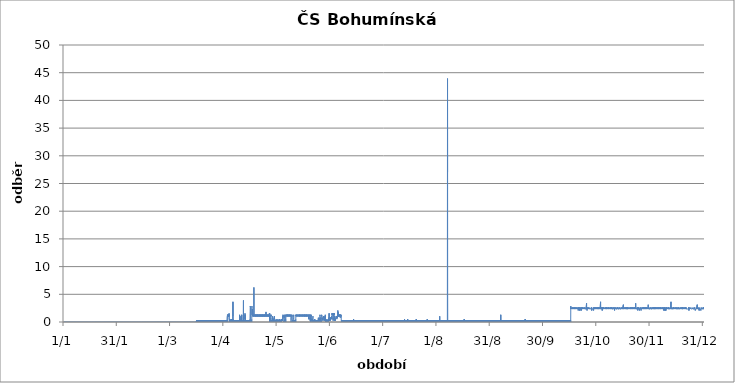
| Category | Series 0 |
|---|---|
| 2012-01-01 01:00:00 | 0 |
| 2012-01-01 02:00:00 | 0 |
| 2012-01-01 03:00:00 | 0 |
| 2012-01-01 04:00:00 | 0 |
| 2012-01-01 05:00:00 | 0 |
| 2012-01-01 06:00:00 | 0 |
| 2012-01-01 07:00:00 | 0 |
| 2012-01-01 08:00:00 | 0 |
| 2012-01-01 09:00:00 | 0 |
| 2012-01-01 10:00:00 | 0 |
| 2012-01-01 11:00:00 | 0 |
| 2012-01-01 12:00:00 | 0 |
| 2012-01-01 13:00:00 | 0 |
| 2012-01-01 14:00:00 | 0 |
| 2012-01-01 15:00:00 | 0 |
| 2012-01-01 16:00:00 | 0 |
| 2012-01-01 17:00:00 | 0 |
| 2012-01-01 18:00:00 | 0 |
| 2012-01-01 19:00:00 | 0 |
| 2012-01-01 20:00:00 | 0 |
| 2012-01-01 21:00:00 | 0 |
| 2012-01-01 22:00:00 | 0 |
| 2012-01-01 23:00:00 | 0 |
| 2012-01-02 | 0 |
| 2012-01-02 01:00:00 | 0 |
| 2012-01-02 02:00:00 | 0 |
| 2012-01-02 03:00:00 | 0 |
| 2012-01-02 04:00:00 | 0 |
| 2012-01-02 05:00:00 | 0 |
| 2012-01-02 06:00:00 | 0 |
| 2012-01-02 07:00:00 | 0 |
| 2012-01-02 08:00:00 | 0 |
| 2012-01-02 09:00:00 | 0 |
| 2012-01-02 10:00:00 | 0 |
| 2012-01-02 11:00:00 | 0 |
| 2012-01-02 12:00:00 | 0 |
| 2012-01-02 13:00:00 | 0 |
| 2012-01-02 14:00:00 | 0 |
| 2012-01-02 15:00:00 | 0 |
| 2012-01-02 16:00:00 | 0 |
| 2012-01-02 17:00:00 | 0 |
| 2012-01-02 18:00:00 | 0 |
| 2012-01-02 19:00:00 | 0 |
| 2012-01-02 20:00:00 | 0 |
| 2012-01-02 21:00:00 | 0 |
| 2012-01-02 22:00:00 | 0 |
| 2012-01-02 23:00:00 | 0 |
| 2012-01-03 | 0 |
| 2012-01-03 01:00:00 | 0 |
| 2012-01-03 02:00:00 | 0 |
| 2012-01-03 03:00:00 | 0 |
| 2012-01-03 04:00:00 | 0 |
| 2012-01-03 05:00:00 | 0 |
| 2012-01-03 06:00:00 | 0 |
| 2012-01-03 07:00:00 | 0 |
| 2012-01-03 08:00:00 | 0 |
| 2012-01-03 09:00:00 | 0 |
| 2012-01-03 10:00:00 | 0 |
| 2012-01-03 11:00:00 | 0 |
| 2012-01-03 12:00:00 | 0 |
| 2012-01-03 13:00:00 | 0 |
| 2012-01-03 14:00:00 | 0 |
| 2012-01-03 15:00:00 | 0 |
| 2012-01-03 16:00:00 | 0 |
| 2012-01-03 17:00:00 | 0 |
| 2012-01-03 18:00:00 | 0 |
| 2012-01-03 19:00:00 | 0 |
| 2012-01-03 20:00:00 | 0 |
| 2012-01-03 21:00:00 | 0 |
| 2012-01-03 22:00:00 | 0 |
| 2012-01-03 23:00:00 | 0 |
| 2012-01-04 | 0 |
| 2012-01-04 01:00:00 | 0 |
| 2012-01-04 02:00:00 | 0 |
| 2012-01-04 03:00:00 | 0 |
| 2012-01-04 04:00:00 | 0 |
| 2012-01-04 05:00:00 | 0 |
| 2012-01-04 06:00:00 | 0 |
| 2012-01-04 07:00:00 | 0 |
| 2012-01-04 08:00:00 | 0 |
| 2012-01-04 09:00:00 | 0 |
| 2012-01-04 10:00:00 | 0 |
| 2012-01-04 11:00:00 | 0 |
| 2012-01-04 12:00:00 | 0 |
| 2012-01-04 13:00:00 | 0 |
| 2012-01-04 14:00:00 | 0 |
| 2012-01-04 15:00:00 | 0 |
| 2012-01-04 16:00:00 | 0 |
| 2012-01-04 17:00:00 | 0 |
| 2012-01-04 18:00:00 | 0 |
| 2012-01-04 19:00:00 | 0 |
| 2012-01-04 20:00:00 | 0 |
| 2012-01-04 21:00:00 | 0 |
| 2012-01-04 22:00:00 | 0 |
| 2012-01-04 23:00:00 | 0 |
| 2012-01-05 | 0 |
| 2012-01-05 01:00:00 | 0 |
| 2012-01-05 02:00:00 | 0 |
| 2012-01-05 03:00:00 | 0 |
| 2012-01-05 04:00:00 | 0 |
| 2012-01-05 05:00:00 | 0 |
| 2012-01-05 06:00:00 | 0 |
| 2012-01-05 07:00:00 | 0 |
| 2012-01-05 08:00:00 | 0 |
| 2012-01-05 09:00:00 | 0 |
| 2012-01-05 10:00:00 | 0 |
| 2012-01-05 11:00:00 | 0 |
| 2012-01-05 12:00:00 | 0 |
| 2012-01-05 13:00:00 | 0 |
| 2012-01-05 14:00:00 | 0 |
| 2012-01-05 15:00:00 | 0 |
| 2012-01-05 16:00:00 | 0 |
| 2012-01-05 17:00:00 | 0 |
| 2012-01-05 18:00:00 | 0 |
| 2012-01-05 19:00:00 | 0 |
| 2012-01-05 20:00:00 | 0 |
| 2012-01-05 21:00:00 | 0 |
| 2012-01-05 22:00:00 | 0 |
| 2012-01-05 23:00:00 | 0 |
| 2012-01-06 | 0 |
| 2012-01-06 01:00:00 | 0 |
| 2012-01-06 02:00:00 | 0 |
| 2012-01-06 03:00:00 | 0 |
| 2012-01-06 04:00:00 | 0 |
| 2012-01-06 05:00:00 | 0 |
| 2012-01-06 06:00:00 | 0 |
| 2012-01-06 07:00:00 | 0 |
| 2012-01-06 08:00:00 | 0 |
| 2012-01-06 09:00:00 | 0 |
| 2012-01-06 10:00:00 | 0 |
| 2012-01-06 11:00:00 | 0 |
| 2012-01-06 12:00:00 | 0 |
| 2012-01-06 13:00:00 | 0 |
| 2012-01-06 14:00:00 | 0 |
| 2012-01-06 15:00:00 | 0 |
| 2012-01-06 16:00:00 | 0 |
| 2012-01-06 17:00:00 | 0 |
| 2012-01-06 18:00:00 | 0 |
| 2012-01-06 19:00:00 | 0 |
| 2012-01-06 20:00:00 | 0 |
| 2012-01-06 21:00:00 | 0 |
| 2012-01-06 22:00:00 | 0 |
| 2012-01-06 23:00:00 | 0 |
| 2012-01-07 | 0 |
| 2012-01-07 01:00:00 | 0 |
| 2012-01-07 02:00:00 | 0 |
| 2012-01-07 03:00:00 | 0 |
| 2012-01-07 04:00:00 | 0 |
| 2012-01-07 05:00:00 | 0 |
| 2012-01-07 06:00:00 | 0 |
| 2012-01-07 07:00:00 | 0 |
| 2012-01-07 08:00:00 | 0 |
| 2012-01-07 09:00:00 | 0 |
| 2012-01-07 10:00:00 | 0 |
| 2012-01-07 11:00:00 | 0 |
| 2012-01-07 12:00:00 | 0 |
| 2012-01-07 13:00:00 | 0 |
| 2012-01-07 14:00:00 | 0 |
| 2012-01-07 15:00:00 | 0 |
| 2012-01-07 16:00:00 | 0 |
| 2012-01-07 17:00:00 | 0 |
| 2012-01-07 18:00:00 | 0 |
| 2012-01-07 19:00:00 | 0 |
| 2012-01-07 20:00:00 | 0 |
| 2012-01-07 21:00:00 | 0 |
| 2012-01-07 22:00:00 | 0 |
| 2012-01-07 23:00:00 | 0 |
| 2012-01-08 | 0 |
| 2012-01-08 01:00:00 | 0 |
| 2012-01-08 02:00:00 | 0 |
| 2012-01-08 03:00:00 | 0 |
| 2012-01-08 04:00:00 | 0 |
| 2012-01-08 05:00:00 | 0 |
| 2012-01-08 06:00:00 | 0 |
| 2012-01-08 07:00:00 | 0 |
| 2012-01-08 08:00:00 | 0 |
| 2012-01-08 09:00:00 | 0 |
| 2012-01-08 10:00:00 | 0 |
| 2012-01-08 11:00:00 | 0 |
| 2012-01-08 12:00:00 | 0 |
| 2012-01-08 13:00:00 | 0 |
| 2012-01-08 14:00:00 | 0 |
| 2012-01-08 15:00:00 | 0 |
| 2012-01-08 16:00:00 | 0 |
| 2012-01-08 17:00:00 | 0 |
| 2012-01-08 18:00:00 | 0 |
| 2012-01-08 19:00:00 | 0 |
| 2012-01-08 20:00:00 | 0 |
| 2012-01-08 21:00:00 | 0 |
| 2012-01-08 22:00:00 | 0 |
| 2012-01-08 23:00:00 | 0 |
| 2012-01-09 | 0 |
| 2012-01-09 01:00:00 | 0 |
| 2012-01-09 02:00:00 | 0 |
| 2012-01-09 03:00:00 | 0 |
| 2012-01-09 04:00:00 | 0 |
| 2012-01-09 05:00:00 | 0 |
| 2012-01-09 06:00:00 | 0 |
| 2012-01-09 07:00:00 | 0 |
| 2012-01-09 08:00:00 | 0 |
| 2012-01-09 09:00:00 | 0 |
| 2012-01-09 10:00:00 | 0 |
| 2012-01-09 11:00:00 | 0 |
| 2012-01-09 12:00:00 | 0 |
| 2012-01-09 13:00:00 | 0 |
| 2012-01-09 14:00:00 | 0 |
| 2012-01-09 15:00:00 | 0 |
| 2012-01-09 16:00:00 | 0 |
| 2012-01-09 17:00:00 | 0 |
| 2012-01-09 18:00:00 | 0 |
| 2012-01-09 19:00:00 | 0 |
| 2012-01-09 20:00:00 | 0 |
| 2012-01-09 21:00:00 | 0 |
| 2012-01-09 22:00:00 | 0 |
| 2012-01-09 23:00:00 | 0 |
| 2012-01-10 | 0 |
| 2012-01-10 01:00:00 | 0 |
| 2012-01-10 02:00:00 | 0 |
| 2012-01-10 03:00:00 | 0 |
| 2012-01-10 04:00:00 | 0 |
| 2012-01-10 05:00:00 | 0 |
| 2012-01-10 06:00:00 | 0 |
| 2012-01-10 07:00:00 | 0 |
| 2012-01-10 08:00:00 | 0 |
| 2012-01-10 09:00:00 | 0 |
| 2012-01-10 10:00:00 | 0 |
| 2012-01-10 11:00:00 | 0 |
| 2012-01-10 12:00:00 | 0 |
| 2012-01-10 13:00:00 | 0 |
| 2012-01-10 14:00:00 | 0 |
| 2012-01-10 15:00:00 | 0 |
| 2012-01-10 16:00:00 | 0 |
| 2012-01-10 17:00:00 | 0 |
| 2012-01-10 18:00:00 | 0 |
| 2012-01-10 19:00:00 | 0 |
| 2012-01-10 20:00:00 | 0 |
| 2012-01-10 21:00:00 | 0 |
| 2012-01-10 22:00:00 | 0 |
| 2012-01-10 23:00:00 | 0 |
| 2012-01-11 | 0 |
| 2012-01-11 01:00:00 | 0 |
| 2012-01-11 02:00:00 | 0 |
| 2012-01-11 03:00:00 | 0 |
| 2012-01-11 04:00:00 | 0 |
| 2012-01-11 05:00:00 | 0 |
| 2012-01-11 06:00:00 | 0 |
| 2012-01-11 07:00:00 | 0 |
| 2012-01-11 08:00:00 | 0 |
| 2012-01-11 09:00:00 | 0 |
| 2012-01-11 10:00:00 | 0 |
| 2012-01-11 11:00:00 | 0 |
| 2012-01-11 12:00:00 | 0 |
| 2012-01-11 13:00:00 | 0 |
| 2012-01-11 14:00:00 | 0 |
| 2012-01-11 15:00:00 | 0 |
| 2012-01-11 16:00:00 | 0 |
| 2012-01-11 17:00:00 | 0 |
| 2012-01-11 18:00:00 | 0 |
| 2012-01-11 19:00:00 | 0 |
| 2012-01-11 20:00:00 | 0 |
| 2012-01-11 21:00:00 | 0 |
| 2012-01-11 22:00:00 | 0 |
| 2012-01-11 23:00:00 | 0 |
| 2012-01-12 | 0 |
| 2012-01-12 01:00:00 | 0 |
| 2012-01-12 02:00:00 | 0 |
| 2012-01-12 03:00:00 | 0 |
| 2012-01-12 04:00:00 | 0 |
| 2012-01-12 05:00:00 | 0 |
| 2012-01-12 06:00:00 | 0 |
| 2012-01-12 07:00:00 | 0 |
| 2012-01-12 08:00:00 | 0 |
| 2012-01-12 09:00:00 | 0 |
| 2012-01-12 10:00:00 | 0 |
| 2012-01-12 11:00:00 | 0 |
| 2012-01-12 12:00:00 | 0 |
| 2012-01-12 13:00:00 | 0 |
| 2012-01-12 14:00:00 | 0 |
| 2012-01-12 15:00:00 | 0 |
| 2012-01-12 16:00:00 | 0 |
| 2012-01-12 17:00:00 | 0 |
| 2012-01-12 18:00:00 | 0 |
| 2012-01-12 19:00:00 | 0 |
| 2012-01-12 20:00:00 | 0 |
| 2012-01-12 21:00:00 | 0 |
| 2012-01-12 22:00:00 | 0 |
| 2012-01-12 23:00:00 | 0 |
| 2012-01-13 | 0 |
| 2012-01-13 01:00:00 | 0 |
| 2012-01-13 02:00:00 | 0 |
| 2012-01-13 03:00:00 | 0 |
| 2012-01-13 04:00:00 | 0 |
| 2012-01-13 05:00:00 | 0 |
| 2012-01-13 06:00:00 | 0 |
| 2012-01-13 07:00:00 | 0 |
| 2012-01-13 08:00:00 | 0 |
| 2012-01-13 09:00:00 | 0 |
| 2012-01-13 10:00:00 | 0 |
| 2012-01-13 11:00:00 | 0 |
| 2012-01-13 12:00:00 | 0 |
| 2012-01-13 13:00:00 | 0 |
| 2012-01-13 14:00:00 | 0 |
| 2012-01-13 15:00:00 | 0 |
| 2012-01-13 16:00:00 | 0 |
| 2012-01-13 17:00:00 | 0 |
| 2012-01-13 18:00:00 | 0 |
| 2012-01-13 19:00:00 | 0 |
| 2012-01-13 20:00:00 | 0 |
| 2012-01-13 21:00:00 | 0 |
| 2012-01-13 22:00:00 | 0 |
| 2012-01-13 23:00:00 | 0 |
| 2012-01-14 | 0 |
| 2012-01-14 01:00:00 | 0 |
| 2012-01-14 02:00:00 | 0 |
| 2012-01-14 03:00:00 | 0 |
| 2012-01-14 04:00:00 | 0 |
| 2012-01-14 05:00:00 | 0 |
| 2012-01-14 06:00:00 | 0 |
| 2012-01-14 07:00:00 | 0 |
| 2012-01-14 08:00:00 | 0 |
| 2012-01-14 09:00:00 | 0 |
| 2012-01-14 10:00:00 | 0 |
| 2012-01-14 11:00:00 | 0 |
| 2012-01-14 12:00:00 | 0 |
| 2012-01-14 13:00:00 | 0 |
| 2012-01-14 14:00:00 | 0 |
| 2012-01-14 15:00:00 | 0 |
| 2012-01-14 16:00:00 | 0 |
| 2012-01-14 17:00:00 | 0 |
| 2012-01-14 18:00:00 | 0 |
| 2012-01-14 19:00:00 | 0 |
| 2012-01-14 20:00:00 | 0 |
| 2012-01-14 21:00:00 | 0 |
| 2012-01-14 22:00:00 | 0 |
| 2012-01-14 23:00:00 | 0 |
| 2012-01-15 | 0 |
| 2012-01-15 01:00:00 | 0 |
| 2012-01-15 02:00:00 | 0 |
| 2012-01-15 03:00:00 | 0 |
| 2012-01-15 04:00:00 | 0 |
| 2012-01-15 05:00:00 | 0 |
| 2012-01-15 06:00:00 | 0 |
| 2012-01-15 07:00:00 | 0 |
| 2012-01-15 08:00:00 | 0 |
| 2012-01-15 09:00:00 | 0 |
| 2012-01-15 10:00:00 | 0 |
| 2012-01-15 11:00:00 | 0 |
| 2012-01-15 12:00:00 | 0 |
| 2012-01-15 13:00:00 | 0 |
| 2012-01-15 14:00:00 | 0 |
| 2012-01-15 15:00:00 | 0 |
| 2012-01-15 16:00:00 | 0 |
| 2012-01-15 17:00:00 | 0 |
| 2012-01-15 18:00:00 | 0 |
| 2012-01-15 19:00:00 | 0 |
| 2012-01-15 20:00:00 | 0 |
| 2012-01-15 21:00:00 | 0 |
| 2012-01-15 22:00:00 | 0 |
| 2012-01-15 23:00:00 | 0 |
| 2012-01-16 | 0 |
| 2012-01-16 01:00:00 | 0 |
| 2012-01-16 02:00:00 | 0 |
| 2012-01-16 03:00:00 | 0 |
| 2012-01-16 04:00:00 | 0 |
| 2012-01-16 05:00:00 | 0 |
| 2012-01-16 06:00:00 | 0 |
| 2012-01-16 07:00:00 | 0 |
| 2012-01-16 08:00:00 | 0 |
| 2012-01-16 09:00:00 | 0 |
| 2012-01-16 10:00:00 | 0 |
| 2012-01-16 11:00:00 | 0 |
| 2012-01-16 12:00:00 | 0 |
| 2012-01-16 13:00:00 | 0 |
| 2012-01-16 14:00:00 | 0 |
| 2012-01-16 15:00:00 | 0 |
| 2012-01-16 16:00:00 | 0 |
| 2012-01-16 17:00:00 | 0 |
| 2012-01-16 18:00:00 | 0 |
| 2012-01-16 19:00:00 | 0 |
| 2012-01-16 20:00:00 | 0 |
| 2012-01-16 21:00:00 | 0 |
| 2012-01-16 22:00:00 | 0 |
| 2012-01-16 23:00:00 | 0 |
| 2012-01-17 | 0 |
| 2012-01-17 01:00:00 | 0 |
| 2012-01-17 02:00:00 | 0 |
| 2012-01-17 03:00:00 | 0 |
| 2012-01-17 04:00:00 | 0 |
| 2012-01-17 05:00:00 | 0 |
| 2012-01-17 06:00:00 | 0 |
| 2012-01-17 07:00:00 | 0 |
| 2012-01-17 08:00:00 | 0 |
| 2012-01-17 09:00:00 | 0 |
| 2012-01-17 10:00:00 | 0 |
| 2012-01-17 11:00:00 | 0 |
| 2012-01-17 12:00:00 | 0 |
| 2012-01-17 13:00:00 | 0 |
| 2012-01-17 14:00:00 | 0 |
| 2012-01-17 15:00:00 | 0 |
| 2012-01-17 16:00:00 | 0 |
| 2012-01-17 17:00:00 | 0 |
| 2012-01-17 18:00:00 | 0 |
| 2012-01-17 19:00:00 | 0 |
| 2012-01-17 20:00:00 | 0 |
| 2012-01-17 21:00:00 | 0 |
| 2012-01-17 22:00:00 | 0 |
| 2012-01-17 23:00:00 | 0 |
| 2012-01-18 | 0 |
| 2012-01-18 01:00:00 | 0 |
| 2012-01-18 02:00:00 | 0 |
| 2012-01-18 03:00:00 | 0 |
| 2012-01-18 04:00:00 | 0 |
| 2012-01-18 05:00:00 | 0 |
| 2012-01-18 06:00:00 | 0 |
| 2012-01-18 07:00:00 | 0 |
| 2012-01-18 08:00:00 | 0 |
| 2012-01-18 09:00:00 | 0 |
| 2012-01-18 10:00:00 | 0 |
| 2012-01-18 11:00:00 | 0 |
| 2012-01-18 12:00:00 | 0 |
| 2012-01-18 13:00:00 | 0 |
| 2012-01-18 14:00:00 | 0 |
| 2012-01-18 15:00:00 | 0 |
| 2012-01-18 16:00:00 | 0 |
| 2012-01-18 17:00:00 | 0 |
| 2012-01-18 18:00:00 | 0 |
| 2012-01-18 19:00:00 | 0 |
| 2012-01-18 20:00:00 | 0 |
| 2012-01-18 21:00:00 | 0 |
| 2012-01-18 22:00:00 | 0 |
| 2012-01-18 23:00:00 | 0 |
| 2012-01-19 | 0 |
| 2012-01-19 01:00:00 | 0 |
| 2012-01-19 02:00:00 | 0 |
| 2012-01-19 03:00:00 | 0 |
| 2012-01-19 04:00:00 | 0 |
| 2012-01-19 05:00:00 | 0 |
| 2012-01-19 06:00:00 | 0 |
| 2012-01-19 07:00:00 | 0 |
| 2012-01-19 08:00:00 | 0 |
| 2012-01-19 09:00:00 | 0 |
| 2012-01-19 10:00:00 | 0 |
| 2012-01-19 11:00:00 | 0 |
| 2012-01-19 12:00:00 | 0 |
| 2012-01-19 13:00:00 | 0 |
| 2012-01-19 14:00:00 | 0 |
| 2012-01-19 15:00:00 | 0 |
| 2012-01-19 16:00:00 | 0 |
| 2012-01-19 17:00:00 | 0 |
| 2012-01-19 18:00:00 | 0 |
| 2012-01-19 19:00:00 | 0 |
| 2012-01-19 20:00:00 | 0 |
| 2012-01-19 21:00:00 | 0 |
| 2012-01-19 22:00:00 | 0 |
| 2012-01-19 23:00:00 | 0 |
| 2012-01-20 | 0 |
| 2012-01-20 01:00:00 | 0 |
| 2012-01-20 02:00:00 | 0 |
| 2012-01-20 03:00:00 | 0 |
| 2012-01-20 04:00:00 | 0 |
| 2012-01-20 05:00:00 | 0 |
| 2012-01-20 06:00:00 | 0 |
| 2012-01-20 07:00:00 | 0 |
| 2012-01-20 08:00:00 | 0 |
| 2012-01-20 09:00:00 | 0 |
| 2012-01-20 10:00:00 | 0 |
| 2012-01-20 11:00:00 | 0 |
| 2012-01-20 12:00:00 | 0 |
| 2012-01-20 13:00:00 | 0 |
| 2012-01-20 14:00:00 | 0 |
| 2012-01-20 15:00:00 | 0 |
| 2012-01-20 16:00:00 | 0 |
| 2012-01-20 17:00:00 | 0 |
| 2012-01-20 18:00:00 | 0 |
| 2012-01-20 19:00:00 | 0 |
| 2012-01-20 20:00:00 | 0 |
| 2012-01-20 21:00:00 | 0 |
| 2012-01-20 22:00:00 | 0 |
| 2012-01-20 23:00:00 | 0 |
| 2012-01-21 | 0 |
| 2012-01-21 01:00:00 | 0 |
| 2012-01-21 02:00:00 | 0 |
| 2012-01-21 03:00:00 | 0 |
| 2012-01-21 04:00:00 | 0 |
| 2012-01-21 05:00:00 | 0 |
| 2012-01-21 06:00:00 | 0 |
| 2012-01-21 07:00:00 | 0 |
| 2012-01-21 08:00:00 | 0 |
| 2012-01-21 09:00:00 | 0 |
| 2012-01-21 10:00:00 | 0 |
| 2012-01-21 11:00:00 | 0 |
| 2012-01-21 12:00:00 | 0 |
| 2012-01-21 13:00:00 | 0 |
| 2012-01-21 14:00:00 | 0 |
| 2012-01-21 15:00:00 | 0 |
| 2012-01-21 16:00:00 | 0 |
| 2012-01-21 17:00:00 | 0 |
| 2012-01-21 18:00:00 | 0 |
| 2012-01-21 19:00:00 | 0 |
| 2012-01-21 20:00:00 | 0 |
| 2012-01-21 21:00:00 | 0 |
| 2012-01-21 22:00:00 | 0 |
| 2012-01-21 23:00:00 | 0 |
| 2012-01-22 | 0 |
| 2012-01-22 01:00:00 | 0 |
| 2012-01-22 02:00:00 | 0 |
| 2012-01-22 03:00:00 | 0 |
| 2012-01-22 04:00:00 | 0 |
| 2012-01-22 05:00:00 | 0 |
| 2012-01-22 06:00:00 | 0 |
| 2012-01-22 07:00:00 | 0 |
| 2012-01-22 08:00:00 | 0 |
| 2012-01-22 09:00:00 | 0 |
| 2012-01-22 10:00:00 | 0 |
| 2012-01-22 11:00:00 | 0 |
| 2012-01-22 12:00:00 | 0 |
| 2012-01-22 13:00:00 | 0 |
| 2012-01-22 14:00:00 | 0 |
| 2012-01-22 15:00:00 | 0 |
| 2012-01-22 16:00:00 | 0 |
| 2012-01-22 17:00:00 | 0 |
| 2012-01-22 18:00:00 | 0 |
| 2012-01-22 19:00:00 | 0 |
| 2012-01-22 20:00:00 | 0 |
| 2012-01-22 21:00:00 | 0 |
| 2012-01-22 22:00:00 | 0 |
| 2012-01-22 23:00:00 | 0 |
| 2012-01-23 | 0 |
| 2012-01-23 01:00:00 | 0 |
| 2012-01-23 02:00:00 | 0 |
| 2012-01-23 03:00:00 | 0 |
| 2012-01-23 04:00:00 | 0 |
| 2012-01-23 05:00:00 | 0 |
| 2012-01-23 06:00:00 | 0 |
| 2012-01-23 07:00:00 | 0 |
| 2012-01-23 08:00:00 | 0 |
| 2012-01-23 09:00:00 | 0 |
| 2012-01-23 10:00:00 | 0 |
| 2012-01-23 11:00:00 | 0 |
| 2012-01-23 12:00:00 | 0 |
| 2012-01-23 13:00:00 | 0 |
| 2012-01-23 14:00:00 | 0 |
| 2012-01-23 15:00:00 | 0 |
| 2012-01-23 16:00:00 | 0 |
| 2012-01-23 17:00:00 | 0 |
| 2012-01-23 18:00:00 | 0 |
| 2012-01-23 19:00:00 | 0 |
| 2012-01-23 20:00:00 | 0 |
| 2012-01-23 21:00:00 | 0 |
| 2012-01-23 22:00:00 | 0 |
| 2012-01-23 23:00:00 | 0 |
| 2012-01-24 | 0 |
| 2012-01-24 01:00:00 | 0 |
| 2012-01-24 02:00:00 | 0 |
| 2012-01-24 03:00:00 | 0 |
| 2012-01-24 04:00:00 | 0 |
| 2012-01-24 05:00:00 | 0 |
| 2012-01-24 06:00:00 | 0 |
| 2012-01-24 07:00:00 | 0 |
| 2012-01-24 08:00:00 | 0 |
| 2012-01-24 09:00:00 | 0 |
| 2012-01-24 10:00:00 | 0 |
| 2012-01-24 11:00:00 | 0 |
| 2012-01-24 12:00:00 | 0 |
| 2012-01-24 13:00:00 | 0 |
| 2012-01-24 14:00:00 | 0 |
| 2012-01-24 15:00:00 | 0 |
| 2012-01-24 16:00:00 | 0 |
| 2012-01-24 17:00:00 | 0 |
| 2012-01-24 18:00:00 | 0 |
| 2012-01-24 19:00:00 | 0 |
| 2012-01-24 20:00:00 | 0 |
| 2012-01-24 21:00:00 | 0 |
| 2012-01-24 22:00:00 | 0 |
| 2012-01-24 23:00:00 | 0 |
| 2012-01-25 | 0 |
| 2012-01-25 01:00:00 | 0 |
| 2012-01-25 02:00:00 | 0 |
| 2012-01-25 03:00:00 | 0 |
| 2012-01-25 04:00:00 | 0 |
| 2012-01-25 05:00:00 | 0 |
| 2012-01-25 06:00:00 | 0 |
| 2012-01-25 07:00:00 | 0 |
| 2012-01-25 08:00:00 | 0 |
| 2012-01-25 09:00:00 | 0 |
| 2012-01-25 10:00:00 | 0 |
| 2012-01-25 11:00:00 | 0 |
| 2012-01-25 12:00:00 | 0 |
| 2012-01-25 13:00:00 | 0 |
| 2012-01-25 14:00:00 | 0 |
| 2012-01-25 15:00:00 | 0 |
| 2012-01-25 16:00:00 | 0 |
| 2012-01-25 17:00:00 | 0 |
| 2012-01-25 18:00:00 | 0 |
| 2012-01-25 19:00:00 | 0 |
| 2012-01-25 20:00:00 | 0 |
| 2012-01-25 21:00:00 | 0 |
| 2012-01-25 22:00:00 | 0 |
| 2012-01-25 23:00:00 | 0 |
| 2012-01-26 | 0 |
| 2012-01-26 01:00:00 | 0 |
| 2012-01-26 02:00:00 | 0 |
| 2012-01-26 03:00:00 | 0 |
| 2012-01-26 04:00:00 | 0 |
| 2012-01-26 05:00:00 | 0 |
| 2012-01-26 06:00:00 | 0 |
| 2012-01-26 07:00:00 | 0 |
| 2012-01-26 08:00:00 | 0 |
| 2012-01-26 09:00:00 | 0 |
| 2012-01-26 10:00:00 | 0 |
| 2012-01-26 11:00:00 | 0 |
| 2012-01-26 12:00:00 | 0 |
| 2012-01-26 13:00:00 | 0 |
| 2012-01-26 14:00:00 | 0 |
| 2012-01-26 15:00:00 | 0 |
| 2012-01-26 16:00:00 | 0 |
| 2012-01-26 17:00:00 | 0 |
| 2012-01-26 18:00:00 | 0 |
| 2012-01-26 19:00:00 | 0 |
| 2012-01-26 20:00:00 | 0 |
| 2012-01-26 21:00:00 | 0 |
| 2012-01-26 22:00:00 | 0 |
| 2012-01-26 23:00:00 | 0 |
| 2012-01-27 | 0 |
| 2012-01-27 01:00:00 | 0 |
| 2012-01-27 02:00:00 | 0 |
| 2012-01-27 03:00:00 | 0 |
| 2012-01-27 04:00:00 | 0 |
| 2012-01-27 05:00:00 | 0 |
| 2012-01-27 06:00:00 | 0 |
| 2012-01-27 07:00:00 | 0 |
| 2012-01-27 08:00:00 | 0 |
| 2012-01-27 09:00:00 | 0 |
| 2012-01-27 10:00:00 | 0 |
| 2012-01-27 11:00:00 | 0 |
| 2012-01-27 12:00:00 | 0 |
| 2012-01-27 13:00:00 | 0 |
| 2012-01-27 14:00:00 | 0 |
| 2012-01-27 15:00:00 | 0 |
| 2012-01-27 16:00:00 | 0 |
| 2012-01-27 17:00:00 | 0 |
| 2012-01-27 18:00:00 | 0 |
| 2012-01-27 19:00:00 | 0 |
| 2012-01-27 20:00:00 | 0 |
| 2012-01-27 21:00:00 | 0 |
| 2012-01-27 22:00:00 | 0 |
| 2012-01-27 23:00:00 | 0 |
| 2012-01-28 | 0 |
| 2012-01-28 01:00:00 | 0 |
| 2012-01-28 02:00:00 | 0 |
| 2012-01-28 03:00:00 | 0 |
| 2012-01-28 04:00:00 | 0 |
| 2012-01-28 05:00:00 | 0 |
| 2012-01-28 06:00:00 | 0 |
| 2012-01-28 07:00:00 | 0 |
| 2012-01-28 08:00:00 | 0 |
| 2012-01-28 09:00:00 | 0 |
| 2012-01-28 10:00:00 | 0 |
| 2012-01-28 11:00:00 | 0 |
| 2012-01-28 12:00:00 | 0 |
| 2012-01-28 13:00:00 | 0 |
| 2012-01-28 14:00:00 | 0 |
| 2012-01-28 15:00:00 | 0 |
| 2012-01-28 16:00:00 | 0 |
| 2012-01-28 17:00:00 | 0 |
| 2012-01-28 18:00:00 | 0 |
| 2012-01-28 19:00:00 | 0 |
| 2012-01-28 20:00:00 | 0 |
| 2012-01-28 21:00:00 | 0 |
| 2012-01-28 22:00:00 | 0 |
| 2012-01-28 23:00:00 | 0 |
| 2012-01-29 | 0 |
| 2012-01-29 01:00:00 | 0 |
| 2012-01-29 02:00:00 | 0 |
| 2012-01-29 03:00:00 | 0 |
| 2012-01-29 04:00:00 | 0 |
| 2012-01-29 05:00:00 | 0 |
| 2012-01-29 06:00:00 | 0 |
| 2012-01-29 07:00:00 | 0 |
| 2012-01-29 08:00:00 | 0 |
| 2012-01-29 09:00:00 | 0 |
| 2012-01-29 10:00:00 | 0 |
| 2012-01-29 11:00:00 | 0 |
| 2012-01-29 12:00:00 | 0 |
| 2012-01-29 13:00:00 | 0 |
| 2012-01-29 14:00:00 | 0 |
| 2012-01-29 15:00:00 | 0 |
| 2012-01-29 16:00:00 | 0 |
| 2012-01-29 17:00:00 | 0 |
| 2012-01-29 18:00:00 | 0 |
| 2012-01-29 19:00:00 | 0 |
| 2012-01-29 20:00:00 | 0 |
| 2012-01-29 21:00:00 | 0 |
| 2012-01-29 22:00:00 | 0 |
| 2012-01-29 23:00:00 | 0 |
| 2012-01-30 | 0 |
| 2012-01-30 01:00:00 | 0 |
| 2012-01-30 02:00:00 | 0 |
| 2012-01-30 03:00:00 | 0 |
| 2012-01-30 04:00:00 | 0 |
| 2012-01-30 05:00:00 | 0 |
| 2012-01-30 06:00:00 | 0 |
| 2012-01-30 07:00:00 | 0 |
| 2012-01-30 08:00:00 | 0 |
| 2012-01-30 09:00:00 | 0 |
| 2012-01-30 10:00:00 | 0 |
| 2012-01-30 11:00:00 | 0 |
| 2012-01-30 12:00:00 | 0 |
| 2012-01-30 13:00:00 | 0 |
| 2012-01-30 14:00:00 | 0 |
| 2012-01-30 15:00:00 | 0 |
| 2012-01-30 16:00:00 | 0 |
| 2012-01-30 17:00:00 | 0 |
| 2012-01-30 18:00:00 | 0 |
| 2012-01-30 19:00:00 | 0 |
| 2012-01-30 20:00:00 | 0 |
| 2012-01-30 21:00:00 | 0 |
| 2012-01-30 22:00:00 | 0 |
| 2012-01-30 23:00:00 | 0 |
| 2012-01-31 | 0 |
| 2012-01-31 01:00:00 | 0 |
| 2012-01-31 02:00:00 | 0 |
| 2012-01-31 03:00:00 | 0 |
| 2012-01-31 04:00:00 | 0 |
| 2012-01-31 05:00:00 | 0 |
| 2012-01-31 06:00:00 | 0 |
| 2012-01-31 07:00:00 | 0 |
| 2012-01-31 08:00:00 | 0 |
| 2012-01-31 09:00:00 | 0 |
| 2012-01-31 10:00:00 | 0 |
| 2012-01-31 11:00:00 | 0 |
| 2012-01-31 12:00:00 | 0 |
| 2012-01-31 13:00:00 | 0 |
| 2012-01-31 14:00:00 | 0 |
| 2012-01-31 15:00:00 | 0 |
| 2012-01-31 16:00:00 | 0 |
| 2012-01-31 17:00:00 | 0 |
| 2012-01-31 18:00:00 | 0 |
| 2012-01-31 19:00:00 | 0 |
| 2012-01-31 20:00:00 | 0 |
| 2012-01-31 21:00:00 | 0 |
| 2012-01-31 22:00:00 | 0 |
| 2012-01-31 23:00:00 | 0 |
| 2012-02-01 | 0 |
| 2012-02-01 01:00:00 | 0 |
| 2012-02-01 02:00:00 | 0 |
| 2012-02-01 03:00:00 | 0 |
| 2012-02-01 04:00:00 | 0 |
| 2012-02-01 05:00:00 | 0 |
| 2012-02-01 06:00:00 | 0 |
| 2012-02-01 07:00:00 | 0 |
| 2012-02-01 08:00:00 | 0 |
| 2012-02-01 09:00:00 | 0 |
| 2012-02-01 10:00:00 | 0 |
| 2012-02-01 11:00:00 | 0 |
| 2012-02-01 12:00:00 | 0 |
| 2012-02-01 13:00:00 | 0 |
| 2012-02-01 14:00:00 | 0 |
| 2012-02-01 15:00:00 | 0 |
| 2012-02-01 16:00:00 | 0 |
| 2012-02-01 17:00:00 | 0 |
| 2012-02-01 18:00:00 | 0 |
| 2012-02-01 19:00:00 | 0 |
| 2012-02-01 20:00:00 | 0 |
| 2012-02-01 21:00:00 | 0 |
| 2012-02-01 22:00:00 | 0 |
| 2012-02-01 23:00:00 | 0 |
| 2012-02-02 | 0 |
| 2012-02-02 01:00:00 | 0 |
| 2012-02-02 02:00:00 | 0 |
| 2012-02-02 03:00:00 | 0 |
| 2012-02-02 04:00:00 | 0 |
| 2012-02-02 05:00:00 | 0 |
| 2012-02-02 06:00:00 | 0 |
| 2012-02-02 07:00:00 | 0 |
| 2012-02-02 08:00:00 | 0 |
| 2012-02-02 09:00:00 | 0 |
| 2012-02-02 10:00:00 | 0 |
| 2012-02-02 11:00:00 | 0 |
| 2012-02-02 12:00:00 | 0 |
| 2012-02-02 13:00:00 | 0 |
| 2012-02-02 14:00:00 | 0 |
| 2012-02-02 15:00:00 | 0 |
| 2012-02-02 16:00:00 | 0 |
| 2012-02-02 17:00:00 | 0 |
| 2012-02-02 18:00:00 | 0 |
| 2012-02-02 19:00:00 | 0 |
| 2012-02-02 20:00:00 | 0 |
| 2012-02-02 21:00:00 | 0 |
| 2012-02-02 22:00:00 | 0 |
| 2012-02-02 23:00:00 | 0 |
| 2012-02-03 | 0 |
| 2012-02-03 01:00:00 | 0 |
| 2012-02-03 02:00:00 | 0 |
| 2012-02-03 03:00:00 | 0 |
| 2012-02-03 04:00:00 | 0 |
| 2012-02-03 05:00:00 | 0 |
| 2012-02-03 06:00:00 | 0 |
| 2012-02-03 07:00:00 | 0 |
| 2012-02-03 08:00:00 | 0 |
| 2012-02-03 09:00:00 | 0 |
| 2012-02-03 10:00:00 | 0 |
| 2012-02-03 11:00:00 | 0 |
| 2012-02-03 12:00:00 | 0 |
| 2012-02-03 13:00:00 | 0 |
| 2012-02-03 14:00:00 | 0 |
| 2012-02-03 15:00:00 | 0 |
| 2012-02-03 16:00:00 | 0 |
| 2012-02-03 17:00:00 | 0 |
| 2012-02-03 18:00:00 | 0 |
| 2012-02-03 19:00:00 | 0 |
| 2012-02-03 20:00:00 | 0 |
| 2012-02-03 21:00:00 | 0 |
| 2012-02-03 22:00:00 | 0 |
| 2012-02-03 23:00:00 | 0 |
| 2012-02-04 | 0 |
| 2012-02-04 01:00:00 | 0 |
| 2012-02-04 02:00:00 | 0 |
| 2012-02-04 03:00:00 | 0 |
| 2012-02-04 04:00:00 | 0 |
| 2012-02-04 05:00:00 | 0 |
| 2012-02-04 06:00:00 | 0 |
| 2012-02-04 07:00:00 | 0 |
| 2012-02-04 08:00:00 | 0 |
| 2012-02-04 09:00:00 | 0 |
| 2012-02-04 10:00:00 | 0 |
| 2012-02-04 11:00:00 | 0 |
| 2012-02-04 12:00:00 | 0 |
| 2012-02-04 13:00:00 | 0 |
| 2012-02-04 14:00:00 | 0 |
| 2012-02-04 15:00:00 | 0 |
| 2012-02-04 16:00:00 | 0 |
| 2012-02-04 17:00:00 | 0 |
| 2012-02-04 18:00:00 | 0 |
| 2012-02-04 19:00:00 | 0 |
| 2012-02-04 20:00:00 | 0 |
| 2012-02-04 21:00:00 | 0 |
| 2012-02-04 22:00:00 | 0 |
| 2012-02-04 23:00:00 | 0 |
| 2012-02-05 | 0 |
| 2012-02-05 01:00:00 | 0 |
| 2012-02-05 02:00:00 | 0 |
| 2012-02-05 03:00:00 | 0 |
| 2012-02-05 04:00:00 | 0 |
| 2012-02-05 05:00:00 | 0 |
| 2012-02-05 06:00:00 | 0 |
| 2012-02-05 07:00:00 | 0 |
| 2012-02-05 08:00:00 | 0 |
| 2012-02-05 09:00:00 | 0 |
| 2012-02-05 10:00:00 | 0 |
| 2012-02-05 11:00:00 | 0 |
| 2012-02-05 12:00:00 | 0 |
| 2012-02-05 13:00:00 | 0 |
| 2012-02-05 14:00:00 | 0 |
| 2012-02-05 15:00:00 | 0 |
| 2012-02-05 16:00:00 | 0 |
| 2012-02-05 17:00:00 | 0 |
| 2012-02-05 18:00:00 | 0 |
| 2012-02-05 19:00:00 | 0 |
| 2012-02-05 20:00:00 | 0 |
| 2012-02-05 21:00:00 | 0 |
| 2012-02-05 22:00:00 | 0 |
| 2012-02-05 23:00:00 | 0 |
| 2012-02-06 | 0 |
| 2012-02-06 01:00:00 | 0 |
| 2012-02-06 02:00:00 | 0 |
| 2012-02-06 03:00:00 | 0 |
| 2012-02-06 04:00:00 | 0 |
| 2012-02-06 05:00:00 | 0 |
| 2012-02-06 06:00:00 | 0 |
| 2012-02-06 07:00:00 | 0 |
| 2012-02-06 08:00:00 | 0 |
| 2012-02-06 09:00:00 | 0 |
| 2012-02-06 10:00:00 | 0 |
| 2012-02-06 11:00:00 | 0 |
| 2012-02-06 12:00:00 | 0 |
| 2012-02-06 13:00:00 | 0 |
| 2012-02-06 14:00:00 | 0 |
| 2012-02-06 15:00:00 | 0 |
| 2012-02-06 16:00:00 | 0 |
| 2012-02-06 17:00:00 | 0 |
| 2012-02-06 18:00:00 | 0 |
| 2012-02-06 19:00:00 | 0 |
| 2012-02-06 20:00:00 | 0 |
| 2012-02-06 21:00:00 | 0 |
| 2012-02-06 22:00:00 | 0 |
| 2012-02-06 23:00:00 | 0 |
| 2012-02-07 | 0 |
| 2012-02-07 01:00:00 | 0 |
| 2012-02-07 02:00:00 | 0 |
| 2012-02-07 03:00:00 | 0 |
| 2012-02-07 04:00:00 | 0 |
| 2012-02-07 05:00:00 | 0 |
| 2012-02-07 06:00:00 | 0 |
| 2012-02-07 07:00:00 | 0 |
| 2012-02-07 08:00:00 | 0 |
| 2012-02-07 09:00:00 | 0 |
| 2012-02-07 10:00:00 | 0 |
| 2012-02-07 11:00:00 | 0 |
| 2012-02-07 12:00:00 | 0 |
| 2012-02-07 13:00:00 | 0 |
| 2012-02-07 14:00:00 | 0 |
| 2012-02-07 15:00:00 | 0 |
| 2012-02-07 16:00:00 | 0 |
| 2012-02-07 17:00:00 | 0 |
| 2012-02-07 18:00:00 | 0 |
| 2012-02-07 19:00:00 | 0 |
| 2012-02-07 20:00:00 | 0 |
| 2012-02-07 21:00:00 | 0 |
| 2012-02-07 22:00:00 | 0 |
| 2012-02-07 23:00:00 | 0 |
| 2012-02-08 | 0 |
| 2012-02-08 01:00:00 | 0 |
| 2012-02-08 02:00:00 | 0 |
| 2012-02-08 03:00:00 | 0 |
| 2012-02-08 04:00:00 | 0 |
| 2012-02-08 05:00:00 | 0 |
| 2012-02-08 06:00:00 | 0 |
| 2012-02-08 07:00:00 | 0 |
| 2012-02-08 08:00:00 | 0 |
| 2012-02-08 09:00:00 | 0 |
| 2012-02-08 10:00:00 | 0 |
| 2012-02-08 11:00:00 | 0 |
| 2012-02-08 12:00:00 | 0 |
| 2012-02-08 13:00:00 | 0 |
| 2012-02-08 14:00:00 | 0 |
| 2012-02-08 15:00:00 | 0 |
| 2012-02-08 16:00:00 | 0 |
| 2012-02-08 17:00:00 | 0 |
| 2012-02-08 18:00:00 | 0 |
| 2012-02-08 19:00:00 | 0 |
| 2012-02-08 20:00:00 | 0 |
| 2012-02-08 21:00:00 | 0 |
| 2012-02-08 22:00:00 | 0 |
| 2012-02-08 23:00:00 | 0 |
| 2012-02-09 | 0 |
| 2012-02-09 01:00:00 | 0 |
| 2012-02-09 02:00:00 | 0 |
| 2012-02-09 03:00:00 | 0 |
| 2012-02-09 04:00:00 | 0 |
| 2012-02-09 05:00:00 | 0 |
| 2012-02-09 06:00:00 | 0 |
| 2012-02-09 07:00:00 | 0 |
| 2012-02-09 08:00:00 | 0 |
| 2012-02-09 09:00:00 | 0 |
| 2012-02-09 10:00:00 | 0 |
| 2012-02-09 11:00:00 | 0 |
| 2012-02-09 12:00:00 | 0 |
| 2012-02-09 13:00:00 | 0 |
| 2012-02-09 14:00:00 | 0 |
| 2012-02-09 15:00:00 | 0 |
| 2012-02-09 16:00:00 | 0 |
| 2012-02-09 17:00:00 | 0 |
| 2012-02-09 18:00:00 | 0 |
| 2012-02-09 19:00:00 | 0 |
| 2012-02-09 20:00:00 | 0 |
| 2012-02-09 21:00:00 | 0 |
| 2012-02-09 22:00:00 | 0 |
| 2012-02-09 23:00:00 | 0 |
| 2012-02-10 | 0 |
| 2012-02-10 01:00:00 | 0 |
| 2012-02-10 02:00:00 | 0 |
| 2012-02-10 03:00:00 | 0 |
| 2012-02-10 04:00:00 | 0 |
| 2012-02-10 05:00:00 | 0 |
| 2012-02-10 06:00:00 | 0 |
| 2012-02-10 07:00:00 | 0 |
| 2012-02-10 08:00:00 | 0 |
| 2012-02-10 09:00:00 | 0 |
| 2012-02-10 10:00:00 | 0 |
| 2012-02-10 11:00:00 | 0 |
| 2012-02-10 12:00:00 | 0 |
| 2012-02-10 13:00:00 | 0 |
| 2012-02-10 14:00:00 | 0 |
| 2012-02-10 15:00:00 | 0 |
| 2012-02-10 16:00:00 | 0 |
| 2012-02-10 17:00:00 | 0 |
| 2012-02-10 18:00:00 | 0 |
| 2012-02-10 19:00:00 | 0 |
| 2012-02-10 20:00:00 | 0 |
| 2012-02-10 21:00:00 | 0 |
| 2012-02-10 22:00:00 | 0 |
| 2012-02-10 23:00:00 | 0 |
| 2012-02-11 | 0 |
| 2012-02-11 01:00:00 | 0 |
| 2012-02-11 02:00:00 | 0 |
| 2012-02-11 03:00:00 | 0 |
| 2012-02-11 04:00:00 | 0 |
| 2012-02-11 05:00:00 | 0 |
| 2012-02-11 06:00:00 | 0 |
| 2012-02-11 07:00:00 | 0 |
| 2012-02-11 08:00:00 | 0 |
| 2012-02-11 09:00:00 | 0 |
| 2012-02-11 10:00:00 | 0 |
| 2012-02-11 11:00:00 | 0 |
| 2012-02-11 12:00:00 | 0 |
| 2012-02-11 13:00:00 | 0 |
| 2012-02-11 14:00:00 | 0 |
| 2012-02-11 15:00:00 | 0 |
| 2012-02-11 16:00:00 | 0 |
| 2012-02-11 17:00:00 | 0 |
| 2012-02-11 18:00:00 | 0 |
| 2012-02-11 19:00:00 | 0 |
| 2012-02-11 20:00:00 | 0 |
| 2012-02-11 21:00:00 | 0 |
| 2012-02-11 22:00:00 | 0 |
| 2012-02-11 23:00:00 | 0 |
| 2012-02-12 | 0 |
| 2012-02-12 01:00:00 | 0 |
| 2012-02-12 02:00:00 | 0 |
| 2012-02-12 03:00:00 | 0 |
| 2012-02-12 04:00:00 | 0 |
| 2012-02-12 05:00:00 | 0 |
| 2012-02-12 06:00:00 | 0 |
| 2012-02-12 07:00:00 | 0 |
| 2012-02-12 08:00:00 | 0 |
| 2012-02-12 09:00:00 | 0 |
| 2012-02-12 10:00:00 | 0 |
| 2012-02-12 11:00:00 | 0 |
| 2012-02-12 12:00:00 | 0 |
| 2012-02-12 13:00:00 | 0 |
| 2012-02-12 14:00:00 | 0 |
| 2012-02-12 15:00:00 | 0 |
| 2012-02-12 16:00:00 | 0 |
| 2012-02-12 17:00:00 | 0 |
| 2012-02-12 18:00:00 | 0 |
| 2012-02-12 19:00:00 | 0 |
| 2012-02-12 20:00:00 | 0 |
| 2012-02-12 21:00:00 | 0 |
| 2012-02-12 22:00:00 | 0 |
| 2012-02-12 23:00:00 | 0 |
| 2012-02-13 | 0 |
| 2012-02-13 01:00:00 | 0 |
| 2012-02-13 02:00:00 | 0 |
| 2012-02-13 03:00:00 | 0 |
| 2012-02-13 04:00:00 | 0 |
| 2012-02-13 05:00:00 | 0 |
| 2012-02-13 06:00:00 | 0 |
| 2012-02-13 07:00:00 | 0 |
| 2012-02-13 08:00:00 | 0 |
| 2012-02-13 09:00:00 | 0 |
| 2012-02-13 10:00:00 | 0 |
| 2012-02-13 11:00:00 | 0 |
| 2012-02-13 12:00:00 | 0 |
| 2012-02-13 13:00:00 | 0 |
| 2012-02-13 14:00:00 | 0 |
| 2012-02-13 15:00:00 | 0 |
| 2012-02-13 16:00:00 | 0 |
| 2012-02-13 17:00:00 | 0 |
| 2012-02-13 18:00:00 | 0 |
| 2012-02-13 19:00:00 | 0 |
| 2012-02-13 20:00:00 | 0 |
| 2012-02-13 21:00:00 | 0 |
| 2012-02-13 22:00:00 | 0 |
| 2012-02-13 23:00:00 | 0 |
| 2012-02-14 | 0 |
| 2012-02-14 01:00:00 | 0 |
| 2012-02-14 02:00:00 | 0 |
| 2012-02-14 03:00:00 | 0 |
| 2012-02-14 04:00:00 | 0 |
| 2012-02-14 05:00:00 | 0 |
| 2012-02-14 06:00:00 | 0 |
| 2012-02-14 07:00:00 | 0 |
| 2012-02-14 08:00:00 | 0 |
| 2012-02-14 09:00:00 | 0 |
| 2012-02-14 10:00:00 | 0 |
| 2012-02-14 11:00:00 | 0 |
| 2012-02-14 12:00:00 | 0 |
| 2012-02-14 13:00:00 | 0 |
| 2012-02-14 14:00:00 | 0 |
| 2012-02-14 15:00:00 | 0 |
| 2012-02-14 16:00:00 | 0 |
| 2012-02-14 17:00:00 | 0 |
| 2012-02-14 18:00:00 | 0 |
| 2012-02-14 19:00:00 | 0 |
| 2012-02-14 20:00:00 | 0 |
| 2012-02-14 21:00:00 | 0 |
| 2012-02-14 22:00:00 | 0 |
| 2012-02-14 23:00:00 | 0 |
| 2012-02-15 | 0 |
| 2012-02-15 01:00:00 | 0 |
| 2012-02-15 02:00:00 | 0 |
| 2012-02-15 03:00:00 | 0 |
| 2012-02-15 04:00:00 | 0 |
| 2012-02-15 05:00:00 | 0 |
| 2012-02-15 06:00:00 | 0 |
| 2012-02-15 07:00:00 | 0 |
| 2012-02-15 08:00:00 | 0 |
| 2012-02-15 09:00:00 | 0 |
| 2012-02-15 10:00:00 | 0 |
| 2012-02-15 11:00:00 | 0 |
| 2012-02-15 12:00:00 | 0 |
| 2012-02-15 13:00:00 | 0 |
| 2012-02-15 14:00:00 | 0 |
| 2012-02-15 15:00:00 | 0 |
| 2012-02-15 16:00:00 | 0 |
| 2012-02-15 17:00:00 | 0 |
| 2012-02-15 18:00:00 | 0 |
| 2012-02-15 19:00:00 | 0 |
| 2012-02-15 20:00:00 | 0 |
| 2012-02-15 21:00:00 | 0 |
| 2012-02-15 22:00:00 | 0 |
| 2012-02-15 23:00:00 | 0 |
| 2012-02-16 | 0 |
| 2012-02-16 01:00:00 | 0 |
| 2012-02-16 02:00:00 | 0 |
| 2012-02-16 03:00:00 | 0 |
| 2012-02-16 04:00:00 | 0 |
| 2012-02-16 05:00:00 | 0 |
| 2012-02-16 06:00:00 | 0 |
| 2012-02-16 07:00:00 | 0 |
| 2012-02-16 08:00:00 | 0 |
| 2012-02-16 09:00:00 | 0 |
| 2012-02-16 10:00:00 | 0 |
| 2012-02-16 11:00:00 | 0 |
| 2012-02-16 12:00:00 | 0 |
| 2012-02-16 13:00:00 | 0 |
| 2012-02-16 14:00:00 | 0 |
| 2012-02-16 15:00:00 | 0 |
| 2012-02-16 16:00:00 | 0 |
| 2012-02-16 17:00:00 | 0 |
| 2012-02-16 18:00:00 | 0 |
| 2012-02-16 19:00:00 | 0 |
| 2012-02-16 20:00:00 | 0 |
| 2012-02-16 21:00:00 | 0 |
| 2012-02-16 22:00:00 | 0 |
| 2012-02-16 23:00:00 | 0 |
| 2012-02-17 | 0 |
| 2012-02-17 01:00:00 | 0 |
| 2012-02-17 02:00:00 | 0 |
| 2012-02-17 03:00:00 | 0 |
| 2012-02-17 04:00:00 | 0 |
| 2012-02-17 05:00:00 | 0 |
| 2012-02-17 06:00:00 | 0 |
| 2012-02-17 07:00:00 | 0 |
| 2012-02-17 08:00:00 | 0 |
| 2012-02-17 09:00:00 | 0 |
| 2012-02-17 10:00:00 | 0 |
| 2012-02-17 11:00:00 | 0 |
| 2012-02-17 12:00:00 | 0 |
| 2012-02-17 13:00:00 | 0 |
| 2012-02-17 14:00:00 | 0 |
| 2012-02-17 15:00:00 | 0 |
| 2012-02-17 16:00:00 | 0 |
| 2012-02-17 17:00:00 | 0 |
| 2012-02-17 18:00:00 | 0 |
| 2012-02-17 19:00:00 | 0 |
| 2012-02-17 20:00:00 | 0 |
| 2012-02-17 21:00:00 | 0 |
| 2012-02-17 22:00:00 | 0 |
| 2012-02-17 23:00:00 | 0 |
| 2012-02-18 | 0 |
| 2012-02-18 01:00:00 | 0 |
| 2012-02-18 02:00:00 | 0 |
| 2012-02-18 03:00:00 | 0 |
| 2012-02-18 04:00:00 | 0 |
| 2012-02-18 05:00:00 | 0 |
| 2012-02-18 06:00:00 | 0 |
| 2012-02-18 07:00:00 | 0 |
| 2012-02-18 08:00:00 | 0 |
| 2012-02-18 09:00:00 | 0 |
| 2012-02-18 10:00:00 | 0 |
| 2012-02-18 11:00:00 | 0 |
| 2012-02-18 12:00:00 | 0 |
| 2012-02-18 13:00:00 | 0 |
| 2012-02-18 14:00:00 | 0 |
| 2012-02-18 15:00:00 | 0 |
| 2012-02-18 16:00:00 | 0 |
| 2012-02-18 17:00:00 | 0 |
| 2012-02-18 18:00:00 | 0 |
| 2012-02-18 19:00:00 | 0 |
| 2012-02-18 20:00:00 | 0 |
| 2012-02-18 21:00:00 | 0 |
| 2012-02-18 22:00:00 | 0 |
| 2012-02-18 23:00:00 | 0 |
| 2012-02-19 | 0 |
| 2012-02-19 01:00:00 | 0 |
| 2012-02-19 02:00:00 | 0 |
| 2012-02-19 03:00:00 | 0 |
| 2012-02-19 04:00:00 | 0 |
| 2012-02-19 05:00:00 | 0 |
| 2012-02-19 06:00:00 | 0 |
| 2012-02-19 07:00:00 | 0 |
| 2012-02-19 08:00:00 | 0 |
| 2012-02-19 09:00:00 | 0 |
| 2012-02-19 10:00:00 | 0 |
| 2012-02-19 11:00:00 | 0 |
| 2012-02-19 12:00:00 | 0 |
| 2012-02-19 13:00:00 | 0 |
| 2012-02-19 14:00:00 | 0 |
| 2012-02-19 15:00:00 | 0 |
| 2012-02-19 16:00:00 | 0 |
| 2012-02-19 17:00:00 | 0 |
| 2012-02-19 18:00:00 | 0 |
| 2012-02-19 19:00:00 | 0 |
| 2012-02-19 20:00:00 | 0 |
| 2012-02-19 21:00:00 | 0 |
| 2012-02-19 22:00:00 | 0 |
| 2012-02-19 23:00:00 | 0 |
| 2012-02-20 | 0 |
| 2012-02-20 01:00:00 | 0 |
| 2012-02-20 02:00:00 | 0 |
| 2012-02-20 03:00:00 | 0 |
| 2012-02-20 04:00:00 | 0 |
| 2012-02-20 05:00:00 | 0 |
| 2012-02-20 06:00:00 | 0 |
| 2012-02-20 07:00:00 | 0 |
| 2012-02-20 08:00:00 | 0 |
| 2012-02-20 09:00:00 | 0 |
| 2012-02-20 10:00:00 | 0 |
| 2012-02-20 11:00:00 | 0 |
| 2012-02-20 12:00:00 | 0 |
| 2012-02-20 13:00:00 | 0 |
| 2012-02-20 14:00:00 | 0 |
| 2012-02-20 15:00:00 | 0 |
| 2012-02-20 16:00:00 | 0 |
| 2012-02-20 17:00:00 | 0 |
| 2012-02-20 18:00:00 | 0 |
| 2012-02-20 19:00:00 | 0 |
| 2012-02-20 20:00:00 | 0 |
| 2012-02-20 21:00:00 | 0 |
| 2012-02-20 22:00:00 | 0 |
| 2012-02-20 23:00:00 | 0 |
| 2012-02-21 | 0 |
| 2012-02-21 01:00:00 | 0 |
| 2012-02-21 02:00:00 | 0 |
| 2012-02-21 03:00:00 | 0 |
| 2012-02-21 04:00:00 | 0 |
| 2012-02-21 05:00:00 | 0 |
| 2012-02-21 06:00:00 | 0 |
| 2012-02-21 07:00:00 | 0 |
| 2012-02-21 08:00:00 | 0 |
| 2012-02-21 09:00:00 | 0 |
| 2012-02-21 10:00:00 | 0 |
| 2012-02-21 11:00:00 | 0 |
| 2012-02-21 12:00:00 | 0 |
| 2012-02-21 13:00:00 | 0 |
| 2012-02-21 14:00:00 | 0 |
| 2012-02-21 15:00:00 | 0 |
| 2012-02-21 16:00:00 | 0 |
| 2012-02-21 17:00:00 | 0 |
| 2012-02-21 18:00:00 | 0 |
| 2012-02-21 19:00:00 | 0 |
| 2012-02-21 20:00:00 | 0 |
| 2012-02-21 21:00:00 | 0 |
| 2012-02-21 22:00:00 | 0 |
| 2012-02-21 23:00:00 | 0 |
| 2012-02-22 | 0 |
| 2012-02-22 01:00:00 | 0 |
| 2012-02-22 02:00:00 | 0 |
| 2012-02-22 03:00:00 | 0 |
| 2012-02-22 04:00:00 | 0 |
| 2012-02-22 05:00:00 | 0 |
| 2012-02-22 06:00:00 | 0 |
| 2012-02-22 07:00:00 | 0 |
| 2012-02-22 08:00:00 | 0 |
| 2012-02-22 09:00:00 | 0 |
| 2012-02-22 10:00:00 | 0 |
| 2012-02-22 11:00:00 | 0 |
| 2012-02-22 12:00:00 | 0 |
| 2012-02-22 13:00:00 | 0 |
| 2012-02-22 14:00:00 | 0 |
| 2012-02-22 15:00:00 | 0 |
| 2012-02-22 16:00:00 | 0 |
| 2012-02-22 17:00:00 | 0 |
| 2012-02-22 18:00:00 | 0 |
| 2012-02-22 19:00:00 | 0 |
| 2012-02-22 20:00:00 | 0 |
| 2012-02-22 21:00:00 | 0 |
| 2012-02-22 22:00:00 | 0 |
| 2012-02-22 23:00:00 | 0 |
| 2012-02-23 | 0 |
| 2012-02-23 01:00:00 | 0 |
| 2012-02-23 02:00:00 | 0 |
| 2012-02-23 03:00:00 | 0 |
| 2012-02-23 04:00:00 | 0 |
| 2012-02-23 05:00:00 | 0 |
| 2012-02-23 06:00:00 | 0 |
| 2012-02-23 07:00:00 | 0 |
| 2012-02-23 08:00:00 | 0 |
| 2012-02-23 09:00:00 | 0 |
| 2012-02-23 10:00:00 | 0 |
| 2012-02-23 11:00:00 | 0 |
| 2012-02-23 12:00:00 | 0 |
| 2012-02-23 13:00:00 | 0 |
| 2012-02-23 14:00:00 | 0 |
| 2012-02-23 15:00:00 | 0 |
| 2012-02-23 16:00:00 | 0 |
| 2012-02-23 17:00:00 | 0 |
| 2012-02-23 18:00:00 | 0 |
| 2012-02-23 19:00:00 | 0 |
| 2012-02-23 20:00:00 | 0 |
| 2012-02-23 21:00:00 | 0 |
| 2012-02-23 22:00:00 | 0 |
| 2012-02-23 23:00:00 | 0 |
| 2012-02-24 | 0 |
| 2012-02-24 01:00:00 | 0 |
| 2012-02-24 02:00:00 | 0 |
| 2012-02-24 03:00:00 | 0 |
| 2012-02-24 04:00:00 | 0 |
| 2012-02-24 05:00:00 | 0 |
| 2012-02-24 06:00:00 | 0 |
| 2012-02-24 07:00:00 | 0 |
| 2012-02-24 08:00:00 | 0 |
| 2012-02-24 09:00:00 | 0 |
| 2012-02-24 10:00:00 | 0 |
| 2012-02-24 11:00:00 | 0 |
| 2012-02-24 12:00:00 | 0 |
| 2012-02-24 13:00:00 | 0 |
| 2012-02-24 14:00:00 | 0 |
| 2012-02-24 15:00:00 | 0 |
| 2012-02-24 16:00:00 | 0 |
| 2012-02-24 17:00:00 | 0 |
| 2012-02-24 18:00:00 | 0 |
| 2012-02-24 19:00:00 | 0 |
| 2012-02-24 20:00:00 | 0 |
| 2012-02-24 21:00:00 | 0 |
| 2012-02-24 22:00:00 | 0 |
| 2012-02-24 23:00:00 | 0 |
| 2012-02-25 | 0 |
| 2012-02-25 01:00:00 | 0 |
| 2012-02-25 02:00:00 | 0 |
| 2012-02-25 03:00:00 | 0 |
| 2012-02-25 04:00:00 | 0 |
| 2012-02-25 05:00:00 | 0 |
| 2012-02-25 06:00:00 | 0 |
| 2012-02-25 07:00:00 | 0 |
| 2012-02-25 08:00:00 | 0 |
| 2012-02-25 09:00:00 | 0 |
| 2012-02-25 10:00:00 | 0 |
| 2012-02-25 11:00:00 | 0 |
| 2012-02-25 12:00:00 | 0 |
| 2012-02-25 13:00:00 | 0 |
| 2012-02-25 14:00:00 | 0 |
| 2012-02-25 15:00:00 | 0 |
| 2012-02-25 16:00:00 | 0 |
| 2012-02-25 17:00:00 | 0 |
| 2012-02-25 18:00:00 | 0 |
| 2012-02-25 19:00:00 | 0 |
| 2012-02-25 20:00:00 | 0 |
| 2012-02-25 21:00:00 | 0 |
| 2012-02-25 22:00:00 | 0 |
| 2012-02-25 23:00:00 | 0 |
| 2012-02-26 | 0 |
| 2012-02-26 01:00:00 | 0 |
| 2012-02-26 02:00:00 | 0 |
| 2012-02-26 03:00:00 | 0 |
| 2012-02-26 04:00:00 | 0 |
| 2012-02-26 05:00:00 | 0 |
| 2012-02-26 06:00:00 | 0 |
| 2012-02-26 07:00:00 | 0 |
| 2012-02-26 08:00:00 | 0 |
| 2012-02-26 09:00:00 | 0 |
| 2012-02-26 10:00:00 | 0 |
| 2012-02-26 11:00:00 | 0 |
| 2012-02-26 12:00:00 | 0 |
| 2012-02-26 13:00:00 | 0 |
| 2012-02-26 14:00:00 | 0 |
| 2012-02-26 15:00:00 | 0 |
| 2012-02-26 16:00:00 | 0 |
| 2012-02-26 17:00:00 | 0 |
| 2012-02-26 18:00:00 | 0 |
| 2012-02-26 19:00:00 | 0 |
| 2012-02-26 20:00:00 | 0 |
| 2012-02-26 21:00:00 | 0 |
| 2012-02-26 22:00:00 | 0 |
| 2012-02-26 23:00:00 | 0 |
| 2012-02-27 | 0 |
| 2012-02-27 01:00:00 | 0 |
| 2012-02-27 02:00:00 | 0 |
| 2012-02-27 03:00:00 | 0 |
| 2012-02-27 04:00:00 | 0 |
| 2012-02-27 05:00:00 | 0 |
| 2012-02-27 06:00:00 | 0 |
| 2012-02-27 07:00:00 | 0 |
| 2012-02-27 08:00:00 | 0 |
| 2012-02-27 09:00:00 | 0 |
| 2012-02-27 10:00:00 | 0 |
| 2012-02-27 11:00:00 | 0 |
| 2012-02-27 12:00:00 | 0 |
| 2012-02-27 13:00:00 | 0 |
| 2012-02-27 14:00:00 | 0 |
| 2012-02-27 15:00:00 | 0 |
| 2012-02-27 16:00:00 | 0 |
| 2012-02-27 17:00:00 | 0 |
| 2012-02-27 18:00:00 | 0 |
| 2012-02-27 19:00:00 | 0 |
| 2012-02-27 20:00:00 | 0 |
| 2012-02-27 21:00:00 | 0 |
| 2012-02-27 22:00:00 | 0 |
| 2012-02-27 23:00:00 | 0 |
| 2012-02-28 | 0 |
| 2012-02-28 01:00:00 | 0 |
| 2012-02-28 02:00:00 | 0 |
| 2012-02-28 03:00:00 | 0 |
| 2012-02-28 04:00:00 | 0 |
| 2012-02-28 05:00:00 | 0 |
| 2012-02-28 06:00:00 | 0 |
| 2012-02-28 07:00:00 | 0 |
| 2012-02-28 08:00:00 | 0 |
| 2012-02-28 09:00:00 | 0 |
| 2012-02-28 10:00:00 | 0 |
| 2012-02-28 11:00:00 | 0 |
| 2012-02-28 12:00:00 | 0 |
| 2012-02-28 13:00:00 | 0 |
| 2012-02-28 14:00:00 | 0 |
| 2012-02-28 15:00:00 | 0 |
| 2012-02-28 16:00:00 | 0 |
| 2012-02-28 17:00:00 | 0 |
| 2012-02-28 18:00:00 | 0 |
| 2012-02-28 19:00:00 | 0 |
| 2012-02-28 20:00:00 | 0 |
| 2012-02-28 21:00:00 | 0 |
| 2012-02-28 22:00:00 | 0 |
| 2012-02-28 23:00:00 | 0 |
| 2012-02-29 | 0 |
| 2012-02-29 01:00:00 | 0 |
| 2012-02-29 02:00:00 | 0 |
| 2012-02-29 03:00:00 | 0 |
| 2012-02-29 04:00:00 | 0 |
| 2012-02-29 05:00:00 | 0 |
| 2012-02-29 06:00:00 | 0 |
| 2012-02-29 07:00:00 | 0 |
| 2012-02-29 08:00:00 | 0 |
| 2012-02-29 09:00:00 | 0 |
| 2012-02-29 10:00:00 | 0 |
| 2012-02-29 11:00:00 | 0 |
| 2012-02-29 12:00:00 | 0 |
| 2012-02-29 13:00:00 | 0 |
| 2012-02-29 14:00:00 | 0 |
| 2012-02-29 15:00:00 | 0 |
| 2012-02-29 16:00:00 | 0 |
| 2012-02-29 17:00:00 | 0 |
| 2012-02-29 18:00:00 | 0 |
| 2012-02-29 19:00:00 | 0 |
| 2012-02-29 20:00:00 | 0 |
| 2012-02-29 21:00:00 | 0 |
| 2012-02-29 22:00:00 | 0 |
| 2012-02-29 23:00:00 | 0 |
| 2012-03-01 | 0 |
| 2012-03-01 01:00:00 | 0 |
| 2012-03-01 02:00:00 | 0 |
| 2012-03-01 03:00:00 | 0 |
| 2012-03-01 04:00:00 | 0 |
| 2012-03-01 05:00:00 | 0 |
| 2012-03-01 06:00:00 | 0 |
| 2012-03-01 07:00:00 | 0 |
| 2012-03-01 08:00:00 | 0 |
| 2012-03-01 09:00:00 | 0 |
| 2012-03-01 10:00:00 | 0 |
| 2012-03-01 11:00:00 | 0 |
| 2012-03-01 12:00:00 | 0 |
| 2012-03-01 13:00:00 | 0 |
| 2012-03-01 14:00:00 | 0 |
| 2012-03-01 15:00:00 | 0 |
| 2012-03-01 16:00:00 | 0 |
| 2012-03-01 17:00:00 | 0 |
| 2012-03-01 18:00:00 | 0 |
| 2012-03-01 19:00:00 | 0 |
| 2012-03-01 20:00:00 | 0 |
| 2012-03-01 21:00:00 | 0 |
| 2012-03-01 22:00:00 | 0 |
| 2012-03-01 23:00:00 | 0 |
| 2012-03-02 | 0 |
| 2012-03-02 01:00:00 | 0 |
| 2012-03-02 02:00:00 | 0 |
| 2012-03-02 03:00:00 | 0 |
| 2012-03-02 04:00:00 | 0 |
| 2012-03-02 05:00:00 | 0 |
| 2012-03-02 06:00:00 | 0 |
| 2012-03-02 07:00:00 | 0 |
| 2012-03-02 08:00:00 | 0 |
| 2012-03-02 09:00:00 | 0 |
| 2012-03-02 10:00:00 | 0 |
| 2012-03-02 11:00:00 | 0 |
| 2012-03-02 12:00:00 | 0 |
| 2012-03-02 13:00:00 | 0 |
| 2012-03-02 14:00:00 | 0 |
| 2012-03-02 15:00:00 | 0 |
| 2012-03-02 16:00:00 | 0 |
| 2012-03-02 17:00:00 | 0 |
| 2012-03-02 18:00:00 | 0 |
| 2012-03-02 19:00:00 | 0 |
| 2012-03-02 20:00:00 | 0 |
| 2012-03-02 21:00:00 | 0 |
| 2012-03-02 22:00:00 | 0 |
| 2012-03-02 23:00:00 | 0 |
| 2012-03-03 | 0 |
| 2012-03-03 01:00:00 | 0 |
| 2012-03-03 02:00:00 | 0 |
| 2012-03-03 03:00:00 | 0 |
| 2012-03-03 04:00:00 | 0 |
| 2012-03-03 05:00:00 | 0 |
| 2012-03-03 06:00:00 | 0 |
| 2012-03-03 07:00:00 | 0 |
| 2012-03-03 08:00:00 | 0 |
| 2012-03-03 09:00:00 | 0 |
| 2012-03-03 10:00:00 | 0 |
| 2012-03-03 11:00:00 | 0 |
| 2012-03-03 12:00:00 | 0 |
| 2012-03-03 13:00:00 | 0 |
| 2012-03-03 14:00:00 | 0 |
| 2012-03-03 15:00:00 | 0 |
| 2012-03-03 16:00:00 | 0 |
| 2012-03-03 17:00:00 | 0 |
| 2012-03-03 18:00:00 | 0 |
| 2012-03-03 19:00:00 | 0 |
| 2012-03-03 20:00:00 | 0 |
| 2012-03-03 21:00:00 | 0 |
| 2012-03-03 22:00:00 | 0 |
| 2012-03-03 23:00:00 | 0 |
| 2012-03-04 | 0 |
| 2012-03-04 01:00:00 | 0 |
| 2012-03-04 02:00:00 | 0 |
| 2012-03-04 03:00:00 | 0 |
| 2012-03-04 04:00:00 | 0 |
| 2012-03-04 05:00:00 | 0 |
| 2012-03-04 06:00:00 | 0 |
| 2012-03-04 07:00:00 | 0 |
| 2012-03-04 08:00:00 | 0 |
| 2012-03-04 09:00:00 | 0 |
| 2012-03-04 10:00:00 | 0 |
| 2012-03-04 11:00:00 | 0 |
| 2012-03-04 12:00:00 | 0 |
| 2012-03-04 13:00:00 | 0 |
| 2012-03-04 14:00:00 | 0 |
| 2012-03-04 15:00:00 | 0 |
| 2012-03-04 16:00:00 | 0 |
| 2012-03-04 17:00:00 | 0 |
| 2012-03-04 18:00:00 | 0 |
| 2012-03-04 19:00:00 | 0 |
| 2012-03-04 20:00:00 | 0 |
| 2012-03-04 21:00:00 | 0 |
| 2012-03-04 22:00:00 | 0 |
| 2012-03-04 23:00:00 | 0 |
| 2012-03-05 | 0 |
| 2012-03-05 01:00:00 | 0 |
| 2012-03-05 02:00:00 | 0 |
| 2012-03-05 03:00:00 | 0 |
| 2012-03-05 04:00:00 | 0 |
| 2012-03-05 05:00:00 | 0 |
| 2012-03-05 06:00:00 | 0 |
| 2012-03-05 07:00:00 | 0 |
| 2012-03-05 08:00:00 | 0 |
| 2012-03-05 09:00:00 | 0 |
| 2012-03-05 10:00:00 | 0 |
| 2012-03-05 11:00:00 | 0 |
| 2012-03-05 12:00:00 | 0 |
| 2012-03-05 13:00:00 | 0 |
| 2012-03-05 14:00:00 | 0 |
| 2012-03-05 15:00:00 | 0 |
| 2012-03-05 16:00:00 | 0 |
| 2012-03-05 17:00:00 | 0 |
| 2012-03-05 18:00:00 | 0 |
| 2012-03-05 19:00:00 | 0 |
| 2012-03-05 20:00:00 | 0 |
| 2012-03-05 21:00:00 | 0 |
| 2012-03-05 22:00:00 | 0 |
| 2012-03-05 23:00:00 | 0 |
| 2012-03-06 | 0 |
| 2012-03-06 01:00:00 | 0 |
| 2012-03-06 02:00:00 | 0 |
| 2012-03-06 03:00:00 | 0 |
| 2012-03-06 04:00:00 | 0 |
| 2012-03-06 05:00:00 | 0 |
| 2012-03-06 06:00:00 | 0 |
| 2012-03-06 07:00:00 | 0 |
| 2012-03-06 08:00:00 | 0 |
| 2012-03-06 09:00:00 | 0 |
| 2012-03-06 10:00:00 | 0 |
| 2012-03-06 11:00:00 | 0 |
| 2012-03-06 12:00:00 | 0 |
| 2012-03-06 13:00:00 | 0 |
| 2012-03-06 14:00:00 | 0 |
| 2012-03-06 15:00:00 | 0 |
| 2012-03-06 16:00:00 | 0 |
| 2012-03-06 17:00:00 | 0 |
| 2012-03-06 18:00:00 | 0 |
| 2012-03-06 19:00:00 | 0 |
| 2012-03-06 20:00:00 | 0 |
| 2012-03-06 21:00:00 | 0 |
| 2012-03-06 22:00:00 | 0 |
| 2012-03-06 23:00:00 | 0 |
| 2012-03-07 | 0 |
| 2012-03-07 01:00:00 | 0 |
| 2012-03-07 02:00:00 | 0 |
| 2012-03-07 03:00:00 | 0 |
| 2012-03-07 04:00:00 | 0 |
| 2012-03-07 05:00:00 | 0 |
| 2012-03-07 06:00:00 | 0 |
| 2012-03-07 07:00:00 | 0 |
| 2012-03-07 08:00:00 | 0 |
| 2012-03-07 09:00:00 | 0 |
| 2012-03-07 10:00:00 | 0 |
| 2012-03-07 11:00:00 | 0 |
| 2012-03-07 12:00:00 | 0 |
| 2012-03-07 13:00:00 | 0 |
| 2012-03-07 14:00:00 | 0 |
| 2012-03-07 15:00:00 | 0 |
| 2012-03-07 16:00:00 | 0 |
| 2012-03-07 17:00:00 | 0 |
| 2012-03-07 18:00:00 | 0 |
| 2012-03-07 19:00:00 | 0 |
| 2012-03-07 20:00:00 | 0 |
| 2012-03-07 21:00:00 | 0 |
| 2012-03-07 22:00:00 | 0 |
| 2012-03-07 23:00:00 | 0 |
| 2012-03-08 | 0 |
| 2012-03-08 01:00:00 | 0 |
| 2012-03-08 02:00:00 | 0 |
| 2012-03-08 03:00:00 | 0 |
| 2012-03-08 04:00:00 | 0 |
| 2012-03-08 05:00:00 | 0 |
| 2012-03-08 06:00:00 | 0 |
| 2012-03-08 07:00:00 | 0 |
| 2012-03-08 08:00:00 | 0 |
| 2012-03-08 09:00:00 | 0 |
| 2012-03-08 10:00:00 | 0 |
| 2012-03-08 11:00:00 | 0 |
| 2012-03-08 12:00:00 | 0 |
| 2012-03-08 13:00:00 | 0 |
| 2012-03-08 14:00:00 | 0 |
| 2012-03-08 15:00:00 | 0 |
| 2012-03-08 16:00:00 | 0 |
| 2012-03-08 17:00:00 | 0 |
| 2012-03-08 18:00:00 | 0 |
| 2012-03-08 19:00:00 | 0 |
| 2012-03-08 20:00:00 | 0 |
| 2012-03-08 21:00:00 | 0 |
| 2012-03-08 22:00:00 | 0 |
| 2012-03-08 23:00:00 | 0 |
| 2012-03-09 | 0 |
| 2012-03-09 01:00:00 | 0 |
| 2012-03-09 02:00:00 | 0 |
| 2012-03-09 03:00:00 | 0 |
| 2012-03-09 04:00:00 | 0 |
| 2012-03-09 05:00:00 | 0 |
| 2012-03-09 06:00:00 | 0 |
| 2012-03-09 07:00:00 | 0 |
| 2012-03-09 08:00:00 | 0 |
| 2012-03-09 09:00:00 | 0 |
| 2012-03-09 10:00:00 | 0 |
| 2012-03-09 11:00:00 | 0 |
| 2012-03-09 12:00:00 | 0 |
| 2012-03-09 13:00:00 | 0 |
| 2012-03-09 14:00:00 | 0 |
| 2012-03-09 15:00:00 | 0 |
| 2012-03-09 16:00:00 | 0 |
| 2012-03-09 17:00:00 | 0 |
| 2012-03-09 18:00:00 | 0 |
| 2012-03-09 19:00:00 | 0 |
| 2012-03-09 20:00:00 | 0 |
| 2012-03-09 21:00:00 | 0 |
| 2012-03-09 22:00:00 | 0 |
| 2012-03-09 23:00:00 | 0 |
| 2012-03-10 | 0 |
| 2012-03-10 01:00:00 | 0 |
| 2012-03-10 02:00:00 | 0 |
| 2012-03-10 03:00:00 | 0 |
| 2012-03-10 04:00:00 | 0 |
| 2012-03-10 05:00:00 | 0 |
| 2012-03-10 06:00:00 | 0 |
| 2012-03-10 07:00:00 | 0 |
| 2012-03-10 08:00:00 | 0 |
| 2012-03-10 09:00:00 | 0 |
| 2012-03-10 10:00:00 | 0 |
| 2012-03-10 11:00:00 | 0 |
| 2012-03-10 12:00:00 | 0 |
| 2012-03-10 13:00:00 | 0 |
| 2012-03-10 14:00:00 | 0 |
| 2012-03-10 15:00:00 | 0 |
| 2012-03-10 16:00:00 | 0 |
| 2012-03-10 17:00:00 | 0 |
| 2012-03-10 18:00:00 | 0 |
| 2012-03-10 19:00:00 | 0 |
| 2012-03-10 20:00:00 | 0 |
| 2012-03-10 21:00:00 | 0 |
| 2012-03-10 22:00:00 | 0 |
| 2012-03-10 23:00:00 | 0 |
| 2012-03-11 | 0 |
| 2012-03-11 01:00:00 | 0 |
| 2012-03-11 02:00:00 | 0 |
| 2012-03-11 03:00:00 | 0 |
| 2012-03-11 04:00:00 | 0 |
| 2012-03-11 05:00:00 | 0 |
| 2012-03-11 06:00:00 | 0 |
| 2012-03-11 07:00:00 | 0 |
| 2012-03-11 08:00:00 | 0 |
| 2012-03-11 09:00:00 | 0 |
| 2012-03-11 10:00:00 | 0 |
| 2012-03-11 11:00:00 | 0 |
| 2012-03-11 12:00:00 | 0 |
| 2012-03-11 13:00:00 | 0 |
| 2012-03-11 14:00:00 | 0 |
| 2012-03-11 15:00:00 | 0 |
| 2012-03-11 16:00:00 | 0 |
| 2012-03-11 17:00:00 | 0 |
| 2012-03-11 18:00:00 | 0 |
| 2012-03-11 19:00:00 | 0 |
| 2012-03-11 20:00:00 | 0 |
| 2012-03-11 21:00:00 | 0 |
| 2012-03-11 22:00:00 | 0 |
| 2012-03-11 23:00:00 | 0 |
| 2012-03-12 | 0 |
| 2012-03-12 01:00:00 | 0 |
| 2012-03-12 02:00:00 | 0 |
| 2012-03-12 03:00:00 | 0 |
| 2012-03-12 04:00:00 | 0 |
| 2012-03-12 05:00:00 | 0 |
| 2012-03-12 06:00:00 | 0 |
| 2012-03-12 07:00:00 | 0 |
| 2012-03-12 08:00:00 | 0 |
| 2012-03-12 09:00:00 | 0 |
| 2012-03-12 10:00:00 | 0 |
| 2012-03-12 11:00:00 | 0 |
| 2012-03-12 12:00:00 | 0 |
| 2012-03-12 13:00:00 | 0 |
| 2012-03-12 14:00:00 | 0 |
| 2012-03-12 15:00:00 | 0 |
| 2012-03-12 16:00:00 | 0 |
| 2012-03-12 17:00:00 | 0 |
| 2012-03-12 18:00:00 | 0 |
| 2012-03-12 19:00:00 | 0 |
| 2012-03-12 20:00:00 | 0 |
| 2012-03-12 21:00:00 | 0 |
| 2012-03-12 22:00:00 | 0 |
| 2012-03-12 23:00:00 | 0 |
| 2012-03-13 | 0 |
| 2012-03-13 01:00:00 | 0 |
| 2012-03-13 02:00:00 | 0 |
| 2012-03-13 03:00:00 | 0 |
| 2012-03-13 04:00:00 | 0 |
| 2012-03-13 05:00:00 | 0 |
| 2012-03-13 06:00:00 | 0 |
| 2012-03-13 07:00:00 | 0 |
| 2012-03-13 08:00:00 | 0 |
| 2012-03-13 09:00:00 | 0 |
| 2012-03-13 10:00:00 | 0 |
| 2012-03-13 11:00:00 | 0 |
| 2012-03-13 12:00:00 | 0 |
| 2012-03-13 13:00:00 | 0 |
| 2012-03-13 14:00:00 | 0 |
| 2012-03-13 15:00:00 | 0 |
| 2012-03-13 16:00:00 | 0 |
| 2012-03-13 17:00:00 | 0 |
| 2012-03-13 18:00:00 | 0 |
| 2012-03-13 19:00:00 | 0 |
| 2012-03-13 20:00:00 | 0 |
| 2012-03-13 21:00:00 | 0 |
| 2012-03-13 22:00:00 | 0 |
| 2012-03-13 23:00:00 | 0 |
| 2012-03-14 | 0 |
| 2012-03-14 01:00:00 | 0 |
| 2012-03-14 02:00:00 | 0 |
| 2012-03-14 03:00:00 | 0 |
| 2012-03-14 04:00:00 | 0 |
| 2012-03-14 05:00:00 | 0 |
| 2012-03-14 06:00:00 | 0 |
| 2012-03-14 07:00:00 | 0 |
| 2012-03-14 08:00:00 | 0 |
| 2012-03-14 09:00:00 | 0 |
| 2012-03-14 10:00:00 | 0 |
| 2012-03-14 11:00:00 | 0 |
| 2012-03-14 12:00:00 | 0 |
| 2012-03-14 13:00:00 | 0 |
| 2012-03-14 14:00:00 | 0 |
| 2012-03-14 15:00:00 | 0 |
| 2012-03-14 16:00:00 | 0 |
| 2012-03-14 17:00:00 | 0 |
| 2012-03-14 18:00:00 | 0 |
| 2012-03-14 19:00:00 | 0 |
| 2012-03-14 20:00:00 | 0 |
| 2012-03-14 21:00:00 | 0 |
| 2012-03-14 22:00:00 | 0 |
| 2012-03-14 23:00:00 | 0 |
| 2012-03-15 | 0 |
| 2012-03-15 01:00:00 | 0 |
| 2012-03-15 02:00:00 | 0 |
| 2012-03-15 03:00:00 | 0 |
| 2012-03-15 04:00:00 | 0 |
| 2012-03-15 05:00:00 | 0 |
| 2012-03-15 06:00:00 | 0 |
| 2012-03-15 07:00:00 | 0 |
| 2012-03-15 08:00:00 | 0 |
| 2012-03-15 09:00:00 | 0 |
| 2012-03-15 10:00:00 | 0 |
| 2012-03-15 11:00:00 | 0 |
| 2012-03-15 12:00:00 | 0 |
| 2012-03-15 13:00:00 | 0 |
| 2012-03-15 14:00:00 | 0 |
| 2012-03-15 15:00:00 | 0 |
| 2012-03-15 16:00:00 | 0 |
| 2012-03-15 17:00:00 | 0 |
| 2012-03-15 18:00:00 | 0 |
| 2012-03-15 19:00:00 | 0 |
| 2012-03-15 20:00:00 | 0 |
| 2012-03-15 21:00:00 | 0 |
| 2012-03-15 22:00:00 | 0 |
| 2012-03-15 23:00:00 | 0 |
| 2012-03-16 | 0 |
| 2012-03-16 01:00:00 | 0 |
| 2012-03-16 02:00:00 | 0 |
| 2012-03-16 03:00:00 | 0 |
| 2012-03-16 04:00:00 | 0 |
| 2012-03-16 05:00:00 | 0 |
| 2012-03-16 06:00:00 | 0 |
| 2012-03-16 07:00:00 | 0 |
| 2012-03-16 08:00:00 | 0 |
| 2012-03-16 09:00:00 | 0 |
| 2012-03-16 10:00:00 | 0 |
| 2012-03-16 11:00:00 | 0 |
| 2012-03-16 12:00:00 | 0 |
| 2012-03-16 13:00:00 | 0 |
| 2012-03-16 14:00:00 | 0 |
| 2012-03-16 15:00:00 | 0 |
| 2012-03-16 16:00:00 | 0.25 |
| 2012-03-16 17:00:00 | 0.25 |
| 2012-03-16 18:00:00 | 0 |
| 2012-03-16 19:00:00 | 0 |
| 2012-03-16 20:00:00 | 0.25 |
| 2012-03-16 21:00:00 | 0 |
| 2012-03-16 22:00:00 | 0 |
| 2012-03-16 23:00:00 | 0.25 |
| 2012-03-17 | 0 |
| 2012-03-17 01:00:00 | 0 |
| 2012-03-17 02:00:00 | 0.25 |
| 2012-03-17 03:00:00 | 0 |
| 2012-03-17 04:00:00 | 0 |
| 2012-03-17 05:00:00 | 0.25 |
| 2012-03-17 06:00:00 | 0 |
| 2012-03-17 07:00:00 | 0 |
| 2012-03-17 08:00:00 | 0 |
| 2012-03-17 09:00:00 | 0.25 |
| 2012-03-17 10:00:00 | 0 |
| 2012-03-17 11:00:00 | 0 |
| 2012-03-17 12:00:00 | 0.25 |
| 2012-03-17 13:00:00 | 0 |
| 2012-03-17 14:00:00 | 0 |
| 2012-03-17 15:00:00 | 0 |
| 2012-03-17 16:00:00 | 0.25 |
| 2012-03-17 17:00:00 | 0 |
| 2012-03-17 18:00:00 | 0 |
| 2012-03-17 19:00:00 | 0 |
| 2012-03-17 20:00:00 | 0.25 |
| 2012-03-17 21:00:00 | 0 |
| 2012-03-17 22:00:00 | 0 |
| 2012-03-17 23:00:00 | 0.25 |
| 2012-03-18 | 0 |
| 2012-03-18 01:00:00 | 0 |
| 2012-03-18 02:00:00 | 0.25 |
| 2012-03-18 03:00:00 | 0 |
| 2012-03-18 04:00:00 | 0 |
| 2012-03-18 05:00:00 | 0.25 |
| 2012-03-18 06:00:00 | 0 |
| 2012-03-18 07:00:00 | 0 |
| 2012-03-18 08:00:00 | 0 |
| 2012-03-18 09:00:00 | 0.25 |
| 2012-03-18 10:00:00 | 0 |
| 2012-03-18 11:00:00 | 0 |
| 2012-03-18 12:00:00 | 0 |
| 2012-03-18 13:00:00 | 0.25 |
| 2012-03-18 14:00:00 | 0 |
| 2012-03-18 15:00:00 | 0 |
| 2012-03-18 16:00:00 | 0 |
| 2012-03-18 17:00:00 | 0.25 |
| 2012-03-18 18:00:00 | 0 |
| 2012-03-18 19:00:00 | 0 |
| 2012-03-18 20:00:00 | 0.25 |
| 2012-03-18 21:00:00 | 0 |
| 2012-03-18 22:00:00 | 0 |
| 2012-03-18 23:00:00 | 0.25 |
| 2012-03-19 | 0 |
| 2012-03-19 01:00:00 | 0 |
| 2012-03-19 02:00:00 | 0 |
| 2012-03-19 03:00:00 | 0.25 |
| 2012-03-19 04:00:00 | 0 |
| 2012-03-19 05:00:00 | 0 |
| 2012-03-19 06:00:00 | 0.25 |
| 2012-03-19 07:00:00 | 0 |
| 2012-03-19 08:00:00 | 0 |
| 2012-03-19 09:00:00 | 0 |
| 2012-03-19 10:00:00 | 0.25 |
| 2012-03-19 11:00:00 | 0 |
| 2012-03-19 12:00:00 | 0 |
| 2012-03-19 13:00:00 | 0.25 |
| 2012-03-19 14:00:00 | 0 |
| 2012-03-19 15:00:00 | 0 |
| 2012-03-19 16:00:00 | 0.25 |
| 2012-03-19 17:00:00 | 0 |
| 2012-03-19 18:00:00 | 0 |
| 2012-03-19 19:00:00 | 0 |
| 2012-03-19 20:00:00 | 0.25 |
| 2012-03-19 21:00:00 | 0 |
| 2012-03-19 22:00:00 | 0 |
| 2012-03-19 23:00:00 | 0.25 |
| 2012-03-20 | 0 |
| 2012-03-20 01:00:00 | 0 |
| 2012-03-20 02:00:00 | 0 |
| 2012-03-20 03:00:00 | 0.25 |
| 2012-03-20 04:00:00 | 0 |
| 2012-03-20 05:00:00 | 0 |
| 2012-03-20 06:00:00 | 0.25 |
| 2012-03-20 07:00:00 | 0 |
| 2012-03-20 08:00:00 | 0 |
| 2012-03-20 09:00:00 | 0 |
| 2012-03-20 10:00:00 | 0.25 |
| 2012-03-20 11:00:00 | 0 |
| 2012-03-20 12:00:00 | 0 |
| 2012-03-20 13:00:00 | 0 |
| 2012-03-20 14:00:00 | 0.25 |
| 2012-03-20 15:00:00 | 0 |
| 2012-03-20 16:00:00 | 0 |
| 2012-03-20 17:00:00 | 0 |
| 2012-03-20 18:00:00 | 0.25 |
| 2012-03-20 19:00:00 | 0 |
| 2012-03-20 20:00:00 | 0 |
| 2012-03-20 21:00:00 | 0.25 |
| 2012-03-20 22:00:00 | 0 |
| 2012-03-20 23:00:00 | 0 |
| 2012-03-21 | 0 |
| 2012-03-21 01:00:00 | 0.25 |
| 2012-03-21 02:00:00 | 0 |
| 2012-03-21 03:00:00 | 0 |
| 2012-03-21 04:00:00 | 0.25 |
| 2012-03-21 05:00:00 | 0 |
| 2012-03-21 06:00:00 | 0 |
| 2012-03-21 07:00:00 | 0 |
| 2012-03-21 08:00:00 | 0.25 |
| 2012-03-21 09:00:00 | 0 |
| 2012-03-21 10:00:00 | 0 |
| 2012-03-21 11:00:00 | 0 |
| 2012-03-21 12:00:00 | 0.25 |
| 2012-03-21 13:00:00 | 0 |
| 2012-03-21 14:00:00 | 0 |
| 2012-03-21 15:00:00 | 0 |
| 2012-03-21 16:00:00 | 0.25 |
| 2012-03-21 17:00:00 | 0 |
| 2012-03-21 18:00:00 | 0 |
| 2012-03-21 19:00:00 | 0 |
| 2012-03-21 20:00:00 | 0.25 |
| 2012-03-21 21:00:00 | 0 |
| 2012-03-21 22:00:00 | 0 |
| 2012-03-21 23:00:00 | 0.25 |
| 2012-03-22 | 0 |
| 2012-03-22 01:00:00 | 0 |
| 2012-03-22 02:00:00 | 0 |
| 2012-03-22 03:00:00 | 0.25 |
| 2012-03-22 04:00:00 | 0 |
| 2012-03-22 05:00:00 | 0 |
| 2012-03-22 06:00:00 | 0.25 |
| 2012-03-22 07:00:00 | 0 |
| 2012-03-22 08:00:00 | 0 |
| 2012-03-22 09:00:00 | 0 |
| 2012-03-22 10:00:00 | 0.25 |
| 2012-03-22 11:00:00 | 0 |
| 2012-03-22 12:00:00 | 0 |
| 2012-03-22 13:00:00 | 0 |
| 2012-03-22 14:00:00 | 0.25 |
| 2012-03-22 15:00:00 | 0 |
| 2012-03-22 16:00:00 | 0 |
| 2012-03-22 17:00:00 | 0 |
| 2012-03-22 18:00:00 | 0.25 |
| 2012-03-22 19:00:00 | 0 |
| 2012-03-22 20:00:00 | 0 |
| 2012-03-22 21:00:00 | 0 |
| 2012-03-22 22:00:00 | 0.25 |
| 2012-03-22 23:00:00 | 0 |
| 2012-03-23 | 0 |
| 2012-03-23 01:00:00 | 0.25 |
| 2012-03-23 02:00:00 | 0 |
| 2012-03-23 03:00:00 | 0 |
| 2012-03-23 04:00:00 | 0 |
| 2012-03-23 05:00:00 | 0.25 |
| 2012-03-23 06:00:00 | 0 |
| 2012-03-23 07:00:00 | 0 |
| 2012-03-23 08:00:00 | 0 |
| 2012-03-23 09:00:00 | 0.25 |
| 2012-03-23 10:00:00 | 0 |
| 2012-03-23 11:00:00 | 0 |
| 2012-03-23 12:00:00 | 0 |
| 2012-03-23 13:00:00 | 0.25 |
| 2012-03-23 14:00:00 | 0 |
| 2012-03-23 15:00:00 | 0 |
| 2012-03-23 16:00:00 | 0 |
| 2012-03-23 17:00:00 | 0.25 |
| 2012-03-23 18:00:00 | 0 |
| 2012-03-23 19:00:00 | 0 |
| 2012-03-23 20:00:00 | 0 |
| 2012-03-23 21:00:00 | 0.25 |
| 2012-03-23 22:00:00 | 0 |
| 2012-03-23 23:00:00 | 0 |
| 2012-03-24 | 0.25 |
| 2012-03-24 01:00:00 | 0 |
| 2012-03-24 02:00:00 | 0 |
| 2012-03-24 03:00:00 | 0.25 |
| 2012-03-24 04:00:00 | 0 |
| 2012-03-24 05:00:00 | 0 |
| 2012-03-24 06:00:00 | 0 |
| 2012-03-24 07:00:00 | 0.25 |
| 2012-03-24 08:00:00 | 0 |
| 2012-03-24 09:00:00 | 0 |
| 2012-03-24 10:00:00 | 0 |
| 2012-03-24 11:00:00 | 0.25 |
| 2012-03-24 12:00:00 | 0 |
| 2012-03-24 13:00:00 | 0 |
| 2012-03-24 14:00:00 | 0 |
| 2012-03-24 15:00:00 | 0.25 |
| 2012-03-24 16:00:00 | 0 |
| 2012-03-24 17:00:00 | 0 |
| 2012-03-24 18:00:00 | 0 |
| 2012-03-24 19:00:00 | 0.25 |
| 2012-03-24 20:00:00 | 0 |
| 2012-03-24 21:00:00 | 0 |
| 2012-03-24 22:00:00 | 0 |
| 2012-03-24 23:00:00 | 0.25 |
| 2012-03-25 | 0 |
| 2012-03-25 01:00:00 | 0 |
| 2012-03-25 03:00:00 | 0.25 |
| 2012-03-25 04:00:00 | 0 |
| 2012-03-25 05:00:00 | 0 |
| 2012-03-25 06:00:00 | 0 |
| 2012-03-25 07:00:00 | 0.25 |
| 2012-03-25 08:00:00 | 0 |
| 2012-03-25 09:00:00 | 0 |
| 2012-03-25 10:00:00 | 0 |
| 2012-03-25 11:00:00 | 0.25 |
| 2012-03-25 12:00:00 | 0 |
| 2012-03-25 13:00:00 | 0 |
| 2012-03-25 14:00:00 | 0 |
| 2012-03-25 15:00:00 | 0.25 |
| 2012-03-25 16:00:00 | 0 |
| 2012-03-25 17:00:00 | 0 |
| 2012-03-25 18:00:00 | 0 |
| 2012-03-25 19:00:00 | 0.25 |
| 2012-03-25 20:00:00 | 0 |
| 2012-03-25 21:00:00 | 0 |
| 2012-03-25 22:00:00 | 0 |
| 2012-03-25 23:00:00 | 0.25 |
| 2012-03-26 | 0 |
| 2012-03-26 01:00:00 | 0 |
| 2012-03-26 02:00:00 | 0.25 |
| 2012-03-26 03:00:00 | 0 |
| 2012-03-26 04:00:00 | 0 |
| 2012-03-26 05:00:00 | 0.25 |
| 2012-03-26 06:00:00 | 0 |
| 2012-03-26 07:00:00 | 0 |
| 2012-03-26 08:00:00 | 0 |
| 2012-03-26 09:00:00 | 0.25 |
| 2012-03-26 10:00:00 | 0 |
| 2012-03-26 11:00:00 | 0 |
| 2012-03-26 12:00:00 | 0 |
| 2012-03-26 13:00:00 | 0.25 |
| 2012-03-26 14:00:00 | 0 |
| 2012-03-26 15:00:00 | 0 |
| 2012-03-26 16:00:00 | 0 |
| 2012-03-26 17:00:00 | 0.25 |
| 2012-03-26 18:00:00 | 0 |
| 2012-03-26 19:00:00 | 0 |
| 2012-03-26 20:00:00 | 0 |
| 2012-03-26 21:00:00 | 0.25 |
| 2012-03-26 22:00:00 | 0 |
| 2012-03-26 23:00:00 | 0 |
| 2012-03-27 | 0 |
| 2012-03-27 01:00:00 | 0.25 |
| 2012-03-27 02:00:00 | 0 |
| 2012-03-27 03:00:00 | 0 |
| 2012-03-27 04:00:00 | 0.25 |
| 2012-03-27 05:00:00 | 0 |
| 2012-03-27 06:00:00 | 0 |
| 2012-03-27 07:00:00 | 0 |
| 2012-03-27 08:00:00 | 0.25 |
| 2012-03-27 09:00:00 | 0 |
| 2012-03-27 10:00:00 | 0 |
| 2012-03-27 11:00:00 | 0 |
| 2012-03-27 12:00:00 | 0.25 |
| 2012-03-27 13:00:00 | 0 |
| 2012-03-27 14:00:00 | 0 |
| 2012-03-27 15:00:00 | 0 |
| 2012-03-27 16:00:00 | 0.25 |
| 2012-03-27 17:00:00 | 0 |
| 2012-03-27 18:00:00 | 0 |
| 2012-03-27 19:00:00 | 0 |
| 2012-03-27 20:00:00 | 0.25 |
| 2012-03-27 21:00:00 | 0 |
| 2012-03-27 22:00:00 | 0 |
| 2012-03-27 23:00:00 | 0.25 |
| 2012-03-28 | 0 |
| 2012-03-28 01:00:00 | 0 |
| 2012-03-28 02:00:00 | 0 |
| 2012-03-28 03:00:00 | 0.25 |
| 2012-03-28 04:00:00 | 0 |
| 2012-03-28 05:00:00 | 0 |
| 2012-03-28 06:00:00 | 0.25 |
| 2012-03-28 07:00:00 | 0 |
| 2012-03-28 08:00:00 | 0 |
| 2012-03-28 09:00:00 | 0 |
| 2012-03-28 10:00:00 | 0.25 |
| 2012-03-28 11:00:00 | 0 |
| 2012-03-28 12:00:00 | 0 |
| 2012-03-28 13:00:00 | 0 |
| 2012-03-28 14:00:00 | 0.25 |
| 2012-03-28 15:00:00 | 0 |
| 2012-03-28 16:00:00 | 0 |
| 2012-03-28 17:00:00 | 0 |
| 2012-03-28 18:00:00 | 0.25 |
| 2012-03-28 19:00:00 | 0 |
| 2012-03-28 20:00:00 | 0 |
| 2012-03-28 21:00:00 | 0 |
| 2012-03-28 22:00:00 | 0.25 |
| 2012-03-28 23:00:00 | 0 |
| 2012-03-29 | 0 |
| 2012-03-29 01:00:00 | 0 |
| 2012-03-29 02:00:00 | 0.25 |
| 2012-03-29 03:00:00 | 0 |
| 2012-03-29 04:00:00 | 0 |
| 2012-03-29 05:00:00 | 0.25 |
| 2012-03-29 06:00:00 | 0 |
| 2012-03-29 07:00:00 | 0 |
| 2012-03-29 08:00:00 | 0 |
| 2012-03-29 09:00:00 | 0.25 |
| 2012-03-29 10:00:00 | 0 |
| 2012-03-29 11:00:00 | 0 |
| 2012-03-29 12:00:00 | 0 |
| 2012-03-29 13:00:00 | 0.25 |
| 2012-03-29 14:00:00 | 0 |
| 2012-03-29 15:00:00 | 0 |
| 2012-03-29 16:00:00 | 0 |
| 2012-03-29 17:00:00 | 0.25 |
| 2012-03-29 18:00:00 | 0 |
| 2012-03-29 19:00:00 | 0 |
| 2012-03-29 20:00:00 | 0 |
| 2012-03-29 21:00:00 | 0.25 |
| 2012-03-29 22:00:00 | 0 |
| 2012-03-29 23:00:00 | 0 |
| 2012-03-30 | 0.25 |
| 2012-03-30 01:00:00 | 0 |
| 2012-03-30 02:00:00 | 0 |
| 2012-03-30 03:00:00 | 0 |
| 2012-03-30 04:00:00 | 0.25 |
| 2012-03-30 05:00:00 | 0 |
| 2012-03-30 06:00:00 | 0 |
| 2012-03-30 07:00:00 | 0.25 |
| 2012-03-30 08:00:00 | 0 |
| 2012-03-30 09:00:00 | 0 |
| 2012-03-30 10:00:00 | 0 |
| 2012-03-30 11:00:00 | 0.25 |
| 2012-03-30 12:00:00 | 0 |
| 2012-03-30 13:00:00 | 0 |
| 2012-03-30 14:00:00 | 0 |
| 2012-03-30 15:00:00 | 0 |
| 2012-03-30 16:00:00 | 0.25 |
| 2012-03-30 17:00:00 | 0 |
| 2012-03-30 18:00:00 | 0 |
| 2012-03-30 19:00:00 | 0 |
| 2012-03-30 20:00:00 | 0.25 |
| 2012-03-30 21:00:00 | 0 |
| 2012-03-30 22:00:00 | 0 |
| 2012-03-30 23:00:00 | 0.25 |
| 2012-03-31 | 0 |
| 2012-03-31 01:00:00 | 0 |
| 2012-03-31 02:00:00 | 0 |
| 2012-03-31 03:00:00 | 0.25 |
| 2012-03-31 04:00:00 | 0 |
| 2012-03-31 05:00:00 | 0 |
| 2012-03-31 06:00:00 | 0.25 |
| 2012-03-31 07:00:00 | 0 |
| 2012-03-31 08:00:00 | 0 |
| 2012-03-31 09:00:00 | 0 |
| 2012-03-31 10:00:00 | 0.25 |
| 2012-03-31 11:00:00 | 0 |
| 2012-03-31 12:00:00 | 0 |
| 2012-03-31 13:00:00 | 0 |
| 2012-03-31 14:00:00 | 0.25 |
| 2012-03-31 15:00:00 | 0 |
| 2012-03-31 16:00:00 | 0 |
| 2012-03-31 17:00:00 | 0 |
| 2012-03-31 18:00:00 | 0.25 |
| 2012-03-31 19:00:00 | 0 |
| 2012-03-31 20:00:00 | 0 |
| 2012-03-31 21:00:00 | 0 |
| 2012-03-31 22:00:00 | 0.25 |
| 2012-03-31 23:00:00 | 0 |
| 2012-04-01 | 0 |
| 2012-04-01 01:00:00 | 0.26 |
| 2012-04-01 02:00:00 | 0 |
| 2012-04-01 03:00:00 | 0 |
| 2012-04-01 04:00:00 | 0 |
| 2012-04-01 05:00:00 | 0.26 |
| 2012-04-01 06:00:00 | 0 |
| 2012-04-01 07:00:00 | 0 |
| 2012-04-01 08:00:00 | 0 |
| 2012-04-01 09:00:00 | 0.26 |
| 2012-04-01 10:00:00 | 0 |
| 2012-04-01 11:00:00 | 0 |
| 2012-04-01 12:00:00 | 0 |
| 2012-04-01 13:00:00 | 0 |
| 2012-04-01 14:00:00 | 0 |
| 2012-04-01 15:00:00 | 0 |
| 2012-04-01 16:00:00 | 0 |
| 2012-04-01 17:00:00 | 0.26 |
| 2012-04-01 18:00:00 | 0 |
| 2012-04-01 19:00:00 | 0 |
| 2012-04-01 20:00:00 | 0 |
| 2012-04-01 21:00:00 | 0.26 |
| 2012-04-01 22:00:00 | 0 |
| 2012-04-01 23:00:00 | 0 |
| 2012-04-02 | 0.26 |
| 2012-04-02 01:00:00 | 0 |
| 2012-04-02 02:00:00 | 0 |
| 2012-04-02 03:00:00 | 0 |
| 2012-04-02 04:00:00 | 0.26 |
| 2012-04-02 05:00:00 | 0 |
| 2012-04-02 06:00:00 | 0 |
| 2012-04-02 07:00:00 | 0.26 |
| 2012-04-02 08:00:00 | 0 |
| 2012-04-02 09:00:00 | 0 |
| 2012-04-02 10:00:00 | 0 |
| 2012-04-02 11:00:00 | 0 |
| 2012-04-02 12:00:00 | 0 |
| 2012-04-02 13:00:00 | 0 |
| 2012-04-02 14:00:00 | 0.26 |
| 2012-04-02 15:00:00 | 0 |
| 2012-04-02 16:00:00 | 0 |
| 2012-04-02 17:00:00 | 0 |
| 2012-04-02 18:00:00 | 0.26 |
| 2012-04-02 19:00:00 | 0 |
| 2012-04-02 20:00:00 | 0 |
| 2012-04-02 21:00:00 | 0.26 |
| 2012-04-02 22:00:00 | 0 |
| 2012-04-02 23:00:00 | 0 |
| 2012-04-03 | 0 |
| 2012-04-03 01:00:00 | 0.26 |
| 2012-04-03 02:00:00 | 0 |
| 2012-04-03 03:00:00 | 0 |
| 2012-04-03 04:00:00 | 0.26 |
| 2012-04-03 05:00:00 | 0 |
| 2012-04-03 06:00:00 | 0 |
| 2012-04-03 07:00:00 | 0 |
| 2012-04-03 08:00:00 | 1.04 |
| 2012-04-03 09:00:00 | 1.04 |
| 2012-04-03 10:00:00 | 1.3 |
| 2012-04-03 11:00:00 | 1.3 |
| 2012-04-03 12:00:00 | 1.3 |
| 2012-04-03 13:00:00 | 1.04 |
| 2012-04-03 14:00:00 | 1.3 |
| 2012-04-03 15:00:00 | 1.3 |
| 2012-04-03 16:00:00 | 1.04 |
| 2012-04-03 17:00:00 | 1.04 |
| 2012-04-03 18:00:00 | 1.3 |
| 2012-04-03 19:00:00 | 1.04 |
| 2012-04-03 20:00:00 | 1.3 |
| 2012-04-03 21:00:00 | 1.04 |
| 2012-04-03 22:00:00 | 1.3 |
| 2012-04-03 23:00:00 | 1.04 |
| 2012-04-04 | 1.3 |
| 2012-04-04 01:00:00 | 1.04 |
| 2012-04-04 02:00:00 | 1.3 |
| 2012-04-04 03:00:00 | 1.3 |
| 2012-04-04 04:00:00 | 1.04 |
| 2012-04-04 05:00:00 | 1.3 |
| 2012-04-04 06:00:00 | 1.04 |
| 2012-04-04 07:00:00 | 1.3 |
| 2012-04-04 08:00:00 | 1.56 |
| 2012-04-04 09:00:00 | 0.52 |
| 2012-04-04 10:00:00 | 0.26 |
| 2012-04-04 11:00:00 | 0 |
| 2012-04-04 12:00:00 | 0.26 |
| 2012-04-04 13:00:00 | 0.52 |
| 2012-04-04 14:00:00 | 0 |
| 2012-04-04 15:00:00 | 0.26 |
| 2012-04-04 16:00:00 | 0 |
| 2012-04-04 17:00:00 | 0.26 |
| 2012-04-04 18:00:00 | 0 |
| 2012-04-04 19:00:00 | 0 |
| 2012-04-04 20:00:00 | 0 |
| 2012-04-04 21:00:00 | 0.26 |
| 2012-04-04 22:00:00 | 0 |
| 2012-04-04 23:00:00 | 0 |
| 2012-04-05 | 0.26 |
| 2012-04-05 01:00:00 | 0 |
| 2012-04-05 02:00:00 | 0 |
| 2012-04-05 03:00:00 | 0.26 |
| 2012-04-05 04:00:00 | 0 |
| 2012-04-05 05:00:00 | 0 |
| 2012-04-05 06:00:00 | 0.26 |
| 2012-04-05 07:00:00 | 0 |
| 2012-04-05 08:00:00 | 0 |
| 2012-04-05 09:00:00 | 0.26 |
| 2012-04-05 10:00:00 | 0.52 |
| 2012-04-05 11:00:00 | 0.52 |
| 2012-04-05 12:00:00 | 0.52 |
| 2012-04-05 13:00:00 | 0.52 |
| 2012-04-05 14:00:00 | 0.26 |
| 2012-04-05 15:00:00 | 0.52 |
| 2012-04-05 16:00:00 | 0.52 |
| 2012-04-05 17:00:00 | 0.52 |
| 2012-04-05 18:00:00 | 0.26 |
| 2012-04-05 19:00:00 | 0.26 |
| 2012-04-05 20:00:00 | 0.26 |
| 2012-04-05 21:00:00 | 0 |
| 2012-04-05 22:00:00 | 0.26 |
| 2012-04-05 23:00:00 | 0 |
| 2012-04-06 | 0 |
| 2012-04-06 01:00:00 | 0.26 |
| 2012-04-06 02:00:00 | 0 |
| 2012-04-06 03:00:00 | 0 |
| 2012-04-06 04:00:00 | 0.26 |
| 2012-04-06 05:00:00 | 0 |
| 2012-04-06 06:00:00 | 0 |
| 2012-04-06 07:00:00 | 0.26 |
| 2012-04-06 08:00:00 | 0.26 |
| 2012-04-06 09:00:00 | 0.26 |
| 2012-04-06 10:00:00 | 0.26 |
| 2012-04-06 11:00:00 | 0.52 |
| 2012-04-06 12:00:00 | 0.26 |
| 2012-04-06 13:00:00 | 3.64 |
| 2012-04-06 14:00:00 | 1.04 |
| 2012-04-06 15:00:00 | 0.26 |
| 2012-04-06 16:00:00 | 0 |
| 2012-04-06 17:00:00 | 0.26 |
| 2012-04-06 18:00:00 | 0 |
| 2012-04-06 19:00:00 | 0 |
| 2012-04-06 20:00:00 | 0.26 |
| 2012-04-06 21:00:00 | 0 |
| 2012-04-06 22:00:00 | 0 |
| 2012-04-06 23:00:00 | 0.26 |
| 2012-04-07 | 0 |
| 2012-04-07 01:00:00 | 0.26 |
| 2012-04-07 02:00:00 | 0 |
| 2012-04-07 03:00:00 | 0 |
| 2012-04-07 04:00:00 | 0.26 |
| 2012-04-07 05:00:00 | 0 |
| 2012-04-07 06:00:00 | 0 |
| 2012-04-07 07:00:00 | 0.26 |
| 2012-04-07 08:00:00 | 0 |
| 2012-04-07 09:00:00 | 0 |
| 2012-04-07 10:00:00 | 0.26 |
| 2012-04-07 11:00:00 | 0 |
| 2012-04-07 12:00:00 | 0 |
| 2012-04-07 13:00:00 | 0.26 |
| 2012-04-07 14:00:00 | 0 |
| 2012-04-07 15:00:00 | 0 |
| 2012-04-07 16:00:00 | 0 |
| 2012-04-07 17:00:00 | 0.26 |
| 2012-04-07 18:00:00 | 0 |
| 2012-04-07 19:00:00 | 0 |
| 2012-04-07 20:00:00 | 0.26 |
| 2012-04-07 21:00:00 | 0 |
| 2012-04-07 22:00:00 | 0 |
| 2012-04-07 23:00:00 | 0.26 |
| 2012-04-08 | 0 |
| 2012-04-08 01:00:00 | 0.26 |
| 2012-04-08 02:00:00 | 0 |
| 2012-04-08 03:00:00 | 0 |
| 2012-04-08 04:00:00 | 0.26 |
| 2012-04-08 05:00:00 | 0 |
| 2012-04-08 06:00:00 | 0 |
| 2012-04-08 07:00:00 | 0.26 |
| 2012-04-08 08:00:00 | 0 |
| 2012-04-08 09:00:00 | 0 |
| 2012-04-08 10:00:00 | 0.26 |
| 2012-04-08 11:00:00 | 0 |
| 2012-04-08 12:00:00 | 0 |
| 2012-04-08 13:00:00 | 0.26 |
| 2012-04-08 14:00:00 | 0 |
| 2012-04-08 15:00:00 | 0 |
| 2012-04-08 16:00:00 | 0.26 |
| 2012-04-08 17:00:00 | 0 |
| 2012-04-08 18:00:00 | 0 |
| 2012-04-08 19:00:00 | 0 |
| 2012-04-08 20:00:00 | 0.26 |
| 2012-04-08 21:00:00 | 0 |
| 2012-04-08 22:00:00 | 0.26 |
| 2012-04-08 23:00:00 | 0 |
| 2012-04-09 | 0 |
| 2012-04-09 01:00:00 | 0.26 |
| 2012-04-09 02:00:00 | 0 |
| 2012-04-09 03:00:00 | 0 |
| 2012-04-09 04:00:00 | 0.26 |
| 2012-04-09 05:00:00 | 0 |
| 2012-04-09 06:00:00 | 0 |
| 2012-04-09 07:00:00 | 0.26 |
| 2012-04-09 08:00:00 | 0 |
| 2012-04-09 09:00:00 | 0 |
| 2012-04-09 10:00:00 | 0.26 |
| 2012-04-09 11:00:00 | 0 |
| 2012-04-09 12:00:00 | 0 |
| 2012-04-09 13:00:00 | 0.26 |
| 2012-04-09 14:00:00 | 0 |
| 2012-04-09 15:00:00 | 0 |
| 2012-04-09 16:00:00 | 0.26 |
| 2012-04-09 17:00:00 | 0 |
| 2012-04-09 18:00:00 | 0 |
| 2012-04-09 19:00:00 | 0 |
| 2012-04-09 20:00:00 | 0.26 |
| 2012-04-09 21:00:00 | 0 |
| 2012-04-09 22:00:00 | 0 |
| 2012-04-09 23:00:00 | 0.26 |
| 2012-04-10 | 0 |
| 2012-04-10 01:00:00 | 0.26 |
| 2012-04-10 02:00:00 | 0 |
| 2012-04-10 03:00:00 | 0 |
| 2012-04-10 04:00:00 | 0.26 |
| 2012-04-10 05:00:00 | 0 |
| 2012-04-10 06:00:00 | 0 |
| 2012-04-10 07:00:00 | 0.52 |
| 2012-04-10 08:00:00 | 1.3 |
| 2012-04-10 09:00:00 | 1.04 |
| 2012-04-10 10:00:00 | 1.04 |
| 2012-04-10 11:00:00 | 0.52 |
| 2012-04-10 12:00:00 | 0.52 |
| 2012-04-10 13:00:00 | 0.26 |
| 2012-04-10 14:00:00 | 1.04 |
| 2012-04-10 15:00:00 | 0 |
| 2012-04-10 16:00:00 | 0.26 |
| 2012-04-10 17:00:00 | 0 |
| 2012-04-10 18:00:00 | 0 |
| 2012-04-10 19:00:00 | 0.26 |
| 2012-04-10 20:00:00 | 0 |
| 2012-04-10 21:00:00 | 0 |
| 2012-04-10 22:00:00 | 0.26 |
| 2012-04-10 23:00:00 | 0 |
| 2012-04-11 | 0 |
| 2012-04-11 01:00:00 | 0.26 |
| 2012-04-11 02:00:00 | 0 |
| 2012-04-11 03:00:00 | 0 |
| 2012-04-11 04:00:00 | 0.26 |
| 2012-04-11 05:00:00 | 0 |
| 2012-04-11 06:00:00 | 0.26 |
| 2012-04-11 07:00:00 | 0 |
| 2012-04-11 08:00:00 | 0.52 |
| 2012-04-11 09:00:00 | 0.26 |
| 2012-04-11 10:00:00 | 0.26 |
| 2012-04-11 11:00:00 | 0.52 |
| 2012-04-11 12:00:00 | 0.26 |
| 2012-04-11 13:00:00 | 1.3 |
| 2012-04-11 14:00:00 | 0.52 |
| 2012-04-11 15:00:00 | 0 |
| 2012-04-11 16:00:00 | 0 |
| 2012-04-11 17:00:00 | 0.26 |
| 2012-04-11 18:00:00 | 0 |
| 2012-04-11 19:00:00 | 0 |
| 2012-04-11 20:00:00 | 0.26 |
| 2012-04-11 21:00:00 | 0 |
| 2012-04-11 22:00:00 | 0 |
| 2012-04-11 23:00:00 | 0.26 |
| 2012-04-12 | 0 |
| 2012-04-12 01:00:00 | 0 |
| 2012-04-12 02:00:00 | 0.26 |
| 2012-04-12 03:00:00 | 0 |
| 2012-04-12 04:00:00 | 0 |
| 2012-04-12 05:00:00 | 0.26 |
| 2012-04-12 06:00:00 | 0 |
| 2012-04-12 07:00:00 | 0.26 |
| 2012-04-12 08:00:00 | 0.52 |
| 2012-04-12 09:00:00 | 0.52 |
| 2012-04-12 10:00:00 | 1.04 |
| 2012-04-12 11:00:00 | 1.56 |
| 2012-04-12 12:00:00 | 1.56 |
| 2012-04-12 13:00:00 | 3.9 |
| 2012-04-12 14:00:00 | 0 |
| 2012-04-12 15:00:00 | 0.26 |
| 2012-04-12 16:00:00 | 0.26 |
| 2012-04-12 17:00:00 | 0 |
| 2012-04-12 18:00:00 | 0 |
| 2012-04-12 19:00:00 | 0.26 |
| 2012-04-12 20:00:00 | 0 |
| 2012-04-12 21:00:00 | 0 |
| 2012-04-12 22:00:00 | 0.26 |
| 2012-04-12 23:00:00 | 0 |
| 2012-04-13 | 0.26 |
| 2012-04-13 01:00:00 | 0 |
| 2012-04-13 02:00:00 | 0 |
| 2012-04-13 03:00:00 | 0.26 |
| 2012-04-13 04:00:00 | 0 |
| 2012-04-13 05:00:00 | 0 |
| 2012-04-13 06:00:00 | 0.26 |
| 2012-04-13 07:00:00 | 0.52 |
| 2012-04-13 08:00:00 | 1.04 |
| 2012-04-13 09:00:00 | 1.3 |
| 2012-04-13 10:00:00 | 1.56 |
| 2012-04-13 11:00:00 | 1.56 |
| 2012-04-13 12:00:00 | 0.52 |
| 2012-04-13 13:00:00 | 1.3 |
| 2012-04-13 14:00:00 | 0 |
| 2012-04-13 15:00:00 | 0 |
| 2012-04-13 16:00:00 | 0.26 |
| 2012-04-13 17:00:00 | 0 |
| 2012-04-13 18:00:00 | 0.26 |
| 2012-04-13 19:00:00 | 0 |
| 2012-04-13 20:00:00 | 0 |
| 2012-04-13 21:00:00 | 0.26 |
| 2012-04-13 22:00:00 | 0 |
| 2012-04-13 23:00:00 | 0.26 |
| 2012-04-14 | 0 |
| 2012-04-14 01:00:00 | 0 |
| 2012-04-14 02:00:00 | 0.26 |
| 2012-04-14 03:00:00 | 0 |
| 2012-04-14 04:00:00 | 0.26 |
| 2012-04-14 05:00:00 | 0 |
| 2012-04-14 06:00:00 | 0 |
| 2012-04-14 07:00:00 | 0.26 |
| 2012-04-14 08:00:00 | 0 |
| 2012-04-14 09:00:00 | 0.26 |
| 2012-04-14 10:00:00 | 0 |
| 2012-04-14 11:00:00 | 0 |
| 2012-04-14 12:00:00 | 0.26 |
| 2012-04-14 13:00:00 | 0 |
| 2012-04-14 14:00:00 | 0 |
| 2012-04-14 15:00:00 | 0.26 |
| 2012-04-14 16:00:00 | 0 |
| 2012-04-14 17:00:00 | 0 |
| 2012-04-14 18:00:00 | 0.26 |
| 2012-04-14 19:00:00 | 0 |
| 2012-04-14 20:00:00 | 0.26 |
| 2012-04-14 21:00:00 | 0 |
| 2012-04-14 22:00:00 | 0 |
| 2012-04-14 23:00:00 | 0.26 |
| 2012-04-15 | 0 |
| 2012-04-15 01:00:00 | 0.26 |
| 2012-04-15 02:00:00 | 0 |
| 2012-04-15 03:00:00 | 0.26 |
| 2012-04-15 04:00:00 | 0 |
| 2012-04-15 05:00:00 | 0 |
| 2012-04-15 06:00:00 | 0.26 |
| 2012-04-15 07:00:00 | 0 |
| 2012-04-15 08:00:00 | 0.26 |
| 2012-04-15 09:00:00 | 0 |
| 2012-04-15 10:00:00 | 0 |
| 2012-04-15 11:00:00 | 0.26 |
| 2012-04-15 12:00:00 | 0 |
| 2012-04-15 13:00:00 | 0 |
| 2012-04-15 14:00:00 | 0.26 |
| 2012-04-15 15:00:00 | 0 |
| 2012-04-15 16:00:00 | 0.26 |
| 2012-04-15 17:00:00 | 0 |
| 2012-04-15 18:00:00 | 0 |
| 2012-04-15 19:00:00 | 0.26 |
| 2012-04-15 20:00:00 | 0 |
| 2012-04-15 21:00:00 | 0 |
| 2012-04-15 22:00:00 | 0.26 |
| 2012-04-15 23:00:00 | 0 |
| 2012-04-16 | 0.26 |
| 2012-04-16 01:00:00 | 0 |
| 2012-04-16 02:00:00 | 0.26 |
| 2012-04-16 03:00:00 | 0 |
| 2012-04-16 04:00:00 | 0 |
| 2012-04-16 05:00:00 | 0.26 |
| 2012-04-16 06:00:00 | 0 |
| 2012-04-16 07:00:00 | 0.52 |
| 2012-04-16 08:00:00 | 1.56 |
| 2012-04-16 09:00:00 | 1.82 |
| 2012-04-16 10:00:00 | 2.86 |
| 2012-04-16 11:00:00 | 2.86 |
| 2012-04-16 12:00:00 | 2.86 |
| 2012-04-16 13:00:00 | 2.86 |
| 2012-04-16 14:00:00 | 2.6 |
| 2012-04-16 15:00:00 | 0.26 |
| 2012-04-16 16:00:00 | 0.26 |
| 2012-04-16 17:00:00 | 0 |
| 2012-04-16 18:00:00 | 0 |
| 2012-04-16 19:00:00 | 0.26 |
| 2012-04-16 20:00:00 | 0 |
| 2012-04-16 21:00:00 | 0.26 |
| 2012-04-16 22:00:00 | 0 |
| 2012-04-16 23:00:00 | 0 |
| 2012-04-17 | 0.26 |
| 2012-04-17 01:00:00 | 0 |
| 2012-04-17 02:00:00 | 0.26 |
| 2012-04-17 03:00:00 | 0 |
| 2012-04-17 04:00:00 | 0.26 |
| 2012-04-17 05:00:00 | 0 |
| 2012-04-17 06:00:00 | 0 |
| 2012-04-17 07:00:00 | 0.52 |
| 2012-04-17 08:00:00 | 2.6 |
| 2012-04-17 09:00:00 | 2.86 |
| 2012-04-17 10:00:00 | 2.6 |
| 2012-04-17 11:00:00 | 1.56 |
| 2012-04-17 12:00:00 | 1.3 |
| 2012-04-17 13:00:00 | 1.3 |
| 2012-04-17 14:00:00 | 1.3 |
| 2012-04-17 15:00:00 | 2.34 |
| 2012-04-17 16:00:00 | 1.3 |
| 2012-04-17 17:00:00 | 1.3 |
| 2012-04-17 18:00:00 | 1.56 |
| 2012-04-17 19:00:00 | 1.04 |
| 2012-04-17 20:00:00 | 1.3 |
| 2012-04-17 21:00:00 | 1.3 |
| 2012-04-17 22:00:00 | 1.3 |
| 2012-04-17 23:00:00 | 1.3 |
| 2012-04-18 | 1.04 |
| 2012-04-18 01:00:00 | 1.3 |
| 2012-04-18 02:00:00 | 1.3 |
| 2012-04-18 03:00:00 | 1.3 |
| 2012-04-18 04:00:00 | 1.3 |
| 2012-04-18 05:00:00 | 1.3 |
| 2012-04-18 06:00:00 | 1.04 |
| 2012-04-18 07:00:00 | 1.3 |
| 2012-04-18 08:00:00 | 1.3 |
| 2012-04-18 09:00:00 | 1.04 |
| 2012-04-18 10:00:00 | 1.3 |
| 2012-04-18 11:00:00 | 2.08 |
| 2012-04-18 12:00:00 | 6.24 |
| 2012-04-18 13:00:00 | 1.3 |
| 2012-04-18 14:00:00 | 1.3 |
| 2012-04-18 15:00:00 | 1.04 |
| 2012-04-18 16:00:00 | 1.3 |
| 2012-04-18 17:00:00 | 1.3 |
| 2012-04-18 18:00:00 | 1.3 |
| 2012-04-18 19:00:00 | 1.04 |
| 2012-04-18 20:00:00 | 1.3 |
| 2012-04-18 21:00:00 | 1.3 |
| 2012-04-18 22:00:00 | 1.3 |
| 2012-04-18 23:00:00 | 1.3 |
| 2012-04-19 | 1.3 |
| 2012-04-19 01:00:00 | 1.04 |
| 2012-04-19 02:00:00 | 1.3 |
| 2012-04-19 03:00:00 | 1.3 |
| 2012-04-19 04:00:00 | 1.3 |
| 2012-04-19 05:00:00 | 1.3 |
| 2012-04-19 06:00:00 | 1.3 |
| 2012-04-19 07:00:00 | 1.04 |
| 2012-04-19 08:00:00 | 1.3 |
| 2012-04-19 09:00:00 | 1.3 |
| 2012-04-19 10:00:00 | 1.3 |
| 2012-04-19 11:00:00 | 1.04 |
| 2012-04-19 12:00:00 | 1.3 |
| 2012-04-19 13:00:00 | 1.3 |
| 2012-04-19 14:00:00 | 1.3 |
| 2012-04-19 15:00:00 | 1.04 |
| 2012-04-19 16:00:00 | 1.3 |
| 2012-04-19 17:00:00 | 1.3 |
| 2012-04-19 18:00:00 | 1.04 |
| 2012-04-19 19:00:00 | 1.3 |
| 2012-04-19 20:00:00 | 1.3 |
| 2012-04-19 21:00:00 | 1.3 |
| 2012-04-19 22:00:00 | 1.3 |
| 2012-04-19 23:00:00 | 1.04 |
| 2012-04-20 | 1.3 |
| 2012-04-20 01:00:00 | 1.3 |
| 2012-04-20 02:00:00 | 1.3 |
| 2012-04-20 03:00:00 | 1.3 |
| 2012-04-20 04:00:00 | 1.3 |
| 2012-04-20 05:00:00 | 1.04 |
| 2012-04-20 06:00:00 | 1.3 |
| 2012-04-20 07:00:00 | 1.3 |
| 2012-04-20 08:00:00 | 1.3 |
| 2012-04-20 09:00:00 | 1.04 |
| 2012-04-20 10:00:00 | 1.3 |
| 2012-04-20 11:00:00 | 1.3 |
| 2012-04-20 12:00:00 | 1.3 |
| 2012-04-20 13:00:00 | 1.04 |
| 2012-04-20 14:00:00 | 1.3 |
| 2012-04-20 15:00:00 | 1.3 |
| 2012-04-20 16:00:00 | 1.3 |
| 2012-04-20 17:00:00 | 1.04 |
| 2012-04-20 18:00:00 | 1.3 |
| 2012-04-20 19:00:00 | 1.3 |
| 2012-04-20 20:00:00 | 1.3 |
| 2012-04-20 21:00:00 | 1.04 |
| 2012-04-20 22:00:00 | 1.3 |
| 2012-04-20 23:00:00 | 1.3 |
| 2012-04-21 | 1.3 |
| 2012-04-21 01:00:00 | 1.3 |
| 2012-04-21 02:00:00 | 1.3 |
| 2012-04-21 03:00:00 | 1.3 |
| 2012-04-21 04:00:00 | 1.04 |
| 2012-04-21 05:00:00 | 1.3 |
| 2012-04-21 06:00:00 | 1.3 |
| 2012-04-21 07:00:00 | 1.3 |
| 2012-04-21 08:00:00 | 1.3 |
| 2012-04-21 09:00:00 | 1.04 |
| 2012-04-21 10:00:00 | 1.3 |
| 2012-04-21 11:00:00 | 1.3 |
| 2012-04-21 12:00:00 | 1.3 |
| 2012-04-21 13:00:00 | 1.04 |
| 2012-04-21 14:00:00 | 1.3 |
| 2012-04-21 15:00:00 | 1.3 |
| 2012-04-21 16:00:00 | 1.3 |
| 2012-04-21 17:00:00 | 1.04 |
| 2012-04-21 18:00:00 | 1.3 |
| 2012-04-21 19:00:00 | 1.3 |
| 2012-04-21 20:00:00 | 1.3 |
| 2012-04-21 21:00:00 | 1.04 |
| 2012-04-21 22:00:00 | 1.3 |
| 2012-04-21 23:00:00 | 1.3 |
| 2012-04-22 | 1.3 |
| 2012-04-22 01:00:00 | 1.3 |
| 2012-04-22 02:00:00 | 1.3 |
| 2012-04-22 03:00:00 | 1.04 |
| 2012-04-22 04:00:00 | 1.3 |
| 2012-04-22 05:00:00 | 1.3 |
| 2012-04-22 06:00:00 | 1.3 |
| 2012-04-22 07:00:00 | 1.3 |
| 2012-04-22 08:00:00 | 1.04 |
| 2012-04-22 09:00:00 | 1.3 |
| 2012-04-22 10:00:00 | 1.3 |
| 2012-04-22 11:00:00 | 1.3 |
| 2012-04-22 12:00:00 | 1.04 |
| 2012-04-22 13:00:00 | 1.3 |
| 2012-04-22 14:00:00 | 1.3 |
| 2012-04-22 15:00:00 | 1.3 |
| 2012-04-22 16:00:00 | 1.04 |
| 2012-04-22 17:00:00 | 1.3 |
| 2012-04-22 18:00:00 | 1.3 |
| 2012-04-22 19:00:00 | 1.3 |
| 2012-04-22 20:00:00 | 1.04 |
| 2012-04-22 21:00:00 | 1.3 |
| 2012-04-22 22:00:00 | 1.3 |
| 2012-04-22 23:00:00 | 1.3 |
| 2012-04-23 | 1.3 |
| 2012-04-23 01:00:00 | 1.3 |
| 2012-04-23 02:00:00 | 1.04 |
| 2012-04-23 03:00:00 | 1.3 |
| 2012-04-23 04:00:00 | 1.3 |
| 2012-04-23 05:00:00 | 1.3 |
| 2012-04-23 06:00:00 | 1.3 |
| 2012-04-23 07:00:00 | 1.04 |
| 2012-04-23 08:00:00 | 1.3 |
| 2012-04-23 09:00:00 | 1.3 |
| 2012-04-23 10:00:00 | 1.04 |
| 2012-04-23 11:00:00 | 1.3 |
| 2012-04-23 12:00:00 | 1.3 |
| 2012-04-23 13:00:00 | 1.3 |
| 2012-04-23 14:00:00 | 1.04 |
| 2012-04-23 15:00:00 | 1.3 |
| 2012-04-23 16:00:00 | 1.3 |
| 2012-04-23 17:00:00 | 1.04 |
| 2012-04-23 18:00:00 | 1.3 |
| 2012-04-23 19:00:00 | 1.3 |
| 2012-04-23 20:00:00 | 1.3 |
| 2012-04-23 21:00:00 | 1.3 |
| 2012-04-23 22:00:00 | 1.04 |
| 2012-04-23 23:00:00 | 1.3 |
| 2012-04-24 | 1.3 |
| 2012-04-24 01:00:00 | 1.3 |
| 2012-04-24 02:00:00 | 1.3 |
| 2012-04-24 03:00:00 | 1.3 |
| 2012-04-24 04:00:00 | 1.04 |
| 2012-04-24 05:00:00 | 1.3 |
| 2012-04-24 06:00:00 | 1.3 |
| 2012-04-24 07:00:00 | 1.3 |
| 2012-04-24 08:00:00 | 1.3 |
| 2012-04-24 09:00:00 | 1.04 |
| 2012-04-24 10:00:00 | 1.3 |
| 2012-04-24 11:00:00 | 1.3 |
| 2012-04-24 12:00:00 | 1.04 |
| 2012-04-24 13:00:00 | 1.3 |
| 2012-04-24 14:00:00 | 1.3 |
| 2012-04-24 15:00:00 | 1.3 |
| 2012-04-24 16:00:00 | 1.04 |
| 2012-04-24 17:00:00 | 1.3 |
| 2012-04-24 18:00:00 | 1.3 |
| 2012-04-24 19:00:00 | 1.3 |
| 2012-04-24 20:00:00 | 1.04 |
| 2012-04-24 21:00:00 | 1.3 |
| 2012-04-24 22:00:00 | 1.3 |
| 2012-04-24 23:00:00 | 1.3 |
| 2012-04-25 | 1.3 |
| 2012-04-25 01:00:00 | 1.3 |
| 2012-04-25 02:00:00 | 1.04 |
| 2012-04-25 03:00:00 | 1.3 |
| 2012-04-25 04:00:00 | 1.3 |
| 2012-04-25 05:00:00 | 1.3 |
| 2012-04-25 06:00:00 | 1.3 |
| 2012-04-25 07:00:00 | 1.3 |
| 2012-04-25 08:00:00 | 1.04 |
| 2012-04-25 09:00:00 | 1.56 |
| 2012-04-25 10:00:00 | 1.82 |
| 2012-04-25 11:00:00 | 1.04 |
| 2012-04-25 12:00:00 | 1.3 |
| 2012-04-25 13:00:00 | 1.3 |
| 2012-04-25 14:00:00 | 1.3 |
| 2012-04-25 15:00:00 | 1.04 |
| 2012-04-25 16:00:00 | 1.3 |
| 2012-04-25 17:00:00 | 1.3 |
| 2012-04-25 18:00:00 | 1.3 |
| 2012-04-25 19:00:00 | 1.04 |
| 2012-04-25 20:00:00 | 1.3 |
| 2012-04-25 21:00:00 | 1.3 |
| 2012-04-25 22:00:00 | 1.3 |
| 2012-04-25 23:00:00 | 1.3 |
| 2012-04-26 | 1.3 |
| 2012-04-26 01:00:00 | 1.3 |
| 2012-04-26 02:00:00 | 1.04 |
| 2012-04-26 03:00:00 | 1.3 |
| 2012-04-26 04:00:00 | 1.3 |
| 2012-04-26 05:00:00 | 1.3 |
| 2012-04-26 06:00:00 | 1.3 |
| 2012-04-26 07:00:00 | 1.3 |
| 2012-04-26 08:00:00 | 1.04 |
| 2012-04-26 09:00:00 | 1.3 |
| 2012-04-26 10:00:00 | 1.3 |
| 2012-04-26 11:00:00 | 1.3 |
| 2012-04-26 12:00:00 | 1.04 |
| 2012-04-26 13:00:00 | 1.3 |
| 2012-04-26 14:00:00 | 1.3 |
| 2012-04-26 15:00:00 | 1.04 |
| 2012-04-26 16:00:00 | 1.3 |
| 2012-04-26 17:00:00 | 1.3 |
| 2012-04-26 18:00:00 | 1.04 |
| 2012-04-26 19:00:00 | 1.3 |
| 2012-04-26 20:00:00 | 1.3 |
| 2012-04-26 21:00:00 | 1.3 |
| 2012-04-26 22:00:00 | 1.3 |
| 2012-04-26 23:00:00 | 1.04 |
| 2012-04-27 | 1.3 |
| 2012-04-27 01:00:00 | 1.3 |
| 2012-04-27 02:00:00 | 1.3 |
| 2012-04-27 03:00:00 | 1.3 |
| 2012-04-27 04:00:00 | 1.3 |
| 2012-04-27 05:00:00 | 1.3 |
| 2012-04-27 06:00:00 | 1.04 |
| 2012-04-27 07:00:00 | 1.3 |
| 2012-04-27 08:00:00 | 1.56 |
| 2012-04-27 09:00:00 | 1.3 |
| 2012-04-27 10:00:00 | 0.78 |
| 2012-04-27 11:00:00 | 0.26 |
| 2012-04-27 12:00:00 | 1.56 |
| 2012-04-27 13:00:00 | 0.26 |
| 2012-04-27 14:00:00 | 0.26 |
| 2012-04-27 15:00:00 | 0 |
| 2012-04-27 16:00:00 | 0.26 |
| 2012-04-27 17:00:00 | 0 |
| 2012-04-27 18:00:00 | 0 |
| 2012-04-27 19:00:00 | 0.26 |
| 2012-04-27 20:00:00 | 0 |
| 2012-04-27 21:00:00 | 0.26 |
| 2012-04-27 22:00:00 | 0.26 |
| 2012-04-27 23:00:00 | 0.78 |
| 2012-04-28 | 1.04 |
| 2012-04-28 01:00:00 | 1.04 |
| 2012-04-28 02:00:00 | 1.3 |
| 2012-04-28 03:00:00 | 1.3 |
| 2012-04-28 04:00:00 | 1.3 |
| 2012-04-28 05:00:00 | 1.3 |
| 2012-04-28 06:00:00 | 1.04 |
| 2012-04-28 07:00:00 | 1.3 |
| 2012-04-28 08:00:00 | 1.04 |
| 2012-04-28 09:00:00 | 0.78 |
| 2012-04-28 10:00:00 | 0 |
| 2012-04-28 11:00:00 | 0.26 |
| 2012-04-28 12:00:00 | 0.26 |
| 2012-04-28 13:00:00 | 0 |
| 2012-04-28 14:00:00 | 0.26 |
| 2012-04-28 15:00:00 | 0 |
| 2012-04-28 16:00:00 | 0 |
| 2012-04-28 17:00:00 | 0.26 |
| 2012-04-28 18:00:00 | 0 |
| 2012-04-28 19:00:00 | 0.26 |
| 2012-04-28 20:00:00 | 0 |
| 2012-04-28 21:00:00 | 0.26 |
| 2012-04-28 22:00:00 | 0 |
| 2012-04-28 23:00:00 | 0.26 |
| 2012-04-29 | 0.26 |
| 2012-04-29 01:00:00 | 0.52 |
| 2012-04-29 02:00:00 | 0.78 |
| 2012-04-29 03:00:00 | 0.52 |
| 2012-04-29 04:00:00 | 0.52 |
| 2012-04-29 05:00:00 | 1.04 |
| 2012-04-29 06:00:00 | 0.52 |
| 2012-04-29 07:00:00 | 0.78 |
| 2012-04-29 08:00:00 | 0.78 |
| 2012-04-29 09:00:00 | 0.78 |
| 2012-04-29 10:00:00 | 0.26 |
| 2012-04-29 11:00:00 | 0.52 |
| 2012-04-29 12:00:00 | 0 |
| 2012-04-29 13:00:00 | 0 |
| 2012-04-29 14:00:00 | 0.26 |
| 2012-04-29 15:00:00 | 0 |
| 2012-04-29 16:00:00 | 0.26 |
| 2012-04-29 17:00:00 | 0 |
| 2012-04-29 18:00:00 | 0.26 |
| 2012-04-29 19:00:00 | 0 |
| 2012-04-29 20:00:00 | 0.26 |
| 2012-04-29 21:00:00 | 0 |
| 2012-04-29 22:00:00 | 0.26 |
| 2012-04-29 23:00:00 | 0 |
| 2012-04-30 | 0.26 |
| 2012-04-30 01:00:00 | 0 |
| 2012-04-30 02:00:00 | 0.26 |
| 2012-04-30 03:00:00 | 0.52 |
| 2012-04-30 04:00:00 | 0.78 |
| 2012-04-30 05:00:00 | 0.78 |
| 2012-04-30 06:00:00 | 1.04 |
| 2012-04-30 07:00:00 | 0.52 |
| 2012-04-30 08:00:00 | 0.26 |
| 2012-04-30 09:00:00 | 0 |
| 2012-04-30 10:00:00 | 0 |
| 2012-04-30 11:00:00 | 0.26 |
| 2012-04-30 12:00:00 | 0 |
| 2012-04-30 13:00:00 | 0.26 |
| 2012-04-30 14:00:00 | 0 |
| 2012-04-30 15:00:00 | 0.26 |
| 2012-04-30 16:00:00 | 0 |
| 2012-04-30 17:00:00 | 0.26 |
| 2012-04-30 18:00:00 | 0 |
| 2012-04-30 19:00:00 | 0.26 |
| 2012-04-30 20:00:00 | 0 |
| 2012-04-30 21:00:00 | 0 |
| 2012-04-30 22:00:00 | 0.26 |
| 2012-04-30 23:00:00 | 0.26 |
| 2012-05-01 | 0 |
| 2012-05-01 01:00:00 | 0.26 |
| 2012-05-01 02:00:00 | 0 |
| 2012-05-01 03:00:00 | 0.26 |
| 2012-05-01 04:00:00 | 0.26 |
| 2012-05-01 05:00:00 | 0.52 |
| 2012-05-01 06:00:00 | 0.52 |
| 2012-05-01 07:00:00 | 0.52 |
| 2012-05-01 08:00:00 | 0 |
| 2012-05-01 09:00:00 | 0.26 |
| 2012-05-01 10:00:00 | 0 |
| 2012-05-01 11:00:00 | 0.26 |
| 2012-05-01 12:00:00 | 0 |
| 2012-05-01 13:00:00 | 0 |
| 2012-05-01 14:00:00 | 0.26 |
| 2012-05-01 15:00:00 | 0 |
| 2012-05-01 16:00:00 | 0.26 |
| 2012-05-01 17:00:00 | 0 |
| 2012-05-01 18:00:00 | 0.26 |
| 2012-05-01 19:00:00 | 0 |
| 2012-05-01 20:00:00 | 0.26 |
| 2012-05-01 21:00:00 | 0 |
| 2012-05-01 22:00:00 | 0.26 |
| 2012-05-01 23:00:00 | 0 |
| 2012-05-02 | 0.26 |
| 2012-05-02 01:00:00 | 0 |
| 2012-05-02 02:00:00 | 0.26 |
| 2012-05-02 03:00:00 | 0 |
| 2012-05-02 04:00:00 | 0.26 |
| 2012-05-02 05:00:00 | 0.52 |
| 2012-05-02 06:00:00 | 0.52 |
| 2012-05-02 07:00:00 | 0.52 |
| 2012-05-02 08:00:00 | 0 |
| 2012-05-02 09:00:00 | 0.26 |
| 2012-05-02 10:00:00 | 0 |
| 2012-05-02 11:00:00 | 0.26 |
| 2012-05-02 12:00:00 | 0 |
| 2012-05-02 13:00:00 | 0 |
| 2012-05-02 14:00:00 | 0.26 |
| 2012-05-02 15:00:00 | 0 |
| 2012-05-02 16:00:00 | 0.26 |
| 2012-05-02 17:00:00 | 0 |
| 2012-05-02 18:00:00 | 0.26 |
| 2012-05-02 19:00:00 | 0 |
| 2012-05-02 20:00:00 | 0.26 |
| 2012-05-02 21:00:00 | 0 |
| 2012-05-02 22:00:00 | 0.26 |
| 2012-05-02 23:00:00 | 0 |
| 2012-05-03 | 0.26 |
| 2012-05-03 01:00:00 | 0 |
| 2012-05-03 02:00:00 | 0.26 |
| 2012-05-03 03:00:00 | 0.26 |
| 2012-05-03 04:00:00 | 0.52 |
| 2012-05-03 05:00:00 | 0.26 |
| 2012-05-03 06:00:00 | 0.52 |
| 2012-05-03 07:00:00 | 0.26 |
| 2012-05-03 08:00:00 | 0.26 |
| 2012-05-03 09:00:00 | 0 |
| 2012-05-03 10:00:00 | 0.26 |
| 2012-05-03 11:00:00 | 0 |
| 2012-05-03 12:00:00 | 0.26 |
| 2012-05-03 13:00:00 | 0 |
| 2012-05-03 14:00:00 | 0 |
| 2012-05-03 15:00:00 | 0.26 |
| 2012-05-03 16:00:00 | 0 |
| 2012-05-03 17:00:00 | 0.26 |
| 2012-05-03 18:00:00 | 0 |
| 2012-05-03 19:00:00 | 0.26 |
| 2012-05-03 20:00:00 | 0 |
| 2012-05-03 21:00:00 | 0.26 |
| 2012-05-03 22:00:00 | 0 |
| 2012-05-03 23:00:00 | 0.26 |
| 2012-05-04 | 0 |
| 2012-05-04 01:00:00 | 0.26 |
| 2012-05-04 02:00:00 | 0 |
| 2012-05-04 03:00:00 | 0.26 |
| 2012-05-04 04:00:00 | 0 |
| 2012-05-04 05:00:00 | 0.26 |
| 2012-05-04 06:00:00 | 0.52 |
| 2012-05-04 07:00:00 | 0.52 |
| 2012-05-04 08:00:00 | 0.26 |
| 2012-05-04 09:00:00 | 0.26 |
| 2012-05-04 10:00:00 | 0.26 |
| 2012-05-04 11:00:00 | 0.52 |
| 2012-05-04 12:00:00 | 0.26 |
| 2012-05-04 13:00:00 | 0.26 |
| 2012-05-04 14:00:00 | 0.52 |
| 2012-05-04 15:00:00 | 0.26 |
| 2012-05-04 16:00:00 | 0.52 |
| 2012-05-04 17:00:00 | 0.26 |
| 2012-05-04 18:00:00 | 0.52 |
| 2012-05-04 19:00:00 | 0.52 |
| 2012-05-04 20:00:00 | 0.52 |
| 2012-05-04 21:00:00 | 0.78 |
| 2012-05-04 22:00:00 | 0.78 |
| 2012-05-04 23:00:00 | 0.78 |
| 2012-05-05 | 0.78 |
| 2012-05-05 01:00:00 | 1.04 |
| 2012-05-05 02:00:00 | 0.78 |
| 2012-05-05 03:00:00 | 1.3 |
| 2012-05-05 04:00:00 | 1.3 |
| 2012-05-05 05:00:00 | 1.3 |
| 2012-05-05 06:00:00 | 1.3 |
| 2012-05-05 07:00:00 | 1.3 |
| 2012-05-05 08:00:00 | 1.3 |
| 2012-05-05 09:00:00 | 1.04 |
| 2012-05-05 10:00:00 | 1.04 |
| 2012-05-05 11:00:00 | 0.78 |
| 2012-05-05 12:00:00 | 0.78 |
| 2012-05-05 13:00:00 | 0.52 |
| 2012-05-05 14:00:00 | 0.52 |
| 2012-05-05 15:00:00 | 0.26 |
| 2012-05-05 16:00:00 | 0.26 |
| 2012-05-05 17:00:00 | 0.26 |
| 2012-05-05 18:00:00 | 0 |
| 2012-05-05 19:00:00 | 0.26 |
| 2012-05-05 20:00:00 | 0 |
| 2012-05-05 21:00:00 | 0.52 |
| 2012-05-05 22:00:00 | 0.78 |
| 2012-05-05 23:00:00 | 0.78 |
| 2012-05-06 | 0.78 |
| 2012-05-06 01:00:00 | 0.78 |
| 2012-05-06 02:00:00 | 1.04 |
| 2012-05-06 03:00:00 | 0.78 |
| 2012-05-06 04:00:00 | 1.04 |
| 2012-05-06 05:00:00 | 1.3 |
| 2012-05-06 06:00:00 | 1.3 |
| 2012-05-06 07:00:00 | 1.04 |
| 2012-05-06 08:00:00 | 1.3 |
| 2012-05-06 09:00:00 | 1.04 |
| 2012-05-06 10:00:00 | 0.78 |
| 2012-05-06 11:00:00 | 0.78 |
| 2012-05-06 12:00:00 | 0.78 |
| 2012-05-06 13:00:00 | 0.78 |
| 2012-05-06 14:00:00 | 0.26 |
| 2012-05-06 15:00:00 | 0.26 |
| 2012-05-06 16:00:00 | 0 |
| 2012-05-06 17:00:00 | 0.52 |
| 2012-05-06 18:00:00 | 0.52 |
| 2012-05-06 19:00:00 | 0.78 |
| 2012-05-06 20:00:00 | 1.04 |
| 2012-05-06 21:00:00 | 1.04 |
| 2012-05-06 22:00:00 | 1.3 |
| 2012-05-06 23:00:00 | 1.3 |
| 2012-05-07 | 1.3 |
| 2012-05-07 01:00:00 | 1.3 |
| 2012-05-07 02:00:00 | 1.04 |
| 2012-05-07 03:00:00 | 1.3 |
| 2012-05-07 04:00:00 | 1.3 |
| 2012-05-07 05:00:00 | 1.3 |
| 2012-05-07 06:00:00 | 1.3 |
| 2012-05-07 07:00:00 | 1.3 |
| 2012-05-07 08:00:00 | 1.3 |
| 2012-05-07 09:00:00 | 1.04 |
| 2012-05-07 10:00:00 | 1.3 |
| 2012-05-07 11:00:00 | 1.3 |
| 2012-05-07 12:00:00 | 1.3 |
| 2012-05-07 13:00:00 | 1.04 |
| 2012-05-07 14:00:00 | 1.3 |
| 2012-05-07 15:00:00 | 1.3 |
| 2012-05-07 16:00:00 | 1.3 |
| 2012-05-07 17:00:00 | 1.04 |
| 2012-05-07 18:00:00 | 1.3 |
| 2012-05-07 19:00:00 | 1.3 |
| 2012-05-07 20:00:00 | 1.3 |
| 2012-05-07 21:00:00 | 1.3 |
| 2012-05-07 22:00:00 | 1.3 |
| 2012-05-07 23:00:00 | 1.04 |
| 2012-05-08 | 1.3 |
| 2012-05-08 01:00:00 | 1.3 |
| 2012-05-08 02:00:00 | 1.3 |
| 2012-05-08 03:00:00 | 1.3 |
| 2012-05-08 04:00:00 | 1.3 |
| 2012-05-08 05:00:00 | 1.3 |
| 2012-05-08 06:00:00 | 1.3 |
| 2012-05-08 07:00:00 | 1.3 |
| 2012-05-08 08:00:00 | 1.04 |
| 2012-05-08 09:00:00 | 1.3 |
| 2012-05-08 10:00:00 | 1.3 |
| 2012-05-08 11:00:00 | 1.04 |
| 2012-05-08 12:00:00 | 1.3 |
| 2012-05-08 13:00:00 | 1.3 |
| 2012-05-08 14:00:00 | 1.3 |
| 2012-05-08 15:00:00 | 1.04 |
| 2012-05-08 16:00:00 | 1.3 |
| 2012-05-08 17:00:00 | 1.3 |
| 2012-05-08 18:00:00 | 1.3 |
| 2012-05-08 19:00:00 | 1.3 |
| 2012-05-08 20:00:00 | 1.3 |
| 2012-05-08 21:00:00 | 1.04 |
| 2012-05-08 22:00:00 | 1.3 |
| 2012-05-08 23:00:00 | 1.3 |
| 2012-05-09 | 1.3 |
| 2012-05-09 01:00:00 | 1.3 |
| 2012-05-09 02:00:00 | 1.3 |
| 2012-05-09 03:00:00 | 1.3 |
| 2012-05-09 04:00:00 | 1.3 |
| 2012-05-09 05:00:00 | 1.3 |
| 2012-05-09 06:00:00 | 1.04 |
| 2012-05-09 07:00:00 | 1.3 |
| 2012-05-09 08:00:00 | 1.3 |
| 2012-05-09 09:00:00 | 1.3 |
| 2012-05-09 10:00:00 | 1.04 |
| 2012-05-09 11:00:00 | 1.3 |
| 2012-05-09 12:00:00 | 1.3 |
| 2012-05-09 13:00:00 | 1.3 |
| 2012-05-09 14:00:00 | 1.04 |
| 2012-05-09 15:00:00 | 0.78 |
| 2012-05-09 16:00:00 | 0.26 |
| 2012-05-09 17:00:00 | 0.26 |
| 2012-05-09 18:00:00 | 0 |
| 2012-05-09 19:00:00 | 0.26 |
| 2012-05-09 20:00:00 | 0.26 |
| 2012-05-09 21:00:00 | 1.04 |
| 2012-05-09 22:00:00 | 1.3 |
| 2012-05-09 23:00:00 | 1.3 |
| 2012-05-10 | 1.3 |
| 2012-05-10 01:00:00 | 1.3 |
| 2012-05-10 02:00:00 | 1.3 |
| 2012-05-10 03:00:00 | 1.3 |
| 2012-05-10 04:00:00 | 1.04 |
| 2012-05-10 05:00:00 | 1.3 |
| 2012-05-10 06:00:00 | 1.3 |
| 2012-05-10 07:00:00 | 1.3 |
| 2012-05-10 08:00:00 | 1.3 |
| 2012-05-10 09:00:00 | 0.78 |
| 2012-05-10 10:00:00 | 0.52 |
| 2012-05-10 11:00:00 | 0.52 |
| 2012-05-10 12:00:00 | 0 |
| 2012-05-10 13:00:00 | 0.26 |
| 2012-05-10 14:00:00 | 0 |
| 2012-05-10 15:00:00 | 0.26 |
| 2012-05-10 16:00:00 | 0 |
| 2012-05-10 17:00:00 | 0 |
| 2012-05-10 18:00:00 | 0.26 |
| 2012-05-10 19:00:00 | 0 |
| 2012-05-10 20:00:00 | 0.26 |
| 2012-05-10 21:00:00 | 0 |
| 2012-05-10 22:00:00 | 0.26 |
| 2012-05-10 23:00:00 | 0.52 |
| 2012-05-11 | 0.52 |
| 2012-05-11 01:00:00 | 0.52 |
| 2012-05-11 02:00:00 | 0.52 |
| 2012-05-11 03:00:00 | 0.52 |
| 2012-05-11 04:00:00 | 0.78 |
| 2012-05-11 05:00:00 | 1.3 |
| 2012-05-11 06:00:00 | 1.04 |
| 2012-05-11 07:00:00 | 0.78 |
| 2012-05-11 08:00:00 | 0.26 |
| 2012-05-11 09:00:00 | 0 |
| 2012-05-11 10:00:00 | 0.26 |
| 2012-05-11 11:00:00 | 0 |
| 2012-05-11 12:00:00 | 0 |
| 2012-05-11 13:00:00 | 0.26 |
| 2012-05-11 14:00:00 | 0 |
| 2012-05-11 15:00:00 | 0.26 |
| 2012-05-11 16:00:00 | 0 |
| 2012-05-11 17:00:00 | 0.26 |
| 2012-05-11 18:00:00 | 0 |
| 2012-05-11 19:00:00 | 0.26 |
| 2012-05-11 20:00:00 | 0 |
| 2012-05-11 21:00:00 | 0.26 |
| 2012-05-11 22:00:00 | 0 |
| 2012-05-11 23:00:00 | 0.26 |
| 2012-05-12 | 0 |
| 2012-05-12 01:00:00 | 0.26 |
| 2012-05-12 02:00:00 | 0 |
| 2012-05-12 03:00:00 | 0.26 |
| 2012-05-12 04:00:00 | 0 |
| 2012-05-12 05:00:00 | 0.26 |
| 2012-05-12 06:00:00 | 0 |
| 2012-05-12 07:00:00 | 0.26 |
| 2012-05-12 08:00:00 | 0 |
| 2012-05-12 09:00:00 | 0 |
| 2012-05-12 10:00:00 | 0.52 |
| 2012-05-12 11:00:00 | 1.04 |
| 2012-05-12 12:00:00 | 1.3 |
| 2012-05-12 13:00:00 | 1.04 |
| 2012-05-12 14:00:00 | 1.04 |
| 2012-05-12 15:00:00 | 1.3 |
| 2012-05-12 16:00:00 | 1.3 |
| 2012-05-12 17:00:00 | 1.3 |
| 2012-05-12 18:00:00 | 1.3 |
| 2012-05-12 19:00:00 | 1.04 |
| 2012-05-12 20:00:00 | 1.3 |
| 2012-05-12 21:00:00 | 1.3 |
| 2012-05-12 22:00:00 | 1.3 |
| 2012-05-12 23:00:00 | 1.3 |
| 2012-05-13 | 1.3 |
| 2012-05-13 01:00:00 | 1.3 |
| 2012-05-13 02:00:00 | 1.3 |
| 2012-05-13 03:00:00 | 1.3 |
| 2012-05-13 04:00:00 | 1.3 |
| 2012-05-13 05:00:00 | 1.04 |
| 2012-05-13 06:00:00 | 1.3 |
| 2012-05-13 07:00:00 | 1.3 |
| 2012-05-13 08:00:00 | 1.3 |
| 2012-05-13 09:00:00 | 1.3 |
| 2012-05-13 10:00:00 | 1.3 |
| 2012-05-13 11:00:00 | 1.3 |
| 2012-05-13 12:00:00 | 1.04 |
| 2012-05-13 13:00:00 | 1.3 |
| 2012-05-13 14:00:00 | 1.3 |
| 2012-05-13 15:00:00 | 1.3 |
| 2012-05-13 16:00:00 | 1.3 |
| 2012-05-13 17:00:00 | 1.04 |
| 2012-05-13 18:00:00 | 1.3 |
| 2012-05-13 19:00:00 | 1.3 |
| 2012-05-13 20:00:00 | 1.3 |
| 2012-05-13 21:00:00 | 1.3 |
| 2012-05-13 22:00:00 | 1.3 |
| 2012-05-13 23:00:00 | 1.3 |
| 2012-05-14 | 1.3 |
| 2012-05-14 01:00:00 | 1.04 |
| 2012-05-14 02:00:00 | 1.3 |
| 2012-05-14 03:00:00 | 1.3 |
| 2012-05-14 04:00:00 | 1.3 |
| 2012-05-14 05:00:00 | 1.3 |
| 2012-05-14 06:00:00 | 1.3 |
| 2012-05-14 07:00:00 | 1.3 |
| 2012-05-14 08:00:00 | 1.3 |
| 2012-05-14 09:00:00 | 1.04 |
| 2012-05-14 10:00:00 | 1.3 |
| 2012-05-14 11:00:00 | 1.3 |
| 2012-05-14 12:00:00 | 1.3 |
| 2012-05-14 13:00:00 | 1.04 |
| 2012-05-14 14:00:00 | 1.3 |
| 2012-05-14 15:00:00 | 1.3 |
| 2012-05-14 16:00:00 | 1.3 |
| 2012-05-14 17:00:00 | 1.04 |
| 2012-05-14 18:00:00 | 1.3 |
| 2012-05-14 19:00:00 | 1.3 |
| 2012-05-14 20:00:00 | 1.3 |
| 2012-05-14 21:00:00 | 1.3 |
| 2012-05-14 22:00:00 | 1.3 |
| 2012-05-14 23:00:00 | 1.04 |
| 2012-05-15 | 1.3 |
| 2012-05-15 01:00:00 | 1.3 |
| 2012-05-15 02:00:00 | 1.3 |
| 2012-05-15 03:00:00 | 1.3 |
| 2012-05-15 04:00:00 | 1.3 |
| 2012-05-15 05:00:00 | 1.3 |
| 2012-05-15 06:00:00 | 1.3 |
| 2012-05-15 07:00:00 | 1.04 |
| 2012-05-15 08:00:00 | 1.3 |
| 2012-05-15 09:00:00 | 1.3 |
| 2012-05-15 10:00:00 | 1.3 |
| 2012-05-15 11:00:00 | 1.3 |
| 2012-05-15 12:00:00 | 1.3 |
| 2012-05-15 13:00:00 | 1.04 |
| 2012-05-15 14:00:00 | 1.3 |
| 2012-05-15 15:00:00 | 1.3 |
| 2012-05-15 16:00:00 | 1.3 |
| 2012-05-15 17:00:00 | 1.3 |
| 2012-05-15 18:00:00 | 1.3 |
| 2012-05-15 19:00:00 | 1.3 |
| 2012-05-15 20:00:00 | 1.04 |
| 2012-05-15 21:00:00 | 1.3 |
| 2012-05-15 22:00:00 | 1.3 |
| 2012-05-15 23:00:00 | 1.3 |
| 2012-05-16 | 1.3 |
| 2012-05-16 01:00:00 | 1.3 |
| 2012-05-16 02:00:00 | 1.3 |
| 2012-05-16 03:00:00 | 1.04 |
| 2012-05-16 04:00:00 | 1.3 |
| 2012-05-16 05:00:00 | 1.3 |
| 2012-05-16 06:00:00 | 1.3 |
| 2012-05-16 07:00:00 | 1.3 |
| 2012-05-16 08:00:00 | 1.04 |
| 2012-05-16 09:00:00 | 1.3 |
| 2012-05-16 10:00:00 | 1.3 |
| 2012-05-16 11:00:00 | 1.3 |
| 2012-05-16 12:00:00 | 1.3 |
| 2012-05-16 13:00:00 | 1.3 |
| 2012-05-16 14:00:00 | 1.04 |
| 2012-05-16 15:00:00 | 1.3 |
| 2012-05-16 16:00:00 | 1.3 |
| 2012-05-16 17:00:00 | 1.3 |
| 2012-05-16 18:00:00 | 1.3 |
| 2012-05-16 19:00:00 | 1.3 |
| 2012-05-16 20:00:00 | 1.3 |
| 2012-05-16 21:00:00 | 1.04 |
| 2012-05-16 22:00:00 | 1.3 |
| 2012-05-16 23:00:00 | 1.3 |
| 2012-05-17 | 1.3 |
| 2012-05-17 01:00:00 | 1.3 |
| 2012-05-17 02:00:00 | 1.3 |
| 2012-05-17 03:00:00 | 1.3 |
| 2012-05-17 04:00:00 | 1.04 |
| 2012-05-17 05:00:00 | 1.3 |
| 2012-05-17 06:00:00 | 1.3 |
| 2012-05-17 07:00:00 | 1.3 |
| 2012-05-17 08:00:00 | 1.3 |
| 2012-05-17 09:00:00 | 1.04 |
| 2012-05-17 10:00:00 | 1.3 |
| 2012-05-17 11:00:00 | 1.3 |
| 2012-05-17 12:00:00 | 1.3 |
| 2012-05-17 13:00:00 | 1.04 |
| 2012-05-17 14:00:00 | 1.3 |
| 2012-05-17 15:00:00 | 1.3 |
| 2012-05-17 16:00:00 | 1.3 |
| 2012-05-17 17:00:00 | 1.04 |
| 2012-05-17 18:00:00 | 1.3 |
| 2012-05-17 19:00:00 | 1.3 |
| 2012-05-17 20:00:00 | 1.3 |
| 2012-05-17 21:00:00 | 1.3 |
| 2012-05-17 22:00:00 | 1.3 |
| 2012-05-17 23:00:00 | 1.04 |
| 2012-05-18 | 1.3 |
| 2012-05-18 01:00:00 | 1.3 |
| 2012-05-18 02:00:00 | 1.3 |
| 2012-05-18 03:00:00 | 1.3 |
| 2012-05-18 04:00:00 | 1.3 |
| 2012-05-18 05:00:00 | 1.3 |
| 2012-05-18 06:00:00 | 1.3 |
| 2012-05-18 07:00:00 | 1.04 |
| 2012-05-18 08:00:00 | 1.3 |
| 2012-05-18 09:00:00 | 1.3 |
| 2012-05-18 10:00:00 | 1.3 |
| 2012-05-18 11:00:00 | 1.04 |
| 2012-05-18 12:00:00 | 1.3 |
| 2012-05-18 13:00:00 | 1.3 |
| 2012-05-18 14:00:00 | 1.3 |
| 2012-05-18 15:00:00 | 1.04 |
| 2012-05-18 16:00:00 | 1.3 |
| 2012-05-18 17:00:00 | 1.3 |
| 2012-05-18 18:00:00 | 1.3 |
| 2012-05-18 19:00:00 | 1.3 |
| 2012-05-18 20:00:00 | 1.3 |
| 2012-05-18 21:00:00 | 1.04 |
| 2012-05-18 22:00:00 | 1.3 |
| 2012-05-18 23:00:00 | 1.3 |
| 2012-05-19 | 1.3 |
| 2012-05-19 01:00:00 | 1.3 |
| 2012-05-19 02:00:00 | 1.3 |
| 2012-05-19 03:00:00 | 1.3 |
| 2012-05-19 04:00:00 | 1.3 |
| 2012-05-19 05:00:00 | 1.04 |
| 2012-05-19 06:00:00 | 1.3 |
| 2012-05-19 07:00:00 | 1.3 |
| 2012-05-19 08:00:00 | 1.3 |
| 2012-05-19 09:00:00 | 1.3 |
| 2012-05-19 10:00:00 | 1.3 |
| 2012-05-19 11:00:00 | 1.04 |
| 2012-05-19 12:00:00 | 1.3 |
| 2012-05-19 13:00:00 | 1.3 |
| 2012-05-19 14:00:00 | 1.3 |
| 2012-05-19 15:00:00 | 1.3 |
| 2012-05-19 16:00:00 | 1.04 |
| 2012-05-19 17:00:00 | 0.52 |
| 2012-05-19 18:00:00 | 1.04 |
| 2012-05-19 19:00:00 | 0.52 |
| 2012-05-19 20:00:00 | 0.52 |
| 2012-05-19 21:00:00 | 1.3 |
| 2012-05-19 22:00:00 | 1.04 |
| 2012-05-19 23:00:00 | 1.3 |
| 2012-05-20 | 1.3 |
| 2012-05-20 01:00:00 | 1.3 |
| 2012-05-20 02:00:00 | 1.3 |
| 2012-05-20 03:00:00 | 1.3 |
| 2012-05-20 04:00:00 | 1.3 |
| 2012-05-20 05:00:00 | 1.3 |
| 2012-05-20 06:00:00 | 1.3 |
| 2012-05-20 07:00:00 | 1.04 |
| 2012-05-20 08:00:00 | 1.3 |
| 2012-05-20 09:00:00 | 1.3 |
| 2012-05-20 10:00:00 | 1.3 |
| 2012-05-20 11:00:00 | 1.04 |
| 2012-05-20 12:00:00 | 1.04 |
| 2012-05-20 13:00:00 | 1.3 |
| 2012-05-20 14:00:00 | 0.52 |
| 2012-05-20 15:00:00 | 0.78 |
| 2012-05-20 16:00:00 | 0.26 |
| 2012-05-20 17:00:00 | 0.52 |
| 2012-05-20 18:00:00 | 0.26 |
| 2012-05-20 19:00:00 | 0 |
| 2012-05-20 20:00:00 | 0.26 |
| 2012-05-20 21:00:00 | 0 |
| 2012-05-20 22:00:00 | 0.78 |
| 2012-05-20 23:00:00 | 1.04 |
| 2012-05-21 | 1.3 |
| 2012-05-21 01:00:00 | 1.04 |
| 2012-05-21 02:00:00 | 1.3 |
| 2012-05-21 03:00:00 | 1.3 |
| 2012-05-21 04:00:00 | 1.3 |
| 2012-05-21 05:00:00 | 1.3 |
| 2012-05-21 06:00:00 | 1.3 |
| 2012-05-21 07:00:00 | 1.3 |
| 2012-05-21 08:00:00 | 0.78 |
| 2012-05-21 09:00:00 | 0.26 |
| 2012-05-21 10:00:00 | 0.52 |
| 2012-05-21 11:00:00 | 0.52 |
| 2012-05-21 12:00:00 | 0.52 |
| 2012-05-21 13:00:00 | 0.52 |
| 2012-05-21 14:00:00 | 0.52 |
| 2012-05-21 15:00:00 | 0.26 |
| 2012-05-21 16:00:00 | 0.52 |
| 2012-05-21 17:00:00 | 0.26 |
| 2012-05-21 18:00:00 | 0 |
| 2012-05-21 19:00:00 | 0.26 |
| 2012-05-21 20:00:00 | 0 |
| 2012-05-21 21:00:00 | 0.26 |
| 2012-05-21 22:00:00 | 0 |
| 2012-05-21 23:00:00 | 0.26 |
| 2012-05-22 | 0.26 |
| 2012-05-22 01:00:00 | 0.52 |
| 2012-05-22 02:00:00 | 0.78 |
| 2012-05-22 03:00:00 | 0.78 |
| 2012-05-22 04:00:00 | 0.78 |
| 2012-05-22 05:00:00 | 1.04 |
| 2012-05-22 06:00:00 | 0.78 |
| 2012-05-22 07:00:00 | 0.78 |
| 2012-05-22 08:00:00 | 0.26 |
| 2012-05-22 09:00:00 | 0.26 |
| 2012-05-22 10:00:00 | 0 |
| 2012-05-22 11:00:00 | 0.26 |
| 2012-05-22 12:00:00 | 0 |
| 2012-05-22 13:00:00 | 0 |
| 2012-05-22 14:00:00 | 0.26 |
| 2012-05-22 15:00:00 | 0.26 |
| 2012-05-22 16:00:00 | 0.26 |
| 2012-05-22 17:00:00 | 0.26 |
| 2012-05-22 18:00:00 | 0 |
| 2012-05-22 19:00:00 | 0.26 |
| 2012-05-22 20:00:00 | 0 |
| 2012-05-22 21:00:00 | 0 |
| 2012-05-22 22:00:00 | 0.26 |
| 2012-05-22 23:00:00 | 0 |
| 2012-05-23 | 0.26 |
| 2012-05-23 01:00:00 | 0.26 |
| 2012-05-23 02:00:00 | 0 |
| 2012-05-23 03:00:00 | 0.52 |
| 2012-05-23 04:00:00 | 0.26 |
| 2012-05-23 05:00:00 | 0.52 |
| 2012-05-23 06:00:00 | 0.52 |
| 2012-05-23 07:00:00 | 0.26 |
| 2012-05-23 08:00:00 | 0.26 |
| 2012-05-23 09:00:00 | 0 |
| 2012-05-23 10:00:00 | 0 |
| 2012-05-23 11:00:00 | 0.26 |
| 2012-05-23 12:00:00 | 0 |
| 2012-05-23 13:00:00 | 0.26 |
| 2012-05-23 14:00:00 | 0 |
| 2012-05-23 15:00:00 | 0.26 |
| 2012-05-23 16:00:00 | 0 |
| 2012-05-23 17:00:00 | 0.26 |
| 2012-05-23 18:00:00 | 0 |
| 2012-05-23 19:00:00 | 0 |
| 2012-05-23 20:00:00 | 0.26 |
| 2012-05-23 21:00:00 | 0 |
| 2012-05-23 22:00:00 | 0.26 |
| 2012-05-23 23:00:00 | 0 |
| 2012-05-24 | 0.26 |
| 2012-05-24 01:00:00 | 0 |
| 2012-05-24 02:00:00 | 0.26 |
| 2012-05-24 03:00:00 | 0 |
| 2012-05-24 04:00:00 | 0.26 |
| 2012-05-24 05:00:00 | 0 |
| 2012-05-24 06:00:00 | 0.26 |
| 2012-05-24 07:00:00 | 0 |
| 2012-05-24 08:00:00 | 0.26 |
| 2012-05-24 09:00:00 | 0 |
| 2012-05-24 10:00:00 | 0.26 |
| 2012-05-24 11:00:00 | 0 |
| 2012-05-24 12:00:00 | 0.26 |
| 2012-05-24 13:00:00 | 0 |
| 2012-05-24 14:00:00 | 0 |
| 2012-05-24 15:00:00 | 0.26 |
| 2012-05-24 16:00:00 | 0 |
| 2012-05-24 17:00:00 | 0.26 |
| 2012-05-24 18:00:00 | 0 |
| 2012-05-24 19:00:00 | 0.26 |
| 2012-05-24 20:00:00 | 0 |
| 2012-05-24 21:00:00 | 0.26 |
| 2012-05-24 22:00:00 | 0 |
| 2012-05-24 23:00:00 | 0.26 |
| 2012-05-25 | 0 |
| 2012-05-25 01:00:00 | 0.26 |
| 2012-05-25 02:00:00 | 0 |
| 2012-05-25 03:00:00 | 0.26 |
| 2012-05-25 04:00:00 | 0.52 |
| 2012-05-25 05:00:00 | 0.52 |
| 2012-05-25 06:00:00 | 0.52 |
| 2012-05-25 07:00:00 | 0.52 |
| 2012-05-25 08:00:00 | 0.78 |
| 2012-05-25 09:00:00 | 0.26 |
| 2012-05-25 10:00:00 | 0.26 |
| 2012-05-25 11:00:00 | 0.52 |
| 2012-05-25 12:00:00 | 0.52 |
| 2012-05-25 13:00:00 | 0.26 |
| 2012-05-25 14:00:00 | 0.26 |
| 2012-05-25 15:00:00 | 0 |
| 2012-05-25 16:00:00 | 0.26 |
| 2012-05-25 17:00:00 | 0 |
| 2012-05-25 18:00:00 | 0 |
| 2012-05-25 19:00:00 | 0.26 |
| 2012-05-25 20:00:00 | 0.26 |
| 2012-05-25 21:00:00 | 0 |
| 2012-05-25 22:00:00 | 0.52 |
| 2012-05-25 23:00:00 | 0.26 |
| 2012-05-26 | 0.78 |
| 2012-05-26 01:00:00 | 0.78 |
| 2012-05-26 02:00:00 | 0.78 |
| 2012-05-26 03:00:00 | 1.04 |
| 2012-05-26 04:00:00 | 1.04 |
| 2012-05-26 05:00:00 | 1.3 |
| 2012-05-26 06:00:00 | 1.3 |
| 2012-05-26 07:00:00 | 1.3 |
| 2012-05-26 08:00:00 | 1.04 |
| 2012-05-26 09:00:00 | 0.78 |
| 2012-05-26 10:00:00 | 0.52 |
| 2012-05-26 11:00:00 | 0.52 |
| 2012-05-26 12:00:00 | 0.78 |
| 2012-05-26 13:00:00 | 0.52 |
| 2012-05-26 14:00:00 | 0.26 |
| 2012-05-26 15:00:00 | 0.52 |
| 2012-05-26 16:00:00 | 0.26 |
| 2012-05-26 17:00:00 | 0 |
| 2012-05-26 18:00:00 | 0.26 |
| 2012-05-26 19:00:00 | 0 |
| 2012-05-26 20:00:00 | 0 |
| 2012-05-26 21:00:00 | 0.26 |
| 2012-05-26 22:00:00 | 0.52 |
| 2012-05-26 23:00:00 | 0.52 |
| 2012-05-27 | 0.78 |
| 2012-05-27 01:00:00 | 0.78 |
| 2012-05-27 02:00:00 | 0.78 |
| 2012-05-27 03:00:00 | 1.04 |
| 2012-05-27 04:00:00 | 1.3 |
| 2012-05-27 05:00:00 | 1.3 |
| 2012-05-27 06:00:00 | 1.3 |
| 2012-05-27 07:00:00 | 1.3 |
| 2012-05-27 08:00:00 | 1.04 |
| 2012-05-27 09:00:00 | 0.78 |
| 2012-05-27 10:00:00 | 0.52 |
| 2012-05-27 11:00:00 | 0.78 |
| 2012-05-27 12:00:00 | 0.26 |
| 2012-05-27 13:00:00 | 0.26 |
| 2012-05-27 14:00:00 | 0.26 |
| 2012-05-27 15:00:00 | 0.26 |
| 2012-05-27 16:00:00 | 0.26 |
| 2012-05-27 17:00:00 | 0.26 |
| 2012-05-27 18:00:00 | 0.26 |
| 2012-05-27 19:00:00 | 0.26 |
| 2012-05-27 20:00:00 | 0.26 |
| 2012-05-27 21:00:00 | 0.52 |
| 2012-05-27 22:00:00 | 0.52 |
| 2012-05-27 23:00:00 | 0.78 |
| 2012-05-28 | 0.78 |
| 2012-05-28 01:00:00 | 0.78 |
| 2012-05-28 02:00:00 | 0.78 |
| 2012-05-28 03:00:00 | 0.78 |
| 2012-05-28 04:00:00 | 1.04 |
| 2012-05-28 05:00:00 | 0.78 |
| 2012-05-28 06:00:00 | 1.04 |
| 2012-05-28 07:00:00 | 0.78 |
| 2012-05-28 08:00:00 | 0.78 |
| 2012-05-28 09:00:00 | 0.52 |
| 2012-05-28 10:00:00 | 0.52 |
| 2012-05-28 11:00:00 | 0.52 |
| 2012-05-28 12:00:00 | 0.26 |
| 2012-05-28 13:00:00 | 0.26 |
| 2012-05-28 14:00:00 | 0.52 |
| 2012-05-28 15:00:00 | 0.78 |
| 2012-05-28 16:00:00 | 0.78 |
| 2012-05-28 17:00:00 | 0.26 |
| 2012-05-28 18:00:00 | 0.26 |
| 2012-05-28 19:00:00 | 0.26 |
| 2012-05-28 20:00:00 | 0.26 |
| 2012-05-28 21:00:00 | 0.52 |
| 2012-05-28 22:00:00 | 0.78 |
| 2012-05-28 23:00:00 | 0.52 |
| 2012-05-29 | 0.78 |
| 2012-05-29 01:00:00 | 0.78 |
| 2012-05-29 02:00:00 | 1.04 |
| 2012-05-29 03:00:00 | 0.78 |
| 2012-05-29 04:00:00 | 1.04 |
| 2012-05-29 05:00:00 | 1.04 |
| 2012-05-29 06:00:00 | 1.3 |
| 2012-05-29 07:00:00 | 1.3 |
| 2012-05-29 08:00:00 | 0.78 |
| 2012-05-29 09:00:00 | 0.78 |
| 2012-05-29 10:00:00 | 0.26 |
| 2012-05-29 11:00:00 | 0.52 |
| 2012-05-29 12:00:00 | 0.26 |
| 2012-05-29 13:00:00 | 0 |
| 2012-05-29 14:00:00 | 0 |
| 2012-05-29 15:00:00 | 0.26 |
| 2012-05-29 16:00:00 | 0 |
| 2012-05-29 17:00:00 | 0.26 |
| 2012-05-29 18:00:00 | 0 |
| 2012-05-29 19:00:00 | 0.26 |
| 2012-05-29 20:00:00 | 0 |
| 2012-05-29 21:00:00 | 0.26 |
| 2012-05-29 22:00:00 | 0 |
| 2012-05-29 23:00:00 | 0.26 |
| 2012-05-30 | 0 |
| 2012-05-30 01:00:00 | 0.26 |
| 2012-05-30 02:00:00 | 0.26 |
| 2012-05-30 03:00:00 | 0.26 |
| 2012-05-30 04:00:00 | 0.26 |
| 2012-05-30 05:00:00 | 0.52 |
| 2012-05-30 06:00:00 | 0.52 |
| 2012-05-30 07:00:00 | 0.52 |
| 2012-05-30 08:00:00 | 0.52 |
| 2012-05-30 09:00:00 | 0.52 |
| 2012-05-30 10:00:00 | 0.26 |
| 2012-05-30 11:00:00 | 0.26 |
| 2012-05-30 12:00:00 | 0.26 |
| 2012-05-30 13:00:00 | 0.26 |
| 2012-05-30 14:00:00 | 0 |
| 2012-05-30 15:00:00 | 0 |
| 2012-05-30 16:00:00 | 0.26 |
| 2012-05-30 17:00:00 | 0 |
| 2012-05-30 18:00:00 | 0.26 |
| 2012-05-30 19:00:00 | 0 |
| 2012-05-30 20:00:00 | 0 |
| 2012-05-30 21:00:00 | 0.26 |
| 2012-05-30 22:00:00 | 0 |
| 2012-05-30 23:00:00 | 0.26 |
| 2012-05-31 | 0 |
| 2012-05-31 01:00:00 | 0.26 |
| 2012-05-31 02:00:00 | 0.52 |
| 2012-05-31 03:00:00 | 0.26 |
| 2012-05-31 04:00:00 | 0.52 |
| 2012-05-31 05:00:00 | 0.78 |
| 2012-05-31 06:00:00 | 0.78 |
| 2012-05-31 07:00:00 | 0.78 |
| 2012-05-31 08:00:00 | 0.52 |
| 2012-05-31 09:00:00 | 0.52 |
| 2012-05-31 10:00:00 | 0.26 |
| 2012-05-31 11:00:00 | 1.56 |
| 2012-05-31 12:00:00 | 0.26 |
| 2012-05-31 13:00:00 | 0.26 |
| 2012-05-31 14:00:00 | 0.26 |
| 2012-05-31 15:00:00 | 0.26 |
| 2012-05-31 16:00:00 | 0.26 |
| 2012-05-31 17:00:00 | 0.26 |
| 2012-05-31 18:00:00 | 0.26 |
| 2012-05-31 19:00:00 | 0.52 |
| 2012-05-31 20:00:00 | 0.26 |
| 2012-05-31 21:00:00 | 0.26 |
| 2012-05-31 22:00:00 | 0.26 |
| 2012-05-31 23:00:00 | 0.26 |
| 2012-06-01 | 0.26 |
| 2012-06-01 01:00:00 | 0.52 |
| 2012-06-01 02:00:00 | 0.26 |
| 2012-06-01 03:00:00 | 0.26 |
| 2012-06-01 04:00:00 | 0.52 |
| 2012-06-01 05:00:00 | 0.52 |
| 2012-06-01 06:00:00 | 0.78 |
| 2012-06-01 07:00:00 | 0.78 |
| 2012-06-01 08:00:00 | 0.52 |
| 2012-06-01 09:00:00 | 0.78 |
| 2012-06-01 10:00:00 | 0.52 |
| 2012-06-01 11:00:00 | 0.78 |
| 2012-06-01 12:00:00 | 0.52 |
| 2012-06-01 13:00:00 | 0.52 |
| 2012-06-01 14:00:00 | 0.78 |
| 2012-06-01 15:00:00 | 0.78 |
| 2012-06-01 16:00:00 | 0.52 |
| 2012-06-01 17:00:00 | 0.52 |
| 2012-06-01 18:00:00 | 0.52 |
| 2012-06-01 19:00:00 | 0.78 |
| 2012-06-01 20:00:00 | 0.78 |
| 2012-06-01 21:00:00 | 1.04 |
| 2012-06-01 22:00:00 | 1.04 |
| 2012-06-01 23:00:00 | 0.78 |
| 2012-06-02 | 1.04 |
| 2012-06-02 01:00:00 | 1.04 |
| 2012-06-02 02:00:00 | 1.3 |
| 2012-06-02 03:00:00 | 1.56 |
| 2012-06-02 04:00:00 | 1.56 |
| 2012-06-02 05:00:00 | 1.3 |
| 2012-06-02 06:00:00 | 1.56 |
| 2012-06-02 07:00:00 | 1.3 |
| 2012-06-02 08:00:00 | 1.56 |
| 2012-06-02 09:00:00 | 1.3 |
| 2012-06-02 10:00:00 | 1.56 |
| 2012-06-02 11:00:00 | 1.3 |
| 2012-06-02 12:00:00 | 1.3 |
| 2012-06-02 13:00:00 | 1.04 |
| 2012-06-02 14:00:00 | 1.04 |
| 2012-06-02 15:00:00 | 1.04 |
| 2012-06-02 16:00:00 | 0.52 |
| 2012-06-02 17:00:00 | 0.78 |
| 2012-06-02 18:00:00 | 0.26 |
| 2012-06-02 19:00:00 | 0.52 |
| 2012-06-02 20:00:00 | 0.78 |
| 2012-06-02 21:00:00 | 1.04 |
| 2012-06-02 22:00:00 | 1.3 |
| 2012-06-02 23:00:00 | 1.3 |
| 2012-06-03 | 1.04 |
| 2012-06-03 01:00:00 | 1.56 |
| 2012-06-03 02:00:00 | 1.3 |
| 2012-06-03 03:00:00 | 1.56 |
| 2012-06-03 04:00:00 | 1.3 |
| 2012-06-03 05:00:00 | 1.56 |
| 2012-06-03 06:00:00 | 1.3 |
| 2012-06-03 07:00:00 | 1.56 |
| 2012-06-03 08:00:00 | 1.3 |
| 2012-06-03 09:00:00 | 1.3 |
| 2012-06-03 10:00:00 | 0.78 |
| 2012-06-03 11:00:00 | 1.04 |
| 2012-06-03 12:00:00 | 0.52 |
| 2012-06-03 13:00:00 | 0.78 |
| 2012-06-03 14:00:00 | 0.26 |
| 2012-06-03 15:00:00 | 0.52 |
| 2012-06-03 16:00:00 | 0.26 |
| 2012-06-03 17:00:00 | 0.26 |
| 2012-06-03 18:00:00 | 0.52 |
| 2012-06-03 19:00:00 | 0.52 |
| 2012-06-03 20:00:00 | 0.26 |
| 2012-06-03 21:00:00 | 0.52 |
| 2012-06-03 22:00:00 | 0.26 |
| 2012-06-03 23:00:00 | 0.26 |
| 2012-06-04 | 0.26 |
| 2012-06-04 01:00:00 | 0.52 |
| 2012-06-04 02:00:00 | 0.52 |
| 2012-06-04 03:00:00 | 0.52 |
| 2012-06-04 04:00:00 | 0.52 |
| 2012-06-04 05:00:00 | 0.78 |
| 2012-06-04 06:00:00 | 0.78 |
| 2012-06-04 07:00:00 | 0.78 |
| 2012-06-04 08:00:00 | 0.78 |
| 2012-06-04 09:00:00 | 0.78 |
| 2012-06-04 10:00:00 | 1.04 |
| 2012-06-04 11:00:00 | 0.78 |
| 2012-06-04 12:00:00 | 0.78 |
| 2012-06-04 13:00:00 | 0.78 |
| 2012-06-04 14:00:00 | 0.78 |
| 2012-06-04 15:00:00 | 0.78 |
| 2012-06-04 16:00:00 | 0.78 |
| 2012-06-04 17:00:00 | 0.78 |
| 2012-06-04 18:00:00 | 0.78 |
| 2012-06-04 19:00:00 | 1.04 |
| 2012-06-04 20:00:00 | 0.78 |
| 2012-06-04 21:00:00 | 0.52 |
| 2012-06-04 22:00:00 | 0.78 |
| 2012-06-04 23:00:00 | 1.04 |
| 2012-06-05 | 0.78 |
| 2012-06-05 01:00:00 | 1.04 |
| 2012-06-05 02:00:00 | 0.78 |
| 2012-06-05 03:00:00 | 1.04 |
| 2012-06-05 04:00:00 | 1.04 |
| 2012-06-05 05:00:00 | 1.04 |
| 2012-06-05 06:00:00 | 1.04 |
| 2012-06-05 07:00:00 | 1.3 |
| 2012-06-05 08:00:00 | 1.04 |
| 2012-06-05 09:00:00 | 1.3 |
| 2012-06-05 10:00:00 | 2.08 |
| 2012-06-05 11:00:00 | 1.3 |
| 2012-06-05 12:00:00 | 1.3 |
| 2012-06-05 13:00:00 | 1.3 |
| 2012-06-05 14:00:00 | 1.82 |
| 2012-06-05 15:00:00 | 1.82 |
| 2012-06-05 16:00:00 | 1.04 |
| 2012-06-05 17:00:00 | 1.3 |
| 2012-06-05 18:00:00 | 1.04 |
| 2012-06-05 19:00:00 | 1.3 |
| 2012-06-05 20:00:00 | 1.3 |
| 2012-06-05 21:00:00 | 1.3 |
| 2012-06-05 22:00:00 | 1.04 |
| 2012-06-05 23:00:00 | 1.3 |
| 2012-06-06 | 1.3 |
| 2012-06-06 01:00:00 | 1.3 |
| 2012-06-06 02:00:00 | 1.3 |
| 2012-06-06 03:00:00 | 1.04 |
| 2012-06-06 04:00:00 | 1.3 |
| 2012-06-06 05:00:00 | 1.3 |
| 2012-06-06 06:00:00 | 1.3 |
| 2012-06-06 07:00:00 | 1.04 |
| 2012-06-06 08:00:00 | 1.3 |
| 2012-06-06 09:00:00 | 1.3 |
| 2012-06-06 10:00:00 | 1.04 |
| 2012-06-06 11:00:00 | 1.3 |
| 2012-06-06 12:00:00 | 1.3 |
| 2012-06-06 13:00:00 | 1.04 |
| 2012-06-06 14:00:00 | 1.3 |
| 2012-06-06 15:00:00 | 1.3 |
| 2012-06-06 16:00:00 | 1.3 |
| 2012-06-06 17:00:00 | 1.3 |
| 2012-06-06 18:00:00 | 1.04 |
| 2012-06-06 19:00:00 | 1.04 |
| 2012-06-06 20:00:00 | 0.78 |
| 2012-06-06 21:00:00 | 1.3 |
| 2012-06-06 22:00:00 | 1.3 |
| 2012-06-06 23:00:00 | 1.04 |
| 2012-06-07 | 1.3 |
| 2012-06-07 01:00:00 | 1.3 |
| 2012-06-07 02:00:00 | 1.3 |
| 2012-06-07 03:00:00 | 1.3 |
| 2012-06-07 04:00:00 | 1.04 |
| 2012-06-07 05:00:00 | 1.3 |
| 2012-06-07 06:00:00 | 1.3 |
| 2012-06-07 07:00:00 | 1.3 |
| 2012-06-07 08:00:00 | 0.78 |
| 2012-06-07 09:00:00 | 0.26 |
| 2012-06-07 10:00:00 | 0.26 |
| 2012-06-07 11:00:00 | 0.26 |
| 2012-06-07 12:00:00 | 0 |
| 2012-06-07 13:00:00 | 0.26 |
| 2012-06-07 14:00:00 | 0.26 |
| 2012-06-07 15:00:00 | 0 |
| 2012-06-07 16:00:00 | 0 |
| 2012-06-07 17:00:00 | 0.26 |
| 2012-06-07 18:00:00 | 0 |
| 2012-06-07 19:00:00 | 0 |
| 2012-06-07 20:00:00 | 0.26 |
| 2012-06-07 21:00:00 | 0 |
| 2012-06-07 22:00:00 | 0.26 |
| 2012-06-07 23:00:00 | 0 |
| 2012-06-08 | 0.26 |
| 2012-06-08 01:00:00 | 0 |
| 2012-06-08 02:00:00 | 0.26 |
| 2012-06-08 03:00:00 | 0 |
| 2012-06-08 04:00:00 | 0 |
| 2012-06-08 05:00:00 | 0.26 |
| 2012-06-08 06:00:00 | 0 |
| 2012-06-08 07:00:00 | 0.26 |
| 2012-06-08 08:00:00 | 0 |
| 2012-06-08 09:00:00 | 0 |
| 2012-06-08 10:00:00 | 0.26 |
| 2012-06-08 11:00:00 | 0 |
| 2012-06-08 12:00:00 | 0.26 |
| 2012-06-08 13:00:00 | 0 |
| 2012-06-08 14:00:00 | 0 |
| 2012-06-08 15:00:00 | 0.26 |
| 2012-06-08 16:00:00 | 0 |
| 2012-06-08 17:00:00 | 0 |
| 2012-06-08 18:00:00 | 0.26 |
| 2012-06-08 19:00:00 | 0 |
| 2012-06-08 20:00:00 | 0.26 |
| 2012-06-08 21:00:00 | 0 |
| 2012-06-08 22:00:00 | 0 |
| 2012-06-08 23:00:00 | 0.26 |
| 2012-06-09 | 0 |
| 2012-06-09 01:00:00 | 0.26 |
| 2012-06-09 02:00:00 | 0 |
| 2012-06-09 03:00:00 | 0.26 |
| 2012-06-09 04:00:00 | 0 |
| 2012-06-09 05:00:00 | 0.26 |
| 2012-06-09 06:00:00 | 0 |
| 2012-06-09 07:00:00 | 0 |
| 2012-06-09 08:00:00 | 0.26 |
| 2012-06-09 09:00:00 | 0 |
| 2012-06-09 10:00:00 | 0.26 |
| 2012-06-09 11:00:00 | 0 |
| 2012-06-09 12:00:00 | 0 |
| 2012-06-09 13:00:00 | 0.26 |
| 2012-06-09 14:00:00 | 0 |
| 2012-06-09 15:00:00 | 0 |
| 2012-06-09 16:00:00 | 0.26 |
| 2012-06-09 17:00:00 | 0 |
| 2012-06-09 18:00:00 | 0.26 |
| 2012-06-09 19:00:00 | 0 |
| 2012-06-09 20:00:00 | 0 |
| 2012-06-09 21:00:00 | 0.26 |
| 2012-06-09 22:00:00 | 0 |
| 2012-06-09 23:00:00 | 0.26 |
| 2012-06-10 | 0 |
| 2012-06-10 01:00:00 | 0.26 |
| 2012-06-10 02:00:00 | 0 |
| 2012-06-10 03:00:00 | 0.26 |
| 2012-06-10 04:00:00 | 0 |
| 2012-06-10 05:00:00 | 0 |
| 2012-06-10 06:00:00 | 0.26 |
| 2012-06-10 07:00:00 | 0 |
| 2012-06-10 08:00:00 | 0.26 |
| 2012-06-10 09:00:00 | 0 |
| 2012-06-10 10:00:00 | 0 |
| 2012-06-10 11:00:00 | 0.26 |
| 2012-06-10 12:00:00 | 0 |
| 2012-06-10 13:00:00 | 0 |
| 2012-06-10 14:00:00 | 0.26 |
| 2012-06-10 15:00:00 | 0 |
| 2012-06-10 16:00:00 | 0.26 |
| 2012-06-10 17:00:00 | 0 |
| 2012-06-10 18:00:00 | 0 |
| 2012-06-10 19:00:00 | 0.26 |
| 2012-06-10 20:00:00 | 0 |
| 2012-06-10 21:00:00 | 0.26 |
| 2012-06-10 22:00:00 | 0 |
| 2012-06-10 23:00:00 | 0 |
| 2012-06-11 | 0.26 |
| 2012-06-11 01:00:00 | 0 |
| 2012-06-11 02:00:00 | 0.26 |
| 2012-06-11 03:00:00 | 0 |
| 2012-06-11 04:00:00 | 0.26 |
| 2012-06-11 05:00:00 | 0 |
| 2012-06-11 06:00:00 | 0.26 |
| 2012-06-11 07:00:00 | 0 |
| 2012-06-11 08:00:00 | 0 |
| 2012-06-11 09:00:00 | 0.26 |
| 2012-06-11 10:00:00 | 0 |
| 2012-06-11 11:00:00 | 0.26 |
| 2012-06-11 12:00:00 | 0 |
| 2012-06-11 13:00:00 | 0 |
| 2012-06-11 14:00:00 | 0.26 |
| 2012-06-11 15:00:00 | 0 |
| 2012-06-11 16:00:00 | 0 |
| 2012-06-11 17:00:00 | 0.26 |
| 2012-06-11 18:00:00 | 0 |
| 2012-06-11 19:00:00 | 0.26 |
| 2012-06-11 20:00:00 | 0 |
| 2012-06-11 21:00:00 | 0 |
| 2012-06-11 22:00:00 | 0.26 |
| 2012-06-11 23:00:00 | 0 |
| 2012-06-12 | 0.26 |
| 2012-06-12 01:00:00 | 0 |
| 2012-06-12 02:00:00 | 0.26 |
| 2012-06-12 03:00:00 | 0 |
| 2012-06-12 04:00:00 | 0.26 |
| 2012-06-12 05:00:00 | 0 |
| 2012-06-12 06:00:00 | 0 |
| 2012-06-12 07:00:00 | 0.26 |
| 2012-06-12 08:00:00 | 0 |
| 2012-06-12 09:00:00 | 0.26 |
| 2012-06-12 10:00:00 | 0 |
| 2012-06-12 11:00:00 | 0 |
| 2012-06-12 12:00:00 | 0.26 |
| 2012-06-12 13:00:00 | 0 |
| 2012-06-12 14:00:00 | 0.26 |
| 2012-06-12 15:00:00 | 0 |
| 2012-06-12 16:00:00 | 0 |
| 2012-06-12 17:00:00 | 0.26 |
| 2012-06-12 18:00:00 | 0 |
| 2012-06-12 19:00:00 | 0 |
| 2012-06-12 20:00:00 | 0.26 |
| 2012-06-12 21:00:00 | 0 |
| 2012-06-12 22:00:00 | 0.26 |
| 2012-06-12 23:00:00 | 0 |
| 2012-06-13 | 0.26 |
| 2012-06-13 01:00:00 | 0 |
| 2012-06-13 02:00:00 | 0.26 |
| 2012-06-13 03:00:00 | 0 |
| 2012-06-13 04:00:00 | 0 |
| 2012-06-13 05:00:00 | 0.26 |
| 2012-06-13 06:00:00 | 0 |
| 2012-06-13 07:00:00 | 0.26 |
| 2012-06-13 08:00:00 | 0 |
| 2012-06-13 09:00:00 | 0 |
| 2012-06-13 10:00:00 | 0.26 |
| 2012-06-13 11:00:00 | 0 |
| 2012-06-13 12:00:00 | 0.26 |
| 2012-06-13 13:00:00 | 0 |
| 2012-06-13 14:00:00 | 0 |
| 2012-06-13 15:00:00 | 0.26 |
| 2012-06-13 16:00:00 | 0 |
| 2012-06-13 17:00:00 | 0.26 |
| 2012-06-13 18:00:00 | 0 |
| 2012-06-13 19:00:00 | 0 |
| 2012-06-13 20:00:00 | 0.26 |
| 2012-06-13 21:00:00 | 0 |
| 2012-06-13 22:00:00 | 0.26 |
| 2012-06-13 23:00:00 | 0 |
| 2012-06-14 | 0 |
| 2012-06-14 01:00:00 | 0.26 |
| 2012-06-14 02:00:00 | 0 |
| 2012-06-14 03:00:00 | 0.26 |
| 2012-06-14 04:00:00 | 0 |
| 2012-06-14 05:00:00 | 0.26 |
| 2012-06-14 06:00:00 | 0 |
| 2012-06-14 07:00:00 | 0.26 |
| 2012-06-14 08:00:00 | 0 |
| 2012-06-14 09:00:00 | 0.26 |
| 2012-06-14 10:00:00 | 0.52 |
| 2012-06-14 11:00:00 | 0.26 |
| 2012-06-14 12:00:00 | 0 |
| 2012-06-14 13:00:00 | 0.26 |
| 2012-06-14 14:00:00 | 0 |
| 2012-06-14 15:00:00 | 0 |
| 2012-06-14 16:00:00 | 0.26 |
| 2012-06-14 17:00:00 | 0 |
| 2012-06-14 18:00:00 | 0.26 |
| 2012-06-14 19:00:00 | 0 |
| 2012-06-14 20:00:00 | 0 |
| 2012-06-14 21:00:00 | 0.26 |
| 2012-06-14 22:00:00 | 0 |
| 2012-06-14 23:00:00 | 0.26 |
| 2012-06-15 | 0 |
| 2012-06-15 01:00:00 | 0.26 |
| 2012-06-15 02:00:00 | 0 |
| 2012-06-15 03:00:00 | 0 |
| 2012-06-15 04:00:00 | 0.26 |
| 2012-06-15 05:00:00 | 0 |
| 2012-06-15 06:00:00 | 0.26 |
| 2012-06-15 07:00:00 | 0 |
| 2012-06-15 08:00:00 | 0.26 |
| 2012-06-15 09:00:00 | 0 |
| 2012-06-15 10:00:00 | 0 |
| 2012-06-15 11:00:00 | 0.26 |
| 2012-06-15 12:00:00 | 0 |
| 2012-06-15 13:00:00 | 0 |
| 2012-06-15 14:00:00 | 0.26 |
| 2012-06-15 15:00:00 | 0 |
| 2012-06-15 16:00:00 | 0.26 |
| 2012-06-15 17:00:00 | 0 |
| 2012-06-15 18:00:00 | 0 |
| 2012-06-15 19:00:00 | 0.26 |
| 2012-06-15 20:00:00 | 0 |
| 2012-06-15 21:00:00 | 0.26 |
| 2012-06-15 22:00:00 | 0 |
| 2012-06-15 23:00:00 | 0 |
| 2012-06-16 | 0.26 |
| 2012-06-16 01:00:00 | 0 |
| 2012-06-16 02:00:00 | 0.26 |
| 2012-06-16 03:00:00 | 0 |
| 2012-06-16 04:00:00 | 0.26 |
| 2012-06-16 05:00:00 | 0 |
| 2012-06-16 06:00:00 | 0 |
| 2012-06-16 07:00:00 | 0.26 |
| 2012-06-16 08:00:00 | 0 |
| 2012-06-16 09:00:00 | 0.26 |
| 2012-06-16 10:00:00 | 0 |
| 2012-06-16 11:00:00 | 0 |
| 2012-06-16 12:00:00 | 0.26 |
| 2012-06-16 13:00:00 | 0 |
| 2012-06-16 14:00:00 | 0.26 |
| 2012-06-16 15:00:00 | 0 |
| 2012-06-16 16:00:00 | 0 |
| 2012-06-16 17:00:00 | 0.26 |
| 2012-06-16 18:00:00 | 0 |
| 2012-06-16 19:00:00 | 0 |
| 2012-06-16 20:00:00 | 0.26 |
| 2012-06-16 21:00:00 | 0 |
| 2012-06-16 22:00:00 | 0.26 |
| 2012-06-16 23:00:00 | 0 |
| 2012-06-17 | 0.26 |
| 2012-06-17 01:00:00 | 0 |
| 2012-06-17 02:00:00 | 0 |
| 2012-06-17 03:00:00 | 0.26 |
| 2012-06-17 04:00:00 | 0 |
| 2012-06-17 05:00:00 | 0.26 |
| 2012-06-17 06:00:00 | 0 |
| 2012-06-17 07:00:00 | 0.26 |
| 2012-06-17 08:00:00 | 0 |
| 2012-06-17 09:00:00 | 0 |
| 2012-06-17 10:00:00 | 0.26 |
| 2012-06-17 11:00:00 | 0 |
| 2012-06-17 12:00:00 | 0 |
| 2012-06-17 13:00:00 | 0.26 |
| 2012-06-17 14:00:00 | 0 |
| 2012-06-17 15:00:00 | 0.26 |
| 2012-06-17 16:00:00 | 0 |
| 2012-06-17 17:00:00 | 0 |
| 2012-06-17 18:00:00 | 0.26 |
| 2012-06-17 19:00:00 | 0 |
| 2012-06-17 20:00:00 | 0.26 |
| 2012-06-17 21:00:00 | 0 |
| 2012-06-17 22:00:00 | 0 |
| 2012-06-17 23:00:00 | 0.26 |
| 2012-06-18 | 0 |
| 2012-06-18 01:00:00 | 0.26 |
| 2012-06-18 02:00:00 | 0 |
| 2012-06-18 03:00:00 | 0.26 |
| 2012-06-18 04:00:00 | 0 |
| 2012-06-18 05:00:00 | 0.26 |
| 2012-06-18 06:00:00 | 0 |
| 2012-06-18 07:00:00 | 0 |
| 2012-06-18 08:00:00 | 0.26 |
| 2012-06-18 09:00:00 | 0 |
| 2012-06-18 10:00:00 | 0 |
| 2012-06-18 11:00:00 | 0.26 |
| 2012-06-18 12:00:00 | 0 |
| 2012-06-18 13:00:00 | 0.26 |
| 2012-06-18 14:00:00 | 0 |
| 2012-06-18 15:00:00 | 0 |
| 2012-06-18 16:00:00 | 0.26 |
| 2012-06-18 17:00:00 | 0 |
| 2012-06-18 18:00:00 | 0 |
| 2012-06-18 19:00:00 | 0.26 |
| 2012-06-18 20:00:00 | 0 |
| 2012-06-18 21:00:00 | 0.26 |
| 2012-06-18 22:00:00 | 0 |
| 2012-06-18 23:00:00 | 0 |
| 2012-06-19 | 0.26 |
| 2012-06-19 01:00:00 | 0 |
| 2012-06-19 02:00:00 | 0.26 |
| 2012-06-19 03:00:00 | 0 |
| 2012-06-19 04:00:00 | 0.26 |
| 2012-06-19 05:00:00 | 0 |
| 2012-06-19 06:00:00 | 0.26 |
| 2012-06-19 07:00:00 | 0 |
| 2012-06-19 08:00:00 | 0 |
| 2012-06-19 09:00:00 | 0.26 |
| 2012-06-19 10:00:00 | 0 |
| 2012-06-19 11:00:00 | 0 |
| 2012-06-19 12:00:00 | 0.26 |
| 2012-06-19 13:00:00 | 0 |
| 2012-06-19 14:00:00 | 0.26 |
| 2012-06-19 15:00:00 | 0 |
| 2012-06-19 16:00:00 | 0 |
| 2012-06-19 17:00:00 | 0.26 |
| 2012-06-19 18:00:00 | 0 |
| 2012-06-19 19:00:00 | 0 |
| 2012-06-19 20:00:00 | 0.26 |
| 2012-06-19 21:00:00 | 0 |
| 2012-06-19 22:00:00 | 0.26 |
| 2012-06-19 23:00:00 | 0 |
| 2012-06-20 | 0.26 |
| 2012-06-20 01:00:00 | 0 |
| 2012-06-20 02:00:00 | 0 |
| 2012-06-20 03:00:00 | 0.26 |
| 2012-06-20 04:00:00 | 0 |
| 2012-06-20 05:00:00 | 0.26 |
| 2012-06-20 06:00:00 | 0 |
| 2012-06-20 07:00:00 | 0.26 |
| 2012-06-20 08:00:00 | 0 |
| 2012-06-20 09:00:00 | 0 |
| 2012-06-20 10:00:00 | 0.26 |
| 2012-06-20 11:00:00 | 0 |
| 2012-06-20 12:00:00 | 0 |
| 2012-06-20 13:00:00 | 0.26 |
| 2012-06-20 14:00:00 | 0 |
| 2012-06-20 15:00:00 | 0.26 |
| 2012-06-20 16:00:00 | 0 |
| 2012-06-20 17:00:00 | 0 |
| 2012-06-20 18:00:00 | 0.26 |
| 2012-06-20 19:00:00 | 0 |
| 2012-06-20 20:00:00 | 0.26 |
| 2012-06-20 21:00:00 | 0 |
| 2012-06-20 22:00:00 | 0 |
| 2012-06-20 23:00:00 | 0.26 |
| 2012-06-21 | 0 |
| 2012-06-21 01:00:00 | 0.26 |
| 2012-06-21 02:00:00 | 0 |
| 2012-06-21 03:00:00 | 0.26 |
| 2012-06-21 04:00:00 | 0 |
| 2012-06-21 05:00:00 | 0.26 |
| 2012-06-21 06:00:00 | 0 |
| 2012-06-21 07:00:00 | 0 |
| 2012-06-21 08:00:00 | 0.26 |
| 2012-06-21 09:00:00 | 0 |
| 2012-06-21 10:00:00 | 0 |
| 2012-06-21 11:00:00 | 0.26 |
| 2012-06-21 12:00:00 | 0 |
| 2012-06-21 13:00:00 | 0.26 |
| 2012-06-21 14:00:00 | 0 |
| 2012-06-21 15:00:00 | 0 |
| 2012-06-21 16:00:00 | 0.26 |
| 2012-06-21 17:00:00 | 0 |
| 2012-06-21 18:00:00 | 0.26 |
| 2012-06-21 19:00:00 | 0 |
| 2012-06-21 20:00:00 | 0 |
| 2012-06-21 21:00:00 | 0.26 |
| 2012-06-21 22:00:00 | 0 |
| 2012-06-21 23:00:00 | 0.26 |
| 2012-06-22 | 0 |
| 2012-06-22 01:00:00 | 0 |
| 2012-06-22 02:00:00 | 0.26 |
| 2012-06-22 03:00:00 | 0 |
| 2012-06-22 04:00:00 | 0.26 |
| 2012-06-22 05:00:00 | 0 |
| 2012-06-22 06:00:00 | 0.26 |
| 2012-06-22 07:00:00 | 0 |
| 2012-06-22 08:00:00 | 0 |
| 2012-06-22 09:00:00 | 0.26 |
| 2012-06-22 10:00:00 | 0 |
| 2012-06-22 11:00:00 | 0.26 |
| 2012-06-22 12:00:00 | 0 |
| 2012-06-22 13:00:00 | 0 |
| 2012-06-22 14:00:00 | 0.26 |
| 2012-06-22 15:00:00 | 0 |
| 2012-06-22 16:00:00 | 0 |
| 2012-06-22 17:00:00 | 0.26 |
| 2012-06-22 18:00:00 | 0 |
| 2012-06-22 19:00:00 | 0.26 |
| 2012-06-22 20:00:00 | 0 |
| 2012-06-22 21:00:00 | 0 |
| 2012-06-22 22:00:00 | 0.26 |
| 2012-06-22 23:00:00 | 0 |
| 2012-06-23 | 0.26 |
| 2012-06-23 01:00:00 | 0 |
| 2012-06-23 02:00:00 | 0.26 |
| 2012-06-23 03:00:00 | 0 |
| 2012-06-23 04:00:00 | 0.26 |
| 2012-06-23 05:00:00 | 0 |
| 2012-06-23 06:00:00 | 0 |
| 2012-06-23 07:00:00 | 0.26 |
| 2012-06-23 08:00:00 | 0 |
| 2012-06-23 09:00:00 | 0 |
| 2012-06-23 10:00:00 | 0.26 |
| 2012-06-23 11:00:00 | 0 |
| 2012-06-23 12:00:00 | 0.26 |
| 2012-06-23 13:00:00 | 0 |
| 2012-06-23 14:00:00 | 0 |
| 2012-06-23 15:00:00 | 0.26 |
| 2012-06-23 16:00:00 | 0 |
| 2012-06-23 17:00:00 | 0 |
| 2012-06-23 18:00:00 | 0.26 |
| 2012-06-23 19:00:00 | 0 |
| 2012-06-23 20:00:00 | 0.26 |
| 2012-06-23 21:00:00 | 0 |
| 2012-06-23 22:00:00 | 0 |
| 2012-06-23 23:00:00 | 0.26 |
| 2012-06-24 | 0 |
| 2012-06-24 01:00:00 | 0.26 |
| 2012-06-24 02:00:00 | 0 |
| 2012-06-24 03:00:00 | 0.26 |
| 2012-06-24 04:00:00 | 0 |
| 2012-06-24 05:00:00 | 0.26 |
| 2012-06-24 06:00:00 | 0 |
| 2012-06-24 07:00:00 | 0 |
| 2012-06-24 08:00:00 | 0.26 |
| 2012-06-24 09:00:00 | 0 |
| 2012-06-24 10:00:00 | 0.26 |
| 2012-06-24 11:00:00 | 0 |
| 2012-06-24 12:00:00 | 0 |
| 2012-06-24 13:00:00 | 0.26 |
| 2012-06-24 14:00:00 | 0 |
| 2012-06-24 15:00:00 | 0 |
| 2012-06-24 16:00:00 | 0.26 |
| 2012-06-24 17:00:00 | 0 |
| 2012-06-24 18:00:00 | 0.26 |
| 2012-06-24 19:00:00 | 0 |
| 2012-06-24 20:00:00 | 0 |
| 2012-06-24 21:00:00 | 0.26 |
| 2012-06-24 22:00:00 | 0 |
| 2012-06-24 23:00:00 | 0.26 |
| 2012-06-25 | 0 |
| 2012-06-25 01:00:00 | 0.26 |
| 2012-06-25 02:00:00 | 0 |
| 2012-06-25 03:00:00 | 0 |
| 2012-06-25 04:00:00 | 0.26 |
| 2012-06-25 05:00:00 | 0 |
| 2012-06-25 06:00:00 | 0.26 |
| 2012-06-25 07:00:00 | 0 |
| 2012-06-25 08:00:00 | 0 |
| 2012-06-25 09:00:00 | 0.26 |
| 2012-06-25 10:00:00 | 0 |
| 2012-06-25 11:00:00 | 0.26 |
| 2012-06-25 12:00:00 | 0 |
| 2012-06-25 13:00:00 | 0 |
| 2012-06-25 14:00:00 | 0.26 |
| 2012-06-25 15:00:00 | 0 |
| 2012-06-25 16:00:00 | 0 |
| 2012-06-25 17:00:00 | 0.26 |
| 2012-06-25 18:00:00 | 0 |
| 2012-06-25 19:00:00 | 0.26 |
| 2012-06-25 20:00:00 | 0 |
| 2012-06-25 21:00:00 | 0 |
| 2012-06-25 22:00:00 | 0.26 |
| 2012-06-25 23:00:00 | 0 |
| 2012-06-26 | 0.26 |
| 2012-06-26 01:00:00 | 0 |
| 2012-06-26 02:00:00 | 0.26 |
| 2012-06-26 03:00:00 | 0 |
| 2012-06-26 04:00:00 | 0.26 |
| 2012-06-26 05:00:00 | 0 |
| 2012-06-26 06:00:00 | 0 |
| 2012-06-26 07:00:00 | 0.26 |
| 2012-06-26 08:00:00 | 0 |
| 2012-06-26 09:00:00 | 0.26 |
| 2012-06-26 10:00:00 | 0 |
| 2012-06-26 11:00:00 | 0 |
| 2012-06-26 12:00:00 | 0.26 |
| 2012-06-26 13:00:00 | 0 |
| 2012-06-26 14:00:00 | 0 |
| 2012-06-26 15:00:00 | 0.26 |
| 2012-06-26 16:00:00 | 0 |
| 2012-06-26 17:00:00 | 0.26 |
| 2012-06-26 18:00:00 | 0 |
| 2012-06-26 19:00:00 | 0 |
| 2012-06-26 20:00:00 | 0.26 |
| 2012-06-26 21:00:00 | 0 |
| 2012-06-26 22:00:00 | 0.26 |
| 2012-06-26 23:00:00 | 0 |
| 2012-06-27 | 0 |
| 2012-06-27 01:00:00 | 0.26 |
| 2012-06-27 02:00:00 | 0 |
| 2012-06-27 03:00:00 | 0.26 |
| 2012-06-27 04:00:00 | 0 |
| 2012-06-27 05:00:00 | 0.26 |
| 2012-06-27 06:00:00 | 0 |
| 2012-06-27 07:00:00 | 0 |
| 2012-06-27 08:00:00 | 0.26 |
| 2012-06-27 09:00:00 | 0 |
| 2012-06-27 10:00:00 | 0.26 |
| 2012-06-27 11:00:00 | 0 |
| 2012-06-27 12:00:00 | 0 |
| 2012-06-27 13:00:00 | 0.26 |
| 2012-06-27 14:00:00 | 0 |
| 2012-06-27 15:00:00 | 0.26 |
| 2012-06-27 16:00:00 | 0 |
| 2012-06-27 17:00:00 | 0 |
| 2012-06-27 18:00:00 | 0.26 |
| 2012-06-27 19:00:00 | 0 |
| 2012-06-27 20:00:00 | 0 |
| 2012-06-27 21:00:00 | 0.26 |
| 2012-06-27 22:00:00 | 0 |
| 2012-06-27 23:00:00 | 0.26 |
| 2012-06-28 | 0 |
| 2012-06-28 01:00:00 | 0.26 |
| 2012-06-28 02:00:00 | 0 |
| 2012-06-28 03:00:00 | 0.26 |
| 2012-06-28 04:00:00 | 0 |
| 2012-06-28 05:00:00 | 0 |
| 2012-06-28 06:00:00 | 0.26 |
| 2012-06-28 07:00:00 | 0 |
| 2012-06-28 08:00:00 | 0.26 |
| 2012-06-28 09:00:00 | 0 |
| 2012-06-28 10:00:00 | 0 |
| 2012-06-28 11:00:00 | 0.26 |
| 2012-06-28 12:00:00 | 0 |
| 2012-06-28 13:00:00 | 0 |
| 2012-06-28 14:00:00 | 0.26 |
| 2012-06-28 15:00:00 | 0 |
| 2012-06-28 16:00:00 | 0.26 |
| 2012-06-28 17:00:00 | 0 |
| 2012-06-28 18:00:00 | 0 |
| 2012-06-28 19:00:00 | 0.26 |
| 2012-06-28 20:00:00 | 0 |
| 2012-06-28 21:00:00 | 0.26 |
| 2012-06-28 22:00:00 | 0 |
| 2012-06-28 23:00:00 | 0 |
| 2012-06-29 | 0.26 |
| 2012-06-29 01:00:00 | 0 |
| 2012-06-29 02:00:00 | 0.26 |
| 2012-06-29 03:00:00 | 0 |
| 2012-06-29 04:00:00 | 0.26 |
| 2012-06-29 05:00:00 | 0 |
| 2012-06-29 06:00:00 | 0 |
| 2012-06-29 07:00:00 | 0.26 |
| 2012-06-29 08:00:00 | 0 |
| 2012-06-29 09:00:00 | 0.26 |
| 2012-06-29 10:00:00 | 0 |
| 2012-06-29 11:00:00 | 0 |
| 2012-06-29 12:00:00 | 0.26 |
| 2012-06-29 13:00:00 | 0 |
| 2012-06-29 14:00:00 | 0.26 |
| 2012-06-29 15:00:00 | 0 |
| 2012-06-29 16:00:00 | 0 |
| 2012-06-29 17:00:00 | 0.26 |
| 2012-06-29 18:00:00 | 0 |
| 2012-06-29 19:00:00 | 0 |
| 2012-06-29 20:00:00 | 0.26 |
| 2012-06-29 21:00:00 | 0 |
| 2012-06-29 22:00:00 | 0.26 |
| 2012-06-29 23:00:00 | 0 |
| 2012-06-30 | 0.26 |
| 2012-06-30 01:00:00 | 0 |
| 2012-06-30 02:00:00 | 0 |
| 2012-06-30 03:00:00 | 0.26 |
| 2012-06-30 04:00:00 | 0 |
| 2012-06-30 05:00:00 | 0.26 |
| 2012-06-30 06:00:00 | 0 |
| 2012-06-30 07:00:00 | 0.26 |
| 2012-06-30 08:00:00 | 0 |
| 2012-06-30 09:00:00 | 0 |
| 2012-06-30 10:00:00 | 0.26 |
| 2012-06-30 11:00:00 | 0 |
| 2012-06-30 12:00:00 | 0 |
| 2012-06-30 13:00:00 | 0.26 |
| 2012-06-30 14:00:00 | 0 |
| 2012-06-30 15:00:00 | 0.26 |
| 2012-06-30 16:00:00 | 0 |
| 2012-06-30 17:00:00 | 0 |
| 2012-06-30 18:00:00 | 0.26 |
| 2012-06-30 19:00:00 | 0 |
| 2012-06-30 20:00:00 | 0.26 |
| 2012-06-30 21:00:00 | 0 |
| 2012-06-30 22:00:00 | 0 |
| 2012-06-30 23:00:00 | 0.26 |
| 2012-07-01 | 0 |
| 2012-07-01 01:00:00 | 0.26 |
| 2012-07-01 02:00:00 | 0 |
| 2012-07-01 03:00:00 | 0.26 |
| 2012-07-01 04:00:00 | 0 |
| 2012-07-01 05:00:00 | 0 |
| 2012-07-01 06:00:00 | 0.26 |
| 2012-07-01 07:00:00 | 0 |
| 2012-07-01 08:00:00 | 0.26 |
| 2012-07-01 09:00:00 | 0 |
| 2012-07-01 10:00:00 | 0 |
| 2012-07-01 11:00:00 | 0.26 |
| 2012-07-01 12:00:00 | 0 |
| 2012-07-01 13:00:00 | 0.26 |
| 2012-07-01 14:00:00 | 0 |
| 2012-07-01 15:00:00 | 0 |
| 2012-07-01 16:00:00 | 0.26 |
| 2012-07-01 17:00:00 | 0 |
| 2012-07-01 18:00:00 | 0 |
| 2012-07-01 19:00:00 | 0.26 |
| 2012-07-01 20:00:00 | 0 |
| 2012-07-01 21:00:00 | 0.26 |
| 2012-07-01 22:00:00 | 0 |
| 2012-07-01 23:00:00 | 0 |
| 2012-07-02 | 0.26 |
| 2012-07-02 01:00:00 | 0 |
| 2012-07-02 02:00:00 | 0.26 |
| 2012-07-02 03:00:00 | 0 |
| 2012-07-02 04:00:00 | 0.26 |
| 2012-07-02 05:00:00 | 0 |
| 2012-07-02 06:00:00 | 0.26 |
| 2012-07-02 07:00:00 | 0 |
| 2012-07-02 08:00:00 | 0 |
| 2012-07-02 09:00:00 | 0.26 |
| 2012-07-02 10:00:00 | 0 |
| 2012-07-02 11:00:00 | 0 |
| 2012-07-02 12:00:00 | 0.26 |
| 2012-07-02 13:00:00 | 0 |
| 2012-07-02 14:00:00 | 0.26 |
| 2012-07-02 15:00:00 | 0 |
| 2012-07-02 16:00:00 | 0 |
| 2012-07-02 17:00:00 | 0.26 |
| 2012-07-02 18:00:00 | 0 |
| 2012-07-02 19:00:00 | 0 |
| 2012-07-02 20:00:00 | 0.26 |
| 2012-07-02 21:00:00 | 0 |
| 2012-07-02 22:00:00 | 0.26 |
| 2012-07-02 23:00:00 | 0 |
| 2012-07-03 | 0.26 |
| 2012-07-03 01:00:00 | 0 |
| 2012-07-03 02:00:00 | 0.26 |
| 2012-07-03 03:00:00 | 0 |
| 2012-07-03 04:00:00 | 0 |
| 2012-07-03 05:00:00 | 0.26 |
| 2012-07-03 06:00:00 | 0 |
| 2012-07-03 07:00:00 | 0.26 |
| 2012-07-03 08:00:00 | 0 |
| 2012-07-03 09:00:00 | 0 |
| 2012-07-03 10:00:00 | 0.26 |
| 2012-07-03 11:00:00 | 0 |
| 2012-07-03 12:00:00 | 0 |
| 2012-07-03 13:00:00 | 0.26 |
| 2012-07-03 14:00:00 | 0 |
| 2012-07-03 15:00:00 | 0.26 |
| 2012-07-03 16:00:00 | 0 |
| 2012-07-03 17:00:00 | 0 |
| 2012-07-03 18:00:00 | 0.26 |
| 2012-07-03 19:00:00 | 0 |
| 2012-07-03 20:00:00 | 0.26 |
| 2012-07-03 21:00:00 | 0 |
| 2012-07-03 22:00:00 | 0 |
| 2012-07-03 23:00:00 | 0.26 |
| 2012-07-04 | 0 |
| 2012-07-04 01:00:00 | 0.26 |
| 2012-07-04 02:00:00 | 0 |
| 2012-07-04 03:00:00 | 0.26 |
| 2012-07-04 04:00:00 | 0 |
| 2012-07-04 05:00:00 | 0.26 |
| 2012-07-04 06:00:00 | 0 |
| 2012-07-04 07:00:00 | 0 |
| 2012-07-04 08:00:00 | 0.26 |
| 2012-07-04 09:00:00 | 0 |
| 2012-07-04 10:00:00 | 0.26 |
| 2012-07-04 11:00:00 | 0 |
| 2012-07-04 12:00:00 | 0.26 |
| 2012-07-04 13:00:00 | 0 |
| 2012-07-04 14:00:00 | 0 |
| 2012-07-04 15:00:00 | 0.26 |
| 2012-07-04 16:00:00 | 0.26 |
| 2012-07-04 17:00:00 | 0 |
| 2012-07-04 18:00:00 | 0 |
| 2012-07-04 19:00:00 | 0.26 |
| 2012-07-04 20:00:00 | 0 |
| 2012-07-04 21:00:00 | 0.26 |
| 2012-07-04 22:00:00 | 0.26 |
| 2012-07-04 23:00:00 | 0 |
| 2012-07-05 | 0 |
| 2012-07-05 01:00:00 | 0.26 |
| 2012-07-05 02:00:00 | 0 |
| 2012-07-05 03:00:00 | 0.26 |
| 2012-07-05 04:00:00 | 0 |
| 2012-07-05 05:00:00 | 0.26 |
| 2012-07-05 06:00:00 | 0 |
| 2012-07-05 07:00:00 | 0 |
| 2012-07-05 08:00:00 | 0.26 |
| 2012-07-05 09:00:00 | 0 |
| 2012-07-05 10:00:00 | 0.26 |
| 2012-07-05 11:00:00 | 0 |
| 2012-07-05 12:00:00 | 0 |
| 2012-07-05 13:00:00 | 0.26 |
| 2012-07-05 14:00:00 | 0 |
| 2012-07-05 15:00:00 | 0 |
| 2012-07-05 16:00:00 | 0.26 |
| 2012-07-05 17:00:00 | 0 |
| 2012-07-05 18:00:00 | 0 |
| 2012-07-05 19:00:00 | 0.26 |
| 2012-07-05 20:00:00 | 0 |
| 2012-07-05 21:00:00 | 0.26 |
| 2012-07-05 22:00:00 | 0 |
| 2012-07-05 23:00:00 | 0 |
| 2012-07-06 | 0.26 |
| 2012-07-06 01:00:00 | 0 |
| 2012-07-06 02:00:00 | 0.26 |
| 2012-07-06 03:00:00 | 0 |
| 2012-07-06 04:00:00 | 0.26 |
| 2012-07-06 05:00:00 | 0 |
| 2012-07-06 06:00:00 | 0.26 |
| 2012-07-06 07:00:00 | 0 |
| 2012-07-06 08:00:00 | 0 |
| 2012-07-06 09:00:00 | 0.26 |
| 2012-07-06 10:00:00 | 0 |
| 2012-07-06 11:00:00 | 0 |
| 2012-07-06 12:00:00 | 0.26 |
| 2012-07-06 13:00:00 | 0 |
| 2012-07-06 14:00:00 | 0.26 |
| 2012-07-06 15:00:00 | 0 |
| 2012-07-06 16:00:00 | 0 |
| 2012-07-06 17:00:00 | 0.26 |
| 2012-07-06 18:00:00 | 0 |
| 2012-07-06 19:00:00 | 0 |
| 2012-07-06 20:00:00 | 0.26 |
| 2012-07-06 21:00:00 | 0 |
| 2012-07-06 22:00:00 | 0.26 |
| 2012-07-06 23:00:00 | 0 |
| 2012-07-07 | 0 |
| 2012-07-07 01:00:00 | 0.26 |
| 2012-07-07 02:00:00 | 0 |
| 2012-07-07 03:00:00 | 0.26 |
| 2012-07-07 04:00:00 | 0 |
| 2012-07-07 05:00:00 | 0.26 |
| 2012-07-07 06:00:00 | 0 |
| 2012-07-07 07:00:00 | 0 |
| 2012-07-07 08:00:00 | 0.26 |
| 2012-07-07 09:00:00 | 0 |
| 2012-07-07 10:00:00 | 0.26 |
| 2012-07-07 11:00:00 | 0 |
| 2012-07-07 12:00:00 | 0 |
| 2012-07-07 13:00:00 | 0.26 |
| 2012-07-07 14:00:00 | 0 |
| 2012-07-07 15:00:00 | 0 |
| 2012-07-07 16:00:00 | 0.26 |
| 2012-07-07 17:00:00 | 0 |
| 2012-07-07 18:00:00 | 0 |
| 2012-07-07 19:00:00 | 0.26 |
| 2012-07-07 20:00:00 | 0 |
| 2012-07-07 21:00:00 | 0.26 |
| 2012-07-07 22:00:00 | 0 |
| 2012-07-07 23:00:00 | 0 |
| 2012-07-08 | 0.26 |
| 2012-07-08 01:00:00 | 0 |
| 2012-07-08 02:00:00 | 0.26 |
| 2012-07-08 03:00:00 | 0 |
| 2012-07-08 04:00:00 | 0.26 |
| 2012-07-08 05:00:00 | 0 |
| 2012-07-08 06:00:00 | 0.26 |
| 2012-07-08 07:00:00 | 0 |
| 2012-07-08 08:00:00 | 0 |
| 2012-07-08 09:00:00 | 0.26 |
| 2012-07-08 10:00:00 | 0 |
| 2012-07-08 11:00:00 | 0 |
| 2012-07-08 12:00:00 | 0.26 |
| 2012-07-08 13:00:00 | 0 |
| 2012-07-08 14:00:00 | 0.26 |
| 2012-07-08 15:00:00 | 0 |
| 2012-07-08 16:00:00 | 0 |
| 2012-07-08 17:00:00 | 0.26 |
| 2012-07-08 18:00:00 | 0 |
| 2012-07-08 19:00:00 | 0 |
| 2012-07-08 20:00:00 | 0.26 |
| 2012-07-08 21:00:00 | 0 |
| 2012-07-08 22:00:00 | 0.26 |
| 2012-07-08 23:00:00 | 0 |
| 2012-07-09 | 0.26 |
| 2012-07-09 01:00:00 | 0 |
| 2012-07-09 02:00:00 | 0 |
| 2012-07-09 03:00:00 | 0.26 |
| 2012-07-09 04:00:00 | 0 |
| 2012-07-09 05:00:00 | 0.26 |
| 2012-07-09 06:00:00 | 0 |
| 2012-07-09 07:00:00 | 0 |
| 2012-07-09 08:00:00 | 0.26 |
| 2012-07-09 09:00:00 | 0 |
| 2012-07-09 10:00:00 | 0.26 |
| 2012-07-09 11:00:00 | 0 |
| 2012-07-09 12:00:00 | 0 |
| 2012-07-09 13:00:00 | 0.26 |
| 2012-07-09 14:00:00 | 0 |
| 2012-07-09 15:00:00 | 0 |
| 2012-07-09 16:00:00 | 0.26 |
| 2012-07-09 17:00:00 | 0 |
| 2012-07-09 18:00:00 | 0.26 |
| 2012-07-09 19:00:00 | 0 |
| 2012-07-09 20:00:00 | 0 |
| 2012-07-09 21:00:00 | 0.26 |
| 2012-07-09 22:00:00 | 0 |
| 2012-07-09 23:00:00 | 0.26 |
| 2012-07-10 | 0 |
| 2012-07-10 01:00:00 | 0.26 |
| 2012-07-10 02:00:00 | 0 |
| 2012-07-10 03:00:00 | 0 |
| 2012-07-10 04:00:00 | 0.26 |
| 2012-07-10 05:00:00 | 0 |
| 2012-07-10 06:00:00 | 0.26 |
| 2012-07-10 07:00:00 | 0 |
| 2012-07-10 08:00:00 | 0 |
| 2012-07-10 09:00:00 | 0.26 |
| 2012-07-10 10:00:00 | 0 |
| 2012-07-10 11:00:00 | 0.26 |
| 2012-07-10 12:00:00 | 0 |
| 2012-07-10 13:00:00 | 0 |
| 2012-07-10 14:00:00 | 0.26 |
| 2012-07-10 15:00:00 | 0 |
| 2012-07-10 16:00:00 | 0 |
| 2012-07-10 17:00:00 | 0.26 |
| 2012-07-10 18:00:00 | 0 |
| 2012-07-10 19:00:00 | 0.26 |
| 2012-07-10 20:00:00 | 0 |
| 2012-07-10 21:00:00 | 0 |
| 2012-07-10 22:00:00 | 0.26 |
| 2012-07-10 23:00:00 | 0 |
| 2012-07-11 | 0.26 |
| 2012-07-11 01:00:00 | 0 |
| 2012-07-11 02:00:00 | 0.26 |
| 2012-07-11 03:00:00 | 0 |
| 2012-07-11 04:00:00 | 0.26 |
| 2012-07-11 05:00:00 | 0 |
| 2012-07-11 06:00:00 | 0 |
| 2012-07-11 07:00:00 | 0.26 |
| 2012-07-11 08:00:00 | 0 |
| 2012-07-11 09:00:00 | 0 |
| 2012-07-11 10:00:00 | 0.26 |
| 2012-07-11 11:00:00 | 0 |
| 2012-07-11 12:00:00 | 0.26 |
| 2012-07-11 13:00:00 | 0 |
| 2012-07-11 14:00:00 | 0 |
| 2012-07-11 15:00:00 | 0.26 |
| 2012-07-11 16:00:00 | 0 |
| 2012-07-11 17:00:00 | 0 |
| 2012-07-11 18:00:00 | 0.26 |
| 2012-07-11 19:00:00 | 0 |
| 2012-07-11 20:00:00 | 0.26 |
| 2012-07-11 21:00:00 | 0 |
| 2012-07-11 22:00:00 | 0 |
| 2012-07-11 23:00:00 | 0.26 |
| 2012-07-12 | 0 |
| 2012-07-12 01:00:00 | 0.26 |
| 2012-07-12 02:00:00 | 0 |
| 2012-07-12 03:00:00 | 0.26 |
| 2012-07-12 04:00:00 | 0 |
| 2012-07-12 05:00:00 | 0.26 |
| 2012-07-12 06:00:00 | 0 |
| 2012-07-12 07:00:00 | 0 |
| 2012-07-12 08:00:00 | 0.26 |
| 2012-07-12 09:00:00 | 0 |
| 2012-07-12 10:00:00 | 0 |
| 2012-07-12 11:00:00 | 0.26 |
| 2012-07-12 12:00:00 | 0 |
| 2012-07-12 13:00:00 | 0.26 |
| 2012-07-12 14:00:00 | 0 |
| 2012-07-12 15:00:00 | 0 |
| 2012-07-12 16:00:00 | 0.26 |
| 2012-07-12 17:00:00 | 0 |
| 2012-07-12 18:00:00 | 0.26 |
| 2012-07-12 19:00:00 | 0 |
| 2012-07-12 20:00:00 | 0 |
| 2012-07-12 21:00:00 | 0.26 |
| 2012-07-12 22:00:00 | 0 |
| 2012-07-12 23:00:00 | 0.26 |
| 2012-07-13 | 0 |
| 2012-07-13 01:00:00 | 0 |
| 2012-07-13 02:00:00 | 0.26 |
| 2012-07-13 03:00:00 | 0 |
| 2012-07-13 04:00:00 | 0.26 |
| 2012-07-13 05:00:00 | 0 |
| 2012-07-13 06:00:00 | 0.26 |
| 2012-07-13 07:00:00 | 0 |
| 2012-07-13 08:00:00 | 0 |
| 2012-07-13 09:00:00 | 0.26 |
| 2012-07-13 10:00:00 | 0 |
| 2012-07-13 11:00:00 | 0.26 |
| 2012-07-13 12:00:00 | 0.52 |
| 2012-07-13 13:00:00 | 0.26 |
| 2012-07-13 14:00:00 | 0 |
| 2012-07-13 15:00:00 | 0.26 |
| 2012-07-13 16:00:00 | 0 |
| 2012-07-13 17:00:00 | 0 |
| 2012-07-13 18:00:00 | 0.26 |
| 2012-07-13 19:00:00 | 0 |
| 2012-07-13 20:00:00 | 0 |
| 2012-07-13 21:00:00 | 0.26 |
| 2012-07-13 22:00:00 | 0 |
| 2012-07-13 23:00:00 | 0.26 |
| 2012-07-14 | 0 |
| 2012-07-14 01:00:00 | 0.26 |
| 2012-07-14 02:00:00 | 0 |
| 2012-07-14 03:00:00 | 0.26 |
| 2012-07-14 04:00:00 | 0 |
| 2012-07-14 05:00:00 | 0 |
| 2012-07-14 06:00:00 | 0.26 |
| 2012-07-14 07:00:00 | 0 |
| 2012-07-14 08:00:00 | 0.26 |
| 2012-07-14 09:00:00 | 0 |
| 2012-07-14 10:00:00 | 0 |
| 2012-07-14 11:00:00 | 0.26 |
| 2012-07-14 12:00:00 | 0 |
| 2012-07-14 13:00:00 | 0 |
| 2012-07-14 14:00:00 | 0.26 |
| 2012-07-14 15:00:00 | 0 |
| 2012-07-14 16:00:00 | 0.26 |
| 2012-07-14 17:00:00 | 0 |
| 2012-07-14 18:00:00 | 0 |
| 2012-07-14 19:00:00 | 0.26 |
| 2012-07-14 20:00:00 | 0 |
| 2012-07-14 21:00:00 | 0.26 |
| 2012-07-14 22:00:00 | 0 |
| 2012-07-14 23:00:00 | 0 |
| 2012-07-15 | 0.26 |
| 2012-07-15 01:00:00 | 0 |
| 2012-07-15 02:00:00 | 0.26 |
| 2012-07-15 03:00:00 | 0 |
| 2012-07-15 04:00:00 | 0.26 |
| 2012-07-15 05:00:00 | 0 |
| 2012-07-15 06:00:00 | 0 |
| 2012-07-15 07:00:00 | 0.52 |
| 2012-07-15 08:00:00 | 0.26 |
| 2012-07-15 09:00:00 | 0 |
| 2012-07-15 10:00:00 | 0 |
| 2012-07-15 11:00:00 | 0.26 |
| 2012-07-15 12:00:00 | 0 |
| 2012-07-15 13:00:00 | 0 |
| 2012-07-15 14:00:00 | 0.26 |
| 2012-07-15 15:00:00 | 0 |
| 2012-07-15 16:00:00 | 0.26 |
| 2012-07-15 17:00:00 | 0 |
| 2012-07-15 18:00:00 | 0 |
| 2012-07-15 19:00:00 | 0.26 |
| 2012-07-15 20:00:00 | 0 |
| 2012-07-15 21:00:00 | 0 |
| 2012-07-15 22:00:00 | 0.26 |
| 2012-07-15 23:00:00 | 0 |
| 2012-07-16 | 0.26 |
| 2012-07-16 01:00:00 | 0 |
| 2012-07-16 02:00:00 | 0.26 |
| 2012-07-16 03:00:00 | 0 |
| 2012-07-16 04:00:00 | 0.26 |
| 2012-07-16 05:00:00 | 0 |
| 2012-07-16 06:00:00 | 0 |
| 2012-07-16 07:00:00 | 0.26 |
| 2012-07-16 08:00:00 | 0 |
| 2012-07-16 09:00:00 | 0.26 |
| 2012-07-16 10:00:00 | 0 |
| 2012-07-16 11:00:00 | 0 |
| 2012-07-16 12:00:00 | 0.26 |
| 2012-07-16 13:00:00 | 0 |
| 2012-07-16 14:00:00 | 0.26 |
| 2012-07-16 15:00:00 | 0 |
| 2012-07-16 16:00:00 | 0 |
| 2012-07-16 17:00:00 | 0.26 |
| 2012-07-16 18:00:00 | 0 |
| 2012-07-16 19:00:00 | 0 |
| 2012-07-16 20:00:00 | 0.26 |
| 2012-07-16 21:00:00 | 0 |
| 2012-07-16 22:00:00 | 0.26 |
| 2012-07-16 23:00:00 | 0 |
| 2012-07-17 | 0.26 |
| 2012-07-17 01:00:00 | 0 |
| 2012-07-17 02:00:00 | 0 |
| 2012-07-17 03:00:00 | 0.26 |
| 2012-07-17 04:00:00 | 0 |
| 2012-07-17 05:00:00 | 0.26 |
| 2012-07-17 06:00:00 | 0 |
| 2012-07-17 07:00:00 | 0.26 |
| 2012-07-17 08:00:00 | 0 |
| 2012-07-17 09:00:00 | 0 |
| 2012-07-17 10:00:00 | 0.26 |
| 2012-07-17 11:00:00 | 0 |
| 2012-07-17 12:00:00 | 0 |
| 2012-07-17 13:00:00 | 0.26 |
| 2012-07-17 14:00:00 | 0 |
| 2012-07-17 15:00:00 | 0.26 |
| 2012-07-17 16:00:00 | 0 |
| 2012-07-17 17:00:00 | 0.26 |
| 2012-07-17 18:00:00 | 0 |
| 2012-07-17 19:00:00 | 0 |
| 2012-07-17 20:00:00 | 0.26 |
| 2012-07-17 21:00:00 | 0 |
| 2012-07-17 22:00:00 | 0.26 |
| 2012-07-17 23:00:00 | 0 |
| 2012-07-18 | 0.26 |
| 2012-07-18 01:00:00 | 0 |
| 2012-07-18 02:00:00 | 0.26 |
| 2012-07-18 03:00:00 | 0 |
| 2012-07-18 04:00:00 | 0 |
| 2012-07-18 05:00:00 | 0.26 |
| 2012-07-18 06:00:00 | 0 |
| 2012-07-18 07:00:00 | 0.26 |
| 2012-07-18 08:00:00 | 0 |
| 2012-07-18 09:00:00 | 0 |
| 2012-07-18 10:00:00 | 0.26 |
| 2012-07-18 11:00:00 | 0 |
| 2012-07-18 12:00:00 | 0.26 |
| 2012-07-18 13:00:00 | 0 |
| 2012-07-18 14:00:00 | 0 |
| 2012-07-18 15:00:00 | 0.26 |
| 2012-07-18 16:00:00 | 0 |
| 2012-07-18 17:00:00 | 0 |
| 2012-07-18 18:00:00 | 0.26 |
| 2012-07-18 19:00:00 | 0 |
| 2012-07-18 20:00:00 | 0.26 |
| 2012-07-18 21:00:00 | 0 |
| 2012-07-18 22:00:00 | 0 |
| 2012-07-18 23:00:00 | 0.26 |
| 2012-07-19 | 0 |
| 2012-07-19 01:00:00 | 0.26 |
| 2012-07-19 02:00:00 | 0 |
| 2012-07-19 03:00:00 | 0.26 |
| 2012-07-19 04:00:00 | 0 |
| 2012-07-19 05:00:00 | 0.26 |
| 2012-07-19 06:00:00 | 0 |
| 2012-07-19 07:00:00 | 0 |
| 2012-07-19 08:00:00 | 0.26 |
| 2012-07-19 09:00:00 | 0 |
| 2012-07-19 10:00:00 | 0.26 |
| 2012-07-19 11:00:00 | 0 |
| 2012-07-19 12:00:00 | 0 |
| 2012-07-19 13:00:00 | 0.26 |
| 2012-07-19 14:00:00 | 0 |
| 2012-07-19 15:00:00 | 0.26 |
| 2012-07-19 16:00:00 | 0 |
| 2012-07-19 17:00:00 | 0.26 |
| 2012-07-19 18:00:00 | 0 |
| 2012-07-19 19:00:00 | 0 |
| 2012-07-19 20:00:00 | 0.26 |
| 2012-07-19 21:00:00 | 0 |
| 2012-07-19 22:00:00 | 0.26 |
| 2012-07-19 23:00:00 | 0 |
| 2012-07-20 | 0 |
| 2012-07-20 01:00:00 | 0.26 |
| 2012-07-20 02:00:00 | 0 |
| 2012-07-20 03:00:00 | 0 |
| 2012-07-20 04:00:00 | 0 |
| 2012-07-20 05:00:00 | 0.52 |
| 2012-07-20 06:00:00 | 0.26 |
| 2012-07-20 07:00:00 | 0 |
| 2012-07-20 08:00:00 | 0.26 |
| 2012-07-20 09:00:00 | 0.26 |
| 2012-07-20 10:00:00 | 0.26 |
| 2012-07-20 11:00:00 | 0.26 |
| 2012-07-20 12:00:00 | 0.26 |
| 2012-07-20 13:00:00 | 0.26 |
| 2012-07-20 14:00:00 | 0.26 |
| 2012-07-20 15:00:00 | 0.26 |
| 2012-07-20 16:00:00 | 0 |
| 2012-07-20 17:00:00 | 0.26 |
| 2012-07-20 18:00:00 | 0 |
| 2012-07-20 19:00:00 | 0.26 |
| 2012-07-20 20:00:00 | 0 |
| 2012-07-20 21:00:00 | 0 |
| 2012-07-20 22:00:00 | 0.26 |
| 2012-07-20 23:00:00 | 0 |
| 2012-07-21 | 0.26 |
| 2012-07-21 01:00:00 | 0 |
| 2012-07-21 02:00:00 | 0.26 |
| 2012-07-21 03:00:00 | 0 |
| 2012-07-21 04:00:00 | 0 |
| 2012-07-21 05:00:00 | 0.26 |
| 2012-07-21 06:00:00 | 0 |
| 2012-07-21 07:00:00 | 0.26 |
| 2012-07-21 08:00:00 | 0 |
| 2012-07-21 09:00:00 | 0 |
| 2012-07-21 10:00:00 | 0.26 |
| 2012-07-21 11:00:00 | 0 |
| 2012-07-21 12:00:00 | 0.26 |
| 2012-07-21 13:00:00 | 0 |
| 2012-07-21 14:00:00 | 0 |
| 2012-07-21 15:00:00 | 0.26 |
| 2012-07-21 16:00:00 | 0 |
| 2012-07-21 17:00:00 | 0 |
| 2012-07-21 18:00:00 | 0.26 |
| 2012-07-21 19:00:00 | 0 |
| 2012-07-21 20:00:00 | 0.26 |
| 2012-07-21 21:00:00 | 0 |
| 2012-07-21 22:00:00 | 0 |
| 2012-07-21 23:00:00 | 0.26 |
| 2012-07-22 | 0 |
| 2012-07-22 01:00:00 | 0.26 |
| 2012-07-22 02:00:00 | 0 |
| 2012-07-22 03:00:00 | 0.26 |
| 2012-07-22 04:00:00 | 0 |
| 2012-07-22 05:00:00 | 0.26 |
| 2012-07-22 06:00:00 | 0 |
| 2012-07-22 07:00:00 | 0 |
| 2012-07-22 08:00:00 | 0.26 |
| 2012-07-22 09:00:00 | 0 |
| 2012-07-22 10:00:00 | 0.26 |
| 2012-07-22 11:00:00 | 0 |
| 2012-07-22 12:00:00 | 0 |
| 2012-07-22 13:00:00 | 0.26 |
| 2012-07-22 14:00:00 | 0 |
| 2012-07-22 15:00:00 | 0 |
| 2012-07-22 16:00:00 | 0.26 |
| 2012-07-22 17:00:00 | 0 |
| 2012-07-22 18:00:00 | 0.26 |
| 2012-07-22 19:00:00 | 0 |
| 2012-07-22 20:00:00 | 0 |
| 2012-07-22 21:00:00 | 0.26 |
| 2012-07-22 22:00:00 | 0 |
| 2012-07-22 23:00:00 | 0.26 |
| 2012-07-23 | 0 |
| 2012-07-23 01:00:00 | 0.26 |
| 2012-07-23 02:00:00 | 0 |
| 2012-07-23 03:00:00 | 0 |
| 2012-07-23 04:00:00 | 0.26 |
| 2012-07-23 05:00:00 | 0 |
| 2012-07-23 06:00:00 | 0.26 |
| 2012-07-23 07:00:00 | 0 |
| 2012-07-23 08:00:00 | 0.26 |
| 2012-07-23 09:00:00 | 0 |
| 2012-07-23 10:00:00 | 0 |
| 2012-07-23 11:00:00 | 0.26 |
| 2012-07-23 12:00:00 | 0 |
| 2012-07-23 13:00:00 | 0 |
| 2012-07-23 14:00:00 | 0.26 |
| 2012-07-23 15:00:00 | 0 |
| 2012-07-23 16:00:00 | 0.26 |
| 2012-07-23 17:00:00 | 0 |
| 2012-07-23 18:00:00 | 0 |
| 2012-07-23 19:00:00 | 0.26 |
| 2012-07-23 20:00:00 | 0 |
| 2012-07-23 21:00:00 | 0.26 |
| 2012-07-23 22:00:00 | 0 |
| 2012-07-23 23:00:00 | 0 |
| 2012-07-24 | 0.26 |
| 2012-07-24 01:00:00 | 0 |
| 2012-07-24 02:00:00 | 0.26 |
| 2012-07-24 03:00:00 | 0 |
| 2012-07-24 04:00:00 | 0.26 |
| 2012-07-24 05:00:00 | 0 |
| 2012-07-24 06:00:00 | 0.26 |
| 2012-07-24 07:00:00 | 0 |
| 2012-07-24 08:00:00 | 0 |
| 2012-07-24 09:00:00 | 0.26 |
| 2012-07-24 10:00:00 | 0 |
| 2012-07-24 11:00:00 | 0 |
| 2012-07-24 12:00:00 | 0.26 |
| 2012-07-24 13:00:00 | 0 |
| 2012-07-24 14:00:00 | 0.26 |
| 2012-07-24 15:00:00 | 0 |
| 2012-07-24 16:00:00 | 0 |
| 2012-07-24 17:00:00 | 0.26 |
| 2012-07-24 18:00:00 | 0 |
| 2012-07-24 19:00:00 | 0 |
| 2012-07-24 20:00:00 | 0.26 |
| 2012-07-24 21:00:00 | 0 |
| 2012-07-24 22:00:00 | 0.26 |
| 2012-07-24 23:00:00 | 0 |
| 2012-07-25 | 0.26 |
| 2012-07-25 01:00:00 | 0 |
| 2012-07-25 02:00:00 | 0 |
| 2012-07-25 03:00:00 | 0.26 |
| 2012-07-25 04:00:00 | 0 |
| 2012-07-25 05:00:00 | 0.26 |
| 2012-07-25 06:00:00 | 0 |
| 2012-07-25 07:00:00 | 0.26 |
| 2012-07-25 08:00:00 | 0 |
| 2012-07-25 09:00:00 | 0 |
| 2012-07-25 10:00:00 | 0.26 |
| 2012-07-25 11:00:00 | 0 |
| 2012-07-25 12:00:00 | 0.26 |
| 2012-07-25 13:00:00 | 0 |
| 2012-07-25 14:00:00 | 0 |
| 2012-07-25 15:00:00 | 0.26 |
| 2012-07-25 16:00:00 | 0 |
| 2012-07-25 17:00:00 | 0 |
| 2012-07-25 18:00:00 | 0.26 |
| 2012-07-25 19:00:00 | 0 |
| 2012-07-25 20:00:00 | 0.26 |
| 2012-07-25 21:00:00 | 0 |
| 2012-07-25 22:00:00 | 0 |
| 2012-07-25 23:00:00 | 0.26 |
| 2012-07-26 | 0 |
| 2012-07-26 01:00:00 | 0.26 |
| 2012-07-26 02:00:00 | 0 |
| 2012-07-26 03:00:00 | 0.26 |
| 2012-07-26 04:00:00 | 0 |
| 2012-07-26 05:00:00 | 0.26 |
| 2012-07-26 06:00:00 | 0 |
| 2012-07-26 07:00:00 | 0 |
| 2012-07-26 08:00:00 | 0.26 |
| 2012-07-26 09:00:00 | 0 |
| 2012-07-26 10:00:00 | 0.26 |
| 2012-07-26 11:00:00 | 0.52 |
| 2012-07-26 12:00:00 | 0.26 |
| 2012-07-26 13:00:00 | 0.26 |
| 2012-07-26 14:00:00 | 0.26 |
| 2012-07-26 15:00:00 | 0 |
| 2012-07-26 16:00:00 | 0 |
| 2012-07-26 17:00:00 | 0.26 |
| 2012-07-26 18:00:00 | 0 |
| 2012-07-26 19:00:00 | 0.26 |
| 2012-07-26 20:00:00 | 0 |
| 2012-07-26 21:00:00 | 0 |
| 2012-07-26 22:00:00 | 0.26 |
| 2012-07-26 23:00:00 | 0 |
| 2012-07-27 | 0.26 |
| 2012-07-27 01:00:00 | 0 |
| 2012-07-27 02:00:00 | 0.26 |
| 2012-07-27 03:00:00 | 0 |
| 2012-07-27 04:00:00 | 0 |
| 2012-07-27 05:00:00 | 0.26 |
| 2012-07-27 06:00:00 | 0 |
| 2012-07-27 07:00:00 | 0.26 |
| 2012-07-27 08:00:00 | 0 |
| 2012-07-27 09:00:00 | 0 |
| 2012-07-27 10:00:00 | 0.26 |
| 2012-07-27 11:00:00 | 0 |
| 2012-07-27 12:00:00 | 0.26 |
| 2012-07-27 13:00:00 | 0 |
| 2012-07-27 14:00:00 | 0 |
| 2012-07-27 15:00:00 | 0.26 |
| 2012-07-27 16:00:00 | 0 |
| 2012-07-27 17:00:00 | 0 |
| 2012-07-27 18:00:00 | 0.26 |
| 2012-07-27 19:00:00 | 0 |
| 2012-07-27 20:00:00 | 0.26 |
| 2012-07-27 21:00:00 | 0 |
| 2012-07-27 22:00:00 | 0 |
| 2012-07-27 23:00:00 | 0.26 |
| 2012-07-28 | 0 |
| 2012-07-28 01:00:00 | 0.26 |
| 2012-07-28 02:00:00 | 0 |
| 2012-07-28 03:00:00 | 0.26 |
| 2012-07-28 04:00:00 | 0 |
| 2012-07-28 05:00:00 | 0.26 |
| 2012-07-28 06:00:00 | 0 |
| 2012-07-28 07:00:00 | 0 |
| 2012-07-28 08:00:00 | 0.26 |
| 2012-07-28 09:00:00 | 0 |
| 2012-07-28 10:00:00 | 0 |
| 2012-07-28 11:00:00 | 0.26 |
| 2012-07-28 12:00:00 | 0 |
| 2012-07-28 13:00:00 | 0.26 |
| 2012-07-28 14:00:00 | 0 |
| 2012-07-28 15:00:00 | 0 |
| 2012-07-28 16:00:00 | 0.26 |
| 2012-07-28 17:00:00 | 0 |
| 2012-07-28 18:00:00 | 0 |
| 2012-07-28 19:00:00 | 0.26 |
| 2012-07-28 20:00:00 | 0 |
| 2012-07-28 21:00:00 | 0.26 |
| 2012-07-28 22:00:00 | 0 |
| 2012-07-28 23:00:00 | 0 |
| 2012-07-29 | 0.26 |
| 2012-07-29 01:00:00 | 0 |
| 2012-07-29 02:00:00 | 0.26 |
| 2012-07-29 03:00:00 | 0 |
| 2012-07-29 04:00:00 | 0.26 |
| 2012-07-29 05:00:00 | 0 |
| 2012-07-29 06:00:00 | 0.26 |
| 2012-07-29 07:00:00 | 0 |
| 2012-07-29 08:00:00 | 0 |
| 2012-07-29 09:00:00 | 0.26 |
| 2012-07-29 10:00:00 | 0 |
| 2012-07-29 11:00:00 | 0 |
| 2012-07-29 12:00:00 | 0.26 |
| 2012-07-29 13:00:00 | 0 |
| 2012-07-29 14:00:00 | 0.26 |
| 2012-07-29 15:00:00 | 0 |
| 2012-07-29 16:00:00 | 0 |
| 2012-07-29 17:00:00 | 0.26 |
| 2012-07-29 18:00:00 | 0 |
| 2012-07-29 19:00:00 | 0 |
| 2012-07-29 20:00:00 | 0.26 |
| 2012-07-29 21:00:00 | 0 |
| 2012-07-29 22:00:00 | 0.26 |
| 2012-07-29 23:00:00 | 0 |
| 2012-07-30 | 0.26 |
| 2012-07-30 01:00:00 | 0 |
| 2012-07-30 02:00:00 | 0 |
| 2012-07-30 03:00:00 | 0.26 |
| 2012-07-30 04:00:00 | 0 |
| 2012-07-30 05:00:00 | 0.26 |
| 2012-07-30 06:00:00 | 0 |
| 2012-07-30 07:00:00 | 0.26 |
| 2012-07-30 08:00:00 | 0 |
| 2012-07-30 09:00:00 | 0 |
| 2012-07-30 10:00:00 | 0.26 |
| 2012-07-30 11:00:00 | 0 |
| 2012-07-30 12:00:00 | 0 |
| 2012-07-30 13:00:00 | 0.26 |
| 2012-07-30 14:00:00 | 0 |
| 2012-07-30 15:00:00 | 0.26 |
| 2012-07-30 16:00:00 | 0 |
| 2012-07-30 17:00:00 | 0 |
| 2012-07-30 18:00:00 | 0.26 |
| 2012-07-30 19:00:00 | 0 |
| 2012-07-30 20:00:00 | 0.26 |
| 2012-07-30 21:00:00 | 0 |
| 2012-07-30 22:00:00 | 0 |
| 2012-07-30 23:00:00 | 0.26 |
| 2012-07-31 | 0 |
| 2012-07-31 01:00:00 | 0.26 |
| 2012-07-31 02:00:00 | 0 |
| 2012-07-31 03:00:00 | 0.26 |
| 2012-07-31 04:00:00 | 0 |
| 2012-07-31 05:00:00 | 0 |
| 2012-07-31 06:00:00 | 0.26 |
| 2012-07-31 07:00:00 | 0 |
| 2012-07-31 08:00:00 | 0.26 |
| 2012-07-31 09:00:00 | 0 |
| 2012-07-31 10:00:00 | 0 |
| 2012-07-31 11:00:00 | 0.26 |
| 2012-07-31 12:00:00 | 0 |
| 2012-07-31 13:00:00 | 0.26 |
| 2012-07-31 14:00:00 | 0 |
| 2012-07-31 15:00:00 | 0 |
| 2012-07-31 16:00:00 | 0.26 |
| 2012-07-31 17:00:00 | 0 |
| 2012-07-31 18:00:00 | 0 |
| 2012-07-31 19:00:00 | 0.26 |
| 2012-07-31 20:00:00 | 0 |
| 2012-07-31 21:00:00 | 0.26 |
| 2012-07-31 22:00:00 | 0 |
| 2012-07-31 23:00:00 | 0 |
| 2012-08-01 | 0.26 |
| 2012-08-01 01:00:00 | 0 |
| 2012-08-01 02:00:00 | 0.26 |
| 2012-08-01 03:00:00 | 0 |
| 2012-08-01 04:00:00 | 0.26 |
| 2012-08-01 05:00:00 | 0 |
| 2012-08-01 06:00:00 | 0.26 |
| 2012-08-01 07:00:00 | 0 |
| 2012-08-01 08:00:00 | 0 |
| 2012-08-01 09:00:00 | 0.26 |
| 2012-08-01 10:00:00 | 0 |
| 2012-08-01 11:00:00 | 0 |
| 2012-08-01 12:00:00 | 0.26 |
| 2012-08-01 13:00:00 | 0 |
| 2012-08-01 14:00:00 | 0.26 |
| 2012-08-01 15:00:00 | 0 |
| 2012-08-01 16:00:00 | 0 |
| 2012-08-01 17:00:00 | 0.26 |
| 2012-08-01 18:00:00 | 0 |
| 2012-08-01 19:00:00 | 0 |
| 2012-08-01 20:00:00 | 0.26 |
| 2012-08-01 21:00:00 | 0 |
| 2012-08-01 22:00:00 | 0.26 |
| 2012-08-01 23:00:00 | 0 |
| 2012-08-02 | 0.26 |
| 2012-08-02 01:00:00 | 0 |
| 2012-08-02 02:00:00 | 0 |
| 2012-08-02 03:00:00 | 0.26 |
| 2012-08-02 04:00:00 | 0 |
| 2012-08-02 05:00:00 | 0.26 |
| 2012-08-02 06:00:00 | 0 |
| 2012-08-02 07:00:00 | 0.26 |
| 2012-08-02 08:00:00 | 0 |
| 2012-08-02 09:00:00 | 0 |
| 2012-08-02 10:00:00 | 0.26 |
| 2012-08-02 11:00:00 | 0 |
| 2012-08-02 12:00:00 | 0 |
| 2012-08-02 13:00:00 | 0.26 |
| 2012-08-02 14:00:00 | 1.04 |
| 2012-08-02 15:00:00 | 0 |
| 2012-08-02 16:00:00 | 0 |
| 2012-08-02 17:00:00 | 0.26 |
| 2012-08-02 18:00:00 | 0 |
| 2012-08-02 19:00:00 | 0 |
| 2012-08-02 20:00:00 | 0.26 |
| 2012-08-02 21:00:00 | 0 |
| 2012-08-02 22:00:00 | 0.26 |
| 2012-08-02 23:00:00 | 0 |
| 2012-08-03 | 0.26 |
| 2012-08-03 01:00:00 | 0 |
| 2012-08-03 02:00:00 | 0 |
| 2012-08-03 03:00:00 | 0.26 |
| 2012-08-03 04:00:00 | 0 |
| 2012-08-03 05:00:00 | 0.26 |
| 2012-08-03 06:00:00 | 0 |
| 2012-08-03 07:00:00 | 0.26 |
| 2012-08-03 08:00:00 | 0 |
| 2012-08-03 09:00:00 | 0 |
| 2012-08-03 10:00:00 | 0.26 |
| 2012-08-03 11:00:00 | 0 |
| 2012-08-03 12:00:00 | 0 |
| 2012-08-03 13:00:00 | 0.26 |
| 2012-08-03 14:00:00 | 0 |
| 2012-08-03 15:00:00 | 0.26 |
| 2012-08-03 16:00:00 | 0 |
| 2012-08-03 17:00:00 | 0 |
| 2012-08-03 18:00:00 | 0.26 |
| 2012-08-03 19:00:00 | 0 |
| 2012-08-03 20:00:00 | 0 |
| 2012-08-03 21:00:00 | 0.26 |
| 2012-08-03 22:00:00 | 0 |
| 2012-08-03 23:00:00 | 0.26 |
| 2012-08-04 | 0 |
| 2012-08-04 01:00:00 | 0.26 |
| 2012-08-04 02:00:00 | 0 |
| 2012-08-04 03:00:00 | 0.26 |
| 2012-08-04 04:00:00 | 0 |
| 2012-08-04 05:00:00 | 0 |
| 2012-08-04 06:00:00 | 0.26 |
| 2012-08-04 07:00:00 | 0 |
| 2012-08-04 08:00:00 | 0.26 |
| 2012-08-04 09:00:00 | 0 |
| 2012-08-04 10:00:00 | 0 |
| 2012-08-04 11:00:00 | 0.26 |
| 2012-08-04 12:00:00 | 0 |
| 2012-08-04 13:00:00 | 0 |
| 2012-08-04 14:00:00 | 0.26 |
| 2012-08-04 15:00:00 | 0 |
| 2012-08-04 16:00:00 | 0.26 |
| 2012-08-04 17:00:00 | 0 |
| 2012-08-04 18:00:00 | 0 |
| 2012-08-04 19:00:00 | 0.26 |
| 2012-08-04 20:00:00 | 0 |
| 2012-08-04 21:00:00 | 0 |
| 2012-08-04 22:00:00 | 0.26 |
| 2012-08-04 23:00:00 | 0 |
| 2012-08-05 | 0.26 |
| 2012-08-05 01:00:00 | 0 |
| 2012-08-05 02:00:00 | 0.26 |
| 2012-08-05 03:00:00 | 0 |
| 2012-08-05 04:00:00 | 0.26 |
| 2012-08-05 05:00:00 | 0 |
| 2012-08-05 06:00:00 | 0 |
| 2012-08-05 07:00:00 | 0.26 |
| 2012-08-05 08:00:00 | 0 |
| 2012-08-05 09:00:00 | 0.26 |
| 2012-08-05 10:00:00 | 0 |
| 2012-08-05 11:00:00 | 0 |
| 2012-08-05 12:00:00 | 0.26 |
| 2012-08-05 13:00:00 | 0 |
| 2012-08-05 14:00:00 | 0 |
| 2012-08-05 15:00:00 | 0.26 |
| 2012-08-05 16:00:00 | 0 |
| 2012-08-05 17:00:00 | 0.26 |
| 2012-08-05 18:00:00 | 0 |
| 2012-08-05 19:00:00 | 0 |
| 2012-08-05 20:00:00 | 0.26 |
| 2012-08-05 21:00:00 | 0 |
| 2012-08-05 22:00:00 | 0 |
| 2012-08-05 23:00:00 | 0.26 |
| 2012-08-06 | 0 |
| 2012-08-06 01:00:00 | 0.26 |
| 2012-08-06 02:00:00 | 0 |
| 2012-08-06 03:00:00 | 0.26 |
| 2012-08-06 04:00:00 | 0 |
| 2012-08-06 05:00:00 | 0.26 |
| 2012-08-06 06:00:00 | 0 |
| 2012-08-06 07:00:00 | 0 |
| 2012-08-06 08:00:00 | 0.26 |
| 2012-08-06 09:00:00 | 0 |
| 2012-08-06 10:00:00 | 0.26 |
| 2012-08-06 11:00:00 | 0 |
| 2012-08-06 12:00:00 | 0 |
| 2012-08-06 13:00:00 | 0.26 |
| 2012-08-06 14:00:00 | 0 |
| 2012-08-06 15:00:00 | 0 |
| 2012-08-06 16:00:00 | 0.26 |
| 2012-08-06 17:00:00 | 0 |
| 2012-08-06 18:00:00 | 0.26 |
| 2012-08-06 19:00:00 | 0 |
| 2012-08-06 20:00:00 | 0 |
| 2012-08-06 21:00:00 | 0.26 |
| 2012-08-06 22:00:00 | 0 |
| 2012-08-06 23:00:00 | 0.26 |
| 2012-08-07 | 24.44 |
| 2012-08-07 01:00:00 | 43.94 |
| 2012-08-07 02:00:00 | 27.04 |
| 2012-08-07 03:00:00 | 4.94 |
| 2012-08-07 04:00:00 | 0.26 |
| 2012-08-07 05:00:00 | 0 |
| 2012-08-07 06:00:00 | 0.26 |
| 2012-08-07 07:00:00 | 0 |
| 2012-08-07 08:00:00 | 0 |
| 2012-08-07 09:00:00 | 0.26 |
| 2012-08-07 10:00:00 | 0 |
| 2012-08-07 11:00:00 | 0.26 |
| 2012-08-07 12:00:00 | 0 |
| 2012-08-07 13:00:00 | 0 |
| 2012-08-07 14:00:00 | 0.26 |
| 2012-08-07 15:00:00 | 0 |
| 2012-08-07 16:00:00 | 0 |
| 2012-08-07 17:00:00 | 0.26 |
| 2012-08-07 18:00:00 | 0 |
| 2012-08-07 19:00:00 | 0.26 |
| 2012-08-07 20:00:00 | 0 |
| 2012-08-07 21:00:00 | 0 |
| 2012-08-07 22:00:00 | 0.26 |
| 2012-08-07 23:00:00 | 0 |
| 2012-08-08 | 0.26 |
| 2012-08-08 01:00:00 | 0 |
| 2012-08-08 02:00:00 | 0.26 |
| 2012-08-08 03:00:00 | 0 |
| 2012-08-08 04:00:00 | 0.26 |
| 2012-08-08 05:00:00 | 0 |
| 2012-08-08 06:00:00 | 0 |
| 2012-08-08 07:00:00 | 0.26 |
| 2012-08-08 08:00:00 | 0 |
| 2012-08-08 09:00:00 | 0.26 |
| 2012-08-08 10:00:00 | 0 |
| 2012-08-08 11:00:00 | 0 |
| 2012-08-08 12:00:00 | 0.26 |
| 2012-08-08 13:00:00 | 0 |
| 2012-08-08 14:00:00 | 0 |
| 2012-08-08 15:00:00 | 0.26 |
| 2012-08-08 16:00:00 | 0 |
| 2012-08-08 17:00:00 | 0.26 |
| 2012-08-08 18:00:00 | 0 |
| 2012-08-08 19:00:00 | 0 |
| 2012-08-08 20:00:00 | 0.26 |
| 2012-08-08 21:00:00 | 0 |
| 2012-08-08 22:00:00 | 0.26 |
| 2012-08-08 23:00:00 | 0 |
| 2012-08-09 | 0 |
| 2012-08-09 01:00:00 | 0.26 |
| 2012-08-09 02:00:00 | 0 |
| 2012-08-09 03:00:00 | 0.26 |
| 2012-08-09 04:00:00 | 0 |
| 2012-08-09 05:00:00 | 0.26 |
| 2012-08-09 06:00:00 | 0 |
| 2012-08-09 07:00:00 | 0 |
| 2012-08-09 08:00:00 | 0.26 |
| 2012-08-09 09:00:00 | 0 |
| 2012-08-09 10:00:00 | 0.26 |
| 2012-08-09 11:00:00 | 0 |
| 2012-08-09 12:00:00 | 0 |
| 2012-08-09 13:00:00 | 0.26 |
| 2012-08-09 14:00:00 | 0 |
| 2012-08-09 15:00:00 | 0.26 |
| 2012-08-09 16:00:00 | 0 |
| 2012-08-09 17:00:00 | 0 |
| 2012-08-09 18:00:00 | 0.26 |
| 2012-08-09 19:00:00 | 0 |
| 2012-08-09 20:00:00 | 0 |
| 2012-08-09 21:00:00 | 0.26 |
| 2012-08-09 22:00:00 | 0 |
| 2012-08-09 23:00:00 | 0.26 |
| 2012-08-10 | 0 |
| 2012-08-10 01:00:00 | 0.26 |
| 2012-08-10 02:00:00 | 0 |
| 2012-08-10 03:00:00 | 0.26 |
| 2012-08-10 04:00:00 | 0 |
| 2012-08-10 05:00:00 | 0 |
| 2012-08-10 06:00:00 | 0.26 |
| 2012-08-10 07:00:00 | 0 |
| 2012-08-10 08:00:00 | 0.26 |
| 2012-08-10 09:00:00 | 0 |
| 2012-08-10 10:00:00 | 0 |
| 2012-08-10 11:00:00 | 0.26 |
| 2012-08-10 12:00:00 | 0 |
| 2012-08-10 13:00:00 | 0.26 |
| 2012-08-10 14:00:00 | 0 |
| 2012-08-10 15:00:00 | 0 |
| 2012-08-10 16:00:00 | 0.26 |
| 2012-08-10 17:00:00 | 0 |
| 2012-08-10 18:00:00 | 0 |
| 2012-08-10 19:00:00 | 0.26 |
| 2012-08-10 20:00:00 | 0 |
| 2012-08-10 21:00:00 | 0.26 |
| 2012-08-10 22:00:00 | 0 |
| 2012-08-10 23:00:00 | 0.26 |
| 2012-08-11 | 0 |
| 2012-08-11 01:00:00 | 0 |
| 2012-08-11 02:00:00 | 0.26 |
| 2012-08-11 03:00:00 | 0 |
| 2012-08-11 04:00:00 | 0.26 |
| 2012-08-11 05:00:00 | 0 |
| 2012-08-11 06:00:00 | 0.26 |
| 2012-08-11 07:00:00 | 0 |
| 2012-08-11 08:00:00 | 0 |
| 2012-08-11 09:00:00 | 0.26 |
| 2012-08-11 10:00:00 | 0 |
| 2012-08-11 11:00:00 | 0.26 |
| 2012-08-11 12:00:00 | 0 |
| 2012-08-11 13:00:00 | 0 |
| 2012-08-11 14:00:00 | 0.26 |
| 2012-08-11 15:00:00 | 0 |
| 2012-08-11 16:00:00 | 0 |
| 2012-08-11 17:00:00 | 0.26 |
| 2012-08-11 18:00:00 | 0 |
| 2012-08-11 19:00:00 | 0.26 |
| 2012-08-11 20:00:00 | 0 |
| 2012-08-11 21:00:00 | 0 |
| 2012-08-11 22:00:00 | 0.26 |
| 2012-08-11 23:00:00 | 0 |
| 2012-08-12 | 0.26 |
| 2012-08-12 01:00:00 | 0 |
| 2012-08-12 02:00:00 | 0.26 |
| 2012-08-12 03:00:00 | 0 |
| 2012-08-12 04:00:00 | 0.26 |
| 2012-08-12 05:00:00 | 0 |
| 2012-08-12 06:00:00 | 0 |
| 2012-08-12 07:00:00 | 0.26 |
| 2012-08-12 08:00:00 | 0 |
| 2012-08-12 09:00:00 | 0.26 |
| 2012-08-12 10:00:00 | 0 |
| 2012-08-12 11:00:00 | 0 |
| 2012-08-12 12:00:00 | 0.26 |
| 2012-08-12 13:00:00 | 0 |
| 2012-08-12 14:00:00 | 0 |
| 2012-08-12 15:00:00 | 0.26 |
| 2012-08-12 16:00:00 | 0 |
| 2012-08-12 17:00:00 | 0.26 |
| 2012-08-12 18:00:00 | 0 |
| 2012-08-12 19:00:00 | 0 |
| 2012-08-12 20:00:00 | 0.26 |
| 2012-08-12 21:00:00 | 0 |
| 2012-08-12 22:00:00 | 0.26 |
| 2012-08-12 23:00:00 | 0 |
| 2012-08-13 | 0 |
| 2012-08-13 01:00:00 | 0.26 |
| 2012-08-13 02:00:00 | 0 |
| 2012-08-13 03:00:00 | 0.26 |
| 2012-08-13 04:00:00 | 0 |
| 2012-08-13 05:00:00 | 0.26 |
| 2012-08-13 06:00:00 | 0 |
| 2012-08-13 07:00:00 | 0.26 |
| 2012-08-13 08:00:00 | 0 |
| 2012-08-13 09:00:00 | 0 |
| 2012-08-13 10:00:00 | 0.26 |
| 2012-08-13 11:00:00 | 0 |
| 2012-08-13 12:00:00 | 0 |
| 2012-08-13 13:00:00 | 0.26 |
| 2012-08-13 14:00:00 | 0 |
| 2012-08-13 15:00:00 | 0.26 |
| 2012-08-13 16:00:00 | 0 |
| 2012-08-13 17:00:00 | 0 |
| 2012-08-13 18:00:00 | 0.26 |
| 2012-08-13 19:00:00 | 0 |
| 2012-08-13 20:00:00 | 0 |
| 2012-08-13 21:00:00 | 0.26 |
| 2012-08-13 22:00:00 | 0 |
| 2012-08-13 23:00:00 | 0.26 |
| 2012-08-14 | 0 |
| 2012-08-14 01:00:00 | 0.26 |
| 2012-08-14 02:00:00 | 0 |
| 2012-08-14 03:00:00 | 0.26 |
| 2012-08-14 04:00:00 | 0 |
| 2012-08-14 05:00:00 | 0 |
| 2012-08-14 06:00:00 | 0.26 |
| 2012-08-14 07:00:00 | 0 |
| 2012-08-14 08:00:00 | 0.26 |
| 2012-08-14 09:00:00 | 0 |
| 2012-08-14 10:00:00 | 0 |
| 2012-08-14 11:00:00 | 0.26 |
| 2012-08-14 12:00:00 | 0 |
| 2012-08-14 13:00:00 | 0.26 |
| 2012-08-14 14:00:00 | 0 |
| 2012-08-14 15:00:00 | 0 |
| 2012-08-14 16:00:00 | 0.26 |
| 2012-08-14 17:00:00 | 0 |
| 2012-08-14 18:00:00 | 0 |
| 2012-08-14 19:00:00 | 0.26 |
| 2012-08-14 20:00:00 | 0 |
| 2012-08-14 21:00:00 | 0.26 |
| 2012-08-14 22:00:00 | 0 |
| 2012-08-14 23:00:00 | 0.26 |
| 2012-08-15 | 0 |
| 2012-08-15 01:00:00 | 0 |
| 2012-08-15 02:00:00 | 0.26 |
| 2012-08-15 03:00:00 | 0 |
| 2012-08-15 04:00:00 | 0.26 |
| 2012-08-15 05:00:00 | 0 |
| 2012-08-15 06:00:00 | 0.26 |
| 2012-08-15 07:00:00 | 0 |
| 2012-08-15 08:00:00 | 0 |
| 2012-08-15 09:00:00 | 0.26 |
| 2012-08-15 10:00:00 | 0 |
| 2012-08-15 11:00:00 | 0.26 |
| 2012-08-15 12:00:00 | 0 |
| 2012-08-15 13:00:00 | 0 |
| 2012-08-15 14:00:00 | 0.26 |
| 2012-08-15 15:00:00 | 0 |
| 2012-08-15 16:00:00 | 0 |
| 2012-08-15 17:00:00 | 0.26 |
| 2012-08-15 18:00:00 | 0 |
| 2012-08-15 19:00:00 | 0.26 |
| 2012-08-15 20:00:00 | 0 |
| 2012-08-15 21:00:00 | 0 |
| 2012-08-15 22:00:00 | 0.26 |
| 2012-08-15 23:00:00 | 0 |
| 2012-08-16 | 0.26 |
| 2012-08-16 01:00:00 | 0 |
| 2012-08-16 02:00:00 | 0.26 |
| 2012-08-16 03:00:00 | 0 |
| 2012-08-16 04:00:00 | 0.26 |
| 2012-08-16 05:00:00 | 0 |
| 2012-08-16 06:00:00 | 0 |
| 2012-08-16 07:00:00 | 0.26 |
| 2012-08-16 08:00:00 | 0 |
| 2012-08-16 09:00:00 | 0.26 |
| 2012-08-16 10:00:00 | 0 |
| 2012-08-16 11:00:00 | 0 |
| 2012-08-16 12:00:00 | 0.26 |
| 2012-08-16 13:00:00 | 0 |
| 2012-08-16 14:00:00 | 0.52 |
| 2012-08-16 15:00:00 | 0.26 |
| 2012-08-16 16:00:00 | 0 |
| 2012-08-16 17:00:00 | 0 |
| 2012-08-16 18:00:00 | 0.26 |
| 2012-08-16 19:00:00 | 0 |
| 2012-08-16 20:00:00 | 0.26 |
| 2012-08-16 21:00:00 | 0 |
| 2012-08-16 22:00:00 | 0 |
| 2012-08-16 23:00:00 | 0.26 |
| 2012-08-17 | 0 |
| 2012-08-17 01:00:00 | 0.26 |
| 2012-08-17 02:00:00 | 0 |
| 2012-08-17 03:00:00 | 0.26 |
| 2012-08-17 04:00:00 | 0 |
| 2012-08-17 05:00:00 | 0.26 |
| 2012-08-17 06:00:00 | 0 |
| 2012-08-17 07:00:00 | 0 |
| 2012-08-17 08:00:00 | 0.26 |
| 2012-08-17 09:00:00 | 0 |
| 2012-08-17 10:00:00 | 0.26 |
| 2012-08-17 11:00:00 | 0 |
| 2012-08-17 12:00:00 | 0 |
| 2012-08-17 13:00:00 | 0.26 |
| 2012-08-17 14:00:00 | 0 |
| 2012-08-17 15:00:00 | 0 |
| 2012-08-17 16:00:00 | 0.26 |
| 2012-08-17 17:00:00 | 0 |
| 2012-08-17 18:00:00 | 0.26 |
| 2012-08-17 19:00:00 | 0 |
| 2012-08-17 20:00:00 | 0 |
| 2012-08-17 21:00:00 | 0.26 |
| 2012-08-17 22:00:00 | 0 |
| 2012-08-17 23:00:00 | 0.26 |
| 2012-08-18 | 0 |
| 2012-08-18 01:00:00 | 0.26 |
| 2012-08-18 02:00:00 | 0 |
| 2012-08-18 03:00:00 | 0 |
| 2012-08-18 04:00:00 | 0.26 |
| 2012-08-18 05:00:00 | 0 |
| 2012-08-18 06:00:00 | 0.26 |
| 2012-08-18 07:00:00 | 0 |
| 2012-08-18 08:00:00 | 0 |
| 2012-08-18 09:00:00 | 0.26 |
| 2012-08-18 10:00:00 | 0 |
| 2012-08-18 11:00:00 | 0.26 |
| 2012-08-18 12:00:00 | 0 |
| 2012-08-18 13:00:00 | 0 |
| 2012-08-18 14:00:00 | 0.26 |
| 2012-08-18 15:00:00 | 0 |
| 2012-08-18 16:00:00 | 0 |
| 2012-08-18 17:00:00 | 0.26 |
| 2012-08-18 18:00:00 | 0 |
| 2012-08-18 19:00:00 | 0.26 |
| 2012-08-18 20:00:00 | 0 |
| 2012-08-18 21:00:00 | 0 |
| 2012-08-18 22:00:00 | 0.26 |
| 2012-08-18 23:00:00 | 0 |
| 2012-08-19 | 0.26 |
| 2012-08-19 01:00:00 | 0 |
| 2012-08-19 02:00:00 | 0.26 |
| 2012-08-19 03:00:00 | 0 |
| 2012-08-19 04:00:00 | 0 |
| 2012-08-19 05:00:00 | 0.26 |
| 2012-08-19 06:00:00 | 0 |
| 2012-08-19 07:00:00 | 0.26 |
| 2012-08-19 08:00:00 | 0 |
| 2012-08-19 09:00:00 | 0 |
| 2012-08-19 10:00:00 | 0.26 |
| 2012-08-19 11:00:00 | 0 |
| 2012-08-19 12:00:00 | 0.26 |
| 2012-08-19 13:00:00 | 0 |
| 2012-08-19 14:00:00 | 0 |
| 2012-08-19 15:00:00 | 0.26 |
| 2012-08-19 16:00:00 | 0 |
| 2012-08-19 17:00:00 | 0 |
| 2012-08-19 18:00:00 | 0.26 |
| 2012-08-19 19:00:00 | 0 |
| 2012-08-19 20:00:00 | 0.26 |
| 2012-08-19 21:00:00 | 0 |
| 2012-08-19 22:00:00 | 0 |
| 2012-08-19 23:00:00 | 0.26 |
| 2012-08-20 | 0 |
| 2012-08-20 01:00:00 | 0.26 |
| 2012-08-20 02:00:00 | 0 |
| 2012-08-20 03:00:00 | 0.26 |
| 2012-08-20 04:00:00 | 0 |
| 2012-08-20 05:00:00 | 0.26 |
| 2012-08-20 06:00:00 | 0 |
| 2012-08-20 07:00:00 | 0 |
| 2012-08-20 08:00:00 | 0.26 |
| 2012-08-20 09:00:00 | 0 |
| 2012-08-20 10:00:00 | 0 |
| 2012-08-20 11:00:00 | 0.26 |
| 2012-08-20 12:00:00 | 0 |
| 2012-08-20 13:00:00 | 0.26 |
| 2012-08-20 14:00:00 | 0 |
| 2012-08-20 15:00:00 | 0 |
| 2012-08-20 16:00:00 | 0.26 |
| 2012-08-20 17:00:00 | 0 |
| 2012-08-20 18:00:00 | 0 |
| 2012-08-20 19:00:00 | 0.26 |
| 2012-08-20 20:00:00 | 0 |
| 2012-08-20 21:00:00 | 0.26 |
| 2012-08-20 22:00:00 | 0 |
| 2012-08-20 23:00:00 | 0.26 |
| 2012-08-21 | 0 |
| 2012-08-21 01:00:00 | 0 |
| 2012-08-21 02:00:00 | 0.26 |
| 2012-08-21 03:00:00 | 0 |
| 2012-08-21 04:00:00 | 0.26 |
| 2012-08-21 05:00:00 | 0 |
| 2012-08-21 06:00:00 | 0.26 |
| 2012-08-21 07:00:00 | 0 |
| 2012-08-21 08:00:00 | 0 |
| 2012-08-21 09:00:00 | 0.26 |
| 2012-08-21 10:00:00 | 0 |
| 2012-08-21 11:00:00 | 0.26 |
| 2012-08-21 12:00:00 | 0 |
| 2012-08-21 13:00:00 | 0 |
| 2012-08-21 14:00:00 | 0.26 |
| 2012-08-21 15:00:00 | 0 |
| 2012-08-21 16:00:00 | 0 |
| 2012-08-21 17:00:00 | 0.26 |
| 2012-08-21 18:00:00 | 0 |
| 2012-08-21 19:00:00 | 0.26 |
| 2012-08-21 20:00:00 | 0 |
| 2012-08-21 21:00:00 | 0 |
| 2012-08-21 22:00:00 | 0.26 |
| 2012-08-21 23:00:00 | 0 |
| 2012-08-22 | 0.26 |
| 2012-08-22 01:00:00 | 0 |
| 2012-08-22 02:00:00 | 0.26 |
| 2012-08-22 03:00:00 | 0 |
| 2012-08-22 04:00:00 | 0.26 |
| 2012-08-22 05:00:00 | 0 |
| 2012-08-22 06:00:00 | 0 |
| 2012-08-22 07:00:00 | 0.26 |
| 2012-08-22 08:00:00 | 0 |
| 2012-08-22 09:00:00 | 0.26 |
| 2012-08-22 10:00:00 | 0 |
| 2012-08-22 11:00:00 | 0 |
| 2012-08-22 12:00:00 | 0.26 |
| 2012-08-22 13:00:00 | 0 |
| 2012-08-22 14:00:00 | 0 |
| 2012-08-22 15:00:00 | 0.26 |
| 2012-08-22 16:00:00 | 0 |
| 2012-08-22 17:00:00 | 0.26 |
| 2012-08-22 18:00:00 | 0 |
| 2012-08-22 19:00:00 | 0 |
| 2012-08-22 20:00:00 | 0.26 |
| 2012-08-22 21:00:00 | 0 |
| 2012-08-22 22:00:00 | 0.26 |
| 2012-08-22 23:00:00 | 0 |
| 2012-08-23 | 0 |
| 2012-08-23 01:00:00 | 0.26 |
| 2012-08-23 02:00:00 | 0 |
| 2012-08-23 03:00:00 | 0.26 |
| 2012-08-23 04:00:00 | 0 |
| 2012-08-23 05:00:00 | 0.26 |
| 2012-08-23 06:00:00 | 0 |
| 2012-08-23 07:00:00 | 0.26 |
| 2012-08-23 08:00:00 | 0 |
| 2012-08-23 09:00:00 | 0 |
| 2012-08-23 10:00:00 | 0.26 |
| 2012-08-23 11:00:00 | 0 |
| 2012-08-23 12:00:00 | 0 |
| 2012-08-23 13:00:00 | 0.26 |
| 2012-08-23 14:00:00 | 0 |
| 2012-08-23 15:00:00 | 0.26 |
| 2012-08-23 16:00:00 | 0 |
| 2012-08-23 17:00:00 | 0 |
| 2012-08-23 18:00:00 | 0.26 |
| 2012-08-23 19:00:00 | 0 |
| 2012-08-23 20:00:00 | 0 |
| 2012-08-23 21:00:00 | 0.26 |
| 2012-08-23 22:00:00 | 0 |
| 2012-08-23 23:00:00 | 0.26 |
| 2012-08-24 | 0 |
| 2012-08-24 01:00:00 | 0.26 |
| 2012-08-24 02:00:00 | 0 |
| 2012-08-24 03:00:00 | 0.26 |
| 2012-08-24 04:00:00 | 0 |
| 2012-08-24 05:00:00 | 0 |
| 2012-08-24 06:00:00 | 0.26 |
| 2012-08-24 07:00:00 | 0 |
| 2012-08-24 08:00:00 | 0.26 |
| 2012-08-24 09:00:00 | 0 |
| 2012-08-24 10:00:00 | 0.26 |
| 2012-08-24 11:00:00 | 0 |
| 2012-08-24 12:00:00 | 0 |
| 2012-08-24 13:00:00 | 0.26 |
| 2012-08-24 14:00:00 | 0 |
| 2012-08-24 15:00:00 | 0.26 |
| 2012-08-24 16:00:00 | 0 |
| 2012-08-24 17:00:00 | 0 |
| 2012-08-24 18:00:00 | 0.26 |
| 2012-08-24 19:00:00 | 0 |
| 2012-08-24 20:00:00 | 0.26 |
| 2012-08-24 21:00:00 | 0 |
| 2012-08-24 22:00:00 | 0 |
| 2012-08-24 23:00:00 | 0.26 |
| 2012-08-25 | 0 |
| 2012-08-25 01:00:00 | 0.26 |
| 2012-08-25 02:00:00 | 0 |
| 2012-08-25 03:00:00 | 0.26 |
| 2012-08-25 04:00:00 | 0 |
| 2012-08-25 05:00:00 | 0.26 |
| 2012-08-25 06:00:00 | 0 |
| 2012-08-25 07:00:00 | 0 |
| 2012-08-25 08:00:00 | 0.26 |
| 2012-08-25 09:00:00 | 0 |
| 2012-08-25 10:00:00 | 0.26 |
| 2012-08-25 11:00:00 | 0 |
| 2012-08-25 12:00:00 | 0 |
| 2012-08-25 13:00:00 | 0.26 |
| 2012-08-25 14:00:00 | 0 |
| 2012-08-25 15:00:00 | 0 |
| 2012-08-25 16:00:00 | 0.26 |
| 2012-08-25 17:00:00 | 0 |
| 2012-08-25 18:00:00 | 0.26 |
| 2012-08-25 19:00:00 | 0 |
| 2012-08-25 20:00:00 | 0 |
| 2012-08-25 21:00:00 | 0.26 |
| 2012-08-25 22:00:00 | 0 |
| 2012-08-25 23:00:00 | 0.26 |
| 2012-08-26 | 0 |
| 2012-08-26 01:00:00 | 0.26 |
| 2012-08-26 02:00:00 | 0 |
| 2012-08-26 03:00:00 | 0 |
| 2012-08-26 04:00:00 | 0.26 |
| 2012-08-26 05:00:00 | 0 |
| 2012-08-26 06:00:00 | 0.26 |
| 2012-08-26 07:00:00 | 0 |
| 2012-08-26 08:00:00 | 0.26 |
| 2012-08-26 09:00:00 | 0 |
| 2012-08-26 10:00:00 | 0 |
| 2012-08-26 11:00:00 | 0.26 |
| 2012-08-26 12:00:00 | 0 |
| 2012-08-26 13:00:00 | 0 |
| 2012-08-26 14:00:00 | 0.26 |
| 2012-08-26 15:00:00 | 0 |
| 2012-08-26 16:00:00 | 0.26 |
| 2012-08-26 17:00:00 | 0 |
| 2012-08-26 18:00:00 | 0 |
| 2012-08-26 19:00:00 | 0.26 |
| 2012-08-26 20:00:00 | 0 |
| 2012-08-26 21:00:00 | 0.26 |
| 2012-08-26 22:00:00 | 0 |
| 2012-08-26 23:00:00 | 0 |
| 2012-08-27 | 0.26 |
| 2012-08-27 01:00:00 | 0 |
| 2012-08-27 02:00:00 | 0.26 |
| 2012-08-27 03:00:00 | 0 |
| 2012-08-27 04:00:00 | 0.26 |
| 2012-08-27 05:00:00 | 0 |
| 2012-08-27 06:00:00 | 0.26 |
| 2012-08-27 07:00:00 | 0 |
| 2012-08-27 08:00:00 | 0 |
| 2012-08-27 09:00:00 | 0.26 |
| 2012-08-27 10:00:00 | 0 |
| 2012-08-27 11:00:00 | 0.26 |
| 2012-08-27 12:00:00 | 0 |
| 2012-08-27 13:00:00 | 0 |
| 2012-08-27 14:00:00 | 0.26 |
| 2012-08-27 15:00:00 | 0 |
| 2012-08-27 16:00:00 | 0 |
| 2012-08-27 17:00:00 | 0.26 |
| 2012-08-27 18:00:00 | 0 |
| 2012-08-27 19:00:00 | 0.26 |
| 2012-08-27 20:00:00 | 0 |
| 2012-08-27 21:00:00 | 0 |
| 2012-08-27 22:00:00 | 0.26 |
| 2012-08-27 23:00:00 | 0 |
| 2012-08-28 | 0.26 |
| 2012-08-28 01:00:00 | 0 |
| 2012-08-28 02:00:00 | 0.26 |
| 2012-08-28 03:00:00 | 0 |
| 2012-08-28 04:00:00 | 0.26 |
| 2012-08-28 05:00:00 | 0 |
| 2012-08-28 06:00:00 | 0 |
| 2012-08-28 07:00:00 | 0.26 |
| 2012-08-28 08:00:00 | 0 |
| 2012-08-28 09:00:00 | 0.26 |
| 2012-08-28 10:00:00 | 0 |
| 2012-08-28 11:00:00 | 0 |
| 2012-08-28 12:00:00 | 0.26 |
| 2012-08-28 13:00:00 | 0 |
| 2012-08-28 14:00:00 | 0 |
| 2012-08-28 15:00:00 | 0.26 |
| 2012-08-28 16:00:00 | 0 |
| 2012-08-28 17:00:00 | 0.26 |
| 2012-08-28 18:00:00 | 0 |
| 2012-08-28 19:00:00 | 0 |
| 2012-08-28 20:00:00 | 0.26 |
| 2012-08-28 21:00:00 | 0 |
| 2012-08-28 22:00:00 | 0.26 |
| 2012-08-28 23:00:00 | 0 |
| 2012-08-29 | 0.26 |
| 2012-08-29 01:00:00 | 0 |
| 2012-08-29 02:00:00 | 0 |
| 2012-08-29 03:00:00 | 0.26 |
| 2012-08-29 04:00:00 | 0 |
| 2012-08-29 05:00:00 | 0.26 |
| 2012-08-29 06:00:00 | 0 |
| 2012-08-29 07:00:00 | 0.26 |
| 2012-08-29 08:00:00 | 0 |
| 2012-08-29 09:00:00 | 0 |
| 2012-08-29 10:00:00 | 0.26 |
| 2012-08-29 11:00:00 | 0 |
| 2012-08-29 12:00:00 | 0.26 |
| 2012-08-29 13:00:00 | 0 |
| 2012-08-29 14:00:00 | 0 |
| 2012-08-29 15:00:00 | 0.26 |
| 2012-08-29 16:00:00 | 0 |
| 2012-08-29 17:00:00 | 0.26 |
| 2012-08-29 18:00:00 | 0 |
| 2012-08-29 19:00:00 | 0 |
| 2012-08-29 20:00:00 | 0.26 |
| 2012-08-29 21:00:00 | 0 |
| 2012-08-29 22:00:00 | 0.26 |
| 2012-08-29 23:00:00 | 0 |
| 2012-08-30 | 0.26 |
| 2012-08-30 01:00:00 | 0 |
| 2012-08-30 02:00:00 | 0 |
| 2012-08-30 03:00:00 | 0.26 |
| 2012-08-30 04:00:00 | 0 |
| 2012-08-30 05:00:00 | 0.26 |
| 2012-08-30 06:00:00 | 0 |
| 2012-08-30 07:00:00 | 0.26 |
| 2012-08-30 08:00:00 | 0 |
| 2012-08-30 09:00:00 | 0 |
| 2012-08-30 10:00:00 | 0.26 |
| 2012-08-30 11:00:00 | 0 |
| 2012-08-30 12:00:00 | 0 |
| 2012-08-30 13:00:00 | 0.26 |
| 2012-08-30 14:00:00 | 0 |
| 2012-08-30 15:00:00 | 0.26 |
| 2012-08-30 16:00:00 | 0 |
| 2012-08-30 17:00:00 | 0 |
| 2012-08-30 18:00:00 | 0.26 |
| 2012-08-30 19:00:00 | 0 |
| 2012-08-30 20:00:00 | 0.26 |
| 2012-08-30 21:00:00 | 0 |
| 2012-08-30 22:00:00 | 0 |
| 2012-08-30 23:00:00 | 0.26 |
| 2012-08-31 | 0 |
| 2012-08-31 01:00:00 | 0.26 |
| 2012-08-31 02:00:00 | 0 |
| 2012-08-31 03:00:00 | 0.26 |
| 2012-08-31 04:00:00 | 0 |
| 2012-08-31 05:00:00 | 0.26 |
| 2012-08-31 06:00:00 | 0 |
| 2012-08-31 07:00:00 | 0 |
| 2012-08-31 08:00:00 | 0.26 |
| 2012-08-31 09:00:00 | 0 |
| 2012-08-31 10:00:00 | 0.26 |
| 2012-08-31 11:00:00 | 0 |
| 2012-08-31 12:00:00 | 0 |
| 2012-08-31 13:00:00 | 0.26 |
| 2012-08-31 14:00:00 | 0 |
| 2012-08-31 15:00:00 | 0 |
| 2012-08-31 16:00:00 | 0.26 |
| 2012-08-31 17:00:00 | 0 |
| 2012-08-31 18:00:00 | 0.26 |
| 2012-08-31 19:00:00 | 0 |
| 2012-08-31 20:00:00 | 0 |
| 2012-08-31 21:00:00 | 0.26 |
| 2012-08-31 22:00:00 | 0 |
| 2012-08-31 23:00:00 | 0.26 |
| 2012-09-01 | 0 |
| 2012-09-01 01:00:00 | 0.26 |
| 2012-09-01 02:00:00 | 0 |
| 2012-09-01 03:00:00 | 0.26 |
| 2012-09-01 04:00:00 | 0 |
| 2012-09-01 05:00:00 | 0.26 |
| 2012-09-01 06:00:00 | 0 |
| 2012-09-01 07:00:00 | 0 |
| 2012-09-01 08:00:00 | 0.26 |
| 2012-09-01 09:00:00 | 0 |
| 2012-09-01 10:00:00 | 0.26 |
| 2012-09-01 11:00:00 | 0 |
| 2012-09-01 12:00:00 | 0 |
| 2012-09-01 13:00:00 | 0.26 |
| 2012-09-01 14:00:00 | 0 |
| 2012-09-01 15:00:00 | 0.26 |
| 2012-09-01 16:00:00 | 0 |
| 2012-09-01 17:00:00 | 0 |
| 2012-09-01 18:00:00 | 0.26 |
| 2012-09-01 19:00:00 | 0 |
| 2012-09-01 20:00:00 | 0 |
| 2012-09-01 21:00:00 | 0.26 |
| 2012-09-01 22:00:00 | 0 |
| 2012-09-01 23:00:00 | 0.26 |
| 2012-09-02 | 0 |
| 2012-09-02 01:00:00 | 0.26 |
| 2012-09-02 02:00:00 | 0 |
| 2012-09-02 03:00:00 | 0.26 |
| 2012-09-02 04:00:00 | 0 |
| 2012-09-02 05:00:00 | 0.26 |
| 2012-09-02 06:00:00 | 0 |
| 2012-09-02 07:00:00 | 0 |
| 2012-09-02 08:00:00 | 0.26 |
| 2012-09-02 09:00:00 | 0 |
| 2012-09-02 10:00:00 | 0.26 |
| 2012-09-02 11:00:00 | 0 |
| 2012-09-02 12:00:00 | 0 |
| 2012-09-02 13:00:00 | 0.26 |
| 2012-09-02 14:00:00 | 0 |
| 2012-09-02 15:00:00 | 0.26 |
| 2012-09-02 16:00:00 | 0 |
| 2012-09-02 17:00:00 | 0 |
| 2012-09-02 18:00:00 | 0.26 |
| 2012-09-02 19:00:00 | 0 |
| 2012-09-02 20:00:00 | 0 |
| 2012-09-02 21:00:00 | 0.26 |
| 2012-09-02 22:00:00 | 0 |
| 2012-09-02 23:00:00 | 0.26 |
| 2012-09-03 | 0 |
| 2012-09-03 01:00:00 | 0.26 |
| 2012-09-03 02:00:00 | 0 |
| 2012-09-03 03:00:00 | 0.26 |
| 2012-09-03 04:00:00 | 0 |
| 2012-09-03 05:00:00 | 0.26 |
| 2012-09-03 06:00:00 | 0 |
| 2012-09-03 07:00:00 | 0 |
| 2012-09-03 08:00:00 | 0.26 |
| 2012-09-03 09:00:00 | 0 |
| 2012-09-03 10:00:00 | 0.26 |
| 2012-09-03 11:00:00 | 0 |
| 2012-09-03 12:00:00 | 0 |
| 2012-09-03 13:00:00 | 0.26 |
| 2012-09-03 14:00:00 | 0 |
| 2012-09-03 15:00:00 | 0.26 |
| 2012-09-03 16:00:00 | 0 |
| 2012-09-03 17:00:00 | 0 |
| 2012-09-03 18:00:00 | 0.26 |
| 2012-09-03 19:00:00 | 0 |
| 2012-09-03 20:00:00 | 0 |
| 2012-09-03 21:00:00 | 0.26 |
| 2012-09-03 22:00:00 | 0 |
| 2012-09-03 23:00:00 | 0.26 |
| 2012-09-04 | 0 |
| 2012-09-04 01:00:00 | 0.26 |
| 2012-09-04 02:00:00 | 0 |
| 2012-09-04 03:00:00 | 0.26 |
| 2012-09-04 04:00:00 | 0 |
| 2012-09-04 05:00:00 | 0.26 |
| 2012-09-04 06:00:00 | 0 |
| 2012-09-04 07:00:00 | 0 |
| 2012-09-04 08:00:00 | 0.26 |
| 2012-09-04 09:00:00 | 0 |
| 2012-09-04 10:00:00 | 0.26 |
| 2012-09-04 11:00:00 | 0 |
| 2012-09-04 12:00:00 | 0 |
| 2012-09-04 13:00:00 | 0.26 |
| 2012-09-04 14:00:00 | 0 |
| 2012-09-04 15:00:00 | 0.26 |
| 2012-09-04 16:00:00 | 0 |
| 2012-09-04 17:00:00 | 0 |
| 2012-09-04 18:00:00 | 0.26 |
| 2012-09-04 19:00:00 | 0 |
| 2012-09-04 20:00:00 | 0 |
| 2012-09-04 21:00:00 | 0.26 |
| 2012-09-04 22:00:00 | 0 |
| 2012-09-04 23:00:00 | 0.26 |
| 2012-09-05 | 0 |
| 2012-09-05 01:00:00 | 0.26 |
| 2012-09-05 02:00:00 | 0 |
| 2012-09-05 03:00:00 | 0.26 |
| 2012-09-05 04:00:00 | 0 |
| 2012-09-05 05:00:00 | 0.26 |
| 2012-09-05 06:00:00 | 0 |
| 2012-09-05 07:00:00 | 0 |
| 2012-09-05 08:00:00 | 0.26 |
| 2012-09-05 09:00:00 | 0 |
| 2012-09-05 10:00:00 | 0.26 |
| 2012-09-05 11:00:00 | 0 |
| 2012-09-05 12:00:00 | 0 |
| 2012-09-05 13:00:00 | 0.26 |
| 2012-09-05 14:00:00 | 0 |
| 2012-09-05 15:00:00 | 0.26 |
| 2012-09-05 16:00:00 | 0 |
| 2012-09-05 17:00:00 | 0 |
| 2012-09-05 18:00:00 | 0.26 |
| 2012-09-05 19:00:00 | 0 |
| 2012-09-05 20:00:00 | 0 |
| 2012-09-05 21:00:00 | 0.26 |
| 2012-09-05 22:00:00 | 0 |
| 2012-09-05 23:00:00 | 0.26 |
| 2012-09-06 | 0 |
| 2012-09-06 01:00:00 | 0.26 |
| 2012-09-06 02:00:00 | 0 |
| 2012-09-06 03:00:00 | 0.26 |
| 2012-09-06 04:00:00 | 0 |
| 2012-09-06 05:00:00 | 0.26 |
| 2012-09-06 06:00:00 | 0 |
| 2012-09-06 07:00:00 | 0 |
| 2012-09-06 08:00:00 | 0.26 |
| 2012-09-06 09:00:00 | 0 |
| 2012-09-06 10:00:00 | 1.3 |
| 2012-09-06 11:00:00 | 0.26 |
| 2012-09-06 12:00:00 | 0 |
| 2012-09-06 13:00:00 | 0 |
| 2012-09-06 14:00:00 | 0.26 |
| 2012-09-06 15:00:00 | 0 |
| 2012-09-06 16:00:00 | 0.26 |
| 2012-09-06 17:00:00 | 0 |
| 2012-09-06 18:00:00 | 0 |
| 2012-09-06 19:00:00 | 0.26 |
| 2012-09-06 20:00:00 | 0 |
| 2012-09-06 21:00:00 | 0.26 |
| 2012-09-06 22:00:00 | 0 |
| 2012-09-06 23:00:00 | 0.26 |
| 2012-09-07 | 0 |
| 2012-09-07 01:00:00 | 0 |
| 2012-09-07 02:00:00 | 0.26 |
| 2012-09-07 03:00:00 | 0 |
| 2012-09-07 04:00:00 | 0.26 |
| 2012-09-07 05:00:00 | 0 |
| 2012-09-07 06:00:00 | 0.26 |
| 2012-09-07 07:00:00 | 0 |
| 2012-09-07 08:00:00 | 0.26 |
| 2012-09-07 09:00:00 | 0 |
| 2012-09-07 10:00:00 | 0 |
| 2012-09-07 11:00:00 | 0.26 |
| 2012-09-07 12:00:00 | 0 |
| 2012-09-07 13:00:00 | 0 |
| 2012-09-07 14:00:00 | 0.26 |
| 2012-09-07 15:00:00 | 0 |
| 2012-09-07 16:00:00 | 0.26 |
| 2012-09-07 17:00:00 | 0 |
| 2012-09-07 18:00:00 | 0 |
| 2012-09-07 19:00:00 | 0.26 |
| 2012-09-07 20:00:00 | 0 |
| 2012-09-07 21:00:00 | 0.26 |
| 2012-09-07 22:00:00 | 0 |
| 2012-09-07 23:00:00 | 0.26 |
| 2012-09-08 | 0 |
| 2012-09-08 01:00:00 | 0 |
| 2012-09-08 02:00:00 | 0.26 |
| 2012-09-08 03:00:00 | 0 |
| 2012-09-08 04:00:00 | 0.26 |
| 2012-09-08 05:00:00 | 0 |
| 2012-09-08 06:00:00 | 0.26 |
| 2012-09-08 07:00:00 | 0 |
| 2012-09-08 08:00:00 | 0.26 |
| 2012-09-08 09:00:00 | 0 |
| 2012-09-08 10:00:00 | 0 |
| 2012-09-08 11:00:00 | 0.26 |
| 2012-09-08 12:00:00 | 0 |
| 2012-09-08 13:00:00 | 0 |
| 2012-09-08 14:00:00 | 0.26 |
| 2012-09-08 15:00:00 | 0 |
| 2012-09-08 16:00:00 | 0.26 |
| 2012-09-08 17:00:00 | 0 |
| 2012-09-08 18:00:00 | 0 |
| 2012-09-08 19:00:00 | 0.26 |
| 2012-09-08 20:00:00 | 0 |
| 2012-09-08 21:00:00 | 0.26 |
| 2012-09-08 22:00:00 | 0 |
| 2012-09-08 23:00:00 | 0.26 |
| 2012-09-09 | 0 |
| 2012-09-09 01:00:00 | 0 |
| 2012-09-09 02:00:00 | 0.26 |
| 2012-09-09 03:00:00 | 0 |
| 2012-09-09 04:00:00 | 0.26 |
| 2012-09-09 05:00:00 | 0 |
| 2012-09-09 06:00:00 | 0.26 |
| 2012-09-09 07:00:00 | 0 |
| 2012-09-09 08:00:00 | 0.26 |
| 2012-09-09 09:00:00 | 0 |
| 2012-09-09 10:00:00 | 0 |
| 2012-09-09 11:00:00 | 0.26 |
| 2012-09-09 12:00:00 | 0 |
| 2012-09-09 13:00:00 | 0 |
| 2012-09-09 14:00:00 | 0.26 |
| 2012-09-09 15:00:00 | 0 |
| 2012-09-09 16:00:00 | 0.26 |
| 2012-09-09 17:00:00 | 0 |
| 2012-09-09 18:00:00 | 0 |
| 2012-09-09 19:00:00 | 0.26 |
| 2012-09-09 20:00:00 | 0 |
| 2012-09-09 21:00:00 | 0.26 |
| 2012-09-09 22:00:00 | 0 |
| 2012-09-09 23:00:00 | 0 |
| 2012-09-10 | 0.26 |
| 2012-09-10 01:00:00 | 0 |
| 2012-09-10 02:00:00 | 0.26 |
| 2012-09-10 03:00:00 | 0 |
| 2012-09-10 04:00:00 | 0.26 |
| 2012-09-10 05:00:00 | 0 |
| 2012-09-10 06:00:00 | 0.26 |
| 2012-09-10 07:00:00 | 0 |
| 2012-09-10 08:00:00 | 0 |
| 2012-09-10 09:00:00 | 0.26 |
| 2012-09-10 10:00:00 | 0 |
| 2012-09-10 11:00:00 | 0.26 |
| 2012-09-10 12:00:00 | 0 |
| 2012-09-10 13:00:00 | 0 |
| 2012-09-10 14:00:00 | 0.26 |
| 2012-09-10 15:00:00 | 0 |
| 2012-09-10 16:00:00 | 0.26 |
| 2012-09-10 17:00:00 | 0 |
| 2012-09-10 18:00:00 | 0 |
| 2012-09-10 19:00:00 | 0.26 |
| 2012-09-10 20:00:00 | 0 |
| 2012-09-10 21:00:00 | 0.26 |
| 2012-09-10 22:00:00 | 0 |
| 2012-09-10 23:00:00 | 0 |
| 2012-09-11 | 0.26 |
| 2012-09-11 01:00:00 | 0 |
| 2012-09-11 02:00:00 | 0.26 |
| 2012-09-11 03:00:00 | 0 |
| 2012-09-11 04:00:00 | 0.26 |
| 2012-09-11 05:00:00 | 0 |
| 2012-09-11 06:00:00 | 0.26 |
| 2012-09-11 07:00:00 | 0 |
| 2012-09-11 08:00:00 | 0 |
| 2012-09-11 09:00:00 | 0.26 |
| 2012-09-11 10:00:00 | 0 |
| 2012-09-11 11:00:00 | 0.26 |
| 2012-09-11 12:00:00 | 0 |
| 2012-09-11 13:00:00 | 0 |
| 2012-09-11 14:00:00 | 0.26 |
| 2012-09-11 15:00:00 | 0 |
| 2012-09-11 16:00:00 | 0 |
| 2012-09-11 17:00:00 | 0.26 |
| 2012-09-11 18:00:00 | 0 |
| 2012-09-11 19:00:00 | 0.26 |
| 2012-09-11 20:00:00 | 0 |
| 2012-09-11 21:00:00 | 0.26 |
| 2012-09-11 22:00:00 | 0 |
| 2012-09-11 23:00:00 | 0 |
| 2012-09-12 | 0.26 |
| 2012-09-12 01:00:00 | 0 |
| 2012-09-12 02:00:00 | 0.26 |
| 2012-09-12 03:00:00 | 0 |
| 2012-09-12 04:00:00 | 0.26 |
| 2012-09-12 05:00:00 | 0 |
| 2012-09-12 06:00:00 | 0.26 |
| 2012-09-12 07:00:00 | 0 |
| 2012-09-12 08:00:00 | 0 |
| 2012-09-12 09:00:00 | 0.26 |
| 2012-09-12 10:00:00 | 0 |
| 2012-09-12 11:00:00 | 0.26 |
| 2012-09-12 12:00:00 | 0 |
| 2012-09-12 13:00:00 | 0 |
| 2012-09-12 14:00:00 | 0.26 |
| 2012-09-12 15:00:00 | 0 |
| 2012-09-12 16:00:00 | 0 |
| 2012-09-12 17:00:00 | 0.26 |
| 2012-09-12 18:00:00 | 0 |
| 2012-09-12 19:00:00 | 0.26 |
| 2012-09-12 20:00:00 | 0 |
| 2012-09-12 21:00:00 | 0.26 |
| 2012-09-12 22:00:00 | 0 |
| 2012-09-12 23:00:00 | 0 |
| 2012-09-13 | 0.26 |
| 2012-09-13 01:00:00 | 0 |
| 2012-09-13 02:00:00 | 0.26 |
| 2012-09-13 03:00:00 | 0 |
| 2012-09-13 04:00:00 | 0.26 |
| 2012-09-13 05:00:00 | 0 |
| 2012-09-13 06:00:00 | 0.26 |
| 2012-09-13 07:00:00 | 0 |
| 2012-09-13 08:00:00 | 0.26 |
| 2012-09-13 09:00:00 | 0 |
| 2012-09-13 10:00:00 | 0 |
| 2012-09-13 11:00:00 | 0.26 |
| 2012-09-13 12:00:00 | 0 |
| 2012-09-13 13:00:00 | 0 |
| 2012-09-13 14:00:00 | 0.26 |
| 2012-09-13 15:00:00 | 0 |
| 2012-09-13 16:00:00 | 0.26 |
| 2012-09-13 17:00:00 | 0 |
| 2012-09-13 18:00:00 | 0 |
| 2012-09-13 19:00:00 | 0.26 |
| 2012-09-13 20:00:00 | 0 |
| 2012-09-13 21:00:00 | 0.26 |
| 2012-09-13 22:00:00 | 0 |
| 2012-09-13 23:00:00 | 0.26 |
| 2012-09-14 | 0 |
| 2012-09-14 01:00:00 | 0.26 |
| 2012-09-14 02:00:00 | 0 |
| 2012-09-14 03:00:00 | 0 |
| 2012-09-14 04:00:00 | 0.26 |
| 2012-09-14 05:00:00 | 0 |
| 2012-09-14 06:00:00 | 0.26 |
| 2012-09-14 07:00:00 | 0 |
| 2012-09-14 08:00:00 | 0.26 |
| 2012-09-14 09:00:00 | 0 |
| 2012-09-14 10:00:00 | 0 |
| 2012-09-14 11:00:00 | 0.26 |
| 2012-09-14 12:00:00 | 0 |
| 2012-09-14 13:00:00 | 0.26 |
| 2012-09-14 14:00:00 | 0 |
| 2012-09-14 15:00:00 | 0 |
| 2012-09-14 16:00:00 | 0.26 |
| 2012-09-14 17:00:00 | 0 |
| 2012-09-14 18:00:00 | 0 |
| 2012-09-14 19:00:00 | 0.26 |
| 2012-09-14 20:00:00 | 0 |
| 2012-09-14 21:00:00 | 0.26 |
| 2012-09-14 22:00:00 | 0 |
| 2012-09-14 23:00:00 | 0.26 |
| 2012-09-15 | 0 |
| 2012-09-15 01:00:00 | 0.26 |
| 2012-09-15 02:00:00 | 0 |
| 2012-09-15 03:00:00 | 0 |
| 2012-09-15 04:00:00 | 0.26 |
| 2012-09-15 05:00:00 | 0 |
| 2012-09-15 06:00:00 | 0.26 |
| 2012-09-15 07:00:00 | 0 |
| 2012-09-15 08:00:00 | 0.26 |
| 2012-09-15 09:00:00 | 0 |
| 2012-09-15 10:00:00 | 0 |
| 2012-09-15 11:00:00 | 0.26 |
| 2012-09-15 12:00:00 | 0 |
| 2012-09-15 13:00:00 | 0 |
| 2012-09-15 14:00:00 | 0.26 |
| 2012-09-15 15:00:00 | 0 |
| 2012-09-15 16:00:00 | 0.26 |
| 2012-09-15 17:00:00 | 0 |
| 2012-09-15 18:00:00 | 0 |
| 2012-09-15 19:00:00 | 0.26 |
| 2012-09-15 20:00:00 | 0 |
| 2012-09-15 21:00:00 | 0.26 |
| 2012-09-15 22:00:00 | 0 |
| 2012-09-15 23:00:00 | 0.26 |
| 2012-09-16 | 0 |
| 2012-09-16 01:00:00 | 0 |
| 2012-09-16 02:00:00 | 0.26 |
| 2012-09-16 03:00:00 | 0 |
| 2012-09-16 04:00:00 | 0.26 |
| 2012-09-16 05:00:00 | 0 |
| 2012-09-16 06:00:00 | 0.26 |
| 2012-09-16 07:00:00 | 0 |
| 2012-09-16 08:00:00 | 0 |
| 2012-09-16 09:00:00 | 0.26 |
| 2012-09-16 10:00:00 | 0 |
| 2012-09-16 11:00:00 | 0.26 |
| 2012-09-16 12:00:00 | 0 |
| 2012-09-16 13:00:00 | 0 |
| 2012-09-16 14:00:00 | 0.26 |
| 2012-09-16 15:00:00 | 0 |
| 2012-09-16 16:00:00 | 0 |
| 2012-09-16 17:00:00 | 0.26 |
| 2012-09-16 18:00:00 | 0 |
| 2012-09-16 19:00:00 | 0.26 |
| 2012-09-16 20:00:00 | 0 |
| 2012-09-16 21:00:00 | 0 |
| 2012-09-16 22:00:00 | 0.26 |
| 2012-09-16 23:00:00 | 0 |
| 2012-09-17 | 0.26 |
| 2012-09-17 01:00:00 | 0 |
| 2012-09-17 02:00:00 | 0.26 |
| 2012-09-17 03:00:00 | 0 |
| 2012-09-17 04:00:00 | 0.26 |
| 2012-09-17 05:00:00 | 0 |
| 2012-09-17 06:00:00 | 0.26 |
| 2012-09-17 07:00:00 | 0 |
| 2012-09-17 08:00:00 | 0 |
| 2012-09-17 09:00:00 | 0.26 |
| 2012-09-17 10:00:00 | 0 |
| 2012-09-17 11:00:00 | 0 |
| 2012-09-17 12:00:00 | 0.26 |
| 2012-09-17 13:00:00 | 0 |
| 2012-09-17 14:00:00 | 0.26 |
| 2012-09-17 15:00:00 | 0 |
| 2012-09-17 16:00:00 | 0 |
| 2012-09-17 17:00:00 | 0.26 |
| 2012-09-17 18:00:00 | 0 |
| 2012-09-17 19:00:00 | 0 |
| 2012-09-17 20:00:00 | 0.26 |
| 2012-09-17 21:00:00 | 0 |
| 2012-09-17 22:00:00 | 0.26 |
| 2012-09-17 23:00:00 | 0 |
| 2012-09-18 | 0.26 |
| 2012-09-18 01:00:00 | 0 |
| 2012-09-18 02:00:00 | 0.26 |
| 2012-09-18 03:00:00 | 0 |
| 2012-09-18 04:00:00 | 0.26 |
| 2012-09-18 05:00:00 | 0 |
| 2012-09-18 06:00:00 | 0 |
| 2012-09-18 07:00:00 | 0.26 |
| 2012-09-18 08:00:00 | 0 |
| 2012-09-18 09:00:00 | 0.26 |
| 2012-09-18 10:00:00 | 0 |
| 2012-09-18 11:00:00 | 0 |
| 2012-09-18 12:00:00 | 0.26 |
| 2012-09-18 13:00:00 | 0 |
| 2012-09-18 14:00:00 | 0 |
| 2012-09-18 15:00:00 | 0.26 |
| 2012-09-18 16:00:00 | 0 |
| 2012-09-18 17:00:00 | 0.26 |
| 2012-09-18 18:00:00 | 0 |
| 2012-09-18 19:00:00 | 0 |
| 2012-09-18 20:00:00 | 0.26 |
| 2012-09-18 21:00:00 | 0 |
| 2012-09-18 22:00:00 | 0.26 |
| 2012-09-18 23:00:00 | 0 |
| 2012-09-19 | 0.26 |
| 2012-09-19 01:00:00 | 0 |
| 2012-09-19 02:00:00 | 0.26 |
| 2012-09-19 03:00:00 | 0 |
| 2012-09-19 04:00:00 | 0 |
| 2012-09-19 05:00:00 | 0.26 |
| 2012-09-19 06:00:00 | 0 |
| 2012-09-19 07:00:00 | 0.26 |
| 2012-09-19 08:00:00 | 0 |
| 2012-09-19 09:00:00 | 0.26 |
| 2012-09-19 10:00:00 | 0 |
| 2012-09-19 11:00:00 | 0 |
| 2012-09-19 12:00:00 | 0.26 |
| 2012-09-19 13:00:00 | 0 |
| 2012-09-19 14:00:00 | 0 |
| 2012-09-19 15:00:00 | 0.26 |
| 2012-09-19 16:00:00 | 0 |
| 2012-09-19 17:00:00 | 0.26 |
| 2012-09-19 18:00:00 | 0 |
| 2012-09-19 19:00:00 | 0 |
| 2012-09-19 20:00:00 | 0.26 |
| 2012-09-19 21:00:00 | 0 |
| 2012-09-19 22:00:00 | 0.26 |
| 2012-09-19 23:00:00 | 0 |
| 2012-09-20 | 0.26 |
| 2012-09-20 01:00:00 | 0 |
| 2012-09-20 02:00:00 | 0.26 |
| 2012-09-20 03:00:00 | 0 |
| 2012-09-20 04:00:00 | 0 |
| 2012-09-20 05:00:00 | 0.26 |
| 2012-09-20 06:00:00 | 0 |
| 2012-09-20 07:00:00 | 0.26 |
| 2012-09-20 08:00:00 | 0 |
| 2012-09-20 09:00:00 | 0.52 |
| 2012-09-20 10:00:00 | 0.26 |
| 2012-09-20 11:00:00 | 0 |
| 2012-09-20 12:00:00 | 0 |
| 2012-09-20 13:00:00 | 0.26 |
| 2012-09-20 14:00:00 | 0 |
| 2012-09-20 15:00:00 | 0.26 |
| 2012-09-20 16:00:00 | 0 |
| 2012-09-20 17:00:00 | 0 |
| 2012-09-20 18:00:00 | 0.26 |
| 2012-09-20 19:00:00 | 0 |
| 2012-09-20 20:00:00 | 0.26 |
| 2012-09-20 21:00:00 | 0 |
| 2012-09-20 22:00:00 | 0.26 |
| 2012-09-20 23:00:00 | 0 |
| 2012-09-21 | 0 |
| 2012-09-21 01:00:00 | 0.26 |
| 2012-09-21 02:00:00 | 0 |
| 2012-09-21 03:00:00 | 0.26 |
| 2012-09-21 04:00:00 | 0 |
| 2012-09-21 05:00:00 | 0.26 |
| 2012-09-21 06:00:00 | 0 |
| 2012-09-21 07:00:00 | 0.26 |
| 2012-09-21 08:00:00 | 0 |
| 2012-09-21 09:00:00 | 0 |
| 2012-09-21 10:00:00 | 0.26 |
| 2012-09-21 11:00:00 | 0 |
| 2012-09-21 12:00:00 | 0.26 |
| 2012-09-21 13:00:00 | 0 |
| 2012-09-21 14:00:00 | 0 |
| 2012-09-21 15:00:00 | 0.26 |
| 2012-09-21 16:00:00 | 0 |
| 2012-09-21 17:00:00 | 0 |
| 2012-09-21 18:00:00 | 0.26 |
| 2012-09-21 19:00:00 | 0 |
| 2012-09-21 20:00:00 | 0.26 |
| 2012-09-21 21:00:00 | 0 |
| 2012-09-21 22:00:00 | 0.26 |
| 2012-09-21 23:00:00 | 0 |
| 2012-09-22 | 0.26 |
| 2012-09-22 01:00:00 | 0 |
| 2012-09-22 02:00:00 | 0 |
| 2012-09-22 03:00:00 | 0.26 |
| 2012-09-22 04:00:00 | 0 |
| 2012-09-22 05:00:00 | 0.26 |
| 2012-09-22 06:00:00 | 0 |
| 2012-09-22 07:00:00 | 0.26 |
| 2012-09-22 08:00:00 | 0 |
| 2012-09-22 09:00:00 | 0 |
| 2012-09-22 10:00:00 | 0.26 |
| 2012-09-22 11:00:00 | 0 |
| 2012-09-22 12:00:00 | 0.26 |
| 2012-09-22 13:00:00 | 0 |
| 2012-09-22 14:00:00 | 0 |
| 2012-09-22 15:00:00 | 0.26 |
| 2012-09-22 16:00:00 | 0 |
| 2012-09-22 17:00:00 | 0.26 |
| 2012-09-22 18:00:00 | 0 |
| 2012-09-22 19:00:00 | 0 |
| 2012-09-22 20:00:00 | 0.26 |
| 2012-09-22 21:00:00 | 0 |
| 2012-09-22 22:00:00 | 0.26 |
| 2012-09-22 23:00:00 | 0 |
| 2012-09-23 | 0.26 |
| 2012-09-23 01:00:00 | 0 |
| 2012-09-23 02:00:00 | 0.26 |
| 2012-09-23 03:00:00 | 0 |
| 2012-09-23 04:00:00 | 0 |
| 2012-09-23 05:00:00 | 0.26 |
| 2012-09-23 06:00:00 | 0 |
| 2012-09-23 07:00:00 | 0.26 |
| 2012-09-23 08:00:00 | 0 |
| 2012-09-23 09:00:00 | 0.26 |
| 2012-09-23 10:00:00 | 0 |
| 2012-09-23 11:00:00 | 0 |
| 2012-09-23 12:00:00 | 0.26 |
| 2012-09-23 13:00:00 | 0 |
| 2012-09-23 14:00:00 | 0 |
| 2012-09-23 15:00:00 | 0.26 |
| 2012-09-23 16:00:00 | 0 |
| 2012-09-23 17:00:00 | 0.26 |
| 2012-09-23 18:00:00 | 0 |
| 2012-09-23 19:00:00 | 0 |
| 2012-09-23 20:00:00 | 0.26 |
| 2012-09-23 21:00:00 | 0 |
| 2012-09-23 22:00:00 | 0.26 |
| 2012-09-23 23:00:00 | 0 |
| 2012-09-24 | 0.26 |
| 2012-09-24 01:00:00 | 0 |
| 2012-09-24 02:00:00 | 0.26 |
| 2012-09-24 03:00:00 | 0 |
| 2012-09-24 04:00:00 | 0.26 |
| 2012-09-24 05:00:00 | 0 |
| 2012-09-24 06:00:00 | 0 |
| 2012-09-24 07:00:00 | 0.26 |
| 2012-09-24 08:00:00 | 0 |
| 2012-09-24 09:00:00 | 0.26 |
| 2012-09-24 10:00:00 | 0 |
| 2012-09-24 11:00:00 | 0 |
| 2012-09-24 12:00:00 | 0.26 |
| 2012-09-24 13:00:00 | 0 |
| 2012-09-24 14:00:00 | 0.26 |
| 2012-09-24 15:00:00 | 0 |
| 2012-09-24 16:00:00 | 0 |
| 2012-09-24 17:00:00 | 0.26 |
| 2012-09-24 18:00:00 | 0 |
| 2012-09-24 19:00:00 | 0.26 |
| 2012-09-24 20:00:00 | 0 |
| 2012-09-24 21:00:00 | 0 |
| 2012-09-24 22:00:00 | 0.26 |
| 2012-09-24 23:00:00 | 0 |
| 2012-09-25 | 0.26 |
| 2012-09-25 01:00:00 | 0 |
| 2012-09-25 02:00:00 | 0.26 |
| 2012-09-25 03:00:00 | 0 |
| 2012-09-25 04:00:00 | 0.26 |
| 2012-09-25 05:00:00 | 0 |
| 2012-09-25 06:00:00 | 0.26 |
| 2012-09-25 07:00:00 | 0 |
| 2012-09-25 08:00:00 | 0 |
| 2012-09-25 09:00:00 | 0.26 |
| 2012-09-25 10:00:00 | 0 |
| 2012-09-25 11:00:00 | 0.26 |
| 2012-09-25 12:00:00 | 0 |
| 2012-09-25 13:00:00 | 0 |
| 2012-09-25 14:00:00 | 0.26 |
| 2012-09-25 15:00:00 | 0 |
| 2012-09-25 16:00:00 | 0 |
| 2012-09-25 17:00:00 | 0.26 |
| 2012-09-25 18:00:00 | 0 |
| 2012-09-25 19:00:00 | 0.26 |
| 2012-09-25 20:00:00 | 0 |
| 2012-09-25 21:00:00 | 0.26 |
| 2012-09-25 22:00:00 | 0 |
| 2012-09-25 23:00:00 | 0 |
| 2012-09-26 | 0.26 |
| 2012-09-26 01:00:00 | 0 |
| 2012-09-26 02:00:00 | 0.26 |
| 2012-09-26 03:00:00 | 0 |
| 2012-09-26 04:00:00 | 0.26 |
| 2012-09-26 05:00:00 | 0 |
| 2012-09-26 06:00:00 | 0.26 |
| 2012-09-26 07:00:00 | 0 |
| 2012-09-26 08:00:00 | 0 |
| 2012-09-26 09:00:00 | 0.26 |
| 2012-09-26 10:00:00 | 0 |
| 2012-09-26 11:00:00 | 0.26 |
| 2012-09-26 12:00:00 | 0 |
| 2012-09-26 13:00:00 | 0 |
| 2012-09-26 14:00:00 | 0.26 |
| 2012-09-26 15:00:00 | 0 |
| 2012-09-26 16:00:00 | 0.26 |
| 2012-09-26 17:00:00 | 0 |
| 2012-09-26 18:00:00 | 0 |
| 2012-09-26 19:00:00 | 0.26 |
| 2012-09-26 20:00:00 | 0 |
| 2012-09-26 21:00:00 | 0.26 |
| 2012-09-26 22:00:00 | 0 |
| 2012-09-26 23:00:00 | 0 |
| 2012-09-27 | 0.26 |
| 2012-09-27 01:00:00 | 0 |
| 2012-09-27 02:00:00 | 0.26 |
| 2012-09-27 03:00:00 | 0 |
| 2012-09-27 04:00:00 | 0.26 |
| 2012-09-27 05:00:00 | 0 |
| 2012-09-27 06:00:00 | 0.26 |
| 2012-09-27 07:00:00 | 0 |
| 2012-09-27 08:00:00 | 0.26 |
| 2012-09-27 09:00:00 | 0 |
| 2012-09-27 10:00:00 | 0 |
| 2012-09-27 11:00:00 | 0.26 |
| 2012-09-27 12:00:00 | 0 |
| 2012-09-27 13:00:00 | 0 |
| 2012-09-27 14:00:00 | 0.26 |
| 2012-09-27 15:00:00 | 0 |
| 2012-09-27 16:00:00 | 0.26 |
| 2012-09-27 17:00:00 | 0 |
| 2012-09-27 18:00:00 | 0 |
| 2012-09-27 19:00:00 | 0.26 |
| 2012-09-27 20:00:00 | 0 |
| 2012-09-27 21:00:00 | 0.26 |
| 2012-09-27 22:00:00 | 0 |
| 2012-09-27 23:00:00 | 0.26 |
| 2012-09-28 | 0 |
| 2012-09-28 01:00:00 | 0 |
| 2012-09-28 02:00:00 | 0.26 |
| 2012-09-28 03:00:00 | 0 |
| 2012-09-28 04:00:00 | 0.26 |
| 2012-09-28 05:00:00 | 0 |
| 2012-09-28 06:00:00 | 0.26 |
| 2012-09-28 07:00:00 | 0 |
| 2012-09-28 08:00:00 | 0.26 |
| 2012-09-28 09:00:00 | 0 |
| 2012-09-28 10:00:00 | 0 |
| 2012-09-28 11:00:00 | 0.26 |
| 2012-09-28 12:00:00 | 0 |
| 2012-09-28 13:00:00 | 0 |
| 2012-09-28 14:00:00 | 0.26 |
| 2012-09-28 15:00:00 | 0 |
| 2012-09-28 16:00:00 | 0.26 |
| 2012-09-28 17:00:00 | 0 |
| 2012-09-28 18:00:00 | 0 |
| 2012-09-28 19:00:00 | 0.26 |
| 2012-09-28 20:00:00 | 0 |
| 2012-09-28 21:00:00 | 0.26 |
| 2012-09-28 22:00:00 | 0 |
| 2012-09-28 23:00:00 | 0.26 |
| 2012-09-29 | 0 |
| 2012-09-29 01:00:00 | 0 |
| 2012-09-29 02:00:00 | 0.26 |
| 2012-09-29 03:00:00 | 0 |
| 2012-09-29 04:00:00 | 0.26 |
| 2012-09-29 05:00:00 | 0 |
| 2012-09-29 06:00:00 | 0.26 |
| 2012-09-29 07:00:00 | 0 |
| 2012-09-29 08:00:00 | 0.26 |
| 2012-09-29 09:00:00 | 0 |
| 2012-09-29 10:00:00 | 0 |
| 2012-09-29 11:00:00 | 0.26 |
| 2012-09-29 12:00:00 | 0 |
| 2012-09-29 13:00:00 | 0 |
| 2012-09-29 14:00:00 | 0.26 |
| 2012-09-29 15:00:00 | 0 |
| 2012-09-29 16:00:00 | 0.26 |
| 2012-09-29 17:00:00 | 0 |
| 2012-09-29 18:00:00 | 0 |
| 2012-09-29 19:00:00 | 0.26 |
| 2012-09-29 20:00:00 | 0 |
| 2012-09-29 21:00:00 | 0.26 |
| 2012-09-29 22:00:00 | 0 |
| 2012-09-29 23:00:00 | 0.26 |
| 2012-09-30 | 0 |
| 2012-09-30 01:00:00 | 0.26 |
| 2012-09-30 02:00:00 | 0 |
| 2012-09-30 03:00:00 | 0 |
| 2012-09-30 04:00:00 | 0.26 |
| 2012-09-30 05:00:00 | 0 |
| 2012-09-30 06:00:00 | 0.26 |
| 2012-09-30 07:00:00 | 0 |
| 2012-09-30 08:00:00 | 0.26 |
| 2012-09-30 09:00:00 | 0 |
| 2012-09-30 10:00:00 | 0 |
| 2012-09-30 11:00:00 | 0.26 |
| 2012-09-30 12:00:00 | 0 |
| 2012-09-30 13:00:00 | 0.26 |
| 2012-09-30 14:00:00 | 0 |
| 2012-09-30 15:00:00 | 0 |
| 2012-09-30 16:00:00 | 0.26 |
| 2012-09-30 17:00:00 | 0 |
| 2012-09-30 18:00:00 | 0 |
| 2012-09-30 19:00:00 | 0.26 |
| 2012-09-30 20:00:00 | 0 |
| 2012-09-30 21:00:00 | 0.26 |
| 2012-09-30 22:00:00 | 0 |
| 2012-09-30 23:00:00 | 0.26 |
| 2012-10-01 | 0 |
| 2012-10-01 01:00:00 | 0.26 |
| 2012-10-01 02:00:00 | 0 |
| 2012-10-01 03:00:00 | 0.26 |
| 2012-10-01 04:00:00 | 0 |
| 2012-10-01 05:00:00 | 0 |
| 2012-10-01 06:00:00 | 0.26 |
| 2012-10-01 07:00:00 | 0 |
| 2012-10-01 08:00:00 | 0.26 |
| 2012-10-01 09:00:00 | 0 |
| 2012-10-01 10:00:00 | 0 |
| 2012-10-01 11:00:00 | 0.26 |
| 2012-10-01 12:00:00 | 0 |
| 2012-10-01 13:00:00 | 0.26 |
| 2012-10-01 14:00:00 | 0 |
| 2012-10-01 15:00:00 | 0 |
| 2012-10-01 16:00:00 | 0.26 |
| 2012-10-01 17:00:00 | 0 |
| 2012-10-01 18:00:00 | 0.26 |
| 2012-10-01 19:00:00 | 0 |
| 2012-10-01 20:00:00 | 0 |
| 2012-10-01 21:00:00 | 0.26 |
| 2012-10-01 22:00:00 | 0 |
| 2012-10-01 23:00:00 | 0.26 |
| 2012-10-02 | 0 |
| 2012-10-02 01:00:00 | 0.26 |
| 2012-10-02 02:00:00 | 0 |
| 2012-10-02 03:00:00 | 0.26 |
| 2012-10-02 04:00:00 | 0 |
| 2012-10-02 05:00:00 | 0.26 |
| 2012-10-02 06:00:00 | 0 |
| 2012-10-02 07:00:00 | 0 |
| 2012-10-02 08:00:00 | 0.26 |
| 2012-10-02 09:00:00 | 0 |
| 2012-10-02 10:00:00 | 0.26 |
| 2012-10-02 11:00:00 | 0 |
| 2012-10-02 12:00:00 | 0 |
| 2012-10-02 13:00:00 | 0.26 |
| 2012-10-02 14:00:00 | 0 |
| 2012-10-02 15:00:00 | 0 |
| 2012-10-02 16:00:00 | 0.26 |
| 2012-10-02 17:00:00 | 0 |
| 2012-10-02 18:00:00 | 0.26 |
| 2012-10-02 19:00:00 | 0 |
| 2012-10-02 20:00:00 | 0.26 |
| 2012-10-02 21:00:00 | 0 |
| 2012-10-02 22:00:00 | 0 |
| 2012-10-02 23:00:00 | 0.26 |
| 2012-10-03 | 0 |
| 2012-10-03 01:00:00 | 0.26 |
| 2012-10-03 02:00:00 | 0 |
| 2012-10-03 03:00:00 | 0.26 |
| 2012-10-03 04:00:00 | 0 |
| 2012-10-03 05:00:00 | 0.26 |
| 2012-10-03 06:00:00 | 0 |
| 2012-10-03 07:00:00 | 0.26 |
| 2012-10-03 08:00:00 | 0 |
| 2012-10-03 09:00:00 | 0 |
| 2012-10-03 10:00:00 | 0.26 |
| 2012-10-03 11:00:00 | 0 |
| 2012-10-03 12:00:00 | 0 |
| 2012-10-03 13:00:00 | 0.26 |
| 2012-10-03 14:00:00 | 0 |
| 2012-10-03 15:00:00 | 0.26 |
| 2012-10-03 16:00:00 | 0 |
| 2012-10-03 17:00:00 | 0 |
| 2012-10-03 18:00:00 | 0.26 |
| 2012-10-03 19:00:00 | 0 |
| 2012-10-03 20:00:00 | 0.26 |
| 2012-10-03 21:00:00 | 0 |
| 2012-10-03 22:00:00 | 0.26 |
| 2012-10-03 23:00:00 | 0 |
| 2012-10-04 | 0 |
| 2012-10-04 01:00:00 | 0.26 |
| 2012-10-04 02:00:00 | 0 |
| 2012-10-04 03:00:00 | 0.26 |
| 2012-10-04 04:00:00 | 0 |
| 2012-10-04 05:00:00 | 0.26 |
| 2012-10-04 06:00:00 | 0 |
| 2012-10-04 07:00:00 | 0.26 |
| 2012-10-04 08:00:00 | 0 |
| 2012-10-04 09:00:00 | 0 |
| 2012-10-04 10:00:00 | 0.26 |
| 2012-10-04 11:00:00 | 0 |
| 2012-10-04 12:00:00 | 0 |
| 2012-10-04 13:00:00 | 0.26 |
| 2012-10-04 14:00:00 | 0 |
| 2012-10-04 15:00:00 | 0.26 |
| 2012-10-04 16:00:00 | 0 |
| 2012-10-04 17:00:00 | 0 |
| 2012-10-04 18:00:00 | 0.26 |
| 2012-10-04 19:00:00 | 0 |
| 2012-10-04 20:00:00 | 0.26 |
| 2012-10-04 21:00:00 | 0 |
| 2012-10-04 22:00:00 | 0.26 |
| 2012-10-04 23:00:00 | 0 |
| 2012-10-05 | 0 |
| 2012-10-05 01:00:00 | 0.26 |
| 2012-10-05 02:00:00 | 0 |
| 2012-10-05 03:00:00 | 0.26 |
| 2012-10-05 04:00:00 | 0 |
| 2012-10-05 05:00:00 | 0.26 |
| 2012-10-05 06:00:00 | 0 |
| 2012-10-05 07:00:00 | 0.26 |
| 2012-10-05 08:00:00 | 0 |
| 2012-10-05 09:00:00 | 0 |
| 2012-10-05 10:00:00 | 0.26 |
| 2012-10-05 11:00:00 | 0 |
| 2012-10-05 12:00:00 | 0.26 |
| 2012-10-05 13:00:00 | 0 |
| 2012-10-05 14:00:00 | 0 |
| 2012-10-05 15:00:00 | 0.26 |
| 2012-10-05 16:00:00 | 0 |
| 2012-10-05 17:00:00 | 0.26 |
| 2012-10-05 18:00:00 | 0 |
| 2012-10-05 19:00:00 | 0 |
| 2012-10-05 20:00:00 | 0.26 |
| 2012-10-05 21:00:00 | 0 |
| 2012-10-05 22:00:00 | 0.26 |
| 2012-10-05 23:00:00 | 0 |
| 2012-10-06 | 0.26 |
| 2012-10-06 01:00:00 | 0 |
| 2012-10-06 02:00:00 | 0.26 |
| 2012-10-06 03:00:00 | 0 |
| 2012-10-06 04:00:00 | 0 |
| 2012-10-06 05:00:00 | 0.26 |
| 2012-10-06 06:00:00 | 0 |
| 2012-10-06 07:00:00 | 0.26 |
| 2012-10-06 08:00:00 | 0 |
| 2012-10-06 09:00:00 | 0.26 |
| 2012-10-06 10:00:00 | 0 |
| 2012-10-06 11:00:00 | 0 |
| 2012-10-06 12:00:00 | 0.26 |
| 2012-10-06 13:00:00 | 0 |
| 2012-10-06 14:00:00 | 0 |
| 2012-10-06 15:00:00 | 0.26 |
| 2012-10-06 16:00:00 | 0 |
| 2012-10-06 17:00:00 | 0.26 |
| 2012-10-06 18:00:00 | 0 |
| 2012-10-06 19:00:00 | 0 |
| 2012-10-06 20:00:00 | 0.26 |
| 2012-10-06 21:00:00 | 0 |
| 2012-10-06 22:00:00 | 0.26 |
| 2012-10-06 23:00:00 | 0 |
| 2012-10-07 | 0.26 |
| 2012-10-07 01:00:00 | 0 |
| 2012-10-07 02:00:00 | 0.26 |
| 2012-10-07 03:00:00 | 0 |
| 2012-10-07 04:00:00 | 0.26 |
| 2012-10-07 05:00:00 | 0 |
| 2012-10-07 06:00:00 | 0 |
| 2012-10-07 07:00:00 | 0.26 |
| 2012-10-07 08:00:00 | 0 |
| 2012-10-07 09:00:00 | 0.26 |
| 2012-10-07 10:00:00 | 0 |
| 2012-10-07 11:00:00 | 0 |
| 2012-10-07 12:00:00 | 0.26 |
| 2012-10-07 13:00:00 | 0 |
| 2012-10-07 14:00:00 | 0.26 |
| 2012-10-07 15:00:00 | 0 |
| 2012-10-07 16:00:00 | 0 |
| 2012-10-07 17:00:00 | 0.26 |
| 2012-10-07 18:00:00 | 0 |
| 2012-10-07 19:00:00 | 0.26 |
| 2012-10-07 20:00:00 | 0 |
| 2012-10-07 21:00:00 | 0.26 |
| 2012-10-07 22:00:00 | 0 |
| 2012-10-07 23:00:00 | 0 |
| 2012-10-08 | 0.26 |
| 2012-10-08 01:00:00 | 0 |
| 2012-10-08 02:00:00 | 0.26 |
| 2012-10-08 03:00:00 | 0 |
| 2012-10-08 04:00:00 | 0.26 |
| 2012-10-08 05:00:00 | 0 |
| 2012-10-08 06:00:00 | 0.26 |
| 2012-10-08 07:00:00 | 0 |
| 2012-10-08 08:00:00 | 0 |
| 2012-10-08 09:00:00 | 0.26 |
| 2012-10-08 10:00:00 | 0 |
| 2012-10-08 11:00:00 | 0.26 |
| 2012-10-08 12:00:00 | 0 |
| 2012-10-08 13:00:00 | 0 |
| 2012-10-08 14:00:00 | 0.26 |
| 2012-10-08 15:00:00 | 0 |
| 2012-10-08 16:00:00 | 0.26 |
| 2012-10-08 17:00:00 | 0 |
| 2012-10-08 18:00:00 | 0 |
| 2012-10-08 19:00:00 | 0.26 |
| 2012-10-08 20:00:00 | 0 |
| 2012-10-08 21:00:00 | 0.26 |
| 2012-10-08 22:00:00 | 0 |
| 2012-10-08 23:00:00 | 0.26 |
| 2012-10-09 | 0 |
| 2012-10-09 01:00:00 | 0.26 |
| 2012-10-09 02:00:00 | 0 |
| 2012-10-09 03:00:00 | 0 |
| 2012-10-09 04:00:00 | 0.26 |
| 2012-10-09 05:00:00 | 0 |
| 2012-10-09 06:00:00 | 0.26 |
| 2012-10-09 07:00:00 | 0 |
| 2012-10-09 08:00:00 | 0.26 |
| 2012-10-09 09:00:00 | 0 |
| 2012-10-09 10:00:00 | 0 |
| 2012-10-09 11:00:00 | 0.26 |
| 2012-10-09 12:00:00 | 0 |
| 2012-10-09 13:00:00 | 0.26 |
| 2012-10-09 14:00:00 | 0 |
| 2012-10-09 15:00:00 | 0 |
| 2012-10-09 16:00:00 | 0.26 |
| 2012-10-09 17:00:00 | 0 |
| 2012-10-09 18:00:00 | 0.26 |
| 2012-10-09 19:00:00 | 0 |
| 2012-10-09 20:00:00 | 0 |
| 2012-10-09 21:00:00 | 0.26 |
| 2012-10-09 22:00:00 | 0 |
| 2012-10-09 23:00:00 | 0.26 |
| 2012-10-10 | 0 |
| 2012-10-10 01:00:00 | 0.26 |
| 2012-10-10 02:00:00 | 0 |
| 2012-10-10 03:00:00 | 0.26 |
| 2012-10-10 04:00:00 | 0 |
| 2012-10-10 05:00:00 | 0.26 |
| 2012-10-10 06:00:00 | 0 |
| 2012-10-10 07:00:00 | 0 |
| 2012-10-10 08:00:00 | 0.26 |
| 2012-10-10 09:00:00 | 0 |
| 2012-10-10 10:00:00 | 0.26 |
| 2012-10-10 11:00:00 | 0 |
| 2012-10-10 12:00:00 | 0 |
| 2012-10-10 13:00:00 | 0.26 |
| 2012-10-10 14:00:00 | 0 |
| 2012-10-10 15:00:00 | 0.26 |
| 2012-10-10 16:00:00 | 0 |
| 2012-10-10 17:00:00 | 0 |
| 2012-10-10 18:00:00 | 0.26 |
| 2012-10-10 19:00:00 | 0 |
| 2012-10-10 20:00:00 | 0.26 |
| 2012-10-10 21:00:00 | 0 |
| 2012-10-10 22:00:00 | 0.26 |
| 2012-10-10 23:00:00 | 0 |
| 2012-10-11 | 0 |
| 2012-10-11 01:00:00 | 0.26 |
| 2012-10-11 02:00:00 | 0 |
| 2012-10-11 03:00:00 | 0.26 |
| 2012-10-11 04:00:00 | 0 |
| 2012-10-11 05:00:00 | 0.26 |
| 2012-10-11 06:00:00 | 0 |
| 2012-10-11 07:00:00 | 0.26 |
| 2012-10-11 08:00:00 | 0 |
| 2012-10-11 09:00:00 | 0 |
| 2012-10-11 10:00:00 | 0.26 |
| 2012-10-11 11:00:00 | 0 |
| 2012-10-11 12:00:00 | 0.26 |
| 2012-10-11 13:00:00 | 0 |
| 2012-10-11 14:00:00 | 0 |
| 2012-10-11 15:00:00 | 0.26 |
| 2012-10-11 16:00:00 | 0 |
| 2012-10-11 17:00:00 | 0.26 |
| 2012-10-11 18:00:00 | 0 |
| 2012-10-11 19:00:00 | 0 |
| 2012-10-11 20:00:00 | 0.26 |
| 2012-10-11 21:00:00 | 0 |
| 2012-10-11 22:00:00 | 0.26 |
| 2012-10-11 23:00:00 | 0 |
| 2012-10-12 | 0.26 |
| 2012-10-12 01:00:00 | 0 |
| 2012-10-12 02:00:00 | 0.26 |
| 2012-10-12 03:00:00 | 0 |
| 2012-10-12 04:00:00 | 0.26 |
| 2012-10-12 05:00:00 | 0 |
| 2012-10-12 06:00:00 | 0 |
| 2012-10-12 07:00:00 | 0.26 |
| 2012-10-12 08:00:00 | 0 |
| 2012-10-12 09:00:00 | 0.26 |
| 2012-10-12 10:00:00 | 0 |
| 2012-10-12 11:00:00 | 0 |
| 2012-10-12 12:00:00 | 0.26 |
| 2012-10-12 13:00:00 | 0 |
| 2012-10-12 14:00:00 | 0.26 |
| 2012-10-12 15:00:00 | 0 |
| 2012-10-12 16:00:00 | 0 |
| 2012-10-12 17:00:00 | 0.26 |
| 2012-10-12 18:00:00 | 0 |
| 2012-10-12 19:00:00 | 0.26 |
| 2012-10-12 20:00:00 | 0 |
| 2012-10-12 21:00:00 | 0.26 |
| 2012-10-12 22:00:00 | 0 |
| 2012-10-12 23:00:00 | 0 |
| 2012-10-13 | 0.26 |
| 2012-10-13 01:00:00 | 0 |
| 2012-10-13 02:00:00 | 0.26 |
| 2012-10-13 03:00:00 | 0 |
| 2012-10-13 04:00:00 | 0.26 |
| 2012-10-13 05:00:00 | 0 |
| 2012-10-13 06:00:00 | 0.26 |
| 2012-10-13 07:00:00 | 0 |
| 2012-10-13 08:00:00 | 0.26 |
| 2012-10-13 09:00:00 | 0 |
| 2012-10-13 10:00:00 | 0 |
| 2012-10-13 11:00:00 | 0.26 |
| 2012-10-13 12:00:00 | 0 |
| 2012-10-13 13:00:00 | 0 |
| 2012-10-13 14:00:00 | 0.26 |
| 2012-10-13 15:00:00 | 0 |
| 2012-10-13 16:00:00 | 0.26 |
| 2012-10-13 17:00:00 | 0 |
| 2012-10-13 18:00:00 | 0 |
| 2012-10-13 19:00:00 | 0.26 |
| 2012-10-13 20:00:00 | 0 |
| 2012-10-13 21:00:00 | 0.26 |
| 2012-10-13 22:00:00 | 0 |
| 2012-10-13 23:00:00 | 0.26 |
| 2012-10-14 | 0 |
| 2012-10-14 01:00:00 | 0.26 |
| 2012-10-14 02:00:00 | 0 |
| 2012-10-14 03:00:00 | 0 |
| 2012-10-14 04:00:00 | 0.26 |
| 2012-10-14 05:00:00 | 0 |
| 2012-10-14 06:00:00 | 0.26 |
| 2012-10-14 07:00:00 | 0 |
| 2012-10-14 08:00:00 | 0.26 |
| 2012-10-14 09:00:00 | 0 |
| 2012-10-14 10:00:00 | 0.26 |
| 2012-10-14 11:00:00 | 0 |
| 2012-10-14 12:00:00 | 0 |
| 2012-10-14 13:00:00 | 0.26 |
| 2012-10-14 14:00:00 | 0 |
| 2012-10-14 15:00:00 | 0 |
| 2012-10-14 16:00:00 | 0.26 |
| 2012-10-14 17:00:00 | 0 |
| 2012-10-14 18:00:00 | 0.26 |
| 2012-10-14 19:00:00 | 0 |
| 2012-10-14 20:00:00 | 0 |
| 2012-10-14 21:00:00 | 0.26 |
| 2012-10-14 22:00:00 | 0 |
| 2012-10-14 23:00:00 | 0.26 |
| 2012-10-15 | 0 |
| 2012-10-15 01:00:00 | 0.26 |
| 2012-10-15 02:00:00 | 0 |
| 2012-10-15 03:00:00 | 0.26 |
| 2012-10-15 04:00:00 | 0 |
| 2012-10-15 05:00:00 | 0.26 |
| 2012-10-15 06:00:00 | 0 |
| 2012-10-15 07:00:00 | 0.26 |
| 2012-10-15 08:00:00 | 0 |
| 2012-10-15 09:00:00 | 0 |
| 2012-10-15 10:00:00 | 0.26 |
| 2012-10-15 11:00:00 | 0 |
| 2012-10-15 12:00:00 | 0 |
| 2012-10-15 13:00:00 | 0.26 |
| 2012-10-15 14:00:00 | 0 |
| 2012-10-15 15:00:00 | 0.26 |
| 2012-10-15 16:00:00 | 0 |
| 2012-10-15 17:00:00 | 0 |
| 2012-10-15 18:00:00 | 0.26 |
| 2012-10-15 19:00:00 | 0 |
| 2012-10-15 20:00:00 | 0.26 |
| 2012-10-15 21:00:00 | 0 |
| 2012-10-15 22:00:00 | 0.26 |
| 2012-10-15 23:00:00 | 0 |
| 2012-10-16 | 0.26 |
| 2012-10-16 01:00:00 | 0 |
| 2012-10-16 02:00:00 | 0 |
| 2012-10-16 03:00:00 | 0.26 |
| 2012-10-16 04:00:00 | 0 |
| 2012-10-16 05:00:00 | 0.26 |
| 2012-10-16 06:00:00 | 0 |
| 2012-10-16 07:00:00 | 0.26 |
| 2012-10-16 08:00:00 | 0 |
| 2012-10-16 09:00:00 | 0.26 |
| 2012-10-16 10:00:00 | 2.86 |
| 2012-10-16 11:00:00 | 2.34 |
| 2012-10-16 12:00:00 | 2.6 |
| 2012-10-16 13:00:00 | 2.34 |
| 2012-10-16 14:00:00 | 2.34 |
| 2012-10-16 15:00:00 | 2.34 |
| 2012-10-16 16:00:00 | 2.34 |
| 2012-10-16 17:00:00 | 2.34 |
| 2012-10-16 18:00:00 | 2.34 |
| 2012-10-16 19:00:00 | 2.34 |
| 2012-10-16 20:00:00 | 2.34 |
| 2012-10-16 21:00:00 | 2.34 |
| 2012-10-16 22:00:00 | 2.34 |
| 2012-10-16 23:00:00 | 2.34 |
| 2012-10-17 | 2.34 |
| 2012-10-17 01:00:00 | 2.34 |
| 2012-10-17 02:00:00 | 2.6 |
| 2012-10-17 03:00:00 | 2.34 |
| 2012-10-17 04:00:00 | 2.34 |
| 2012-10-17 05:00:00 | 2.34 |
| 2012-10-17 06:00:00 | 2.34 |
| 2012-10-17 07:00:00 | 2.34 |
| 2012-10-17 08:00:00 | 2.6 |
| 2012-10-17 09:00:00 | 2.34 |
| 2012-10-17 10:00:00 | 2.34 |
| 2012-10-17 11:00:00 | 2.34 |
| 2012-10-17 12:00:00 | 2.34 |
| 2012-10-17 13:00:00 | 2.34 |
| 2012-10-17 14:00:00 | 2.34 |
| 2012-10-17 15:00:00 | 2.34 |
| 2012-10-17 16:00:00 | 2.34 |
| 2012-10-17 17:00:00 | 2.6 |
| 2012-10-17 18:00:00 | 2.34 |
| 2012-10-17 19:00:00 | 2.34 |
| 2012-10-17 20:00:00 | 2.34 |
| 2012-10-17 21:00:00 | 2.34 |
| 2012-10-17 22:00:00 | 2.34 |
| 2012-10-17 23:00:00 | 2.34 |
| 2012-10-18 | 2.34 |
| 2012-10-18 01:00:00 | 2.6 |
| 2012-10-18 02:00:00 | 2.34 |
| 2012-10-18 03:00:00 | 2.34 |
| 2012-10-18 04:00:00 | 2.34 |
| 2012-10-18 05:00:00 | 2.34 |
| 2012-10-18 06:00:00 | 2.34 |
| 2012-10-18 07:00:00 | 2.34 |
| 2012-10-18 08:00:00 | 2.34 |
| 2012-10-18 09:00:00 | 2.34 |
| 2012-10-18 10:00:00 | 2.34 |
| 2012-10-18 11:00:00 | 2.34 |
| 2012-10-18 12:00:00 | 2.6 |
| 2012-10-18 13:00:00 | 2.34 |
| 2012-10-18 14:00:00 | 2.34 |
| 2012-10-18 15:00:00 | 2.34 |
| 2012-10-18 16:00:00 | 2.34 |
| 2012-10-18 17:00:00 | 2.6 |
| 2012-10-18 18:00:00 | 2.34 |
| 2012-10-18 19:00:00 | 2.34 |
| 2012-10-18 20:00:00 | 2.34 |
| 2012-10-18 21:00:00 | 2.34 |
| 2012-10-18 22:00:00 | 2.6 |
| 2012-10-18 23:00:00 | 2.34 |
| 2012-10-19 | 2.34 |
| 2012-10-19 01:00:00 | 2.34 |
| 2012-10-19 02:00:00 | 2.34 |
| 2012-10-19 03:00:00 | 2.34 |
| 2012-10-19 04:00:00 | 2.34 |
| 2012-10-19 05:00:00 | 2.34 |
| 2012-10-19 06:00:00 | 2.34 |
| 2012-10-19 07:00:00 | 2.6 |
| 2012-10-19 08:00:00 | 2.34 |
| 2012-10-19 09:00:00 | 2.34 |
| 2012-10-19 10:00:00 | 2.34 |
| 2012-10-19 11:00:00 | 2.34 |
| 2012-10-19 12:00:00 | 2.34 |
| 2012-10-19 13:00:00 | 2.34 |
| 2012-10-19 14:00:00 | 2.6 |
| 2012-10-19 15:00:00 | 2.34 |
| 2012-10-19 16:00:00 | 2.34 |
| 2012-10-19 17:00:00 | 2.34 |
| 2012-10-19 18:00:00 | 2.34 |
| 2012-10-19 19:00:00 | 2.34 |
| 2012-10-19 20:00:00 | 2.34 |
| 2012-10-19 21:00:00 | 2.34 |
| 2012-10-19 22:00:00 | 2.34 |
| 2012-10-19 23:00:00 | 2.34 |
| 2012-10-20 | 2.34 |
| 2012-10-20 01:00:00 | 2.34 |
| 2012-10-20 02:00:00 | 2.6 |
| 2012-10-20 03:00:00 | 2.34 |
| 2012-10-20 04:00:00 | 2.34 |
| 2012-10-20 05:00:00 | 2.34 |
| 2012-10-20 06:00:00 | 2.34 |
| 2012-10-20 07:00:00 | 2.34 |
| 2012-10-20 08:00:00 | 2.34 |
| 2012-10-20 09:00:00 | 2.34 |
| 2012-10-20 10:00:00 | 2.34 |
| 2012-10-20 11:00:00 | 2.6 |
| 2012-10-20 12:00:00 | 2.34 |
| 2012-10-20 13:00:00 | 2.34 |
| 2012-10-20 14:00:00 | 2.34 |
| 2012-10-20 15:00:00 | 2.34 |
| 2012-10-20 16:00:00 | 2.08 |
| 2012-10-20 17:00:00 | 2.08 |
| 2012-10-20 18:00:00 | 2.34 |
| 2012-10-20 19:00:00 | 2.6 |
| 2012-10-20 20:00:00 | 2.34 |
| 2012-10-20 21:00:00 | 2.34 |
| 2012-10-20 22:00:00 | 2.34 |
| 2012-10-20 23:00:00 | 2.34 |
| 2012-10-21 | 2.34 |
| 2012-10-21 01:00:00 | 2.6 |
| 2012-10-21 02:00:00 | 2.34 |
| 2012-10-21 03:00:00 | 2.34 |
| 2012-10-21 04:00:00 | 2.34 |
| 2012-10-21 05:00:00 | 2.6 |
| 2012-10-21 06:00:00 | 2.34 |
| 2012-10-21 07:00:00 | 2.34 |
| 2012-10-21 08:00:00 | 2.34 |
| 2012-10-21 09:00:00 | 2.34 |
| 2012-10-21 10:00:00 | 2.34 |
| 2012-10-21 11:00:00 | 2.34 |
| 2012-10-21 12:00:00 | 2.34 |
| 2012-10-21 13:00:00 | 2.08 |
| 2012-10-21 14:00:00 | 2.6 |
| 2012-10-21 15:00:00 | 2.08 |
| 2012-10-21 16:00:00 | 2.08 |
| 2012-10-21 17:00:00 | 2.08 |
| 2012-10-21 18:00:00 | 2.34 |
| 2012-10-21 19:00:00 | 2.34 |
| 2012-10-21 20:00:00 | 2.34 |
| 2012-10-21 21:00:00 | 2.34 |
| 2012-10-21 22:00:00 | 2.34 |
| 2012-10-21 23:00:00 | 2.34 |
| 2012-10-22 | 2.6 |
| 2012-10-22 01:00:00 | 2.34 |
| 2012-10-22 02:00:00 | 2.34 |
| 2012-10-22 03:00:00 | 2.34 |
| 2012-10-22 04:00:00 | 2.34 |
| 2012-10-22 05:00:00 | 2.34 |
| 2012-10-22 06:00:00 | 2.34 |
| 2012-10-22 07:00:00 | 2.34 |
| 2012-10-22 08:00:00 | 2.34 |
| 2012-10-22 09:00:00 | 2.34 |
| 2012-10-22 10:00:00 | 2.6 |
| 2012-10-22 11:00:00 | 2.34 |
| 2012-10-22 12:00:00 | 2.08 |
| 2012-10-22 13:00:00 | 2.34 |
| 2012-10-22 14:00:00 | 2.34 |
| 2012-10-22 15:00:00 | 2.34 |
| 2012-10-22 16:00:00 | 2.34 |
| 2012-10-22 17:00:00 | 2.6 |
| 2012-10-22 18:00:00 | 2.34 |
| 2012-10-22 19:00:00 | 2.34 |
| 2012-10-22 20:00:00 | 2.34 |
| 2012-10-22 21:00:00 | 2.6 |
| 2012-10-22 22:00:00 | 2.34 |
| 2012-10-22 23:00:00 | 2.34 |
| 2012-10-23 | 2.34 |
| 2012-10-23 01:00:00 | 2.34 |
| 2012-10-23 02:00:00 | 2.34 |
| 2012-10-23 03:00:00 | 2.6 |
| 2012-10-23 04:00:00 | 2.34 |
| 2012-10-23 05:00:00 | 2.34 |
| 2012-10-23 06:00:00 | 2.34 |
| 2012-10-23 07:00:00 | 2.34 |
| 2012-10-23 08:00:00 | 2.34 |
| 2012-10-23 09:00:00 | 2.34 |
| 2012-10-23 10:00:00 | 2.34 |
| 2012-10-23 11:00:00 | 2.34 |
| 2012-10-23 12:00:00 | 2.34 |
| 2012-10-23 13:00:00 | 2.34 |
| 2012-10-23 14:00:00 | 2.34 |
| 2012-10-23 15:00:00 | 2.6 |
| 2012-10-23 16:00:00 | 2.34 |
| 2012-10-23 17:00:00 | 2.34 |
| 2012-10-23 18:00:00 | 2.34 |
| 2012-10-23 19:00:00 | 2.34 |
| 2012-10-23 20:00:00 | 2.34 |
| 2012-10-23 21:00:00 | 2.34 |
| 2012-10-23 22:00:00 | 2.34 |
| 2012-10-23 23:00:00 | 2.34 |
| 2012-10-24 | 2.6 |
| 2012-10-24 01:00:00 | 2.34 |
| 2012-10-24 02:00:00 | 2.34 |
| 2012-10-24 03:00:00 | 2.34 |
| 2012-10-24 04:00:00 | 2.34 |
| 2012-10-24 05:00:00 | 2.34 |
| 2012-10-24 06:00:00 | 2.34 |
| 2012-10-24 07:00:00 | 2.34 |
| 2012-10-24 08:00:00 | 2.34 |
| 2012-10-24 09:00:00 | 2.6 |
| 2012-10-24 10:00:00 | 2.34 |
| 2012-10-24 11:00:00 | 2.34 |
| 2012-10-24 12:00:00 | 2.34 |
| 2012-10-24 13:00:00 | 2.34 |
| 2012-10-24 14:00:00 | 2.34 |
| 2012-10-24 15:00:00 | 2.34 |
| 2012-10-24 16:00:00 | 2.34 |
| 2012-10-24 17:00:00 | 2.34 |
| 2012-10-24 18:00:00 | 2.34 |
| 2012-10-24 19:00:00 | 2.34 |
| 2012-10-24 20:00:00 | 2.34 |
| 2012-10-24 21:00:00 | 2.34 |
| 2012-10-24 22:00:00 | 2.34 |
| 2012-10-24 23:00:00 | 2.34 |
| 2012-10-25 | 2.34 |
| 2012-10-25 01:00:00 | 2.34 |
| 2012-10-25 02:00:00 | 2.34 |
| 2012-10-25 03:00:00 | 2.6 |
| 2012-10-25 04:00:00 | 2.34 |
| 2012-10-25 05:00:00 | 2.34 |
| 2012-10-25 06:00:00 | 2.34 |
| 2012-10-25 07:00:00 | 2.34 |
| 2012-10-25 08:00:00 | 2.34 |
| 2012-10-25 09:00:00 | 2.34 |
| 2012-10-25 10:00:00 | 3.38 |
| 2012-10-25 11:00:00 | 2.34 |
| 2012-10-25 12:00:00 | 2.34 |
| 2012-10-25 13:00:00 | 2.6 |
| 2012-10-25 14:00:00 | 2.34 |
| 2012-10-25 15:00:00 | 2.34 |
| 2012-10-25 16:00:00 | 2.34 |
| 2012-10-25 17:00:00 | 2.08 |
| 2012-10-25 18:00:00 | 2.34 |
| 2012-10-25 19:00:00 | 2.6 |
| 2012-10-25 20:00:00 | 2.34 |
| 2012-10-25 21:00:00 | 2.34 |
| 2012-10-25 22:00:00 | 2.34 |
| 2012-10-25 23:00:00 | 2.34 |
| 2012-10-26 | 2.34 |
| 2012-10-26 01:00:00 | 2.34 |
| 2012-10-26 02:00:00 | 2.34 |
| 2012-10-26 03:00:00 | 2.6 |
| 2012-10-26 04:00:00 | 2.34 |
| 2012-10-26 05:00:00 | 2.34 |
| 2012-10-26 06:00:00 | 2.34 |
| 2012-10-26 07:00:00 | 2.34 |
| 2012-10-26 08:00:00 | 2.34 |
| 2012-10-26 09:00:00 | 2.34 |
| 2012-10-26 10:00:00 | 2.34 |
| 2012-10-26 11:00:00 | 2.34 |
| 2012-10-26 12:00:00 | 2.6 |
| 2012-10-26 13:00:00 | 2.34 |
| 2012-10-26 14:00:00 | 2.34 |
| 2012-10-26 15:00:00 | 2.34 |
| 2012-10-26 16:00:00 | 2.34 |
| 2012-10-26 17:00:00 | 2.34 |
| 2012-10-26 18:00:00 | 2.34 |
| 2012-10-26 19:00:00 | 2.34 |
| 2012-10-26 20:00:00 | 2.34 |
| 2012-10-26 21:00:00 | 2.34 |
| 2012-10-26 22:00:00 | 2.34 |
| 2012-10-26 23:00:00 | 2.34 |
| 2012-10-27 | 2.34 |
| 2012-10-27 01:00:00 | 2.34 |
| 2012-10-27 02:00:00 | 2.6 |
| 2012-10-27 03:00:00 | 2.34 |
| 2012-10-27 04:00:00 | 2.34 |
| 2012-10-27 05:00:00 | 2.34 |
| 2012-10-27 06:00:00 | 2.34 |
| 2012-10-27 07:00:00 | 2.34 |
| 2012-10-27 08:00:00 | 2.34 |
| 2012-10-27 09:00:00 | 2.34 |
| 2012-10-27 10:00:00 | 2.34 |
| 2012-10-27 11:00:00 | 2.34 |
| 2012-10-27 12:00:00 | 2.34 |
| 2012-10-27 13:00:00 | 2.34 |
| 2012-10-27 14:00:00 | 2.34 |
| 2012-10-27 15:00:00 | 2.34 |
| 2012-10-27 16:00:00 | 2.34 |
| 2012-10-27 17:00:00 | 2.34 |
| 2012-10-27 18:00:00 | 2.34 |
| 2012-10-27 19:00:00 | 2.34 |
| 2012-10-27 20:00:00 | 2.34 |
| 2012-10-27 21:00:00 | 2.34 |
| 2012-10-27 22:00:00 | 2.34 |
| 2012-10-27 23:00:00 | 2.34 |
| 2012-10-28 | 2.34 |
| 2012-10-28 01:00:00 | 2.34 |
| 2012-10-28 02:00:00 | 2.6 |
| 2012-10-28 02:00:00 | 2.34 |
| 2012-10-28 03:00:00 | 2.34 |
| 2012-10-28 04:00:00 | 2.34 |
| 2012-10-28 05:00:00 | 2.34 |
| 2012-10-28 06:00:00 | 2.34 |
| 2012-10-28 07:00:00 | 2.6 |
| 2012-10-28 08:00:00 | 2.08 |
| 2012-10-28 09:00:00 | 2.34 |
| 2012-10-28 10:00:00 | 2.34 |
| 2012-10-28 11:00:00 | 2.34 |
| 2012-10-28 12:00:00 | 2.34 |
| 2012-10-28 13:00:00 | 2.34 |
| 2012-10-28 14:00:00 | 2.34 |
| 2012-10-28 15:00:00 | 2.34 |
| 2012-10-28 16:00:00 | 2.34 |
| 2012-10-28 17:00:00 | 2.34 |
| 2012-10-28 18:00:00 | 2.34 |
| 2012-10-28 19:00:00 | 2.34 |
| 2012-10-28 20:00:00 | 2.34 |
| 2012-10-28 21:00:00 | 2.34 |
| 2012-10-28 22:00:00 | 2.34 |
| 2012-10-28 23:00:00 | 2.34 |
| 2012-10-29 | 2.34 |
| 2012-10-29 01:00:00 | 2.34 |
| 2012-10-29 02:00:00 | 2.34 |
| 2012-10-29 03:00:00 | 2.34 |
| 2012-10-29 04:00:00 | 2.34 |
| 2012-10-29 05:00:00 | 2.34 |
| 2012-10-29 06:00:00 | 2.34 |
| 2012-10-29 07:00:00 | 2.6 |
| 2012-10-29 08:00:00 | 2.34 |
| 2012-10-29 09:00:00 | 2.08 |
| 2012-10-29 10:00:00 | 2.34 |
| 2012-10-29 11:00:00 | 2.34 |
| 2012-10-29 12:00:00 | 2.6 |
| 2012-10-29 13:00:00 | 2.34 |
| 2012-10-29 14:00:00 | 2.34 |
| 2012-10-29 15:00:00 | 2.34 |
| 2012-10-29 16:00:00 | 2.34 |
| 2012-10-29 17:00:00 | 2.34 |
| 2012-10-29 18:00:00 | 2.34 |
| 2012-10-29 19:00:00 | 2.6 |
| 2012-10-29 20:00:00 | 2.34 |
| 2012-10-29 21:00:00 | 2.34 |
| 2012-10-29 22:00:00 | 2.34 |
| 2012-10-29 23:00:00 | 2.6 |
| 2012-10-30 | 2.34 |
| 2012-10-30 01:00:00 | 2.34 |
| 2012-10-30 02:00:00 | 2.34 |
| 2012-10-30 03:00:00 | 2.34 |
| 2012-10-30 04:00:00 | 2.34 |
| 2012-10-30 05:00:00 | 2.34 |
| 2012-10-30 06:00:00 | 2.34 |
| 2012-10-30 07:00:00 | 2.34 |
| 2012-10-30 08:00:00 | 2.34 |
| 2012-10-30 09:00:00 | 2.34 |
| 2012-10-30 10:00:00 | 2.6 |
| 2012-10-30 11:00:00 | 2.34 |
| 2012-10-30 12:00:00 | 2.34 |
| 2012-10-30 13:00:00 | 2.34 |
| 2012-10-30 14:00:00 | 2.34 |
| 2012-10-30 15:00:00 | 2.34 |
| 2012-10-30 16:00:00 | 2.34 |
| 2012-10-30 17:00:00 | 2.6 |
| 2012-10-30 18:00:00 | 2.34 |
| 2012-10-30 19:00:00 | 2.34 |
| 2012-10-30 20:00:00 | 2.34 |
| 2012-10-30 21:00:00 | 2.6 |
| 2012-10-30 22:00:00 | 2.34 |
| 2012-10-30 23:00:00 | 2.34 |
| 2012-10-31 | 2.34 |
| 2012-10-31 01:00:00 | 2.34 |
| 2012-10-31 02:00:00 | 2.34 |
| 2012-10-31 03:00:00 | 2.34 |
| 2012-10-31 04:00:00 | 2.34 |
| 2012-10-31 05:00:00 | 2.34 |
| 2012-10-31 06:00:00 | 2.34 |
| 2012-10-31 07:00:00 | 2.6 |
| 2012-10-31 08:00:00 | 2.34 |
| 2012-10-31 09:00:00 | 2.34 |
| 2012-10-31 10:00:00 | 2.34 |
| 2012-10-31 11:00:00 | 2.34 |
| 2012-10-31 12:00:00 | 2.34 |
| 2012-10-31 13:00:00 | 2.34 |
| 2012-10-31 14:00:00 | 2.34 |
| 2012-10-31 15:00:00 | 2.6 |
| 2012-10-31 16:00:00 | 2.34 |
| 2012-10-31 17:00:00 | 2.34 |
| 2012-10-31 18:00:00 | 2.34 |
| 2012-10-31 19:00:00 | 2.34 |
| 2012-10-31 20:00:00 | 2.34 |
| 2012-10-31 21:00:00 | 2.6 |
| 2012-10-31 22:00:00 | 2.34 |
| 2012-10-31 23:00:00 | 2.34 |
| 2012-11-01 | 2.6 |
| 2012-11-01 01:00:00 | 2.34 |
| 2012-11-01 02:00:00 | 2.34 |
| 2012-11-01 03:00:00 | 2.6 |
| 2012-11-01 04:00:00 | 2.34 |
| 2012-11-01 05:00:00 | 2.6 |
| 2012-11-01 06:00:00 | 2.34 |
| 2012-11-01 07:00:00 | 2.34 |
| 2012-11-01 08:00:00 | 2.34 |
| 2012-11-01 09:00:00 | 2.34 |
| 2012-11-01 10:00:00 | 2.34 |
| 2012-11-01 11:00:00 | 2.34 |
| 2012-11-01 12:00:00 | 2.34 |
| 2012-11-01 13:00:00 | 2.34 |
| 2012-11-01 14:00:00 | 2.34 |
| 2012-11-01 15:00:00 | 2.34 |
| 2012-11-01 16:00:00 | 2.34 |
| 2012-11-01 17:00:00 | 2.34 |
| 2012-11-01 18:00:00 | 2.34 |
| 2012-11-01 19:00:00 | 2.6 |
| 2012-11-01 20:00:00 | 2.34 |
| 2012-11-01 21:00:00 | 2.34 |
| 2012-11-01 22:00:00 | 2.34 |
| 2012-11-01 23:00:00 | 2.6 |
| 2012-11-02 | 2.34 |
| 2012-11-02 01:00:00 | 2.34 |
| 2012-11-02 02:00:00 | 2.6 |
| 2012-11-02 03:00:00 | 2.34 |
| 2012-11-02 04:00:00 | 2.34 |
| 2012-11-02 05:00:00 | 2.34 |
| 2012-11-02 06:00:00 | 2.34 |
| 2012-11-02 07:00:00 | 2.34 |
| 2012-11-02 08:00:00 | 2.34 |
| 2012-11-02 09:00:00 | 3.64 |
| 2012-11-02 10:00:00 | 2.34 |
| 2012-11-02 11:00:00 | 2.34 |
| 2012-11-02 12:00:00 | 2.34 |
| 2012-11-02 13:00:00 | 2.34 |
| 2012-11-02 14:00:00 | 2.34 |
| 2012-11-02 15:00:00 | 2.34 |
| 2012-11-02 16:00:00 | 2.34 |
| 2012-11-02 17:00:00 | 2.34 |
| 2012-11-02 18:00:00 | 2.6 |
| 2012-11-02 19:00:00 | 2.34 |
| 2012-11-02 20:00:00 | 2.34 |
| 2012-11-02 21:00:00 | 2.6 |
| 2012-11-02 22:00:00 | 2.34 |
| 2012-11-02 23:00:00 | 2.34 |
| 2012-11-03 | 2.34 |
| 2012-11-03 01:00:00 | 2.34 |
| 2012-11-03 02:00:00 | 2.34 |
| 2012-11-03 03:00:00 | 2.34 |
| 2012-11-03 04:00:00 | 2.34 |
| 2012-11-03 05:00:00 | 2.34 |
| 2012-11-03 06:00:00 | 2.34 |
| 2012-11-03 07:00:00 | 2.6 |
| 2012-11-03 08:00:00 | 2.08 |
| 2012-11-03 09:00:00 | 2.34 |
| 2012-11-03 10:00:00 | 2.34 |
| 2012-11-03 11:00:00 | 2.6 |
| 2012-11-03 12:00:00 | 2.34 |
| 2012-11-03 13:00:00 | 2.34 |
| 2012-11-03 14:00:00 | 2.34 |
| 2012-11-03 15:00:00 | 2.6 |
| 2012-11-03 16:00:00 | 2.34 |
| 2012-11-03 17:00:00 | 2.34 |
| 2012-11-03 18:00:00 | 2.6 |
| 2012-11-03 19:00:00 | 2.34 |
| 2012-11-03 20:00:00 | 2.34 |
| 2012-11-03 21:00:00 | 2.34 |
| 2012-11-03 22:00:00 | 2.6 |
| 2012-11-03 23:00:00 | 2.34 |
| 2012-11-04 | 2.34 |
| 2012-11-04 01:00:00 | 2.34 |
| 2012-11-04 02:00:00 | 2.34 |
| 2012-11-04 03:00:00 | 2.34 |
| 2012-11-04 04:00:00 | 2.34 |
| 2012-11-04 05:00:00 | 2.6 |
| 2012-11-04 06:00:00 | 2.34 |
| 2012-11-04 07:00:00 | 2.34 |
| 2012-11-04 08:00:00 | 2.34 |
| 2012-11-04 09:00:00 | 2.34 |
| 2012-11-04 10:00:00 | 2.34 |
| 2012-11-04 11:00:00 | 2.34 |
| 2012-11-04 12:00:00 | 2.34 |
| 2012-11-04 13:00:00 | 2.34 |
| 2012-11-04 14:00:00 | 2.34 |
| 2012-11-04 15:00:00 | 2.34 |
| 2012-11-04 16:00:00 | 2.34 |
| 2012-11-04 17:00:00 | 2.34 |
| 2012-11-04 18:00:00 | 2.34 |
| 2012-11-04 19:00:00 | 2.34 |
| 2012-11-04 20:00:00 | 2.6 |
| 2012-11-04 21:00:00 | 2.34 |
| 2012-11-04 22:00:00 | 2.34 |
| 2012-11-04 23:00:00 | 2.34 |
| 2012-11-05 | 2.34 |
| 2012-11-05 01:00:00 | 2.34 |
| 2012-11-05 02:00:00 | 2.6 |
| 2012-11-05 03:00:00 | 2.34 |
| 2012-11-05 04:00:00 | 2.34 |
| 2012-11-05 05:00:00 | 2.34 |
| 2012-11-05 06:00:00 | 2.34 |
| 2012-11-05 07:00:00 | 2.34 |
| 2012-11-05 08:00:00 | 2.34 |
| 2012-11-05 09:00:00 | 2.34 |
| 2012-11-05 10:00:00 | 2.34 |
| 2012-11-05 11:00:00 | 2.6 |
| 2012-11-05 12:00:00 | 2.34 |
| 2012-11-05 13:00:00 | 2.34 |
| 2012-11-05 14:00:00 | 2.34 |
| 2012-11-05 15:00:00 | 2.34 |
| 2012-11-05 16:00:00 | 2.34 |
| 2012-11-05 17:00:00 | 2.34 |
| 2012-11-05 18:00:00 | 2.34 |
| 2012-11-05 19:00:00 | 2.6 |
| 2012-11-05 20:00:00 | 2.34 |
| 2012-11-05 21:00:00 | 2.34 |
| 2012-11-05 22:00:00 | 2.6 |
| 2012-11-05 23:00:00 | 2.34 |
| 2012-11-06 | 2.34 |
| 2012-11-06 01:00:00 | 2.34 |
| 2012-11-06 02:00:00 | 2.34 |
| 2012-11-06 03:00:00 | 2.6 |
| 2012-11-06 04:00:00 | 2.34 |
| 2012-11-06 05:00:00 | 2.34 |
| 2012-11-06 06:00:00 | 2.34 |
| 2012-11-06 07:00:00 | 2.34 |
| 2012-11-06 08:00:00 | 2.34 |
| 2012-11-06 09:00:00 | 2.34 |
| 2012-11-06 10:00:00 | 2.34 |
| 2012-11-06 11:00:00 | 2.34 |
| 2012-11-06 12:00:00 | 2.34 |
| 2012-11-06 13:00:00 | 2.34 |
| 2012-11-06 14:00:00 | 2.34 |
| 2012-11-06 15:00:00 | 2.6 |
| 2012-11-06 16:00:00 | 2.34 |
| 2012-11-06 17:00:00 | 2.34 |
| 2012-11-06 18:00:00 | 2.34 |
| 2012-11-06 19:00:00 | 2.34 |
| 2012-11-06 20:00:00 | 2.34 |
| 2012-11-06 21:00:00 | 2.6 |
| 2012-11-06 22:00:00 | 2.34 |
| 2012-11-06 23:00:00 | 2.34 |
| 2012-11-07 | 2.34 |
| 2012-11-07 01:00:00 | 2.34 |
| 2012-11-07 02:00:00 | 2.34 |
| 2012-11-07 03:00:00 | 2.6 |
| 2012-11-07 04:00:00 | 2.34 |
| 2012-11-07 05:00:00 | 2.34 |
| 2012-11-07 06:00:00 | 2.34 |
| 2012-11-07 07:00:00 | 2.34 |
| 2012-11-07 08:00:00 | 2.34 |
| 2012-11-07 09:00:00 | 2.34 |
| 2012-11-07 10:00:00 | 2.34 |
| 2012-11-07 11:00:00 | 2.34 |
| 2012-11-07 12:00:00 | 2.34 |
| 2012-11-07 13:00:00 | 2.34 |
| 2012-11-07 14:00:00 | 2.34 |
| 2012-11-07 15:00:00 | 2.34 |
| 2012-11-07 16:00:00 | 2.6 |
| 2012-11-07 17:00:00 | 2.34 |
| 2012-11-07 18:00:00 | 2.34 |
| 2012-11-07 19:00:00 | 2.34 |
| 2012-11-07 20:00:00 | 2.34 |
| 2012-11-07 21:00:00 | 2.6 |
| 2012-11-07 22:00:00 | 2.34 |
| 2012-11-07 23:00:00 | 2.34 |
| 2012-11-08 | 2.34 |
| 2012-11-08 01:00:00 | 2.34 |
| 2012-11-08 02:00:00 | 2.34 |
| 2012-11-08 03:00:00 | 2.34 |
| 2012-11-08 04:00:00 | 2.6 |
| 2012-11-08 05:00:00 | 2.34 |
| 2012-11-08 06:00:00 | 2.34 |
| 2012-11-08 07:00:00 | 2.34 |
| 2012-11-08 08:00:00 | 2.34 |
| 2012-11-08 09:00:00 | 2.34 |
| 2012-11-08 10:00:00 | 2.34 |
| 2012-11-08 11:00:00 | 2.34 |
| 2012-11-08 12:00:00 | 2.6 |
| 2012-11-08 13:00:00 | 2.34 |
| 2012-11-08 14:00:00 | 2.34 |
| 2012-11-08 15:00:00 | 2.34 |
| 2012-11-08 16:00:00 | 2.34 |
| 2012-11-08 17:00:00 | 2.34 |
| 2012-11-08 18:00:00 | 2.34 |
| 2012-11-08 19:00:00 | 2.6 |
| 2012-11-08 20:00:00 | 2.34 |
| 2012-11-08 21:00:00 | 2.34 |
| 2012-11-08 22:00:00 | 2.34 |
| 2012-11-08 23:00:00 | 2.6 |
| 2012-11-09 | 2.34 |
| 2012-11-09 01:00:00 | 2.34 |
| 2012-11-09 02:00:00 | 2.34 |
| 2012-11-09 03:00:00 | 2.34 |
| 2012-11-09 04:00:00 | 2.34 |
| 2012-11-09 05:00:00 | 2.34 |
| 2012-11-09 06:00:00 | 2.34 |
| 2012-11-09 07:00:00 | 2.34 |
| 2012-11-09 08:00:00 | 2.34 |
| 2012-11-09 09:00:00 | 2.34 |
| 2012-11-09 10:00:00 | 2.34 |
| 2012-11-09 11:00:00 | 2.34 |
| 2012-11-09 12:00:00 | 2.34 |
| 2012-11-09 13:00:00 | 2.34 |
| 2012-11-09 14:00:00 | 2.34 |
| 2012-11-09 15:00:00 | 2.6 |
| 2012-11-09 16:00:00 | 2.34 |
| 2012-11-09 17:00:00 | 2.34 |
| 2012-11-09 18:00:00 | 2.34 |
| 2012-11-09 19:00:00 | 2.34 |
| 2012-11-09 20:00:00 | 2.34 |
| 2012-11-09 21:00:00 | 2.6 |
| 2012-11-09 22:00:00 | 2.34 |
| 2012-11-09 23:00:00 | 2.34 |
| 2012-11-10 | 2.34 |
| 2012-11-10 01:00:00 | 2.34 |
| 2012-11-10 02:00:00 | 2.34 |
| 2012-11-10 03:00:00 | 2.34 |
| 2012-11-10 04:00:00 | 2.34 |
| 2012-11-10 05:00:00 | 2.34 |
| 2012-11-10 06:00:00 | 2.34 |
| 2012-11-10 07:00:00 | 2.6 |
| 2012-11-10 08:00:00 | 2.34 |
| 2012-11-10 09:00:00 | 2.08 |
| 2012-11-10 10:00:00 | 2.34 |
| 2012-11-10 11:00:00 | 2.34 |
| 2012-11-10 12:00:00 | 2.34 |
| 2012-11-10 13:00:00 | 2.34 |
| 2012-11-10 14:00:00 | 2.34 |
| 2012-11-10 15:00:00 | 2.34 |
| 2012-11-10 16:00:00 | 2.34 |
| 2012-11-10 17:00:00 | 2.34 |
| 2012-11-10 18:00:00 | 2.34 |
| 2012-11-10 19:00:00 | 2.34 |
| 2012-11-10 20:00:00 | 2.6 |
| 2012-11-10 21:00:00 | 2.34 |
| 2012-11-10 22:00:00 | 2.34 |
| 2012-11-10 23:00:00 | 2.34 |
| 2012-11-11 | 2.34 |
| 2012-11-11 01:00:00 | 2.34 |
| 2012-11-11 02:00:00 | 2.34 |
| 2012-11-11 03:00:00 | 2.34 |
| 2012-11-11 04:00:00 | 2.6 |
| 2012-11-11 05:00:00 | 2.34 |
| 2012-11-11 06:00:00 | 2.34 |
| 2012-11-11 07:00:00 | 2.34 |
| 2012-11-11 08:00:00 | 2.34 |
| 2012-11-11 09:00:00 | 2.34 |
| 2012-11-11 10:00:00 | 2.34 |
| 2012-11-11 11:00:00 | 2.34 |
| 2012-11-11 12:00:00 | 2.34 |
| 2012-11-11 13:00:00 | 2.34 |
| 2012-11-11 14:00:00 | 2.34 |
| 2012-11-11 15:00:00 | 2.34 |
| 2012-11-11 16:00:00 | 2.34 |
| 2012-11-11 17:00:00 | 2.34 |
| 2012-11-11 18:00:00 | 2.34 |
| 2012-11-11 19:00:00 | 2.34 |
| 2012-11-11 20:00:00 | 2.6 |
| 2012-11-11 21:00:00 | 2.34 |
| 2012-11-11 22:00:00 | 2.34 |
| 2012-11-11 23:00:00 | 2.34 |
| 2012-11-12 | 2.34 |
| 2012-11-12 01:00:00 | 2.34 |
| 2012-11-12 02:00:00 | 2.34 |
| 2012-11-12 03:00:00 | 2.6 |
| 2012-11-12 04:00:00 | 2.34 |
| 2012-11-12 05:00:00 | 2.34 |
| 2012-11-12 06:00:00 | 2.34 |
| 2012-11-12 07:00:00 | 2.34 |
| 2012-11-12 08:00:00 | 2.6 |
| 2012-11-12 09:00:00 | 2.34 |
| 2012-11-12 10:00:00 | 2.34 |
| 2012-11-12 11:00:00 | 2.34 |
| 2012-11-12 12:00:00 | 2.34 |
| 2012-11-12 13:00:00 | 2.34 |
| 2012-11-12 14:00:00 | 2.34 |
| 2012-11-12 15:00:00 | 2.34 |
| 2012-11-12 16:00:00 | 2.34 |
| 2012-11-12 17:00:00 | 2.34 |
| 2012-11-12 18:00:00 | 2.34 |
| 2012-11-12 19:00:00 | 2.34 |
| 2012-11-12 20:00:00 | 2.34 |
| 2012-11-12 21:00:00 | 2.34 |
| 2012-11-12 22:00:00 | 2.34 |
| 2012-11-12 23:00:00 | 2.34 |
| 2012-11-13 | 2.34 |
| 2012-11-13 01:00:00 | 2.34 |
| 2012-11-13 02:00:00 | 2.6 |
| 2012-11-13 03:00:00 | 2.34 |
| 2012-11-13 04:00:00 | 2.34 |
| 2012-11-13 05:00:00 | 2.34 |
| 2012-11-13 06:00:00 | 2.34 |
| 2012-11-13 07:00:00 | 2.34 |
| 2012-11-13 08:00:00 | 2.34 |
| 2012-11-13 09:00:00 | 2.6 |
| 2012-11-13 10:00:00 | 2.34 |
| 2012-11-13 11:00:00 | 2.34 |
| 2012-11-13 12:00:00 | 2.34 |
| 2012-11-13 13:00:00 | 2.34 |
| 2012-11-13 14:00:00 | 2.34 |
| 2012-11-13 15:00:00 | 2.34 |
| 2012-11-13 16:00:00 | 2.34 |
| 2012-11-13 17:00:00 | 2.34 |
| 2012-11-13 18:00:00 | 2.34 |
| 2012-11-13 19:00:00 | 2.34 |
| 2012-11-13 20:00:00 | 2.34 |
| 2012-11-13 21:00:00 | 2.34 |
| 2012-11-13 22:00:00 | 2.34 |
| 2012-11-13 23:00:00 | 2.34 |
| 2012-11-14 | 2.34 |
| 2012-11-14 01:00:00 | 2.34 |
| 2012-11-14 02:00:00 | 2.34 |
| 2012-11-14 03:00:00 | 2.6 |
| 2012-11-14 04:00:00 | 2.34 |
| 2012-11-14 05:00:00 | 2.34 |
| 2012-11-14 06:00:00 | 2.34 |
| 2012-11-14 07:00:00 | 2.34 |
| 2012-11-14 08:00:00 | 2.34 |
| 2012-11-14 09:00:00 | 2.34 |
| 2012-11-14 10:00:00 | 2.34 |
| 2012-11-14 11:00:00 | 2.34 |
| 2012-11-14 12:00:00 | 2.6 |
| 2012-11-14 13:00:00 | 2.34 |
| 2012-11-14 14:00:00 | 2.34 |
| 2012-11-14 15:00:00 | 2.34 |
| 2012-11-14 16:00:00 | 2.34 |
| 2012-11-14 17:00:00 | 2.34 |
| 2012-11-14 18:00:00 | 2.34 |
| 2012-11-14 19:00:00 | 2.6 |
| 2012-11-14 20:00:00 | 2.34 |
| 2012-11-14 21:00:00 | 2.34 |
| 2012-11-14 22:00:00 | 2.6 |
| 2012-11-14 23:00:00 | 2.34 |
| 2012-11-15 | 2.34 |
| 2012-11-15 01:00:00 | 2.34 |
| 2012-11-15 02:00:00 | 2.34 |
| 2012-11-15 03:00:00 | 2.34 |
| 2012-11-15 04:00:00 | 2.34 |
| 2012-11-15 05:00:00 | 2.34 |
| 2012-11-15 06:00:00 | 2.34 |
| 2012-11-15 07:00:00 | 2.34 |
| 2012-11-15 08:00:00 | 2.34 |
| 2012-11-15 09:00:00 | 2.34 |
| 2012-11-15 10:00:00 | 3.12 |
| 2012-11-15 11:00:00 | 2.34 |
| 2012-11-15 12:00:00 | 2.34 |
| 2012-11-15 13:00:00 | 2.6 |
| 2012-11-15 14:00:00 | 2.34 |
| 2012-11-15 15:00:00 | 2.34 |
| 2012-11-15 16:00:00 | 2.34 |
| 2012-11-15 17:00:00 | 2.34 |
| 2012-11-15 18:00:00 | 2.34 |
| 2012-11-15 19:00:00 | 2.6 |
| 2012-11-15 20:00:00 | 2.34 |
| 2012-11-15 21:00:00 | 2.34 |
| 2012-11-15 22:00:00 | 2.6 |
| 2012-11-15 23:00:00 | 2.34 |
| 2012-11-16 | 2.34 |
| 2012-11-16 01:00:00 | 2.34 |
| 2012-11-16 02:00:00 | 2.34 |
| 2012-11-16 03:00:00 | 2.34 |
| 2012-11-16 04:00:00 | 2.34 |
| 2012-11-16 05:00:00 | 2.34 |
| 2012-11-16 06:00:00 | 2.34 |
| 2012-11-16 07:00:00 | 2.34 |
| 2012-11-16 08:00:00 | 2.34 |
| 2012-11-16 09:00:00 | 2.34 |
| 2012-11-16 10:00:00 | 2.34 |
| 2012-11-16 11:00:00 | 2.34 |
| 2012-11-16 12:00:00 | 2.34 |
| 2012-11-16 13:00:00 | 2.6 |
| 2012-11-16 14:00:00 | 2.34 |
| 2012-11-16 15:00:00 | 2.34 |
| 2012-11-16 16:00:00 | 2.34 |
| 2012-11-16 17:00:00 | 2.34 |
| 2012-11-16 18:00:00 | 2.34 |
| 2012-11-16 19:00:00 | 2.6 |
| 2012-11-16 20:00:00 | 2.34 |
| 2012-11-16 21:00:00 | 2.34 |
| 2012-11-16 22:00:00 | 2.34 |
| 2012-11-16 23:00:00 | 2.6 |
| 2012-11-17 | 2.34 |
| 2012-11-17 01:00:00 | 2.6 |
| 2012-11-17 02:00:00 | 2.34 |
| 2012-11-17 03:00:00 | 2.34 |
| 2012-11-17 04:00:00 | 2.34 |
| 2012-11-17 05:00:00 | 2.34 |
| 2012-11-17 06:00:00 | 2.34 |
| 2012-11-17 07:00:00 | 2.34 |
| 2012-11-17 08:00:00 | 2.6 |
| 2012-11-17 09:00:00 | 2.34 |
| 2012-11-17 10:00:00 | 2.34 |
| 2012-11-17 11:00:00 | 2.34 |
| 2012-11-17 12:00:00 | 2.6 |
| 2012-11-17 13:00:00 | 2.34 |
| 2012-11-17 14:00:00 | 2.34 |
| 2012-11-17 15:00:00 | 2.34 |
| 2012-11-17 16:00:00 | 2.6 |
| 2012-11-17 17:00:00 | 2.34 |
| 2012-11-17 18:00:00 | 2.34 |
| 2012-11-17 19:00:00 | 2.6 |
| 2012-11-17 20:00:00 | 2.34 |
| 2012-11-17 21:00:00 | 2.34 |
| 2012-11-17 22:00:00 | 2.6 |
| 2012-11-17 23:00:00 | 2.34 |
| 2012-11-18 | 2.34 |
| 2012-11-18 01:00:00 | 2.34 |
| 2012-11-18 02:00:00 | 2.34 |
| 2012-11-18 03:00:00 | 2.6 |
| 2012-11-18 04:00:00 | 2.34 |
| 2012-11-18 05:00:00 | 2.34 |
| 2012-11-18 06:00:00 | 2.34 |
| 2012-11-18 07:00:00 | 2.34 |
| 2012-11-18 08:00:00 | 2.34 |
| 2012-11-18 09:00:00 | 2.34 |
| 2012-11-18 10:00:00 | 2.34 |
| 2012-11-18 11:00:00 | 2.34 |
| 2012-11-18 12:00:00 | 2.34 |
| 2012-11-18 13:00:00 | 2.34 |
| 2012-11-18 14:00:00 | 2.34 |
| 2012-11-18 15:00:00 | 2.34 |
| 2012-11-18 16:00:00 | 2.34 |
| 2012-11-18 17:00:00 | 2.34 |
| 2012-11-18 18:00:00 | 2.6 |
| 2012-11-18 19:00:00 | 2.34 |
| 2012-11-18 20:00:00 | 2.34 |
| 2012-11-18 21:00:00 | 2.34 |
| 2012-11-18 22:00:00 | 2.34 |
| 2012-11-18 23:00:00 | 2.34 |
| 2012-11-19 | 2.34 |
| 2012-11-19 01:00:00 | 2.34 |
| 2012-11-19 02:00:00 | 2.34 |
| 2012-11-19 03:00:00 | 2.6 |
| 2012-11-19 04:00:00 | 2.34 |
| 2012-11-19 05:00:00 | 2.34 |
| 2012-11-19 06:00:00 | 2.34 |
| 2012-11-19 07:00:00 | 2.34 |
| 2012-11-19 08:00:00 | 2.34 |
| 2012-11-19 09:00:00 | 2.34 |
| 2012-11-19 10:00:00 | 2.34 |
| 2012-11-19 11:00:00 | 2.6 |
| 2012-11-19 12:00:00 | 2.34 |
| 2012-11-19 13:00:00 | 2.34 |
| 2012-11-19 14:00:00 | 2.34 |
| 2012-11-19 15:00:00 | 2.34 |
| 2012-11-19 16:00:00 | 2.34 |
| 2012-11-19 17:00:00 | 2.34 |
| 2012-11-19 18:00:00 | 2.6 |
| 2012-11-19 19:00:00 | 2.34 |
| 2012-11-19 20:00:00 | 2.34 |
| 2012-11-19 21:00:00 | 2.34 |
| 2012-11-19 22:00:00 | 2.34 |
| 2012-11-19 23:00:00 | 2.6 |
| 2012-11-20 | 2.34 |
| 2012-11-20 01:00:00 | 2.34 |
| 2012-11-20 02:00:00 | 2.34 |
| 2012-11-20 03:00:00 | 2.34 |
| 2012-11-20 04:00:00 | 2.34 |
| 2012-11-20 05:00:00 | 2.34 |
| 2012-11-20 06:00:00 | 2.34 |
| 2012-11-20 07:00:00 | 2.34 |
| 2012-11-20 08:00:00 | 2.34 |
| 2012-11-20 09:00:00 | 2.34 |
| 2012-11-20 10:00:00 | 2.6 |
| 2012-11-20 11:00:00 | 2.34 |
| 2012-11-20 12:00:00 | 2.34 |
| 2012-11-20 13:00:00 | 2.34 |
| 2012-11-20 14:00:00 | 2.34 |
| 2012-11-20 15:00:00 | 2.34 |
| 2012-11-20 16:00:00 | 2.34 |
| 2012-11-20 17:00:00 | 2.6 |
| 2012-11-20 18:00:00 | 2.34 |
| 2012-11-20 19:00:00 | 2.34 |
| 2012-11-20 20:00:00 | 2.34 |
| 2012-11-20 21:00:00 | 2.34 |
| 2012-11-20 22:00:00 | 2.34 |
| 2012-11-20 23:00:00 | 2.34 |
| 2012-11-21 | 2.6 |
| 2012-11-21 01:00:00 | 2.34 |
| 2012-11-21 02:00:00 | 2.34 |
| 2012-11-21 03:00:00 | 2.34 |
| 2012-11-21 04:00:00 | 2.34 |
| 2012-11-21 05:00:00 | 2.34 |
| 2012-11-21 06:00:00 | 2.34 |
| 2012-11-21 07:00:00 | 2.34 |
| 2012-11-21 08:00:00 | 2.34 |
| 2012-11-21 09:00:00 | 2.34 |
| 2012-11-21 10:00:00 | 2.6 |
| 2012-11-21 11:00:00 | 2.34 |
| 2012-11-21 12:00:00 | 2.34 |
| 2012-11-21 13:00:00 | 2.34 |
| 2012-11-21 14:00:00 | 2.34 |
| 2012-11-21 15:00:00 | 2.34 |
| 2012-11-21 16:00:00 | 2.34 |
| 2012-11-21 17:00:00 | 2.34 |
| 2012-11-21 18:00:00 | 2.6 |
| 2012-11-21 19:00:00 | 2.34 |
| 2012-11-21 20:00:00 | 2.34 |
| 2012-11-21 21:00:00 | 2.34 |
| 2012-11-21 22:00:00 | 2.34 |
| 2012-11-21 23:00:00 | 2.34 |
| 2012-11-22 | 2.6 |
| 2012-11-22 01:00:00 | 2.34 |
| 2012-11-22 02:00:00 | 2.34 |
| 2012-11-22 03:00:00 | 2.34 |
| 2012-11-22 04:00:00 | 2.34 |
| 2012-11-22 05:00:00 | 2.34 |
| 2012-11-22 06:00:00 | 2.34 |
| 2012-11-22 07:00:00 | 2.34 |
| 2012-11-22 08:00:00 | 2.34 |
| 2012-11-22 09:00:00 | 2.6 |
| 2012-11-22 10:00:00 | 3.38 |
| 2012-11-22 11:00:00 | 2.34 |
| 2012-11-22 12:00:00 | 2.34 |
| 2012-11-22 13:00:00 | 2.34 |
| 2012-11-22 14:00:00 | 2.34 |
| 2012-11-22 15:00:00 | 2.34 |
| 2012-11-22 16:00:00 | 2.34 |
| 2012-11-22 17:00:00 | 2.34 |
| 2012-11-22 18:00:00 | 2.34 |
| 2012-11-22 19:00:00 | 2.34 |
| 2012-11-22 20:00:00 | 2.34 |
| 2012-11-22 21:00:00 | 2.34 |
| 2012-11-22 22:00:00 | 2.34 |
| 2012-11-22 23:00:00 | 2.34 |
| 2012-11-23 | 2.34 |
| 2012-11-23 01:00:00 | 2.34 |
| 2012-11-23 02:00:00 | 2.34 |
| 2012-11-23 03:00:00 | 2.6 |
| 2012-11-23 04:00:00 | 2.34 |
| 2012-11-23 05:00:00 | 2.34 |
| 2012-11-23 06:00:00 | 2.34 |
| 2012-11-23 07:00:00 | 2.34 |
| 2012-11-23 08:00:00 | 2.34 |
| 2012-11-23 09:00:00 | 2.34 |
| 2012-11-23 10:00:00 | 2.34 |
| 2012-11-23 11:00:00 | 2.34 |
| 2012-11-23 12:00:00 | 2.34 |
| 2012-11-23 13:00:00 | 2.6 |
| 2012-11-23 14:00:00 | 2.34 |
| 2012-11-23 15:00:00 | 2.08 |
| 2012-11-23 16:00:00 | 2.6 |
| 2012-11-23 17:00:00 | 2.34 |
| 2012-11-23 18:00:00 | 2.34 |
| 2012-11-23 19:00:00 | 2.34 |
| 2012-11-23 20:00:00 | 2.6 |
| 2012-11-23 21:00:00 | 2.34 |
| 2012-11-23 22:00:00 | 2.34 |
| 2012-11-23 23:00:00 | 2.34 |
| 2012-11-24 | 2.34 |
| 2012-11-24 01:00:00 | 2.34 |
| 2012-11-24 02:00:00 | 2.34 |
| 2012-11-24 03:00:00 | 2.6 |
| 2012-11-24 04:00:00 | 2.34 |
| 2012-11-24 05:00:00 | 2.34 |
| 2012-11-24 06:00:00 | 2.34 |
| 2012-11-24 07:00:00 | 2.34 |
| 2012-11-24 08:00:00 | 2.34 |
| 2012-11-24 09:00:00 | 2.34 |
| 2012-11-24 10:00:00 | 2.34 |
| 2012-11-24 11:00:00 | 2.34 |
| 2012-11-24 12:00:00 | 2.34 |
| 2012-11-24 13:00:00 | 2.34 |
| 2012-11-24 14:00:00 | 2.08 |
| 2012-11-24 15:00:00 | 2.34 |
| 2012-11-24 16:00:00 | 2.34 |
| 2012-11-24 17:00:00 | 2.34 |
| 2012-11-24 18:00:00 | 2.34 |
| 2012-11-24 19:00:00 | 2.34 |
| 2012-11-24 20:00:00 | 2.34 |
| 2012-11-24 21:00:00 | 2.34 |
| 2012-11-24 22:00:00 | 2.6 |
| 2012-11-24 23:00:00 | 2.34 |
| 2012-11-25 | 2.34 |
| 2012-11-25 01:00:00 | 2.34 |
| 2012-11-25 02:00:00 | 2.34 |
| 2012-11-25 03:00:00 | 2.34 |
| 2012-11-25 04:00:00 | 2.34 |
| 2012-11-25 05:00:00 | 2.34 |
| 2012-11-25 06:00:00 | 2.34 |
| 2012-11-25 07:00:00 | 2.6 |
| 2012-11-25 08:00:00 | 2.34 |
| 2012-11-25 09:00:00 | 2.34 |
| 2012-11-25 10:00:00 | 2.34 |
| 2012-11-25 11:00:00 | 2.34 |
| 2012-11-25 12:00:00 | 2.08 |
| 2012-11-25 13:00:00 | 2.34 |
| 2012-11-25 14:00:00 | 2.34 |
| 2012-11-25 15:00:00 | 2.34 |
| 2012-11-25 16:00:00 | 2.34 |
| 2012-11-25 17:00:00 | 2.34 |
| 2012-11-25 18:00:00 | 2.34 |
| 2012-11-25 19:00:00 | 2.34 |
| 2012-11-25 20:00:00 | 2.34 |
| 2012-11-25 21:00:00 | 2.6 |
| 2012-11-25 22:00:00 | 2.34 |
| 2012-11-25 23:00:00 | 2.34 |
| 2012-11-26 | 2.34 |
| 2012-11-26 01:00:00 | 2.34 |
| 2012-11-26 02:00:00 | 2.34 |
| 2012-11-26 03:00:00 | 2.34 |
| 2012-11-26 04:00:00 | 2.34 |
| 2012-11-26 05:00:00 | 2.34 |
| 2012-11-26 06:00:00 | 2.34 |
| 2012-11-26 07:00:00 | 2.6 |
| 2012-11-26 08:00:00 | 2.34 |
| 2012-11-26 09:00:00 | 2.34 |
| 2012-11-26 10:00:00 | 2.34 |
| 2012-11-26 11:00:00 | 2.34 |
| 2012-11-26 12:00:00 | 2.34 |
| 2012-11-26 13:00:00 | 2.34 |
| 2012-11-26 14:00:00 | 2.34 |
| 2012-11-26 15:00:00 | 2.34 |
| 2012-11-26 16:00:00 | 2.6 |
| 2012-11-26 17:00:00 | 2.34 |
| 2012-11-26 18:00:00 | 2.34 |
| 2012-11-26 19:00:00 | 2.34 |
| 2012-11-26 20:00:00 | 2.34 |
| 2012-11-26 21:00:00 | 2.6 |
| 2012-11-26 22:00:00 | 2.34 |
| 2012-11-26 23:00:00 | 2.34 |
| 2012-11-27 | 2.34 |
| 2012-11-27 01:00:00 | 2.34 |
| 2012-11-27 02:00:00 | 2.6 |
| 2012-11-27 03:00:00 | 2.34 |
| 2012-11-27 04:00:00 | 2.34 |
| 2012-11-27 05:00:00 | 2.34 |
| 2012-11-27 06:00:00 | 2.34 |
| 2012-11-27 07:00:00 | 2.34 |
| 2012-11-27 08:00:00 | 2.34 |
| 2012-11-27 09:00:00 | 2.34 |
| 2012-11-27 10:00:00 | 2.34 |
| 2012-11-27 11:00:00 | 2.6 |
| 2012-11-27 12:00:00 | 2.34 |
| 2012-11-27 13:00:00 | 2.34 |
| 2012-11-27 14:00:00 | 2.34 |
| 2012-11-27 15:00:00 | 2.34 |
| 2012-11-27 16:00:00 | 2.34 |
| 2012-11-27 17:00:00 | 2.34 |
| 2012-11-27 18:00:00 | 2.6 |
| 2012-11-27 19:00:00 | 2.34 |
| 2012-11-27 20:00:00 | 2.34 |
| 2012-11-27 21:00:00 | 2.6 |
| 2012-11-27 22:00:00 | 2.34 |
| 2012-11-27 23:00:00 | 2.34 |
| 2012-11-28 | 2.34 |
| 2012-11-28 01:00:00 | 2.34 |
| 2012-11-28 02:00:00 | 2.34 |
| 2012-11-28 03:00:00 | 2.34 |
| 2012-11-28 04:00:00 | 2.6 |
| 2012-11-28 05:00:00 | 2.34 |
| 2012-11-28 06:00:00 | 2.34 |
| 2012-11-28 07:00:00 | 2.34 |
| 2012-11-28 08:00:00 | 2.34 |
| 2012-11-28 09:00:00 | 2.34 |
| 2012-11-28 10:00:00 | 2.34 |
| 2012-11-28 11:00:00 | 2.34 |
| 2012-11-28 12:00:00 | 2.34 |
| 2012-11-28 13:00:00 | 2.6 |
| 2012-11-28 14:00:00 | 2.34 |
| 2012-11-28 15:00:00 | 2.34 |
| 2012-11-28 16:00:00 | 2.34 |
| 2012-11-28 17:00:00 | 2.34 |
| 2012-11-28 18:00:00 | 2.34 |
| 2012-11-28 19:00:00 | 2.6 |
| 2012-11-28 20:00:00 | 2.34 |
| 2012-11-28 21:00:00 | 2.34 |
| 2012-11-28 22:00:00 | 2.34 |
| 2012-11-28 23:00:00 | 2.34 |
| 2012-11-29 | 2.34 |
| 2012-11-29 01:00:00 | 2.6 |
| 2012-11-29 02:00:00 | 2.34 |
| 2012-11-29 03:00:00 | 2.34 |
| 2012-11-29 04:00:00 | 2.34 |
| 2012-11-29 05:00:00 | 2.34 |
| 2012-11-29 06:00:00 | 2.34 |
| 2012-11-29 07:00:00 | 2.34 |
| 2012-11-29 08:00:00 | 2.34 |
| 2012-11-29 09:00:00 | 2.34 |
| 2012-11-29 10:00:00 | 2.34 |
| 2012-11-29 11:00:00 | 2.34 |
| 2012-11-29 12:00:00 | 2.34 |
| 2012-11-29 13:00:00 | 2.6 |
| 2012-11-29 14:00:00 | 3.12 |
| 2012-11-29 15:00:00 | 2.34 |
| 2012-11-29 16:00:00 | 2.34 |
| 2012-11-29 17:00:00 | 2.34 |
| 2012-11-29 18:00:00 | 2.34 |
| 2012-11-29 19:00:00 | 2.6 |
| 2012-11-29 20:00:00 | 2.34 |
| 2012-11-29 21:00:00 | 2.34 |
| 2012-11-29 22:00:00 | 2.34 |
| 2012-11-29 23:00:00 | 2.6 |
| 2012-11-30 | 2.34 |
| 2012-11-30 01:00:00 | 2.34 |
| 2012-11-30 02:00:00 | 2.34 |
| 2012-11-30 03:00:00 | 2.34 |
| 2012-11-30 04:00:00 | 2.34 |
| 2012-11-30 05:00:00 | 2.34 |
| 2012-11-30 06:00:00 | 2.34 |
| 2012-11-30 07:00:00 | 2.34 |
| 2012-11-30 08:00:00 | 2.34 |
| 2012-11-30 09:00:00 | 2.34 |
| 2012-11-30 10:00:00 | 2.34 |
| 2012-11-30 11:00:00 | 2.34 |
| 2012-11-30 12:00:00 | 2.34 |
| 2012-11-30 13:00:00 | 2.34 |
| 2012-11-30 14:00:00 | 2.34 |
| 2012-11-30 15:00:00 | 2.34 |
| 2012-11-30 16:00:00 | 2.34 |
| 2012-11-30 17:00:00 | 2.6 |
| 2012-11-30 18:00:00 | 2.34 |
| 2012-11-30 19:00:00 | 2.34 |
| 2012-11-30 20:00:00 | 2.34 |
| 2012-11-30 21:00:00 | 2.34 |
| 2012-11-30 22:00:00 | 2.34 |
| 2012-11-30 23:00:00 | 2.34 |
| 2012-12-01 | 2.6 |
| 2012-12-01 01:00:00 | 2.34 |
| 2012-12-01 02:00:00 | 2.34 |
| 2012-12-01 03:00:00 | 2.34 |
| 2012-12-01 04:00:00 | 2.34 |
| 2012-12-01 05:00:00 | 2.34 |
| 2012-12-01 06:00:00 | 2.34 |
| 2012-12-01 07:00:00 | 2.34 |
| 2012-12-01 08:00:00 | 2.34 |
| 2012-12-01 09:00:00 | 2.34 |
| 2012-12-01 10:00:00 | 2.34 |
| 2012-12-01 11:00:00 | 2.34 |
| 2012-12-01 12:00:00 | 2.34 |
| 2012-12-01 13:00:00 | 2.34 |
| 2012-12-01 14:00:00 | 2.34 |
| 2012-12-01 15:00:00 | 2.34 |
| 2012-12-01 16:00:00 | 2.6 |
| 2012-12-01 17:00:00 | 2.34 |
| 2012-12-01 18:00:00 | 2.34 |
| 2012-12-01 19:00:00 | 2.34 |
| 2012-12-01 20:00:00 | 2.34 |
| 2012-12-01 21:00:00 | 2.6 |
| 2012-12-01 22:00:00 | 2.34 |
| 2012-12-01 23:00:00 | 2.34 |
| 2012-12-02 | 2.34 |
| 2012-12-02 01:00:00 | 2.34 |
| 2012-12-02 02:00:00 | 2.34 |
| 2012-12-02 03:00:00 | 2.34 |
| 2012-12-02 04:00:00 | 2.34 |
| 2012-12-02 05:00:00 | 2.34 |
| 2012-12-02 06:00:00 | 2.34 |
| 2012-12-02 07:00:00 | 2.6 |
| 2012-12-02 08:00:00 | 2.34 |
| 2012-12-02 09:00:00 | 2.34 |
| 2012-12-02 10:00:00 | 2.34 |
| 2012-12-02 11:00:00 | 2.34 |
| 2012-12-02 12:00:00 | 2.34 |
| 2012-12-02 13:00:00 | 2.6 |
| 2012-12-02 14:00:00 | 2.34 |
| 2012-12-02 15:00:00 | 2.34 |
| 2012-12-02 16:00:00 | 2.34 |
| 2012-12-02 17:00:00 | 2.34 |
| 2012-12-02 18:00:00 | 2.6 |
| 2012-12-02 19:00:00 | 2.34 |
| 2012-12-02 20:00:00 | 2.34 |
| 2012-12-02 21:00:00 | 2.34 |
| 2012-12-02 22:00:00 | 2.6 |
| 2012-12-02 23:00:00 | 2.34 |
| 2012-12-03 | 2.34 |
| 2012-12-03 01:00:00 | 2.34 |
| 2012-12-03 02:00:00 | 2.6 |
| 2012-12-03 03:00:00 | 2.34 |
| 2012-12-03 04:00:00 | 2.34 |
| 2012-12-03 05:00:00 | 2.34 |
| 2012-12-03 06:00:00 | 2.6 |
| 2012-12-03 07:00:00 | 2.34 |
| 2012-12-03 08:00:00 | 2.34 |
| 2012-12-03 09:00:00 | 2.34 |
| 2012-12-03 10:00:00 | 2.34 |
| 2012-12-03 11:00:00 | 2.34 |
| 2012-12-03 12:00:00 | 2.6 |
| 2012-12-03 13:00:00 | 2.34 |
| 2012-12-03 14:00:00 | 2.34 |
| 2012-12-03 15:00:00 | 2.34 |
| 2012-12-03 16:00:00 | 2.34 |
| 2012-12-03 17:00:00 | 2.6 |
| 2012-12-03 18:00:00 | 2.34 |
| 2012-12-03 19:00:00 | 2.34 |
| 2012-12-03 20:00:00 | 2.34 |
| 2012-12-03 21:00:00 | 2.6 |
| 2012-12-03 22:00:00 | 2.34 |
| 2012-12-03 23:00:00 | 2.34 |
| 2012-12-04 | 2.34 |
| 2012-12-04 01:00:00 | 2.34 |
| 2012-12-04 02:00:00 | 2.34 |
| 2012-12-04 03:00:00 | 2.34 |
| 2012-12-04 04:00:00 | 2.34 |
| 2012-12-04 05:00:00 | 2.34 |
| 2012-12-04 06:00:00 | 2.6 |
| 2012-12-04 07:00:00 | 2.34 |
| 2012-12-04 08:00:00 | 2.34 |
| 2012-12-04 09:00:00 | 2.34 |
| 2012-12-04 10:00:00 | 2.34 |
| 2012-12-04 11:00:00 | 2.34 |
| 2012-12-04 12:00:00 | 2.34 |
| 2012-12-04 13:00:00 | 2.34 |
| 2012-12-04 14:00:00 | 2.6 |
| 2012-12-04 15:00:00 | 2.34 |
| 2012-12-04 16:00:00 | 2.34 |
| 2012-12-04 17:00:00 | 2.34 |
| 2012-12-04 18:00:00 | 2.34 |
| 2012-12-04 19:00:00 | 2.6 |
| 2012-12-04 20:00:00 | 2.34 |
| 2012-12-04 21:00:00 | 2.34 |
| 2012-12-04 22:00:00 | 2.34 |
| 2012-12-04 23:00:00 | 2.34 |
| 2012-12-05 | 2.34 |
| 2012-12-05 01:00:00 | 2.34 |
| 2012-12-05 02:00:00 | 2.34 |
| 2012-12-05 03:00:00 | 2.6 |
| 2012-12-05 04:00:00 | 2.34 |
| 2012-12-05 05:00:00 | 2.34 |
| 2012-12-05 06:00:00 | 2.34 |
| 2012-12-05 07:00:00 | 2.34 |
| 2012-12-05 08:00:00 | 2.34 |
| 2012-12-05 09:00:00 | 2.34 |
| 2012-12-05 10:00:00 | 2.34 |
| 2012-12-05 11:00:00 | 2.6 |
| 2012-12-05 12:00:00 | 2.34 |
| 2012-12-05 13:00:00 | 2.34 |
| 2012-12-05 14:00:00 | 2.34 |
| 2012-12-05 15:00:00 | 2.34 |
| 2012-12-05 16:00:00 | 2.34 |
| 2012-12-05 17:00:00 | 2.6 |
| 2012-12-05 18:00:00 | 2.34 |
| 2012-12-05 19:00:00 | 2.34 |
| 2012-12-05 20:00:00 | 2.34 |
| 2012-12-05 21:00:00 | 2.6 |
| 2012-12-05 22:00:00 | 2.34 |
| 2012-12-05 23:00:00 | 2.34 |
| 2012-12-06 | 2.34 |
| 2012-12-06 01:00:00 | 2.34 |
| 2012-12-06 02:00:00 | 2.34 |
| 2012-12-06 03:00:00 | 2.34 |
| 2012-12-06 04:00:00 | 2.34 |
| 2012-12-06 05:00:00 | 2.34 |
| 2012-12-06 06:00:00 | 2.34 |
| 2012-12-06 07:00:00 | 2.6 |
| 2012-12-06 08:00:00 | 2.34 |
| 2012-12-06 09:00:00 | 2.34 |
| 2012-12-06 10:00:00 | 2.34 |
| 2012-12-06 11:00:00 | 2.34 |
| 2012-12-06 12:00:00 | 2.34 |
| 2012-12-06 13:00:00 | 2.34 |
| 2012-12-06 14:00:00 | 2.6 |
| 2012-12-06 15:00:00 | 2.34 |
| 2012-12-06 16:00:00 | 2.34 |
| 2012-12-06 17:00:00 | 2.34 |
| 2012-12-06 18:00:00 | 2.34 |
| 2012-12-06 19:00:00 | 2.34 |
| 2012-12-06 20:00:00 | 2.6 |
| 2012-12-06 21:00:00 | 2.34 |
| 2012-12-06 22:00:00 | 2.34 |
| 2012-12-06 23:00:00 | 2.6 |
| 2012-12-07 | 2.34 |
| 2012-12-07 01:00:00 | 2.34 |
| 2012-12-07 02:00:00 | 2.34 |
| 2012-12-07 03:00:00 | 2.34 |
| 2012-12-07 04:00:00 | 2.34 |
| 2012-12-07 05:00:00 | 2.34 |
| 2012-12-07 06:00:00 | 2.34 |
| 2012-12-07 07:00:00 | 2.34 |
| 2012-12-07 08:00:00 | 2.34 |
| 2012-12-07 09:00:00 | 2.34 |
| 2012-12-07 10:00:00 | 2.34 |
| 2012-12-07 11:00:00 | 2.34 |
| 2012-12-07 12:00:00 | 2.34 |
| 2012-12-07 13:00:00 | 2.6 |
| 2012-12-07 14:00:00 | 2.34 |
| 2012-12-07 15:00:00 | 2.34 |
| 2012-12-07 16:00:00 | 2.34 |
| 2012-12-07 17:00:00 | 2.34 |
| 2012-12-07 18:00:00 | 2.34 |
| 2012-12-07 19:00:00 | 2.34 |
| 2012-12-07 20:00:00 | 2.34 |
| 2012-12-07 21:00:00 | 2.6 |
| 2012-12-07 22:00:00 | 2.34 |
| 2012-12-07 23:00:00 | 2.34 |
| 2012-12-08 | 2.34 |
| 2012-12-08 01:00:00 | 2.6 |
| 2012-12-08 02:00:00 | 2.34 |
| 2012-12-08 03:00:00 | 2.34 |
| 2012-12-08 04:00:00 | 2.6 |
| 2012-12-08 05:00:00 | 2.34 |
| 2012-12-08 06:00:00 | 2.34 |
| 2012-12-08 07:00:00 | 2.34 |
| 2012-12-08 08:00:00 | 2.34 |
| 2012-12-08 09:00:00 | 2.34 |
| 2012-12-08 10:00:00 | 2.34 |
| 2012-12-08 11:00:00 | 2.34 |
| 2012-12-08 12:00:00 | 2.08 |
| 2012-12-08 13:00:00 | 2.34 |
| 2012-12-08 14:00:00 | 2.34 |
| 2012-12-08 15:00:00 | 2.34 |
| 2012-12-08 16:00:00 | 2.34 |
| 2012-12-08 17:00:00 | 2.34 |
| 2012-12-08 18:00:00 | 2.08 |
| 2012-12-08 19:00:00 | 2.6 |
| 2012-12-08 20:00:00 | 2.34 |
| 2012-12-08 21:00:00 | 2.34 |
| 2012-12-08 22:00:00 | 2.34 |
| 2012-12-08 23:00:00 | 2.6 |
| 2012-12-09 | 2.34 |
| 2012-12-09 01:00:00 | 2.34 |
| 2012-12-09 02:00:00 | 2.6 |
| 2012-12-09 03:00:00 | 2.34 |
| 2012-12-09 04:00:00 | 2.34 |
| 2012-12-09 05:00:00 | 2.6 |
| 2012-12-09 06:00:00 | 2.34 |
| 2012-12-09 07:00:00 | 2.34 |
| 2012-12-09 08:00:00 | 2.34 |
| 2012-12-09 09:00:00 | 2.34 |
| 2012-12-09 10:00:00 | 2.34 |
| 2012-12-09 11:00:00 | 2.08 |
| 2012-12-09 12:00:00 | 2.34 |
| 2012-12-09 13:00:00 | 2.34 |
| 2012-12-09 14:00:00 | 2.34 |
| 2012-12-09 15:00:00 | 2.34 |
| 2012-12-09 16:00:00 | 2.08 |
| 2012-12-09 17:00:00 | 2.34 |
| 2012-12-09 18:00:00 | 2.34 |
| 2012-12-09 19:00:00 | 2.34 |
| 2012-12-09 20:00:00 | 2.6 |
| 2012-12-09 21:00:00 | 2.34 |
| 2012-12-09 22:00:00 | 2.34 |
| 2012-12-09 23:00:00 | 2.34 |
| 2012-12-10 | 2.6 |
| 2012-12-10 01:00:00 | 2.34 |
| 2012-12-10 02:00:00 | 2.34 |
| 2012-12-10 03:00:00 | 2.6 |
| 2012-12-10 04:00:00 | 2.34 |
| 2012-12-10 05:00:00 | 2.34 |
| 2012-12-10 06:00:00 | 2.6 |
| 2012-12-10 07:00:00 | 2.34 |
| 2012-12-10 08:00:00 | 2.34 |
| 2012-12-10 09:00:00 | 2.34 |
| 2012-12-10 10:00:00 | 2.34 |
| 2012-12-10 11:00:00 | 2.34 |
| 2012-12-10 12:00:00 | 2.34 |
| 2012-12-10 13:00:00 | 2.34 |
| 2012-12-10 14:00:00 | 2.34 |
| 2012-12-10 15:00:00 | 2.34 |
| 2012-12-10 16:00:00 | 2.34 |
| 2012-12-10 17:00:00 | 2.34 |
| 2012-12-10 18:00:00 | 2.34 |
| 2012-12-10 19:00:00 | 2.34 |
| 2012-12-10 20:00:00 | 2.34 |
| 2012-12-10 21:00:00 | 2.6 |
| 2012-12-10 22:00:00 | 2.34 |
| 2012-12-10 23:00:00 | 2.34 |
| 2012-12-11 | 2.34 |
| 2012-12-11 01:00:00 | 2.6 |
| 2012-12-11 02:00:00 | 2.34 |
| 2012-12-11 03:00:00 | 2.34 |
| 2012-12-11 04:00:00 | 2.6 |
| 2012-12-11 05:00:00 | 2.34 |
| 2012-12-11 06:00:00 | 2.34 |
| 2012-12-11 07:00:00 | 2.34 |
| 2012-12-11 08:00:00 | 2.34 |
| 2012-12-11 09:00:00 | 2.34 |
| 2012-12-11 10:00:00 | 2.34 |
| 2012-12-11 11:00:00 | 2.34 |
| 2012-12-11 12:00:00 | 2.34 |
| 2012-12-11 13:00:00 | 2.34 |
| 2012-12-11 14:00:00 | 2.34 |
| 2012-12-11 15:00:00 | 2.34 |
| 2012-12-11 16:00:00 | 2.34 |
| 2012-12-11 17:00:00 | 2.34 |
| 2012-12-11 18:00:00 | 2.34 |
| 2012-12-11 19:00:00 | 2.34 |
| 2012-12-11 20:00:00 | 2.34 |
| 2012-12-11 21:00:00 | 2.6 |
| 2012-12-11 22:00:00 | 2.34 |
| 2012-12-11 23:00:00 | 2.34 |
| 2012-12-12 | 2.34 |
| 2012-12-12 01:00:00 | 2.34 |
| 2012-12-12 02:00:00 | 2.34 |
| 2012-12-12 03:00:00 | 2.34 |
| 2012-12-12 04:00:00 | 2.34 |
| 2012-12-12 05:00:00 | 2.34 |
| 2012-12-12 06:00:00 | 2.34 |
| 2012-12-12 07:00:00 | 2.34 |
| 2012-12-12 08:00:00 | 2.6 |
| 2012-12-12 09:00:00 | 2.34 |
| 2012-12-12 10:00:00 | 2.34 |
| 2012-12-12 11:00:00 | 2.34 |
| 2012-12-12 12:00:00 | 2.34 |
| 2012-12-12 13:00:00 | 2.34 |
| 2012-12-12 14:00:00 | 3.64 |
| 2012-12-12 15:00:00 | 2.34 |
| 2012-12-12 16:00:00 | 2.34 |
| 2012-12-12 17:00:00 | 2.34 |
| 2012-12-12 18:00:00 | 2.34 |
| 2012-12-12 19:00:00 | 2.34 |
| 2012-12-12 20:00:00 | 2.34 |
| 2012-12-12 21:00:00 | 2.6 |
| 2012-12-12 22:00:00 | 2.34 |
| 2012-12-12 23:00:00 | 2.34 |
| 2012-12-13 | 2.34 |
| 2012-12-13 01:00:00 | 2.34 |
| 2012-12-13 02:00:00 | 2.34 |
| 2012-12-13 03:00:00 | 2.34 |
| 2012-12-13 04:00:00 | 2.34 |
| 2012-12-13 05:00:00 | 2.34 |
| 2012-12-13 06:00:00 | 2.34 |
| 2012-12-13 07:00:00 | 2.34 |
| 2012-12-13 08:00:00 | 2.34 |
| 2012-12-13 09:00:00 | 2.34 |
| 2012-12-13 10:00:00 | 2.34 |
| 2012-12-13 11:00:00 | 2.34 |
| 2012-12-13 12:00:00 | 2.34 |
| 2012-12-13 13:00:00 | 2.34 |
| 2012-12-13 14:00:00 | 2.6 |
| 2012-12-13 15:00:00 | 2.34 |
| 2012-12-13 16:00:00 | 2.34 |
| 2012-12-13 17:00:00 | 2.34 |
| 2012-12-13 18:00:00 | 2.34 |
| 2012-12-13 19:00:00 | 2.34 |
| 2012-12-13 20:00:00 | 2.34 |
| 2012-12-13 21:00:00 | 2.6 |
| 2012-12-13 22:00:00 | 2.34 |
| 2012-12-13 23:00:00 | 2.34 |
| 2012-12-14 | 2.6 |
| 2012-12-14 01:00:00 | 2.34 |
| 2012-12-14 02:00:00 | 2.34 |
| 2012-12-14 03:00:00 | 2.6 |
| 2012-12-14 04:00:00 | 2.34 |
| 2012-12-14 05:00:00 | 2.34 |
| 2012-12-14 06:00:00 | 2.34 |
| 2012-12-14 07:00:00 | 2.34 |
| 2012-12-14 08:00:00 | 2.34 |
| 2012-12-14 09:00:00 | 2.34 |
| 2012-12-14 10:00:00 | 2.34 |
| 2012-12-14 11:00:00 | 2.34 |
| 2012-12-14 12:00:00 | 2.34 |
| 2012-12-14 13:00:00 | 2.34 |
| 2012-12-14 14:00:00 | 2.34 |
| 2012-12-14 15:00:00 | 2.34 |
| 2012-12-14 16:00:00 | 2.34 |
| 2012-12-14 17:00:00 | 2.34 |
| 2012-12-14 18:00:00 | 2.6 |
| 2012-12-14 19:00:00 | 2.34 |
| 2012-12-14 20:00:00 | 2.34 |
| 2012-12-14 21:00:00 | 2.34 |
| 2012-12-14 22:00:00 | 2.6 |
| 2012-12-14 23:00:00 | 2.34 |
| 2012-12-15 | 2.34 |
| 2012-12-15 01:00:00 | 2.34 |
| 2012-12-15 02:00:00 | 2.34 |
| 2012-12-15 03:00:00 | 2.34 |
| 2012-12-15 04:00:00 | 2.34 |
| 2012-12-15 05:00:00 | 2.34 |
| 2012-12-15 06:00:00 | 2.34 |
| 2012-12-15 07:00:00 | 2.34 |
| 2012-12-15 08:00:00 | 2.34 |
| 2012-12-15 09:00:00 | 2.6 |
| 2012-12-15 10:00:00 | 2.34 |
| 2012-12-15 11:00:00 | 2.34 |
| 2012-12-15 12:00:00 | 2.34 |
| 2012-12-15 13:00:00 | 2.34 |
| 2012-12-15 14:00:00 | 2.34 |
| 2012-12-15 15:00:00 | 2.34 |
| 2012-12-15 16:00:00 | 2.6 |
| 2012-12-15 17:00:00 | 2.34 |
| 2012-12-15 18:00:00 | 2.34 |
| 2012-12-15 19:00:00 | 2.34 |
| 2012-12-15 20:00:00 | 2.34 |
| 2012-12-15 21:00:00 | 2.34 |
| 2012-12-15 22:00:00 | 2.34 |
| 2012-12-15 23:00:00 | 2.34 |
| 2012-12-16 | 2.34 |
| 2012-12-16 01:00:00 | 2.34 |
| 2012-12-16 02:00:00 | 2.34 |
| 2012-12-16 03:00:00 | 2.34 |
| 2012-12-16 04:00:00 | 2.34 |
| 2012-12-16 05:00:00 | 2.34 |
| 2012-12-16 06:00:00 | 2.34 |
| 2012-12-16 07:00:00 | 2.34 |
| 2012-12-16 08:00:00 | 2.34 |
| 2012-12-16 09:00:00 | 2.6 |
| 2012-12-16 10:00:00 | 2.34 |
| 2012-12-16 11:00:00 | 2.34 |
| 2012-12-16 12:00:00 | 2.34 |
| 2012-12-16 13:00:00 | 2.34 |
| 2012-12-16 14:00:00 | 2.34 |
| 2012-12-16 15:00:00 | 2.6 |
| 2012-12-16 16:00:00 | 2.34 |
| 2012-12-16 17:00:00 | 2.34 |
| 2012-12-16 18:00:00 | 2.34 |
| 2012-12-16 19:00:00 | 2.34 |
| 2012-12-16 20:00:00 | 2.34 |
| 2012-12-16 21:00:00 | 2.6 |
| 2012-12-16 22:00:00 | 2.34 |
| 2012-12-16 23:00:00 | 2.34 |
| 2012-12-17 | 2.34 |
| 2012-12-17 01:00:00 | 2.34 |
| 2012-12-17 02:00:00 | 2.34 |
| 2012-12-17 03:00:00 | 2.34 |
| 2012-12-17 04:00:00 | 2.34 |
| 2012-12-17 05:00:00 | 2.34 |
| 2012-12-17 06:00:00 | 2.34 |
| 2012-12-17 07:00:00 | 2.34 |
| 2012-12-17 08:00:00 | 2.34 |
| 2012-12-17 09:00:00 | 2.34 |
| 2012-12-17 10:00:00 | 2.34 |
| 2012-12-17 11:00:00 | 2.34 |
| 2012-12-17 12:00:00 | 2.34 |
| 2012-12-17 13:00:00 | 2.34 |
| 2012-12-17 14:00:00 | 2.34 |
| 2012-12-17 15:00:00 | 2.34 |
| 2012-12-17 16:00:00 | 2.6 |
| 2012-12-17 17:00:00 | 2.34 |
| 2012-12-17 18:00:00 | 2.34 |
| 2012-12-17 19:00:00 | 2.34 |
| 2012-12-17 20:00:00 | 2.34 |
| 2012-12-17 21:00:00 | 2.34 |
| 2012-12-17 22:00:00 | 2.6 |
| 2012-12-17 23:00:00 | 2.34 |
| 2012-12-18 | 2.34 |
| 2012-12-18 01:00:00 | 2.34 |
| 2012-12-18 02:00:00 | 2.34 |
| 2012-12-18 03:00:00 | 2.34 |
| 2012-12-18 04:00:00 | 2.34 |
| 2012-12-18 05:00:00 | 2.34 |
| 2012-12-18 06:00:00 | 2.34 |
| 2012-12-18 07:00:00 | 2.34 |
| 2012-12-18 08:00:00 | 2.34 |
| 2012-12-18 09:00:00 | 2.34 |
| 2012-12-18 10:00:00 | 2.34 |
| 2012-12-18 11:00:00 | 2.6 |
| 2012-12-18 12:00:00 | 2.34 |
| 2012-12-18 13:00:00 | 2.34 |
| 2012-12-18 14:00:00 | 2.34 |
| 2012-12-18 15:00:00 | 2.34 |
| 2012-12-18 16:00:00 | 2.34 |
| 2012-12-18 17:00:00 | 2.34 |
| 2012-12-18 18:00:00 | 2.34 |
| 2012-12-18 19:00:00 | 2.6 |
| 2012-12-18 20:00:00 | 2.34 |
| 2012-12-18 21:00:00 | 2.34 |
| 2012-12-18 22:00:00 | 2.34 |
| 2012-12-18 23:00:00 | 2.6 |
| 2012-12-19 | 2.34 |
| 2012-12-19 01:00:00 | 2.6 |
| 2012-12-19 02:00:00 | 2.34 |
| 2012-12-19 03:00:00 | 2.34 |
| 2012-12-19 04:00:00 | 2.6 |
| 2012-12-19 05:00:00 | 2.34 |
| 2012-12-19 06:00:00 | 2.34 |
| 2012-12-19 07:00:00 | 2.34 |
| 2012-12-19 08:00:00 | 2.34 |
| 2012-12-19 09:00:00 | 2.6 |
| 2012-12-19 10:00:00 | 2.34 |
| 2012-12-19 11:00:00 | 2.34 |
| 2012-12-19 12:00:00 | 2.34 |
| 2012-12-19 13:00:00 | 2.34 |
| 2012-12-19 14:00:00 | 2.34 |
| 2012-12-19 15:00:00 | 2.34 |
| 2012-12-19 16:00:00 | 2.34 |
| 2012-12-19 17:00:00 | 2.34 |
| 2012-12-19 18:00:00 | 2.34 |
| 2012-12-19 19:00:00 | 2.6 |
| 2012-12-19 20:00:00 | 2.34 |
| 2012-12-19 21:00:00 | 2.34 |
| 2012-12-19 22:00:00 | 2.34 |
| 2012-12-19 23:00:00 | 2.34 |
| 2012-12-20 | 2.34 |
| 2012-12-20 01:00:00 | 2.34 |
| 2012-12-20 02:00:00 | 2.34 |
| 2012-12-20 03:00:00 | 2.34 |
| 2012-12-20 04:00:00 | 2.34 |
| 2012-12-20 05:00:00 | 2.34 |
| 2012-12-20 06:00:00 | 2.6 |
| 2012-12-20 07:00:00 | 2.34 |
| 2012-12-20 08:00:00 | 2.34 |
| 2012-12-20 09:00:00 | 2.34 |
| 2012-12-20 10:00:00 | 2.34 |
| 2012-12-20 11:00:00 | 2.34 |
| 2012-12-20 12:00:00 | 2.34 |
| 2012-12-20 13:00:00 | 2.34 |
| 2012-12-20 14:00:00 | 2.34 |
| 2012-12-20 15:00:00 | 2.34 |
| 2012-12-20 16:00:00 | 2.6 |
| 2012-12-20 17:00:00 | 2.34 |
| 2012-12-20 18:00:00 | 2.34 |
| 2012-12-20 19:00:00 | 2.34 |
| 2012-12-20 20:00:00 | 2.34 |
| 2012-12-20 21:00:00 | 2.34 |
| 2012-12-20 22:00:00 | 2.6 |
| 2012-12-20 23:00:00 | 2.34 |
| 2012-12-21 | 2.34 |
| 2012-12-21 01:00:00 | 2.34 |
| 2012-12-21 02:00:00 | 2.34 |
| 2012-12-21 03:00:00 | 2.34 |
| 2012-12-21 04:00:00 | 2.34 |
| 2012-12-21 05:00:00 | 2.34 |
| 2012-12-21 06:00:00 | 2.6 |
| 2012-12-21 07:00:00 | 2.34 |
| 2012-12-21 08:00:00 | 2.34 |
| 2012-12-21 09:00:00 | 2.34 |
| 2012-12-21 10:00:00 | 2.34 |
| 2012-12-21 11:00:00 | 2.34 |
| 2012-12-21 12:00:00 | 2.34 |
| 2012-12-21 13:00:00 | 2.34 |
| 2012-12-21 14:00:00 | 2.34 |
| 2012-12-21 15:00:00 | 2.34 |
| 2012-12-21 16:00:00 | 2.34 |
| 2012-12-21 17:00:00 | 2.34 |
| 2012-12-21 18:00:00 | 2.34 |
| 2012-12-21 19:00:00 | 2.34 |
| 2012-12-21 20:00:00 | 2.34 |
| 2012-12-21 21:00:00 | 2.34 |
| 2012-12-21 22:00:00 | 2.34 |
| 2012-12-21 23:00:00 | 2.34 |
| 2012-12-22 | 2.34 |
| 2012-12-22 01:00:00 | 2.34 |
| 2012-12-22 02:00:00 | 2.34 |
| 2012-12-22 03:00:00 | 2.34 |
| 2012-12-22 04:00:00 | 2.34 |
| 2012-12-22 05:00:00 | 2.34 |
| 2012-12-22 06:00:00 | 2.34 |
| 2012-12-22 07:00:00 | 2.34 |
| 2012-12-22 08:00:00 | 2.34 |
| 2012-12-22 09:00:00 | 2.34 |
| 2012-12-22 10:00:00 | 2.34 |
| 2012-12-22 11:00:00 | 2.34 |
| 2012-12-22 12:00:00 | 2.34 |
| 2012-12-22 13:00:00 | 2.34 |
| 2012-12-22 14:00:00 | 2.6 |
| 2012-12-22 15:00:00 | 2.34 |
| 2012-12-22 16:00:00 | 2.34 |
| 2012-12-22 17:00:00 | 2.34 |
| 2012-12-22 18:00:00 | 2.34 |
| 2012-12-22 19:00:00 | 2.6 |
| 2012-12-22 20:00:00 | 2.08 |
| 2012-12-22 21:00:00 | 2.34 |
| 2012-12-22 22:00:00 | 2.34 |
| 2012-12-22 23:00:00 | 2.34 |
| 2012-12-23 | 2.6 |
| 2012-12-23 01:00:00 | 2.34 |
| 2012-12-23 02:00:00 | 2.34 |
| 2012-12-23 03:00:00 | 2.34 |
| 2012-12-23 04:00:00 | 2.34 |
| 2012-12-23 05:00:00 | 2.34 |
| 2012-12-23 06:00:00 | 2.34 |
| 2012-12-23 07:00:00 | 2.34 |
| 2012-12-23 08:00:00 | 2.34 |
| 2012-12-23 09:00:00 | 2.34 |
| 2012-12-23 10:00:00 | 2.34 |
| 2012-12-23 11:00:00 | 2.34 |
| 2012-12-23 12:00:00 | 2.34 |
| 2012-12-23 13:00:00 | 2.34 |
| 2012-12-23 14:00:00 | 2.6 |
| 2012-12-23 15:00:00 | 2.34 |
| 2012-12-23 16:00:00 | 2.34 |
| 2012-12-23 17:00:00 | 2.34 |
| 2012-12-23 18:00:00 | 2.34 |
| 2012-12-23 19:00:00 | 2.34 |
| 2012-12-23 20:00:00 | 2.34 |
| 2012-12-23 21:00:00 | 2.34 |
| 2012-12-23 22:00:00 | 2.34 |
| 2012-12-23 23:00:00 | 2.34 |
| 2012-12-24 | 2.34 |
| 2012-12-24 01:00:00 | 2.34 |
| 2012-12-24 02:00:00 | 2.6 |
| 2012-12-24 03:00:00 | 2.34 |
| 2012-12-24 04:00:00 | 2.34 |
| 2012-12-24 05:00:00 | 2.34 |
| 2012-12-24 06:00:00 | 2.34 |
| 2012-12-24 07:00:00 | 2.34 |
| 2012-12-24 08:00:00 | 2.34 |
| 2012-12-24 09:00:00 | 2.34 |
| 2012-12-24 10:00:00 | 2.34 |
| 2012-12-24 11:00:00 | 2.34 |
| 2012-12-24 12:00:00 | 2.34 |
| 2012-12-24 13:00:00 | 2.34 |
| 2012-12-24 14:00:00 | 2.34 |
| 2012-12-24 15:00:00 | 2.34 |
| 2012-12-24 16:00:00 | 2.34 |
| 2012-12-24 17:00:00 | 2.34 |
| 2012-12-24 18:00:00 | 2.34 |
| 2012-12-24 19:00:00 | 2.34 |
| 2012-12-24 20:00:00 | 2.34 |
| 2012-12-24 21:00:00 | 2.34 |
| 2012-12-24 22:00:00 | 2.34 |
| 2012-12-24 23:00:00 | 2.34 |
| 2012-12-25 | 2.34 |
| 2012-12-25 01:00:00 | 2.34 |
| 2012-12-25 02:00:00 | 2.34 |
| 2012-12-25 03:00:00 | 2.6 |
| 2012-12-25 04:00:00 | 2.34 |
| 2012-12-25 05:00:00 | 2.34 |
| 2012-12-25 06:00:00 | 2.34 |
| 2012-12-25 07:00:00 | 2.34 |
| 2012-12-25 08:00:00 | 2.34 |
| 2012-12-25 09:00:00 | 2.34 |
| 2012-12-25 10:00:00 | 2.34 |
| 2012-12-25 11:00:00 | 2.34 |
| 2012-12-25 12:00:00 | 2.34 |
| 2012-12-25 13:00:00 | 2.34 |
| 2012-12-25 14:00:00 | 2.34 |
| 2012-12-25 15:00:00 | 2.34 |
| 2012-12-25 16:00:00 | 2.34 |
| 2012-12-25 17:00:00 | 2.34 |
| 2012-12-25 18:00:00 | 2.34 |
| 2012-12-25 19:00:00 | 2.34 |
| 2012-12-25 20:00:00 | 2.34 |
| 2012-12-25 21:00:00 | 2.6 |
| 2012-12-25 22:00:00 | 2.34 |
| 2012-12-25 23:00:00 | 2.34 |
| 2012-12-26 | 2.34 |
| 2012-12-26 01:00:00 | 2.34 |
| 2012-12-26 02:00:00 | 2.34 |
| 2012-12-26 03:00:00 | 2.34 |
| 2012-12-26 04:00:00 | 2.6 |
| 2012-12-26 05:00:00 | 2.34 |
| 2012-12-26 06:00:00 | 2.34 |
| 2012-12-26 07:00:00 | 2.34 |
| 2012-12-26 08:00:00 | 2.34 |
| 2012-12-26 09:00:00 | 2.34 |
| 2012-12-26 10:00:00 | 2.34 |
| 2012-12-26 11:00:00 | 2.08 |
| 2012-12-26 12:00:00 | 2.34 |
| 2012-12-26 13:00:00 | 2.34 |
| 2012-12-26 14:00:00 | 2.34 |
| 2012-12-26 15:00:00 | 2.34 |
| 2012-12-26 16:00:00 | 2.34 |
| 2012-12-26 17:00:00 | 2.34 |
| 2012-12-26 18:00:00 | 2.34 |
| 2012-12-26 19:00:00 | 2.34 |
| 2012-12-26 20:00:00 | 2.34 |
| 2012-12-26 21:00:00 | 2.34 |
| 2012-12-26 22:00:00 | 2.34 |
| 2012-12-26 23:00:00 | 2.34 |
| 2012-12-27 | 2.34 |
| 2012-12-27 01:00:00 | 2.34 |
| 2012-12-27 02:00:00 | 2.34 |
| 2012-12-27 03:00:00 | 2.6 |
| 2012-12-27 04:00:00 | 2.34 |
| 2012-12-27 05:00:00 | 2.34 |
| 2012-12-27 06:00:00 | 2.34 |
| 2012-12-27 07:00:00 | 2.34 |
| 2012-12-27 08:00:00 | 2.34 |
| 2012-12-27 09:00:00 | 2.34 |
| 2012-12-27 10:00:00 | 2.34 |
| 2012-12-27 11:00:00 | 2.34 |
| 2012-12-27 12:00:00 | 2.34 |
| 2012-12-27 13:00:00 | 2.34 |
| 2012-12-27 14:00:00 | 3.12 |
| 2012-12-27 15:00:00 | 2.6 |
| 2012-12-27 16:00:00 | 2.34 |
| 2012-12-27 17:00:00 | 2.34 |
| 2012-12-27 18:00:00 | 2.34 |
| 2012-12-27 19:00:00 | 2.34 |
| 2012-12-27 20:00:00 | 2.6 |
| 2012-12-27 21:00:00 | 2.34 |
| 2012-12-27 22:00:00 | 2.34 |
| 2012-12-27 23:00:00 | 2.6 |
| 2012-12-28 | 2.34 |
| 2012-12-28 01:00:00 | 2.34 |
| 2012-12-28 02:00:00 | 2.34 |
| 2012-12-28 03:00:00 | 2.34 |
| 2012-12-28 04:00:00 | 2.34 |
| 2012-12-28 05:00:00 | 2.34 |
| 2012-12-28 06:00:00 | 2.34 |
| 2012-12-28 07:00:00 | 2.34 |
| 2012-12-28 08:00:00 | 2.34 |
| 2012-12-28 09:00:00 | 2.34 |
| 2012-12-28 10:00:00 | 2.34 |
| 2012-12-28 11:00:00 | 2.34 |
| 2012-12-28 12:00:00 | 2.34 |
| 2012-12-28 13:00:00 | 2.34 |
| 2012-12-28 14:00:00 | 2.34 |
| 2012-12-28 15:00:00 | 2.6 |
| 2012-12-28 16:00:00 | 2.08 |
| 2012-12-28 17:00:00 | 2.34 |
| 2012-12-28 18:00:00 | 2.34 |
| 2012-12-28 19:00:00 | 2.34 |
| 2012-12-28 20:00:00 | 2.34 |
| 2012-12-28 21:00:00 | 2.34 |
| 2012-12-28 22:00:00 | 2.34 |
| 2012-12-28 23:00:00 | 2.34 |
| 2012-12-29 | 2.34 |
| 2012-12-29 01:00:00 | 2.34 |
| 2012-12-29 02:00:00 | 2.34 |
| 2012-12-29 03:00:00 | 2.34 |
| 2012-12-29 04:00:00 | 2.6 |
| 2012-12-29 05:00:00 | 2.34 |
| 2012-12-29 06:00:00 | 2.34 |
| 2012-12-29 07:00:00 | 2.34 |
| 2012-12-29 08:00:00 | 2.34 |
| 2012-12-29 09:00:00 | 2.34 |
| 2012-12-29 10:00:00 | 2.34 |
| 2012-12-29 11:00:00 | 2.34 |
| 2012-12-29 12:00:00 | 2.34 |
| 2012-12-29 13:00:00 | 2.34 |
| 2012-12-29 14:00:00 | 2.34 |
| 2012-12-29 15:00:00 | 2.08 |
| 2012-12-29 16:00:00 | 2.34 |
| 2012-12-29 17:00:00 | 2.34 |
| 2012-12-29 18:00:00 | 2.34 |
| 2012-12-29 19:00:00 | 2.34 |
| 2012-12-29 20:00:00 | 2.34 |
| 2012-12-29 21:00:00 | 2.34 |
| 2012-12-29 22:00:00 | 2.34 |
| 2012-12-29 23:00:00 | 2.34 |
| 2012-12-30 | 2.34 |
| 2012-12-30 01:00:00 | 2.6 |
| 2012-12-30 02:00:00 | 2.34 |
| 2012-12-30 03:00:00 | 2.34 |
| 2012-12-30 04:00:00 | 2.34 |
| 2012-12-30 05:00:00 | 2.34 |
| 2012-12-30 06:00:00 | 2.34 |
| 2012-12-30 07:00:00 | 2.34 |
| 2012-12-30 08:00:00 | 2.34 |
| 2012-12-30 09:00:00 | 2.34 |
| 2012-12-30 10:00:00 | 2.34 |
| 2012-12-30 11:00:00 | 2.34 |
| 2012-12-30 12:00:00 | 2.34 |
| 2012-12-30 13:00:00 | 2.34 |
| 2012-12-30 14:00:00 | 2.34 |
| 2012-12-30 15:00:00 | 2.34 |
| 2012-12-30 16:00:00 | 2.34 |
| 2012-12-30 17:00:00 | 2.34 |
| 2012-12-30 18:00:00 | 2.34 |
| 2012-12-30 19:00:00 | 2.34 |
| 2012-12-30 20:00:00 | 2.34 |
| 2012-12-30 21:00:00 | 2.34 |
| 2012-12-30 22:00:00 | 2.6 |
| 2012-12-30 23:00:00 | 2.34 |
| 2012-12-31 | 2.34 |
| 2012-12-31 | 2.6 |
| 2012-12-31 | 2.34 |
| 2012-12-31 | 2.34 |
| 2012-12-31 | 2.34 |
| 2012-12-31 | 2.6 |
| 2012-12-31 | 2.34 |
| 2012-12-31 | 2.34 |
| 2012-12-31 | 2.6 |
| 2012-12-31 | 2.34 |
| 2012-12-31 | 2.34 |
| 2012-12-31 | 2.34 |
| 2012-12-31 | 2.6 |
| 2012-12-31 | 2.34 |
| 2012-12-31 | 2.34 |
| 2012-12-31 | 2.34 |
| 2012-12-31 | 2.6 |
| 2012-12-31 | 2.34 |
| 2012-12-31 | 2.34 |
| 2012-12-31 | 2.34 |
| 2012-12-31 | 2.6 |
| 2012-12-31 | 2.34 |
| 2012-12-31 | 2.34 |
| 2012-12-31 | 2.34 |
| 2013-01-01 | 2.34 |